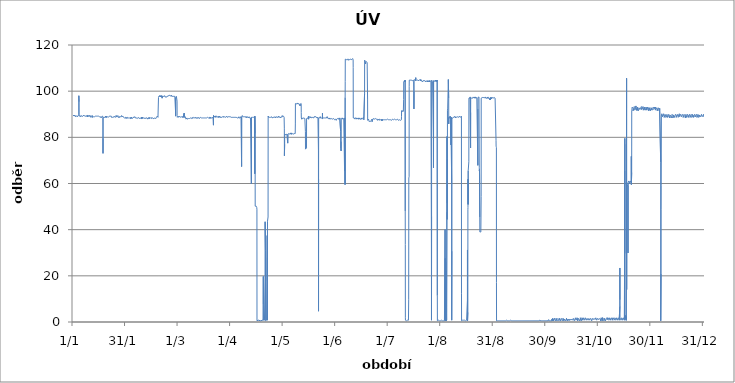
| Category | Series 0 |
|---|---|
| 2012-01-01 01:00:00 | 89.44 |
| 2012-01-01 02:00:00 | 89.7 |
| 2012-01-01 03:00:00 | 89.7 |
| 2012-01-01 04:00:00 | 89.44 |
| 2012-01-01 05:00:00 | 89.7 |
| 2012-01-01 06:00:00 | 89.7 |
| 2012-01-01 07:00:00 | 89.44 |
| 2012-01-01 08:00:00 | 89.7 |
| 2012-01-01 09:00:00 | 89.7 |
| 2012-01-01 10:00:00 | 89.7 |
| 2012-01-01 11:00:00 | 89.44 |
| 2012-01-01 12:00:00 | 89.44 |
| 2012-01-01 13:00:00 | 89.44 |
| 2012-01-01 14:00:00 | 89.44 |
| 2012-01-01 15:00:00 | 89.44 |
| 2012-01-01 16:00:00 | 89.44 |
| 2012-01-01 17:00:00 | 89.44 |
| 2012-01-01 18:00:00 | 89.18 |
| 2012-01-01 19:00:00 | 89.18 |
| 2012-01-01 20:00:00 | 89.44 |
| 2012-01-01 21:00:00 | 89.44 |
| 2012-01-01 22:00:00 | 89.44 |
| 2012-01-01 23:00:00 | 89.44 |
| 2012-01-02 | 89.7 |
| 2012-01-02 01:00:00 | 89.7 |
| 2012-01-02 02:00:00 | 89.44 |
| 2012-01-02 03:00:00 | 89.44 |
| 2012-01-02 04:00:00 | 89.7 |
| 2012-01-02 05:00:00 | 89.44 |
| 2012-01-02 06:00:00 | 89.44 |
| 2012-01-02 07:00:00 | 89.18 |
| 2012-01-02 08:00:00 | 89.18 |
| 2012-01-02 09:00:00 | 89.18 |
| 2012-01-02 10:00:00 | 88.92 |
| 2012-01-02 11:00:00 | 89.18 |
| 2012-01-02 12:00:00 | 89.18 |
| 2012-01-02 13:00:00 | 89.18 |
| 2012-01-02 14:00:00 | 89.18 |
| 2012-01-02 15:00:00 | 89.18 |
| 2012-01-02 16:00:00 | 89.18 |
| 2012-01-02 17:00:00 | 89.18 |
| 2012-01-02 18:00:00 | 88.92 |
| 2012-01-02 19:00:00 | 89.44 |
| 2012-01-02 20:00:00 | 89.18 |
| 2012-01-02 21:00:00 | 89.18 |
| 2012-01-02 22:00:00 | 89.18 |
| 2012-01-02 23:00:00 | 89.44 |
| 2012-01-03 | 89.18 |
| 2012-01-03 01:00:00 | 89.44 |
| 2012-01-03 02:00:00 | 89.44 |
| 2012-01-03 03:00:00 | 89.44 |
| 2012-01-03 04:00:00 | 89.44 |
| 2012-01-03 05:00:00 | 89.44 |
| 2012-01-03 06:00:00 | 89.18 |
| 2012-01-03 07:00:00 | 89.18 |
| 2012-01-03 08:00:00 | 88.92 |
| 2012-01-03 09:00:00 | 89.18 |
| 2012-01-03 10:00:00 | 88.92 |
| 2012-01-03 11:00:00 | 89.18 |
| 2012-01-03 12:00:00 | 88.92 |
| 2012-01-03 13:00:00 | 89.18 |
| 2012-01-03 14:00:00 | 89.18 |
| 2012-01-03 15:00:00 | 89.18 |
| 2012-01-03 16:00:00 | 88.92 |
| 2012-01-03 17:00:00 | 89.18 |
| 2012-01-03 18:00:00 | 88.92 |
| 2012-01-03 19:00:00 | 89.18 |
| 2012-01-03 20:00:00 | 89.18 |
| 2012-01-03 21:00:00 | 89.18 |
| 2012-01-03 22:00:00 | 89.18 |
| 2012-01-03 23:00:00 | 89.18 |
| 2012-01-04 | 89.44 |
| 2012-01-04 01:00:00 | 89.18 |
| 2012-01-04 02:00:00 | 89.44 |
| 2012-01-04 03:00:00 | 89.44 |
| 2012-01-04 04:00:00 | 89.18 |
| 2012-01-04 05:00:00 | 89.44 |
| 2012-01-04 06:00:00 | 89.18 |
| 2012-01-04 07:00:00 | 89.18 |
| 2012-01-04 08:00:00 | 88.92 |
| 2012-01-04 09:00:00 | 89.96 |
| 2012-01-04 10:00:00 | 98.02 |
| 2012-01-04 11:00:00 | 98.28 |
| 2012-01-04 12:00:00 | 98.02 |
| 2012-01-04 13:00:00 | 95.42 |
| 2012-01-04 14:00:00 | 89.18 |
| 2012-01-04 15:00:00 | 89.18 |
| 2012-01-04 16:00:00 | 88.92 |
| 2012-01-04 17:00:00 | 89.18 |
| 2012-01-04 18:00:00 | 89.18 |
| 2012-01-04 19:00:00 | 89.18 |
| 2012-01-04 20:00:00 | 89.18 |
| 2012-01-04 21:00:00 | 89.18 |
| 2012-01-04 22:00:00 | 89.18 |
| 2012-01-04 23:00:00 | 89.18 |
| 2012-01-05 | 89.44 |
| 2012-01-05 01:00:00 | 89.18 |
| 2012-01-05 02:00:00 | 89.44 |
| 2012-01-05 03:00:00 | 89.44 |
| 2012-01-05 04:00:00 | 89.44 |
| 2012-01-05 05:00:00 | 89.44 |
| 2012-01-05 06:00:00 | 89.18 |
| 2012-01-05 07:00:00 | 88.92 |
| 2012-01-05 08:00:00 | 89.18 |
| 2012-01-05 09:00:00 | 88.92 |
| 2012-01-05 10:00:00 | 89.18 |
| 2012-01-05 11:00:00 | 89.18 |
| 2012-01-05 12:00:00 | 88.92 |
| 2012-01-05 13:00:00 | 89.18 |
| 2012-01-05 14:00:00 | 89.18 |
| 2012-01-05 15:00:00 | 89.18 |
| 2012-01-05 16:00:00 | 88.92 |
| 2012-01-05 17:00:00 | 89.18 |
| 2012-01-05 18:00:00 | 89.18 |
| 2012-01-05 19:00:00 | 88.92 |
| 2012-01-05 20:00:00 | 89.18 |
| 2012-01-05 21:00:00 | 89.44 |
| 2012-01-05 22:00:00 | 89.18 |
| 2012-01-05 23:00:00 | 89.18 |
| 2012-01-06 | 89.44 |
| 2012-01-06 01:00:00 | 89.18 |
| 2012-01-06 02:00:00 | 89.44 |
| 2012-01-06 03:00:00 | 89.44 |
| 2012-01-06 04:00:00 | 89.18 |
| 2012-01-06 05:00:00 | 89.44 |
| 2012-01-06 06:00:00 | 89.18 |
| 2012-01-06 07:00:00 | 89.18 |
| 2012-01-06 08:00:00 | 88.92 |
| 2012-01-06 09:00:00 | 89.18 |
| 2012-01-06 10:00:00 | 88.92 |
| 2012-01-06 11:00:00 | 89.18 |
| 2012-01-06 12:00:00 | 89.18 |
| 2012-01-06 13:00:00 | 88.92 |
| 2012-01-06 14:00:00 | 89.18 |
| 2012-01-06 15:00:00 | 89.18 |
| 2012-01-06 16:00:00 | 89.18 |
| 2012-01-06 17:00:00 | 89.18 |
| 2012-01-06 18:00:00 | 88.92 |
| 2012-01-06 19:00:00 | 89.18 |
| 2012-01-06 20:00:00 | 89.18 |
| 2012-01-06 21:00:00 | 89.44 |
| 2012-01-06 22:00:00 | 89.18 |
| 2012-01-06 23:00:00 | 89.44 |
| 2012-01-07 | 89.18 |
| 2012-01-07 01:00:00 | 89.44 |
| 2012-01-07 02:00:00 | 89.44 |
| 2012-01-07 03:00:00 | 89.44 |
| 2012-01-07 04:00:00 | 89.44 |
| 2012-01-07 05:00:00 | 89.44 |
| 2012-01-07 06:00:00 | 89.7 |
| 2012-01-07 07:00:00 | 89.18 |
| 2012-01-07 08:00:00 | 89.44 |
| 2012-01-07 09:00:00 | 89.18 |
| 2012-01-07 10:00:00 | 89.18 |
| 2012-01-07 11:00:00 | 89.44 |
| 2012-01-07 12:00:00 | 89.18 |
| 2012-01-07 13:00:00 | 89.18 |
| 2012-01-07 14:00:00 | 89.18 |
| 2012-01-07 15:00:00 | 89.18 |
| 2012-01-07 16:00:00 | 89.18 |
| 2012-01-07 17:00:00 | 89.18 |
| 2012-01-07 18:00:00 | 89.18 |
| 2012-01-07 19:00:00 | 89.18 |
| 2012-01-07 20:00:00 | 89.18 |
| 2012-01-07 21:00:00 | 89.18 |
| 2012-01-07 22:00:00 | 89.44 |
| 2012-01-07 23:00:00 | 89.18 |
| 2012-01-08 | 89.44 |
| 2012-01-08 01:00:00 | 89.18 |
| 2012-01-08 02:00:00 | 89.44 |
| 2012-01-08 03:00:00 | 89.18 |
| 2012-01-08 04:00:00 | 89.44 |
| 2012-01-08 05:00:00 | 89.44 |
| 2012-01-08 06:00:00 | 89.44 |
| 2012-01-08 07:00:00 | 89.18 |
| 2012-01-08 08:00:00 | 89.18 |
| 2012-01-08 09:00:00 | 89.44 |
| 2012-01-08 10:00:00 | 88.92 |
| 2012-01-08 11:00:00 | 89.18 |
| 2012-01-08 12:00:00 | 89.18 |
| 2012-01-08 13:00:00 | 89.18 |
| 2012-01-08 14:00:00 | 89.18 |
| 2012-01-08 15:00:00 | 89.18 |
| 2012-01-08 16:00:00 | 89.18 |
| 2012-01-08 17:00:00 | 88.92 |
| 2012-01-08 18:00:00 | 89.18 |
| 2012-01-08 19:00:00 | 89.18 |
| 2012-01-08 20:00:00 | 89.18 |
| 2012-01-08 21:00:00 | 89.18 |
| 2012-01-08 22:00:00 | 89.18 |
| 2012-01-08 23:00:00 | 89.44 |
| 2012-01-09 | 89.44 |
| 2012-01-09 01:00:00 | 89.18 |
| 2012-01-09 02:00:00 | 89.44 |
| 2012-01-09 03:00:00 | 89.18 |
| 2012-01-09 04:00:00 | 89.44 |
| 2012-01-09 05:00:00 | 89.44 |
| 2012-01-09 06:00:00 | 89.18 |
| 2012-01-09 07:00:00 | 88.92 |
| 2012-01-09 08:00:00 | 89.18 |
| 2012-01-09 09:00:00 | 88.92 |
| 2012-01-09 10:00:00 | 88.92 |
| 2012-01-09 11:00:00 | 89.44 |
| 2012-01-09 12:00:00 | 88.92 |
| 2012-01-09 13:00:00 | 89.18 |
| 2012-01-09 14:00:00 | 89.18 |
| 2012-01-09 15:00:00 | 88.92 |
| 2012-01-09 16:00:00 | 89.18 |
| 2012-01-09 17:00:00 | 88.92 |
| 2012-01-09 18:00:00 | 88.92 |
| 2012-01-09 19:00:00 | 89.18 |
| 2012-01-09 20:00:00 | 89.18 |
| 2012-01-09 21:00:00 | 89.18 |
| 2012-01-09 22:00:00 | 89.18 |
| 2012-01-09 23:00:00 | 89.18 |
| 2012-01-10 | 89.18 |
| 2012-01-10 01:00:00 | 89.44 |
| 2012-01-10 02:00:00 | 89.18 |
| 2012-01-10 03:00:00 | 89.18 |
| 2012-01-10 04:00:00 | 89.44 |
| 2012-01-10 05:00:00 | 89.44 |
| 2012-01-10 06:00:00 | 89.44 |
| 2012-01-10 07:00:00 | 89.18 |
| 2012-01-10 08:00:00 | 88.92 |
| 2012-01-10 09:00:00 | 89.18 |
| 2012-01-10 10:00:00 | 89.18 |
| 2012-01-10 11:00:00 | 89.44 |
| 2012-01-10 12:00:00 | 89.18 |
| 2012-01-10 13:00:00 | 89.18 |
| 2012-01-10 14:00:00 | 89.44 |
| 2012-01-10 15:00:00 | 89.18 |
| 2012-01-10 16:00:00 | 89.18 |
| 2012-01-10 17:00:00 | 89.18 |
| 2012-01-10 18:00:00 | 89.18 |
| 2012-01-10 19:00:00 | 89.18 |
| 2012-01-10 20:00:00 | 89.44 |
| 2012-01-10 21:00:00 | 89.18 |
| 2012-01-10 22:00:00 | 89.44 |
| 2012-01-10 23:00:00 | 89.44 |
| 2012-01-11 | 89.44 |
| 2012-01-11 01:00:00 | 89.44 |
| 2012-01-11 02:00:00 | 89.44 |
| 2012-01-11 03:00:00 | 89.44 |
| 2012-01-11 04:00:00 | 89.7 |
| 2012-01-11 05:00:00 | 89.18 |
| 2012-01-11 06:00:00 | 89.44 |
| 2012-01-11 07:00:00 | 89.18 |
| 2012-01-11 08:00:00 | 88.66 |
| 2012-01-11 09:00:00 | 88.66 |
| 2012-01-11 10:00:00 | 88.92 |
| 2012-01-11 11:00:00 | 88.66 |
| 2012-01-11 12:00:00 | 88.92 |
| 2012-01-11 13:00:00 | 88.66 |
| 2012-01-11 14:00:00 | 88.66 |
| 2012-01-11 15:00:00 | 88.92 |
| 2012-01-11 16:00:00 | 88.66 |
| 2012-01-11 17:00:00 | 88.92 |
| 2012-01-11 18:00:00 | 88.66 |
| 2012-01-11 19:00:00 | 88.92 |
| 2012-01-11 20:00:00 | 88.66 |
| 2012-01-11 21:00:00 | 88.92 |
| 2012-01-11 22:00:00 | 88.92 |
| 2012-01-11 23:00:00 | 88.92 |
| 2012-01-12 | 89.18 |
| 2012-01-12 01:00:00 | 89.18 |
| 2012-01-12 02:00:00 | 89.18 |
| 2012-01-12 03:00:00 | 89.44 |
| 2012-01-12 04:00:00 | 89.44 |
| 2012-01-12 05:00:00 | 89.44 |
| 2012-01-12 06:00:00 | 89.18 |
| 2012-01-12 07:00:00 | 89.18 |
| 2012-01-12 08:00:00 | 88.66 |
| 2012-01-12 09:00:00 | 88.92 |
| 2012-01-12 10:00:00 | 88.92 |
| 2012-01-12 11:00:00 | 88.92 |
| 2012-01-12 12:00:00 | 88.92 |
| 2012-01-12 13:00:00 | 88.92 |
| 2012-01-12 14:00:00 | 88.92 |
| 2012-01-12 15:00:00 | 88.92 |
| 2012-01-12 16:00:00 | 88.92 |
| 2012-01-12 17:00:00 | 88.66 |
| 2012-01-12 18:00:00 | 88.92 |
| 2012-01-12 19:00:00 | 88.92 |
| 2012-01-12 20:00:00 | 88.92 |
| 2012-01-12 21:00:00 | 88.92 |
| 2012-01-12 22:00:00 | 88.92 |
| 2012-01-12 23:00:00 | 88.92 |
| 2012-01-13 | 89.18 |
| 2012-01-13 01:00:00 | 89.18 |
| 2012-01-13 02:00:00 | 88.92 |
| 2012-01-13 03:00:00 | 89.18 |
| 2012-01-13 04:00:00 | 89.18 |
| 2012-01-13 05:00:00 | 89.18 |
| 2012-01-13 06:00:00 | 88.92 |
| 2012-01-13 07:00:00 | 88.66 |
| 2012-01-13 08:00:00 | 88.92 |
| 2012-01-13 09:00:00 | 88.66 |
| 2012-01-13 10:00:00 | 88.92 |
| 2012-01-13 11:00:00 | 88.92 |
| 2012-01-13 12:00:00 | 88.92 |
| 2012-01-13 13:00:00 | 88.92 |
| 2012-01-13 14:00:00 | 88.92 |
| 2012-01-13 15:00:00 | 88.92 |
| 2012-01-13 16:00:00 | 88.92 |
| 2012-01-13 17:00:00 | 88.66 |
| 2012-01-13 18:00:00 | 88.92 |
| 2012-01-13 19:00:00 | 88.66 |
| 2012-01-13 20:00:00 | 88.92 |
| 2012-01-13 21:00:00 | 88.92 |
| 2012-01-13 22:00:00 | 88.92 |
| 2012-01-13 23:00:00 | 88.92 |
| 2012-01-14 | 88.92 |
| 2012-01-14 01:00:00 | 88.92 |
| 2012-01-14 02:00:00 | 89.18 |
| 2012-01-14 03:00:00 | 89.18 |
| 2012-01-14 04:00:00 | 89.44 |
| 2012-01-14 05:00:00 | 89.44 |
| 2012-01-14 06:00:00 | 89.44 |
| 2012-01-14 07:00:00 | 89.44 |
| 2012-01-14 08:00:00 | 89.18 |
| 2012-01-14 09:00:00 | 89.44 |
| 2012-01-14 10:00:00 | 89.44 |
| 2012-01-14 11:00:00 | 89.18 |
| 2012-01-14 12:00:00 | 89.18 |
| 2012-01-14 13:00:00 | 88.92 |
| 2012-01-14 14:00:00 | 89.18 |
| 2012-01-14 15:00:00 | 89.18 |
| 2012-01-14 16:00:00 | 89.18 |
| 2012-01-14 17:00:00 | 88.92 |
| 2012-01-14 18:00:00 | 89.18 |
| 2012-01-14 19:00:00 | 89.18 |
| 2012-01-14 20:00:00 | 89.18 |
| 2012-01-14 21:00:00 | 89.18 |
| 2012-01-14 22:00:00 | 89.18 |
| 2012-01-14 23:00:00 | 89.18 |
| 2012-01-15 | 89.18 |
| 2012-01-15 01:00:00 | 89.18 |
| 2012-01-15 02:00:00 | 89.44 |
| 2012-01-15 03:00:00 | 89.18 |
| 2012-01-15 04:00:00 | 89.44 |
| 2012-01-15 05:00:00 | 89.18 |
| 2012-01-15 06:00:00 | 89.18 |
| 2012-01-15 07:00:00 | 89.44 |
| 2012-01-15 08:00:00 | 89.18 |
| 2012-01-15 09:00:00 | 89.18 |
| 2012-01-15 10:00:00 | 89.18 |
| 2012-01-15 11:00:00 | 89.18 |
| 2012-01-15 12:00:00 | 89.18 |
| 2012-01-15 13:00:00 | 89.18 |
| 2012-01-15 14:00:00 | 89.18 |
| 2012-01-15 15:00:00 | 89.44 |
| 2012-01-15 16:00:00 | 89.18 |
| 2012-01-15 17:00:00 | 89.18 |
| 2012-01-15 18:00:00 | 88.92 |
| 2012-01-15 19:00:00 | 89.18 |
| 2012-01-15 20:00:00 | 89.18 |
| 2012-01-15 21:00:00 | 88.92 |
| 2012-01-15 22:00:00 | 89.18 |
| 2012-01-15 23:00:00 | 89.44 |
| 2012-01-16 | 89.18 |
| 2012-01-16 01:00:00 | 89.18 |
| 2012-01-16 02:00:00 | 89.18 |
| 2012-01-16 03:00:00 | 89.44 |
| 2012-01-16 04:00:00 | 89.44 |
| 2012-01-16 05:00:00 | 89.18 |
| 2012-01-16 06:00:00 | 89.18 |
| 2012-01-16 07:00:00 | 89.18 |
| 2012-01-16 08:00:00 | 88.92 |
| 2012-01-16 09:00:00 | 89.18 |
| 2012-01-16 10:00:00 | 88.92 |
| 2012-01-16 11:00:00 | 88.92 |
| 2012-01-16 12:00:00 | 88.66 |
| 2012-01-16 13:00:00 | 88.92 |
| 2012-01-16 14:00:00 | 88.92 |
| 2012-01-16 15:00:00 | 88.92 |
| 2012-01-16 16:00:00 | 88.92 |
| 2012-01-16 17:00:00 | 88.66 |
| 2012-01-16 18:00:00 | 88.92 |
| 2012-01-16 19:00:00 | 88.66 |
| 2012-01-16 20:00:00 | 88.66 |
| 2012-01-16 21:00:00 | 88.92 |
| 2012-01-16 22:00:00 | 88.92 |
| 2012-01-16 23:00:00 | 88.66 |
| 2012-01-17 | 88.92 |
| 2012-01-17 01:00:00 | 88.92 |
| 2012-01-17 02:00:00 | 88.66 |
| 2012-01-17 03:00:00 | 88.92 |
| 2012-01-17 04:00:00 | 88.92 |
| 2012-01-17 05:00:00 | 88.66 |
| 2012-01-17 06:00:00 | 88.92 |
| 2012-01-17 07:00:00 | 88.66 |
| 2012-01-17 08:00:00 | 88.4 |
| 2012-01-17 09:00:00 | 88.66 |
| 2012-01-17 10:00:00 | 88.4 |
| 2012-01-17 11:00:00 | 88.66 |
| 2012-01-17 12:00:00 | 88.66 |
| 2012-01-17 13:00:00 | 88.92 |
| 2012-01-17 14:00:00 | 88.66 |
| 2012-01-17 15:00:00 | 88.92 |
| 2012-01-17 16:00:00 | 88.92 |
| 2012-01-17 17:00:00 | 88.92 |
| 2012-01-17 18:00:00 | 88.92 |
| 2012-01-17 19:00:00 | 88.92 |
| 2012-01-17 20:00:00 | 89.18 |
| 2012-01-17 21:00:00 | 88.92 |
| 2012-01-17 22:00:00 | 88.92 |
| 2012-01-17 23:00:00 | 89.18 |
| 2012-01-18 | 89.18 |
| 2012-01-18 01:00:00 | 88.92 |
| 2012-01-18 02:00:00 | 89.18 |
| 2012-01-18 03:00:00 | 89.18 |
| 2012-01-18 04:00:00 | 89.18 |
| 2012-01-18 05:00:00 | 89.18 |
| 2012-01-18 06:00:00 | 89.18 |
| 2012-01-18 07:00:00 | 88.92 |
| 2012-01-18 08:00:00 | 88.66 |
| 2012-01-18 09:00:00 | 88.92 |
| 2012-01-18 10:00:00 | 73.06 |
| 2012-01-18 11:00:00 | 79.56 |
| 2012-01-18 12:00:00 | 88.66 |
| 2012-01-18 13:00:00 | 88.66 |
| 2012-01-18 14:00:00 | 88.66 |
| 2012-01-18 15:00:00 | 88.66 |
| 2012-01-18 16:00:00 | 88.66 |
| 2012-01-18 17:00:00 | 88.66 |
| 2012-01-18 18:00:00 | 88.66 |
| 2012-01-18 19:00:00 | 88.66 |
| 2012-01-18 20:00:00 | 88.66 |
| 2012-01-18 21:00:00 | 88.66 |
| 2012-01-18 22:00:00 | 88.92 |
| 2012-01-18 23:00:00 | 88.92 |
| 2012-01-19 | 88.92 |
| 2012-01-19 01:00:00 | 88.66 |
| 2012-01-19 02:00:00 | 88.66 |
| 2012-01-19 03:00:00 | 88.92 |
| 2012-01-19 04:00:00 | 88.66 |
| 2012-01-19 05:00:00 | 88.92 |
| 2012-01-19 06:00:00 | 88.92 |
| 2012-01-19 07:00:00 | 88.66 |
| 2012-01-19 08:00:00 | 88.66 |
| 2012-01-19 09:00:00 | 88.66 |
| 2012-01-19 10:00:00 | 88.66 |
| 2012-01-19 11:00:00 | 88.66 |
| 2012-01-19 12:00:00 | 88.66 |
| 2012-01-19 13:00:00 | 88.66 |
| 2012-01-19 14:00:00 | 88.92 |
| 2012-01-19 15:00:00 | 88.66 |
| 2012-01-19 16:00:00 | 88.66 |
| 2012-01-19 17:00:00 | 88.66 |
| 2012-01-19 18:00:00 | 88.66 |
| 2012-01-19 19:00:00 | 88.66 |
| 2012-01-19 20:00:00 | 88.66 |
| 2012-01-19 21:00:00 | 88.92 |
| 2012-01-19 22:00:00 | 88.92 |
| 2012-01-19 23:00:00 | 88.92 |
| 2012-01-20 | 89.18 |
| 2012-01-20 01:00:00 | 88.92 |
| 2012-01-20 02:00:00 | 88.66 |
| 2012-01-20 03:00:00 | 89.18 |
| 2012-01-20 04:00:00 | 88.92 |
| 2012-01-20 05:00:00 | 89.18 |
| 2012-01-20 06:00:00 | 89.18 |
| 2012-01-20 07:00:00 | 88.92 |
| 2012-01-20 08:00:00 | 88.66 |
| 2012-01-20 09:00:00 | 88.4 |
| 2012-01-20 10:00:00 | 88.66 |
| 2012-01-20 11:00:00 | 88.92 |
| 2012-01-20 12:00:00 | 88.4 |
| 2012-01-20 13:00:00 | 88.66 |
| 2012-01-20 14:00:00 | 88.66 |
| 2012-01-20 15:00:00 | 88.66 |
| 2012-01-20 16:00:00 | 88.66 |
| 2012-01-20 17:00:00 | 88.66 |
| 2012-01-20 18:00:00 | 88.66 |
| 2012-01-20 19:00:00 | 88.66 |
| 2012-01-20 20:00:00 | 88.66 |
| 2012-01-20 21:00:00 | 88.66 |
| 2012-01-20 22:00:00 | 88.92 |
| 2012-01-20 23:00:00 | 88.92 |
| 2012-01-21 | 88.92 |
| 2012-01-21 01:00:00 | 88.92 |
| 2012-01-21 02:00:00 | 88.92 |
| 2012-01-21 03:00:00 | 88.92 |
| 2012-01-21 04:00:00 | 89.18 |
| 2012-01-21 05:00:00 | 89.18 |
| 2012-01-21 06:00:00 | 88.92 |
| 2012-01-21 07:00:00 | 88.92 |
| 2012-01-21 08:00:00 | 88.92 |
| 2012-01-21 09:00:00 | 88.66 |
| 2012-01-21 10:00:00 | 88.92 |
| 2012-01-21 11:00:00 | 88.92 |
| 2012-01-21 12:00:00 | 88.66 |
| 2012-01-21 13:00:00 | 88.92 |
| 2012-01-21 14:00:00 | 88.92 |
| 2012-01-21 15:00:00 | 88.92 |
| 2012-01-21 16:00:00 | 88.66 |
| 2012-01-21 17:00:00 | 88.66 |
| 2012-01-21 18:00:00 | 88.92 |
| 2012-01-21 19:00:00 | 88.92 |
| 2012-01-21 20:00:00 | 88.92 |
| 2012-01-21 21:00:00 | 88.92 |
| 2012-01-21 22:00:00 | 88.92 |
| 2012-01-21 23:00:00 | 88.92 |
| 2012-01-22 | 88.92 |
| 2012-01-22 01:00:00 | 89.18 |
| 2012-01-22 02:00:00 | 88.92 |
| 2012-01-22 03:00:00 | 88.92 |
| 2012-01-22 04:00:00 | 89.18 |
| 2012-01-22 05:00:00 | 89.18 |
| 2012-01-22 06:00:00 | 89.18 |
| 2012-01-22 07:00:00 | 88.92 |
| 2012-01-22 08:00:00 | 89.18 |
| 2012-01-22 09:00:00 | 88.92 |
| 2012-01-22 10:00:00 | 89.18 |
| 2012-01-22 11:00:00 | 89.18 |
| 2012-01-22 12:00:00 | 88.92 |
| 2012-01-22 13:00:00 | 89.18 |
| 2012-01-22 14:00:00 | 89.44 |
| 2012-01-22 15:00:00 | 89.18 |
| 2012-01-22 16:00:00 | 88.92 |
| 2012-01-22 17:00:00 | 89.18 |
| 2012-01-22 18:00:00 | 88.92 |
| 2012-01-22 19:00:00 | 89.18 |
| 2012-01-22 20:00:00 | 89.18 |
| 2012-01-22 21:00:00 | 89.18 |
| 2012-01-22 22:00:00 | 89.18 |
| 2012-01-22 23:00:00 | 89.18 |
| 2012-01-23 | 88.92 |
| 2012-01-23 01:00:00 | 89.18 |
| 2012-01-23 02:00:00 | 89.18 |
| 2012-01-23 03:00:00 | 89.18 |
| 2012-01-23 04:00:00 | 89.18 |
| 2012-01-23 05:00:00 | 89.18 |
| 2012-01-23 06:00:00 | 89.18 |
| 2012-01-23 07:00:00 | 88.66 |
| 2012-01-23 08:00:00 | 88.4 |
| 2012-01-23 09:00:00 | 88.4 |
| 2012-01-23 10:00:00 | 88.4 |
| 2012-01-23 11:00:00 | 88.4 |
| 2012-01-23 12:00:00 | 88.4 |
| 2012-01-23 13:00:00 | 88.66 |
| 2012-01-23 14:00:00 | 88.66 |
| 2012-01-23 15:00:00 | 88.66 |
| 2012-01-23 16:00:00 | 88.4 |
| 2012-01-23 17:00:00 | 88.4 |
| 2012-01-23 18:00:00 | 88.4 |
| 2012-01-23 19:00:00 | 88.92 |
| 2012-01-23 20:00:00 | 88.66 |
| 2012-01-23 21:00:00 | 88.66 |
| 2012-01-23 22:00:00 | 88.92 |
| 2012-01-23 23:00:00 | 88.66 |
| 2012-01-24 | 88.92 |
| 2012-01-24 01:00:00 | 88.92 |
| 2012-01-24 02:00:00 | 88.66 |
| 2012-01-24 03:00:00 | 88.92 |
| 2012-01-24 04:00:00 | 88.66 |
| 2012-01-24 05:00:00 | 88.92 |
| 2012-01-24 06:00:00 | 88.66 |
| 2012-01-24 07:00:00 | 88.66 |
| 2012-01-24 08:00:00 | 88.4 |
| 2012-01-24 09:00:00 | 88.66 |
| 2012-01-24 10:00:00 | 88.4 |
| 2012-01-24 11:00:00 | 88.66 |
| 2012-01-24 12:00:00 | 88.4 |
| 2012-01-24 13:00:00 | 88.66 |
| 2012-01-24 14:00:00 | 88.92 |
| 2012-01-24 15:00:00 | 88.66 |
| 2012-01-24 16:00:00 | 88.66 |
| 2012-01-24 17:00:00 | 88.66 |
| 2012-01-24 18:00:00 | 88.4 |
| 2012-01-24 19:00:00 | 88.92 |
| 2012-01-24 20:00:00 | 88.66 |
| 2012-01-24 21:00:00 | 89.18 |
| 2012-01-24 22:00:00 | 88.92 |
| 2012-01-24 23:00:00 | 89.18 |
| 2012-01-25 | 89.44 |
| 2012-01-25 01:00:00 | 89.44 |
| 2012-01-25 02:00:00 | 89.44 |
| 2012-01-25 03:00:00 | 89.44 |
| 2012-01-25 04:00:00 | 89.44 |
| 2012-01-25 05:00:00 | 89.18 |
| 2012-01-25 06:00:00 | 89.18 |
| 2012-01-25 07:00:00 | 88.92 |
| 2012-01-25 08:00:00 | 88.66 |
| 2012-01-25 09:00:00 | 88.92 |
| 2012-01-25 10:00:00 | 88.66 |
| 2012-01-25 11:00:00 | 88.66 |
| 2012-01-25 12:00:00 | 88.92 |
| 2012-01-25 13:00:00 | 88.92 |
| 2012-01-25 14:00:00 | 88.92 |
| 2012-01-25 15:00:00 | 88.92 |
| 2012-01-25 16:00:00 | 88.92 |
| 2012-01-25 17:00:00 | 88.92 |
| 2012-01-25 18:00:00 | 88.92 |
| 2012-01-25 19:00:00 | 88.92 |
| 2012-01-25 20:00:00 | 88.92 |
| 2012-01-25 21:00:00 | 88.92 |
| 2012-01-25 22:00:00 | 88.92 |
| 2012-01-25 23:00:00 | 89.18 |
| 2012-01-26 | 89.18 |
| 2012-01-26 01:00:00 | 89.44 |
| 2012-01-26 02:00:00 | 89.18 |
| 2012-01-26 03:00:00 | 89.44 |
| 2012-01-26 04:00:00 | 89.18 |
| 2012-01-26 05:00:00 | 89.44 |
| 2012-01-26 06:00:00 | 88.92 |
| 2012-01-26 07:00:00 | 88.92 |
| 2012-01-26 08:00:00 | 88.92 |
| 2012-01-26 09:00:00 | 89.18 |
| 2012-01-26 10:00:00 | 88.92 |
| 2012-01-26 11:00:00 | 89.18 |
| 2012-01-26 12:00:00 | 88.92 |
| 2012-01-26 13:00:00 | 89.18 |
| 2012-01-26 14:00:00 | 89.18 |
| 2012-01-26 15:00:00 | 89.18 |
| 2012-01-26 16:00:00 | 88.92 |
| 2012-01-26 17:00:00 | 88.92 |
| 2012-01-26 18:00:00 | 88.92 |
| 2012-01-26 19:00:00 | 88.92 |
| 2012-01-26 20:00:00 | 88.92 |
| 2012-01-26 21:00:00 | 89.18 |
| 2012-01-26 22:00:00 | 89.18 |
| 2012-01-26 23:00:00 | 89.18 |
| 2012-01-27 | 89.44 |
| 2012-01-27 01:00:00 | 89.18 |
| 2012-01-27 02:00:00 | 89.18 |
| 2012-01-27 03:00:00 | 89.44 |
| 2012-01-27 04:00:00 | 89.18 |
| 2012-01-27 05:00:00 | 89.18 |
| 2012-01-27 06:00:00 | 89.18 |
| 2012-01-27 07:00:00 | 89.18 |
| 2012-01-27 08:00:00 | 88.92 |
| 2012-01-27 09:00:00 | 88.66 |
| 2012-01-27 10:00:00 | 88.66 |
| 2012-01-27 11:00:00 | 88.66 |
| 2012-01-27 12:00:00 | 88.66 |
| 2012-01-27 13:00:00 | 88.66 |
| 2012-01-27 14:00:00 | 88.66 |
| 2012-01-27 15:00:00 | 88.92 |
| 2012-01-27 16:00:00 | 88.66 |
| 2012-01-27 17:00:00 | 88.4 |
| 2012-01-27 18:00:00 | 88.66 |
| 2012-01-27 19:00:00 | 88.92 |
| 2012-01-27 20:00:00 | 88.66 |
| 2012-01-27 21:00:00 | 88.92 |
| 2012-01-27 22:00:00 | 88.92 |
| 2012-01-27 23:00:00 | 88.92 |
| 2012-01-28 | 89.18 |
| 2012-01-28 01:00:00 | 88.92 |
| 2012-01-28 02:00:00 | 89.18 |
| 2012-01-28 03:00:00 | 89.18 |
| 2012-01-28 04:00:00 | 89.18 |
| 2012-01-28 05:00:00 | 89.18 |
| 2012-01-28 06:00:00 | 89.18 |
| 2012-01-28 07:00:00 | 89.18 |
| 2012-01-28 08:00:00 | 89.18 |
| 2012-01-28 09:00:00 | 88.92 |
| 2012-01-28 10:00:00 | 89.18 |
| 2012-01-28 11:00:00 | 88.92 |
| 2012-01-28 12:00:00 | 89.18 |
| 2012-01-28 13:00:00 | 89.18 |
| 2012-01-28 14:00:00 | 89.18 |
| 2012-01-28 15:00:00 | 89.18 |
| 2012-01-28 16:00:00 | 88.92 |
| 2012-01-28 17:00:00 | 88.92 |
| 2012-01-28 18:00:00 | 88.92 |
| 2012-01-28 19:00:00 | 88.92 |
| 2012-01-28 20:00:00 | 88.92 |
| 2012-01-28 21:00:00 | 88.92 |
| 2012-01-28 22:00:00 | 89.18 |
| 2012-01-28 23:00:00 | 88.92 |
| 2012-01-29 | 89.18 |
| 2012-01-29 01:00:00 | 89.18 |
| 2012-01-29 02:00:00 | 89.18 |
| 2012-01-29 03:00:00 | 89.44 |
| 2012-01-29 04:00:00 | 89.18 |
| 2012-01-29 05:00:00 | 89.44 |
| 2012-01-29 06:00:00 | 89.18 |
| 2012-01-29 07:00:00 | 89.18 |
| 2012-01-29 08:00:00 | 89.44 |
| 2012-01-29 09:00:00 | 88.92 |
| 2012-01-29 10:00:00 | 89.18 |
| 2012-01-29 11:00:00 | 88.92 |
| 2012-01-29 12:00:00 | 88.92 |
| 2012-01-29 13:00:00 | 88.92 |
| 2012-01-29 14:00:00 | 89.18 |
| 2012-01-29 15:00:00 | 88.92 |
| 2012-01-29 16:00:00 | 88.92 |
| 2012-01-29 17:00:00 | 88.92 |
| 2012-01-29 18:00:00 | 88.92 |
| 2012-01-29 19:00:00 | 89.18 |
| 2012-01-29 20:00:00 | 89.18 |
| 2012-01-29 21:00:00 | 89.18 |
| 2012-01-29 22:00:00 | 88.92 |
| 2012-01-29 23:00:00 | 89.18 |
| 2012-01-30 | 89.18 |
| 2012-01-30 01:00:00 | 89.18 |
| 2012-01-30 02:00:00 | 89.18 |
| 2012-01-30 03:00:00 | 89.44 |
| 2012-01-30 04:00:00 | 89.18 |
| 2012-01-30 05:00:00 | 89.18 |
| 2012-01-30 06:00:00 | 89.18 |
| 2012-01-30 07:00:00 | 88.66 |
| 2012-01-30 08:00:00 | 88.4 |
| 2012-01-30 09:00:00 | 88.4 |
| 2012-01-30 10:00:00 | 88.4 |
| 2012-01-30 11:00:00 | 88.4 |
| 2012-01-30 12:00:00 | 88.4 |
| 2012-01-30 13:00:00 | 88.4 |
| 2012-01-30 14:00:00 | 88.4 |
| 2012-01-30 15:00:00 | 88.4 |
| 2012-01-30 16:00:00 | 88.66 |
| 2012-01-30 17:00:00 | 88.4 |
| 2012-01-30 18:00:00 | 88.4 |
| 2012-01-30 19:00:00 | 88.4 |
| 2012-01-30 20:00:00 | 88.4 |
| 2012-01-30 21:00:00 | 88.4 |
| 2012-01-30 22:00:00 | 88.66 |
| 2012-01-30 23:00:00 | 88.66 |
| 2012-01-31 | 88.66 |
| 2012-01-31 01:00:00 | 88.66 |
| 2012-01-31 02:00:00 | 88.66 |
| 2012-01-31 03:00:00 | 88.66 |
| 2012-01-31 04:00:00 | 88.66 |
| 2012-01-31 05:00:00 | 88.4 |
| 2012-01-31 06:00:00 | 88.4 |
| 2012-01-31 07:00:00 | 88.4 |
| 2012-01-31 08:00:00 | 88.14 |
| 2012-01-31 09:00:00 | 88.4 |
| 2012-01-31 10:00:00 | 88.4 |
| 2012-01-31 11:00:00 | 88.66 |
| 2012-01-31 12:00:00 | 88.4 |
| 2012-01-31 13:00:00 | 88.4 |
| 2012-01-31 14:00:00 | 88.4 |
| 2012-01-31 15:00:00 | 88.4 |
| 2012-01-31 16:00:00 | 88.66 |
| 2012-01-31 17:00:00 | 88.14 |
| 2012-01-31 18:00:00 | 88.4 |
| 2012-01-31 19:00:00 | 88.4 |
| 2012-01-31 20:00:00 | 88.4 |
| 2012-01-31 21:00:00 | 88.66 |
| 2012-01-31 22:00:00 | 88.4 |
| 2012-01-31 23:00:00 | 88.66 |
| 2012-02-01 | 88.66 |
| 2012-02-01 01:00:00 | 88.4 |
| 2012-02-01 02:00:00 | 88.66 |
| 2012-02-01 03:00:00 | 88.66 |
| 2012-02-01 04:00:00 | 88.4 |
| 2012-02-01 05:00:00 | 88.66 |
| 2012-02-01 06:00:00 | 88.66 |
| 2012-02-01 07:00:00 | 88.4 |
| 2012-02-01 08:00:00 | 88.14 |
| 2012-02-01 09:00:00 | 88.4 |
| 2012-02-01 10:00:00 | 88.4 |
| 2012-02-01 11:00:00 | 88.4 |
| 2012-02-01 12:00:00 | 88.4 |
| 2012-02-01 13:00:00 | 88.66 |
| 2012-02-01 14:00:00 | 88.4 |
| 2012-02-01 15:00:00 | 88.4 |
| 2012-02-01 16:00:00 | 88.4 |
| 2012-02-01 17:00:00 | 88.4 |
| 2012-02-01 18:00:00 | 88.4 |
| 2012-02-01 19:00:00 | 88.4 |
| 2012-02-01 20:00:00 | 88.4 |
| 2012-02-01 21:00:00 | 88.66 |
| 2012-02-01 22:00:00 | 88.4 |
| 2012-02-01 23:00:00 | 88.66 |
| 2012-02-02 | 88.4 |
| 2012-02-02 01:00:00 | 88.66 |
| 2012-02-02 02:00:00 | 88.4 |
| 2012-02-02 03:00:00 | 88.4 |
| 2012-02-02 04:00:00 | 88.66 |
| 2012-02-02 05:00:00 | 88.4 |
| 2012-02-02 06:00:00 | 88.66 |
| 2012-02-02 07:00:00 | 88.14 |
| 2012-02-02 08:00:00 | 88.4 |
| 2012-02-02 09:00:00 | 88.4 |
| 2012-02-02 10:00:00 | 88.14 |
| 2012-02-02 11:00:00 | 88.4 |
| 2012-02-02 12:00:00 | 88.14 |
| 2012-02-02 13:00:00 | 88.14 |
| 2012-02-02 14:00:00 | 88.4 |
| 2012-02-02 15:00:00 | 88.4 |
| 2012-02-02 16:00:00 | 88.4 |
| 2012-02-02 17:00:00 | 88.4 |
| 2012-02-02 18:00:00 | 88.14 |
| 2012-02-02 19:00:00 | 88.4 |
| 2012-02-02 20:00:00 | 88.66 |
| 2012-02-02 21:00:00 | 88.4 |
| 2012-02-02 22:00:00 | 88.4 |
| 2012-02-02 23:00:00 | 88.4 |
| 2012-02-03 | 88.66 |
| 2012-02-03 01:00:00 | 88.4 |
| 2012-02-03 02:00:00 | 88.66 |
| 2012-02-03 03:00:00 | 88.4 |
| 2012-02-03 04:00:00 | 88.4 |
| 2012-02-03 05:00:00 | 88.4 |
| 2012-02-03 06:00:00 | 88.4 |
| 2012-02-03 07:00:00 | 88.14 |
| 2012-02-03 08:00:00 | 88.14 |
| 2012-02-03 09:00:00 | 88.4 |
| 2012-02-03 10:00:00 | 88.14 |
| 2012-02-03 11:00:00 | 88.4 |
| 2012-02-03 12:00:00 | 88.4 |
| 2012-02-03 13:00:00 | 88.14 |
| 2012-02-03 14:00:00 | 88.66 |
| 2012-02-03 15:00:00 | 88.14 |
| 2012-02-03 16:00:00 | 88.4 |
| 2012-02-03 17:00:00 | 88.14 |
| 2012-02-03 18:00:00 | 88.14 |
| 2012-02-03 19:00:00 | 88.4 |
| 2012-02-03 20:00:00 | 88.14 |
| 2012-02-03 21:00:00 | 88.66 |
| 2012-02-03 22:00:00 | 88.4 |
| 2012-02-03 23:00:00 | 88.4 |
| 2012-02-04 | 88.4 |
| 2012-02-04 01:00:00 | 88.66 |
| 2012-02-04 02:00:00 | 88.4 |
| 2012-02-04 03:00:00 | 88.66 |
| 2012-02-04 04:00:00 | 88.4 |
| 2012-02-04 05:00:00 | 88.66 |
| 2012-02-04 06:00:00 | 88.66 |
| 2012-02-04 07:00:00 | 88.4 |
| 2012-02-04 08:00:00 | 88.66 |
| 2012-02-04 09:00:00 | 88.4 |
| 2012-02-04 10:00:00 | 88.14 |
| 2012-02-04 11:00:00 | 88.4 |
| 2012-02-04 12:00:00 | 88.4 |
| 2012-02-04 13:00:00 | 88.4 |
| 2012-02-04 14:00:00 | 88.4 |
| 2012-02-04 15:00:00 | 88.4 |
| 2012-02-04 16:00:00 | 88.4 |
| 2012-02-04 17:00:00 | 88.4 |
| 2012-02-04 18:00:00 | 88.4 |
| 2012-02-04 19:00:00 | 88.66 |
| 2012-02-04 20:00:00 | 88.4 |
| 2012-02-04 21:00:00 | 88.66 |
| 2012-02-04 22:00:00 | 88.66 |
| 2012-02-04 23:00:00 | 88.66 |
| 2012-02-05 | 88.66 |
| 2012-02-05 01:00:00 | 88.4 |
| 2012-02-05 02:00:00 | 88.66 |
| 2012-02-05 03:00:00 | 88.66 |
| 2012-02-05 04:00:00 | 88.66 |
| 2012-02-05 05:00:00 | 88.66 |
| 2012-02-05 06:00:00 | 88.66 |
| 2012-02-05 07:00:00 | 88.66 |
| 2012-02-05 08:00:00 | 88.92 |
| 2012-02-05 09:00:00 | 88.66 |
| 2012-02-05 10:00:00 | 88.92 |
| 2012-02-05 11:00:00 | 88.66 |
| 2012-02-05 12:00:00 | 88.4 |
| 2012-02-05 13:00:00 | 88.66 |
| 2012-02-05 14:00:00 | 88.4 |
| 2012-02-05 15:00:00 | 88.66 |
| 2012-02-05 16:00:00 | 88.92 |
| 2012-02-05 17:00:00 | 88.92 |
| 2012-02-05 18:00:00 | 88.92 |
| 2012-02-05 19:00:00 | 88.92 |
| 2012-02-05 20:00:00 | 88.92 |
| 2012-02-05 21:00:00 | 88.4 |
| 2012-02-05 22:00:00 | 88.66 |
| 2012-02-05 23:00:00 | 88.92 |
| 2012-02-06 | 88.66 |
| 2012-02-06 01:00:00 | 88.66 |
| 2012-02-06 02:00:00 | 88.66 |
| 2012-02-06 03:00:00 | 88.4 |
| 2012-02-06 04:00:00 | 88.66 |
| 2012-02-06 05:00:00 | 88.4 |
| 2012-02-06 06:00:00 | 88.14 |
| 2012-02-06 07:00:00 | 88.14 |
| 2012-02-06 08:00:00 | 88.4 |
| 2012-02-06 09:00:00 | 88.4 |
| 2012-02-06 10:00:00 | 88.4 |
| 2012-02-06 11:00:00 | 88.4 |
| 2012-02-06 12:00:00 | 88.4 |
| 2012-02-06 13:00:00 | 88.4 |
| 2012-02-06 14:00:00 | 88.4 |
| 2012-02-06 15:00:00 | 88.4 |
| 2012-02-06 16:00:00 | 88.4 |
| 2012-02-06 17:00:00 | 88.4 |
| 2012-02-06 18:00:00 | 88.4 |
| 2012-02-06 19:00:00 | 88.66 |
| 2012-02-06 20:00:00 | 88.4 |
| 2012-02-06 21:00:00 | 88.4 |
| 2012-02-06 22:00:00 | 88.4 |
| 2012-02-06 23:00:00 | 88.4 |
| 2012-02-07 | 88.66 |
| 2012-02-07 01:00:00 | 88.66 |
| 2012-02-07 02:00:00 | 88.4 |
| 2012-02-07 03:00:00 | 88.66 |
| 2012-02-07 04:00:00 | 88.4 |
| 2012-02-07 05:00:00 | 88.4 |
| 2012-02-07 06:00:00 | 88.66 |
| 2012-02-07 07:00:00 | 88.14 |
| 2012-02-07 08:00:00 | 88.4 |
| 2012-02-07 09:00:00 | 88.4 |
| 2012-02-07 10:00:00 | 88.14 |
| 2012-02-07 11:00:00 | 88.4 |
| 2012-02-07 12:00:00 | 88.4 |
| 2012-02-07 13:00:00 | 88.4 |
| 2012-02-07 14:00:00 | 88.4 |
| 2012-02-07 15:00:00 | 88.4 |
| 2012-02-07 16:00:00 | 88.14 |
| 2012-02-07 17:00:00 | 88.4 |
| 2012-02-07 18:00:00 | 88.4 |
| 2012-02-07 19:00:00 | 88.14 |
| 2012-02-07 20:00:00 | 88.66 |
| 2012-02-07 21:00:00 | 88.4 |
| 2012-02-07 22:00:00 | 88.66 |
| 2012-02-07 23:00:00 | 88.4 |
| 2012-02-08 | 88.66 |
| 2012-02-08 01:00:00 | 88.4 |
| 2012-02-08 02:00:00 | 88.66 |
| 2012-02-08 03:00:00 | 88.4 |
| 2012-02-08 04:00:00 | 88.4 |
| 2012-02-08 05:00:00 | 88.4 |
| 2012-02-08 06:00:00 | 88.66 |
| 2012-02-08 07:00:00 | 88.4 |
| 2012-02-08 08:00:00 | 88.14 |
| 2012-02-08 09:00:00 | 88.4 |
| 2012-02-08 10:00:00 | 88.14 |
| 2012-02-08 11:00:00 | 88.14 |
| 2012-02-08 12:00:00 | 88.4 |
| 2012-02-08 13:00:00 | 88.14 |
| 2012-02-08 14:00:00 | 88.4 |
| 2012-02-08 15:00:00 | 88.4 |
| 2012-02-08 16:00:00 | 88.4 |
| 2012-02-08 17:00:00 | 88.14 |
| 2012-02-08 18:00:00 | 88.4 |
| 2012-02-08 19:00:00 | 88.4 |
| 2012-02-08 20:00:00 | 88.4 |
| 2012-02-08 21:00:00 | 88.4 |
| 2012-02-08 22:00:00 | 88.4 |
| 2012-02-08 23:00:00 | 88.4 |
| 2012-02-09 | 88.4 |
| 2012-02-09 01:00:00 | 88.4 |
| 2012-02-09 02:00:00 | 88.4 |
| 2012-02-09 03:00:00 | 88.66 |
| 2012-02-09 04:00:00 | 88.4 |
| 2012-02-09 05:00:00 | 88.4 |
| 2012-02-09 06:00:00 | 88.4 |
| 2012-02-09 07:00:00 | 88.4 |
| 2012-02-09 08:00:00 | 88.14 |
| 2012-02-09 09:00:00 | 88.14 |
| 2012-02-09 10:00:00 | 88.14 |
| 2012-02-09 11:00:00 | 88.4 |
| 2012-02-09 12:00:00 | 88.14 |
| 2012-02-09 13:00:00 | 88.14 |
| 2012-02-09 14:00:00 | 88.4 |
| 2012-02-09 15:00:00 | 88.4 |
| 2012-02-09 16:00:00 | 88.4 |
| 2012-02-09 17:00:00 | 88.4 |
| 2012-02-09 18:00:00 | 88.14 |
| 2012-02-09 19:00:00 | 88.4 |
| 2012-02-09 20:00:00 | 88.66 |
| 2012-02-09 21:00:00 | 88.14 |
| 2012-02-09 22:00:00 | 88.66 |
| 2012-02-09 23:00:00 | 88.14 |
| 2012-02-10 | 88.66 |
| 2012-02-10 01:00:00 | 88.4 |
| 2012-02-10 02:00:00 | 88.4 |
| 2012-02-10 03:00:00 | 88.4 |
| 2012-02-10 04:00:00 | 88.66 |
| 2012-02-10 05:00:00 | 88.66 |
| 2012-02-10 06:00:00 | 88.66 |
| 2012-02-10 07:00:00 | 88.66 |
| 2012-02-10 08:00:00 | 88.66 |
| 2012-02-10 09:00:00 | 88.92 |
| 2012-02-10 10:00:00 | 88.4 |
| 2012-02-10 11:00:00 | 88.4 |
| 2012-02-10 12:00:00 | 88.4 |
| 2012-02-10 13:00:00 | 88.4 |
| 2012-02-10 14:00:00 | 88.4 |
| 2012-02-10 15:00:00 | 88.4 |
| 2012-02-10 16:00:00 | 88.14 |
| 2012-02-10 17:00:00 | 88.4 |
| 2012-02-10 18:00:00 | 88.14 |
| 2012-02-10 19:00:00 | 88.14 |
| 2012-02-10 20:00:00 | 88.14 |
| 2012-02-10 21:00:00 | 88.14 |
| 2012-02-10 22:00:00 | 88.4 |
| 2012-02-10 23:00:00 | 88.4 |
| 2012-02-11 | 88.4 |
| 2012-02-11 01:00:00 | 88.14 |
| 2012-02-11 02:00:00 | 88.4 |
| 2012-02-11 03:00:00 | 88.66 |
| 2012-02-11 04:00:00 | 88.4 |
| 2012-02-11 05:00:00 | 88.4 |
| 2012-02-11 06:00:00 | 88.14 |
| 2012-02-11 07:00:00 | 88.4 |
| 2012-02-11 08:00:00 | 88.4 |
| 2012-02-11 09:00:00 | 88.4 |
| 2012-02-11 10:00:00 | 88.14 |
| 2012-02-11 11:00:00 | 88.14 |
| 2012-02-11 12:00:00 | 88.14 |
| 2012-02-11 13:00:00 | 88.4 |
| 2012-02-11 14:00:00 | 88.14 |
| 2012-02-11 15:00:00 | 88.14 |
| 2012-02-11 16:00:00 | 88.14 |
| 2012-02-11 17:00:00 | 88.14 |
| 2012-02-11 18:00:00 | 88.14 |
| 2012-02-11 19:00:00 | 88.14 |
| 2012-02-11 20:00:00 | 88.14 |
| 2012-02-11 21:00:00 | 88.4 |
| 2012-02-11 22:00:00 | 88.14 |
| 2012-02-11 23:00:00 | 88.4 |
| 2012-02-12 | 88.14 |
| 2012-02-12 01:00:00 | 88.4 |
| 2012-02-12 02:00:00 | 88.14 |
| 2012-02-12 03:00:00 | 88.4 |
| 2012-02-12 04:00:00 | 88.4 |
| 2012-02-12 05:00:00 | 88.14 |
| 2012-02-12 06:00:00 | 88.4 |
| 2012-02-12 07:00:00 | 88.4 |
| 2012-02-12 08:00:00 | 88.4 |
| 2012-02-12 09:00:00 | 88.4 |
| 2012-02-12 10:00:00 | 88.4 |
| 2012-02-12 11:00:00 | 88.14 |
| 2012-02-12 12:00:00 | 88.4 |
| 2012-02-12 13:00:00 | 88.4 |
| 2012-02-12 14:00:00 | 88.4 |
| 2012-02-12 15:00:00 | 88.4 |
| 2012-02-12 16:00:00 | 88.14 |
| 2012-02-12 17:00:00 | 88.14 |
| 2012-02-12 18:00:00 | 88.14 |
| 2012-02-12 19:00:00 | 88.14 |
| 2012-02-12 20:00:00 | 88.14 |
| 2012-02-12 21:00:00 | 88.4 |
| 2012-02-12 22:00:00 | 88.4 |
| 2012-02-12 23:00:00 | 88.14 |
| 2012-02-13 | 88.4 |
| 2012-02-13 01:00:00 | 88.4 |
| 2012-02-13 02:00:00 | 88.14 |
| 2012-02-13 03:00:00 | 88.14 |
| 2012-02-13 04:00:00 | 88.4 |
| 2012-02-13 05:00:00 | 88.4 |
| 2012-02-13 06:00:00 | 88.14 |
| 2012-02-13 07:00:00 | 87.88 |
| 2012-02-13 08:00:00 | 88.14 |
| 2012-02-13 09:00:00 | 88.14 |
| 2012-02-13 10:00:00 | 87.88 |
| 2012-02-13 11:00:00 | 88.4 |
| 2012-02-13 12:00:00 | 88.14 |
| 2012-02-13 13:00:00 | 88.14 |
| 2012-02-13 14:00:00 | 88.14 |
| 2012-02-13 15:00:00 | 88.4 |
| 2012-02-13 16:00:00 | 88.4 |
| 2012-02-13 17:00:00 | 88.4 |
| 2012-02-13 18:00:00 | 88.14 |
| 2012-02-13 19:00:00 | 88.4 |
| 2012-02-13 20:00:00 | 88.4 |
| 2012-02-13 21:00:00 | 88.14 |
| 2012-02-13 22:00:00 | 88.4 |
| 2012-02-13 23:00:00 | 88.4 |
| 2012-02-14 | 88.4 |
| 2012-02-14 01:00:00 | 88.14 |
| 2012-02-14 02:00:00 | 88.4 |
| 2012-02-14 03:00:00 | 88.66 |
| 2012-02-14 04:00:00 | 88.4 |
| 2012-02-14 05:00:00 | 88.66 |
| 2012-02-14 06:00:00 | 88.4 |
| 2012-02-14 07:00:00 | 88.4 |
| 2012-02-14 08:00:00 | 88.14 |
| 2012-02-14 09:00:00 | 88.14 |
| 2012-02-14 10:00:00 | 88.14 |
| 2012-02-14 11:00:00 | 88.4 |
| 2012-02-14 12:00:00 | 88.14 |
| 2012-02-14 13:00:00 | 88.4 |
| 2012-02-14 14:00:00 | 87.88 |
| 2012-02-14 15:00:00 | 88.4 |
| 2012-02-14 16:00:00 | 88.14 |
| 2012-02-14 17:00:00 | 88.14 |
| 2012-02-14 18:00:00 | 88.14 |
| 2012-02-14 19:00:00 | 88.14 |
| 2012-02-14 20:00:00 | 88.14 |
| 2012-02-14 21:00:00 | 88.4 |
| 2012-02-14 22:00:00 | 88.4 |
| 2012-02-14 23:00:00 | 88.14 |
| 2012-02-15 | 88.66 |
| 2012-02-15 01:00:00 | 88.4 |
| 2012-02-15 02:00:00 | 88.4 |
| 2012-02-15 03:00:00 | 88.4 |
| 2012-02-15 04:00:00 | 88.4 |
| 2012-02-15 05:00:00 | 88.4 |
| 2012-02-15 06:00:00 | 88.14 |
| 2012-02-15 07:00:00 | 88.14 |
| 2012-02-15 08:00:00 | 88.14 |
| 2012-02-15 09:00:00 | 88.4 |
| 2012-02-15 10:00:00 | 88.14 |
| 2012-02-15 11:00:00 | 88.14 |
| 2012-02-15 12:00:00 | 88.14 |
| 2012-02-15 13:00:00 | 88.4 |
| 2012-02-15 14:00:00 | 88.4 |
| 2012-02-15 15:00:00 | 88.4 |
| 2012-02-15 16:00:00 | 88.14 |
| 2012-02-15 17:00:00 | 88.4 |
| 2012-02-15 18:00:00 | 88.66 |
| 2012-02-15 19:00:00 | 88.4 |
| 2012-02-15 20:00:00 | 88.4 |
| 2012-02-15 21:00:00 | 88.4 |
| 2012-02-15 22:00:00 | 88.66 |
| 2012-02-15 23:00:00 | 88.4 |
| 2012-02-16 | 88.66 |
| 2012-02-16 01:00:00 | 88.4 |
| 2012-02-16 02:00:00 | 88.4 |
| 2012-02-16 03:00:00 | 88.66 |
| 2012-02-16 04:00:00 | 88.4 |
| 2012-02-16 05:00:00 | 88.4 |
| 2012-02-16 06:00:00 | 88.4 |
| 2012-02-16 07:00:00 | 88.14 |
| 2012-02-16 08:00:00 | 88.14 |
| 2012-02-16 09:00:00 | 88.4 |
| 2012-02-16 10:00:00 | 88.14 |
| 2012-02-16 11:00:00 | 88.4 |
| 2012-02-16 12:00:00 | 88.14 |
| 2012-02-16 13:00:00 | 88.4 |
| 2012-02-16 14:00:00 | 88.14 |
| 2012-02-16 15:00:00 | 88.4 |
| 2012-02-16 16:00:00 | 88.14 |
| 2012-02-16 17:00:00 | 88.14 |
| 2012-02-16 18:00:00 | 88.14 |
| 2012-02-16 19:00:00 | 88.14 |
| 2012-02-16 20:00:00 | 88.14 |
| 2012-02-16 21:00:00 | 88.14 |
| 2012-02-16 22:00:00 | 88.4 |
| 2012-02-16 23:00:00 | 88.4 |
| 2012-02-17 | 88.14 |
| 2012-02-17 01:00:00 | 88.4 |
| 2012-02-17 02:00:00 | 88.4 |
| 2012-02-17 03:00:00 | 88.4 |
| 2012-02-17 04:00:00 | 88.4 |
| 2012-02-17 05:00:00 | 88.4 |
| 2012-02-17 06:00:00 | 88.4 |
| 2012-02-17 07:00:00 | 88.4 |
| 2012-02-17 08:00:00 | 88.14 |
| 2012-02-17 09:00:00 | 88.4 |
| 2012-02-17 10:00:00 | 88.14 |
| 2012-02-17 11:00:00 | 88.4 |
| 2012-02-17 12:00:00 | 88.14 |
| 2012-02-17 13:00:00 | 88.14 |
| 2012-02-17 14:00:00 | 88.4 |
| 2012-02-17 15:00:00 | 88.4 |
| 2012-02-17 16:00:00 | 88.14 |
| 2012-02-17 17:00:00 | 88.14 |
| 2012-02-17 18:00:00 | 88.14 |
| 2012-02-17 19:00:00 | 88.14 |
| 2012-02-17 20:00:00 | 88.4 |
| 2012-02-17 21:00:00 | 88.4 |
| 2012-02-17 22:00:00 | 88.4 |
| 2012-02-17 23:00:00 | 88.4 |
| 2012-02-18 | 88.4 |
| 2012-02-18 01:00:00 | 88.14 |
| 2012-02-18 02:00:00 | 88.4 |
| 2012-02-18 03:00:00 | 88.4 |
| 2012-02-18 04:00:00 | 88.4 |
| 2012-02-18 05:00:00 | 88.4 |
| 2012-02-18 06:00:00 | 88.4 |
| 2012-02-18 07:00:00 | 88.4 |
| 2012-02-18 08:00:00 | 88.4 |
| 2012-02-18 09:00:00 | 88.4 |
| 2012-02-18 10:00:00 | 88.66 |
| 2012-02-18 11:00:00 | 88.66 |
| 2012-02-18 12:00:00 | 88.4 |
| 2012-02-18 13:00:00 | 88.66 |
| 2012-02-18 14:00:00 | 88.4 |
| 2012-02-18 15:00:00 | 88.66 |
| 2012-02-18 16:00:00 | 88.66 |
| 2012-02-18 17:00:00 | 88.4 |
| 2012-02-18 18:00:00 | 88.66 |
| 2012-02-18 19:00:00 | 89.18 |
| 2012-02-18 20:00:00 | 89.18 |
| 2012-02-18 21:00:00 | 89.18 |
| 2012-02-18 22:00:00 | 88.92 |
| 2012-02-18 23:00:00 | 89.18 |
| 2012-02-19 | 89.44 |
| 2012-02-19 01:00:00 | 88.92 |
| 2012-02-19 02:00:00 | 88.92 |
| 2012-02-19 03:00:00 | 88.92 |
| 2012-02-19 04:00:00 | 88.92 |
| 2012-02-19 05:00:00 | 88.92 |
| 2012-02-19 06:00:00 | 88.66 |
| 2012-02-19 07:00:00 | 88.92 |
| 2012-02-19 08:00:00 | 88.4 |
| 2012-02-19 09:00:00 | 88.66 |
| 2012-02-19 10:00:00 | 88.66 |
| 2012-02-19 11:00:00 | 88.92 |
| 2012-02-19 12:00:00 | 88.66 |
| 2012-02-19 13:00:00 | 97.24 |
| 2012-02-19 14:00:00 | 97.5 |
| 2012-02-19 15:00:00 | 97.5 |
| 2012-02-19 16:00:00 | 97.76 |
| 2012-02-19 17:00:00 | 98.02 |
| 2012-02-19 18:00:00 | 97.76 |
| 2012-02-19 19:00:00 | 97.5 |
| 2012-02-19 20:00:00 | 97.76 |
| 2012-02-19 21:00:00 | 97.5 |
| 2012-02-19 22:00:00 | 97.5 |
| 2012-02-19 23:00:00 | 97.76 |
| 2012-02-20 | 97.76 |
| 2012-02-20 01:00:00 | 97.5 |
| 2012-02-20 02:00:00 | 97.5 |
| 2012-02-20 03:00:00 | 97.76 |
| 2012-02-20 04:00:00 | 98.02 |
| 2012-02-20 05:00:00 | 98.02 |
| 2012-02-20 06:00:00 | 98.02 |
| 2012-02-20 07:00:00 | 97.76 |
| 2012-02-20 08:00:00 | 97.76 |
| 2012-02-20 09:00:00 | 97.76 |
| 2012-02-20 10:00:00 | 97.76 |
| 2012-02-20 11:00:00 | 98.02 |
| 2012-02-20 12:00:00 | 97.5 |
| 2012-02-20 13:00:00 | 98.02 |
| 2012-02-20 14:00:00 | 97.5 |
| 2012-02-20 15:00:00 | 97.5 |
| 2012-02-20 16:00:00 | 97.24 |
| 2012-02-20 17:00:00 | 97.5 |
| 2012-02-20 18:00:00 | 97.5 |
| 2012-02-20 19:00:00 | 97.24 |
| 2012-02-20 20:00:00 | 97.5 |
| 2012-02-20 21:00:00 | 97.24 |
| 2012-02-20 22:00:00 | 97.5 |
| 2012-02-20 23:00:00 | 97.5 |
| 2012-02-21 | 97.5 |
| 2012-02-21 01:00:00 | 97.76 |
| 2012-02-21 02:00:00 | 98.02 |
| 2012-02-21 03:00:00 | 98.02 |
| 2012-02-21 04:00:00 | 97.76 |
| 2012-02-21 05:00:00 | 98.02 |
| 2012-02-21 06:00:00 | 98.02 |
| 2012-02-21 07:00:00 | 98.02 |
| 2012-02-21 08:00:00 | 97.76 |
| 2012-02-21 09:00:00 | 97.5 |
| 2012-02-21 10:00:00 | 98.02 |
| 2012-02-21 11:00:00 | 97.76 |
| 2012-02-21 12:00:00 | 97.76 |
| 2012-02-21 13:00:00 | 97.76 |
| 2012-02-21 14:00:00 | 97.76 |
| 2012-02-21 15:00:00 | 97.76 |
| 2012-02-21 16:00:00 | 96.98 |
| 2012-02-21 17:00:00 | 97.24 |
| 2012-02-21 18:00:00 | 96.98 |
| 2012-02-21 19:00:00 | 96.98 |
| 2012-02-21 20:00:00 | 97.24 |
| 2012-02-21 21:00:00 | 97.24 |
| 2012-02-21 22:00:00 | 97.24 |
| 2012-02-21 23:00:00 | 96.98 |
| 2012-02-22 | 97.76 |
| 2012-02-22 01:00:00 | 98.02 |
| 2012-02-22 02:00:00 | 98.02 |
| 2012-02-22 03:00:00 | 98.02 |
| 2012-02-22 04:00:00 | 98.02 |
| 2012-02-22 05:00:00 | 98.02 |
| 2012-02-22 06:00:00 | 97.76 |
| 2012-02-22 07:00:00 | 97.76 |
| 2012-02-22 08:00:00 | 98.02 |
| 2012-02-22 09:00:00 | 97.76 |
| 2012-02-22 10:00:00 | 97.76 |
| 2012-02-22 11:00:00 | 98.02 |
| 2012-02-22 12:00:00 | 97.76 |
| 2012-02-22 13:00:00 | 98.02 |
| 2012-02-22 14:00:00 | 97.76 |
| 2012-02-22 15:00:00 | 98.02 |
| 2012-02-22 16:00:00 | 97.76 |
| 2012-02-22 17:00:00 | 97.76 |
| 2012-02-22 18:00:00 | 97.76 |
| 2012-02-22 19:00:00 | 97.76 |
| 2012-02-22 20:00:00 | 97.76 |
| 2012-02-22 21:00:00 | 97.76 |
| 2012-02-22 22:00:00 | 98.02 |
| 2012-02-22 23:00:00 | 98.02 |
| 2012-02-23 | 98.02 |
| 2012-02-23 01:00:00 | 97.76 |
| 2012-02-23 02:00:00 | 98.02 |
| 2012-02-23 03:00:00 | 98.02 |
| 2012-02-23 04:00:00 | 98.02 |
| 2012-02-23 05:00:00 | 97.76 |
| 2012-02-23 06:00:00 | 98.02 |
| 2012-02-23 07:00:00 | 97.5 |
| 2012-02-23 08:00:00 | 97.76 |
| 2012-02-23 09:00:00 | 97.76 |
| 2012-02-23 10:00:00 | 97.5 |
| 2012-02-23 11:00:00 | 97.76 |
| 2012-02-23 12:00:00 | 97.76 |
| 2012-02-23 13:00:00 | 97.5 |
| 2012-02-23 14:00:00 | 97.76 |
| 2012-02-23 15:00:00 | 97.76 |
| 2012-02-23 16:00:00 | 97.5 |
| 2012-02-23 17:00:00 | 97.76 |
| 2012-02-23 18:00:00 | 97.76 |
| 2012-02-23 19:00:00 | 97.5 |
| 2012-02-23 20:00:00 | 97.76 |
| 2012-02-23 21:00:00 | 97.5 |
| 2012-02-23 22:00:00 | 97.76 |
| 2012-02-23 23:00:00 | 97.5 |
| 2012-02-24 | 97.76 |
| 2012-02-24 01:00:00 | 97.5 |
| 2012-02-24 02:00:00 | 97.76 |
| 2012-02-24 03:00:00 | 97.76 |
| 2012-02-24 04:00:00 | 97.76 |
| 2012-02-24 05:00:00 | 97.76 |
| 2012-02-24 06:00:00 | 97.5 |
| 2012-02-24 07:00:00 | 97.5 |
| 2012-02-24 08:00:00 | 97.5 |
| 2012-02-24 09:00:00 | 97.5 |
| 2012-02-24 10:00:00 | 97.5 |
| 2012-02-24 11:00:00 | 97.5 |
| 2012-02-24 12:00:00 | 97.76 |
| 2012-02-24 13:00:00 | 97.76 |
| 2012-02-24 14:00:00 | 97.76 |
| 2012-02-24 15:00:00 | 97.76 |
| 2012-02-24 16:00:00 | 97.5 |
| 2012-02-24 17:00:00 | 97.76 |
| 2012-02-24 18:00:00 | 97.76 |
| 2012-02-24 19:00:00 | 97.76 |
| 2012-02-24 20:00:00 | 97.76 |
| 2012-02-24 21:00:00 | 97.76 |
| 2012-02-24 22:00:00 | 97.76 |
| 2012-02-24 23:00:00 | 98.02 |
| 2012-02-25 | 97.76 |
| 2012-02-25 01:00:00 | 98.02 |
| 2012-02-25 02:00:00 | 97.76 |
| 2012-02-25 03:00:00 | 98.02 |
| 2012-02-25 04:00:00 | 98.02 |
| 2012-02-25 05:00:00 | 98.02 |
| 2012-02-25 06:00:00 | 98.02 |
| 2012-02-25 07:00:00 | 97.76 |
| 2012-02-25 08:00:00 | 98.02 |
| 2012-02-25 09:00:00 | 97.76 |
| 2012-02-25 10:00:00 | 97.76 |
| 2012-02-25 11:00:00 | 97.76 |
| 2012-02-25 12:00:00 | 98.02 |
| 2012-02-25 13:00:00 | 98.02 |
| 2012-02-25 14:00:00 | 97.76 |
| 2012-02-25 15:00:00 | 98.28 |
| 2012-02-25 16:00:00 | 98.02 |
| 2012-02-25 17:00:00 | 97.76 |
| 2012-02-25 18:00:00 | 98.02 |
| 2012-02-25 19:00:00 | 97.76 |
| 2012-02-25 20:00:00 | 98.02 |
| 2012-02-25 21:00:00 | 98.02 |
| 2012-02-25 22:00:00 | 98.28 |
| 2012-02-25 23:00:00 | 98.02 |
| 2012-02-26 | 98.28 |
| 2012-02-26 01:00:00 | 98.28 |
| 2012-02-26 02:00:00 | 98.02 |
| 2012-02-26 03:00:00 | 98.28 |
| 2012-02-26 04:00:00 | 98.28 |
| 2012-02-26 05:00:00 | 98.28 |
| 2012-02-26 06:00:00 | 98.54 |
| 2012-02-26 07:00:00 | 98.54 |
| 2012-02-26 08:00:00 | 98.54 |
| 2012-02-26 09:00:00 | 98.54 |
| 2012-02-26 10:00:00 | 98.28 |
| 2012-02-26 11:00:00 | 98.28 |
| 2012-02-26 12:00:00 | 98.28 |
| 2012-02-26 13:00:00 | 98.28 |
| 2012-02-26 14:00:00 | 98.54 |
| 2012-02-26 15:00:00 | 98.28 |
| 2012-02-26 16:00:00 | 98.02 |
| 2012-02-26 17:00:00 | 97.76 |
| 2012-02-26 18:00:00 | 98.02 |
| 2012-02-26 19:00:00 | 98.02 |
| 2012-02-26 20:00:00 | 97.76 |
| 2012-02-26 21:00:00 | 98.02 |
| 2012-02-26 22:00:00 | 98.02 |
| 2012-02-26 23:00:00 | 98.02 |
| 2012-02-27 | 98.02 |
| 2012-02-27 01:00:00 | 98.28 |
| 2012-02-27 02:00:00 | 98.02 |
| 2012-02-27 03:00:00 | 98.28 |
| 2012-02-27 04:00:00 | 98.28 |
| 2012-02-27 05:00:00 | 98.02 |
| 2012-02-27 06:00:00 | 97.76 |
| 2012-02-27 07:00:00 | 97.76 |
| 2012-02-27 08:00:00 | 97.76 |
| 2012-02-27 09:00:00 | 97.76 |
| 2012-02-27 10:00:00 | 97.76 |
| 2012-02-27 11:00:00 | 97.76 |
| 2012-02-27 12:00:00 | 97.76 |
| 2012-02-27 13:00:00 | 97.76 |
| 2012-02-27 14:00:00 | 97.76 |
| 2012-02-27 15:00:00 | 98.02 |
| 2012-02-27 16:00:00 | 97.5 |
| 2012-02-27 17:00:00 | 97.76 |
| 2012-02-27 18:00:00 | 97.76 |
| 2012-02-27 19:00:00 | 97.76 |
| 2012-02-27 20:00:00 | 97.76 |
| 2012-02-27 21:00:00 | 97.76 |
| 2012-02-27 22:00:00 | 98.02 |
| 2012-02-27 23:00:00 | 98.02 |
| 2012-02-28 | 97.76 |
| 2012-02-28 01:00:00 | 98.02 |
| 2012-02-28 02:00:00 | 98.02 |
| 2012-02-28 03:00:00 | 98.02 |
| 2012-02-28 04:00:00 | 98.02 |
| 2012-02-28 05:00:00 | 98.02 |
| 2012-02-28 06:00:00 | 98.02 |
| 2012-02-28 07:00:00 | 97.76 |
| 2012-02-28 08:00:00 | 97.5 |
| 2012-02-28 09:00:00 | 97.76 |
| 2012-02-28 10:00:00 | 97.76 |
| 2012-02-28 11:00:00 | 97.76 |
| 2012-02-28 12:00:00 | 97.5 |
| 2012-02-28 13:00:00 | 97.5 |
| 2012-02-28 14:00:00 | 97.5 |
| 2012-02-28 15:00:00 | 97.5 |
| 2012-02-28 16:00:00 | 97.5 |
| 2012-02-28 17:00:00 | 97.5 |
| 2012-02-28 18:00:00 | 97.76 |
| 2012-02-28 19:00:00 | 97.5 |
| 2012-02-28 20:00:00 | 97.76 |
| 2012-02-28 21:00:00 | 97.5 |
| 2012-02-28 22:00:00 | 97.76 |
| 2012-02-28 23:00:00 | 97.76 |
| 2012-02-29 | 97.76 |
| 2012-02-29 01:00:00 | 97.76 |
| 2012-02-29 02:00:00 | 97.76 |
| 2012-02-29 03:00:00 | 97.76 |
| 2012-02-29 04:00:00 | 98.02 |
| 2012-02-29 05:00:00 | 97.76 |
| 2012-02-29 06:00:00 | 97.5 |
| 2012-02-29 07:00:00 | 97.5 |
| 2012-02-29 08:00:00 | 97.5 |
| 2012-02-29 09:00:00 | 97.5 |
| 2012-02-29 10:00:00 | 91.26 |
| 2012-02-29 11:00:00 | 89.18 |
| 2012-02-29 12:00:00 | 97.24 |
| 2012-02-29 13:00:00 | 97.5 |
| 2012-02-29 14:00:00 | 97.24 |
| 2012-02-29 15:00:00 | 97.5 |
| 2012-02-29 16:00:00 | 97.5 |
| 2012-02-29 17:00:00 | 97.24 |
| 2012-02-29 18:00:00 | 97.5 |
| 2012-02-29 19:00:00 | 97.24 |
| 2012-02-29 20:00:00 | 97.5 |
| 2012-02-29 21:00:00 | 97.5 |
| 2012-02-29 22:00:00 | 97.76 |
| 2012-02-29 23:00:00 | 97.5 |
| 2012-03-01 | 97.76 |
| 2012-03-01 01:00:00 | 97.76 |
| 2012-03-01 02:00:00 | 98.02 |
| 2012-03-01 03:00:00 | 97.76 |
| 2012-03-01 04:00:00 | 98.02 |
| 2012-03-01 05:00:00 | 97.76 |
| 2012-03-01 06:00:00 | 98.02 |
| 2012-03-01 07:00:00 | 95.68 |
| 2012-03-01 08:00:00 | 89.44 |
| 2012-03-01 09:00:00 | 89.18 |
| 2012-03-01 10:00:00 | 89.18 |
| 2012-03-01 11:00:00 | 88.66 |
| 2012-03-01 12:00:00 | 88.92 |
| 2012-03-01 13:00:00 | 88.4 |
| 2012-03-01 14:00:00 | 88.92 |
| 2012-03-01 15:00:00 | 88.66 |
| 2012-03-01 16:00:00 | 88.66 |
| 2012-03-01 17:00:00 | 88.66 |
| 2012-03-01 18:00:00 | 88.92 |
| 2012-03-01 19:00:00 | 88.66 |
| 2012-03-01 20:00:00 | 88.92 |
| 2012-03-01 21:00:00 | 88.92 |
| 2012-03-01 22:00:00 | 88.92 |
| 2012-03-01 23:00:00 | 88.66 |
| 2012-03-02 | 89.18 |
| 2012-03-02 01:00:00 | 88.92 |
| 2012-03-02 02:00:00 | 88.92 |
| 2012-03-02 03:00:00 | 88.92 |
| 2012-03-02 04:00:00 | 88.92 |
| 2012-03-02 05:00:00 | 89.18 |
| 2012-03-02 06:00:00 | 88.66 |
| 2012-03-02 07:00:00 | 88.66 |
| 2012-03-02 08:00:00 | 88.92 |
| 2012-03-02 09:00:00 | 88.66 |
| 2012-03-02 10:00:00 | 88.66 |
| 2012-03-02 11:00:00 | 88.92 |
| 2012-03-02 12:00:00 | 88.92 |
| 2012-03-02 13:00:00 | 88.66 |
| 2012-03-02 14:00:00 | 88.66 |
| 2012-03-02 15:00:00 | 88.66 |
| 2012-03-02 16:00:00 | 88.92 |
| 2012-03-02 17:00:00 | 88.66 |
| 2012-03-02 18:00:00 | 88.66 |
| 2012-03-02 19:00:00 | 88.92 |
| 2012-03-02 20:00:00 | 89.18 |
| 2012-03-02 21:00:00 | 89.18 |
| 2012-03-02 22:00:00 | 88.92 |
| 2012-03-02 23:00:00 | 88.92 |
| 2012-03-03 | 88.92 |
| 2012-03-03 01:00:00 | 88.92 |
| 2012-03-03 02:00:00 | 88.92 |
| 2012-03-03 03:00:00 | 89.18 |
| 2012-03-03 04:00:00 | 88.92 |
| 2012-03-03 05:00:00 | 88.92 |
| 2012-03-03 06:00:00 | 88.92 |
| 2012-03-03 07:00:00 | 88.92 |
| 2012-03-03 08:00:00 | 88.66 |
| 2012-03-03 09:00:00 | 88.92 |
| 2012-03-03 10:00:00 | 88.66 |
| 2012-03-03 11:00:00 | 88.92 |
| 2012-03-03 12:00:00 | 88.66 |
| 2012-03-03 13:00:00 | 88.92 |
| 2012-03-03 14:00:00 | 88.66 |
| 2012-03-03 15:00:00 | 88.92 |
| 2012-03-03 16:00:00 | 88.92 |
| 2012-03-03 17:00:00 | 88.66 |
| 2012-03-03 18:00:00 | 88.92 |
| 2012-03-03 19:00:00 | 88.66 |
| 2012-03-03 20:00:00 | 88.66 |
| 2012-03-03 21:00:00 | 88.92 |
| 2012-03-03 22:00:00 | 88.92 |
| 2012-03-03 23:00:00 | 88.92 |
| 2012-03-04 | 88.92 |
| 2012-03-04 01:00:00 | 88.92 |
| 2012-03-04 02:00:00 | 88.92 |
| 2012-03-04 03:00:00 | 88.92 |
| 2012-03-04 04:00:00 | 88.92 |
| 2012-03-04 05:00:00 | 88.92 |
| 2012-03-04 06:00:00 | 88.92 |
| 2012-03-04 07:00:00 | 88.92 |
| 2012-03-04 08:00:00 | 88.66 |
| 2012-03-04 09:00:00 | 88.66 |
| 2012-03-04 10:00:00 | 88.66 |
| 2012-03-04 11:00:00 | 88.66 |
| 2012-03-04 12:00:00 | 88.66 |
| 2012-03-04 13:00:00 | 88.92 |
| 2012-03-04 14:00:00 | 88.66 |
| 2012-03-04 15:00:00 | 88.92 |
| 2012-03-04 16:00:00 | 88.66 |
| 2012-03-04 17:00:00 | 88.66 |
| 2012-03-04 18:00:00 | 88.66 |
| 2012-03-04 19:00:00 | 88.66 |
| 2012-03-04 20:00:00 | 89.18 |
| 2012-03-04 21:00:00 | 88.66 |
| 2012-03-04 22:00:00 | 88.92 |
| 2012-03-04 23:00:00 | 88.66 |
| 2012-03-05 | 88.92 |
| 2012-03-05 01:00:00 | 88.92 |
| 2012-03-05 02:00:00 | 88.92 |
| 2012-03-05 03:00:00 | 88.92 |
| 2012-03-05 04:00:00 | 88.66 |
| 2012-03-05 05:00:00 | 88.92 |
| 2012-03-05 06:00:00 | 88.66 |
| 2012-03-05 07:00:00 | 88.66 |
| 2012-03-05 08:00:00 | 88.4 |
| 2012-03-05 09:00:00 | 88.66 |
| 2012-03-05 10:00:00 | 90.48 |
| 2012-03-05 11:00:00 | 90.74 |
| 2012-03-05 12:00:00 | 88.66 |
| 2012-03-05 13:00:00 | 88.92 |
| 2012-03-05 14:00:00 | 88.66 |
| 2012-03-05 15:00:00 | 88.66 |
| 2012-03-05 16:00:00 | 88.66 |
| 2012-03-05 17:00:00 | 88.66 |
| 2012-03-05 18:00:00 | 88.4 |
| 2012-03-05 19:00:00 | 88.66 |
| 2012-03-05 20:00:00 | 88.66 |
| 2012-03-05 21:00:00 | 88.66 |
| 2012-03-05 22:00:00 | 88.92 |
| 2012-03-05 23:00:00 | 88.66 |
| 2012-03-06 | 88.66 |
| 2012-03-06 01:00:00 | 88.92 |
| 2012-03-06 02:00:00 | 88.92 |
| 2012-03-06 03:00:00 | 88.66 |
| 2012-03-06 04:00:00 | 88.92 |
| 2012-03-06 05:00:00 | 88.66 |
| 2012-03-06 06:00:00 | 88.66 |
| 2012-03-06 07:00:00 | 88.4 |
| 2012-03-06 08:00:00 | 88.66 |
| 2012-03-06 09:00:00 | 88.66 |
| 2012-03-06 10:00:00 | 88.4 |
| 2012-03-06 11:00:00 | 87.88 |
| 2012-03-06 12:00:00 | 87.88 |
| 2012-03-06 13:00:00 | 88.14 |
| 2012-03-06 14:00:00 | 87.88 |
| 2012-03-06 15:00:00 | 88.14 |
| 2012-03-06 16:00:00 | 88.14 |
| 2012-03-06 17:00:00 | 87.88 |
| 2012-03-06 18:00:00 | 88.14 |
| 2012-03-06 19:00:00 | 87.88 |
| 2012-03-06 20:00:00 | 88.14 |
| 2012-03-06 21:00:00 | 88.14 |
| 2012-03-06 22:00:00 | 88.14 |
| 2012-03-06 23:00:00 | 87.88 |
| 2012-03-07 | 88.4 |
| 2012-03-07 01:00:00 | 88.14 |
| 2012-03-07 02:00:00 | 88.14 |
| 2012-03-07 03:00:00 | 88.4 |
| 2012-03-07 04:00:00 | 88.14 |
| 2012-03-07 05:00:00 | 88.4 |
| 2012-03-07 06:00:00 | 88.14 |
| 2012-03-07 07:00:00 | 87.88 |
| 2012-03-07 08:00:00 | 88.14 |
| 2012-03-07 09:00:00 | 87.88 |
| 2012-03-07 10:00:00 | 88.14 |
| 2012-03-07 11:00:00 | 88.14 |
| 2012-03-07 12:00:00 | 88.14 |
| 2012-03-07 13:00:00 | 87.88 |
| 2012-03-07 14:00:00 | 88.14 |
| 2012-03-07 15:00:00 | 88.14 |
| 2012-03-07 16:00:00 | 88.14 |
| 2012-03-07 17:00:00 | 87.88 |
| 2012-03-07 18:00:00 | 88.14 |
| 2012-03-07 19:00:00 | 87.88 |
| 2012-03-07 20:00:00 | 88.14 |
| 2012-03-07 21:00:00 | 88.14 |
| 2012-03-07 22:00:00 | 88.4 |
| 2012-03-07 23:00:00 | 88.14 |
| 2012-03-08 | 88.14 |
| 2012-03-08 01:00:00 | 88.4 |
| 2012-03-08 02:00:00 | 88.4 |
| 2012-03-08 03:00:00 | 88.4 |
| 2012-03-08 04:00:00 | 88.4 |
| 2012-03-08 05:00:00 | 88.14 |
| 2012-03-08 06:00:00 | 88.4 |
| 2012-03-08 07:00:00 | 88.14 |
| 2012-03-08 08:00:00 | 87.88 |
| 2012-03-08 09:00:00 | 88.14 |
| 2012-03-08 10:00:00 | 87.88 |
| 2012-03-08 11:00:00 | 88.14 |
| 2012-03-08 12:00:00 | 88.14 |
| 2012-03-08 13:00:00 | 88.14 |
| 2012-03-08 14:00:00 | 88.14 |
| 2012-03-08 15:00:00 | 88.14 |
| 2012-03-08 16:00:00 | 88.14 |
| 2012-03-08 17:00:00 | 88.14 |
| 2012-03-08 18:00:00 | 88.14 |
| 2012-03-08 19:00:00 | 88.14 |
| 2012-03-08 20:00:00 | 88.14 |
| 2012-03-08 21:00:00 | 88.14 |
| 2012-03-08 22:00:00 | 88.4 |
| 2012-03-08 23:00:00 | 88.14 |
| 2012-03-09 | 88.14 |
| 2012-03-09 01:00:00 | 88.4 |
| 2012-03-09 02:00:00 | 88.66 |
| 2012-03-09 03:00:00 | 88.66 |
| 2012-03-09 04:00:00 | 88.66 |
| 2012-03-09 05:00:00 | 88.66 |
| 2012-03-09 06:00:00 | 88.4 |
| 2012-03-09 07:00:00 | 88.14 |
| 2012-03-09 08:00:00 | 88.14 |
| 2012-03-09 09:00:00 | 88.14 |
| 2012-03-09 10:00:00 | 88.14 |
| 2012-03-09 11:00:00 | 88.14 |
| 2012-03-09 12:00:00 | 88.14 |
| 2012-03-09 13:00:00 | 88.14 |
| 2012-03-09 14:00:00 | 88.4 |
| 2012-03-09 15:00:00 | 88.14 |
| 2012-03-09 16:00:00 | 88.4 |
| 2012-03-09 17:00:00 | 88.14 |
| 2012-03-09 18:00:00 | 88.14 |
| 2012-03-09 19:00:00 | 88.14 |
| 2012-03-09 20:00:00 | 88.14 |
| 2012-03-09 21:00:00 | 88.14 |
| 2012-03-09 22:00:00 | 88.4 |
| 2012-03-09 23:00:00 | 88.4 |
| 2012-03-10 | 88.4 |
| 2012-03-10 01:00:00 | 88.14 |
| 2012-03-10 02:00:00 | 88.4 |
| 2012-03-10 03:00:00 | 88.66 |
| 2012-03-10 04:00:00 | 88.4 |
| 2012-03-10 05:00:00 | 88.4 |
| 2012-03-10 06:00:00 | 88.4 |
| 2012-03-10 07:00:00 | 88.66 |
| 2012-03-10 08:00:00 | 88.4 |
| 2012-03-10 09:00:00 | 88.14 |
| 2012-03-10 10:00:00 | 88.4 |
| 2012-03-10 11:00:00 | 88.14 |
| 2012-03-10 12:00:00 | 88.4 |
| 2012-03-10 13:00:00 | 88.14 |
| 2012-03-10 14:00:00 | 88.4 |
| 2012-03-10 15:00:00 | 88.4 |
| 2012-03-10 16:00:00 | 88.4 |
| 2012-03-10 17:00:00 | 88.4 |
| 2012-03-10 18:00:00 | 88.4 |
| 2012-03-10 19:00:00 | 88.14 |
| 2012-03-10 20:00:00 | 88.4 |
| 2012-03-10 21:00:00 | 88.4 |
| 2012-03-10 22:00:00 | 88.4 |
| 2012-03-10 23:00:00 | 88.66 |
| 2012-03-11 | 88.66 |
| 2012-03-11 01:00:00 | 88.4 |
| 2012-03-11 02:00:00 | 88.66 |
| 2012-03-11 03:00:00 | 88.66 |
| 2012-03-11 04:00:00 | 88.66 |
| 2012-03-11 05:00:00 | 88.66 |
| 2012-03-11 06:00:00 | 88.66 |
| 2012-03-11 07:00:00 | 88.66 |
| 2012-03-11 08:00:00 | 88.4 |
| 2012-03-11 09:00:00 | 88.66 |
| 2012-03-11 10:00:00 | 88.4 |
| 2012-03-11 11:00:00 | 88.4 |
| 2012-03-11 12:00:00 | 88.4 |
| 2012-03-11 13:00:00 | 88.4 |
| 2012-03-11 14:00:00 | 88.4 |
| 2012-03-11 15:00:00 | 88.66 |
| 2012-03-11 16:00:00 | 88.4 |
| 2012-03-11 17:00:00 | 88.4 |
| 2012-03-11 18:00:00 | 88.66 |
| 2012-03-11 19:00:00 | 88.14 |
| 2012-03-11 20:00:00 | 88.66 |
| 2012-03-11 21:00:00 | 88.4 |
| 2012-03-11 22:00:00 | 88.66 |
| 2012-03-11 23:00:00 | 88.66 |
| 2012-03-12 | 88.4 |
| 2012-03-12 01:00:00 | 88.66 |
| 2012-03-12 02:00:00 | 88.66 |
| 2012-03-12 03:00:00 | 88.66 |
| 2012-03-12 04:00:00 | 88.66 |
| 2012-03-12 05:00:00 | 88.66 |
| 2012-03-12 06:00:00 | 88.4 |
| 2012-03-12 07:00:00 | 88.4 |
| 2012-03-12 08:00:00 | 88.4 |
| 2012-03-12 09:00:00 | 88.14 |
| 2012-03-12 10:00:00 | 88.4 |
| 2012-03-12 11:00:00 | 88.4 |
| 2012-03-12 12:00:00 | 88.4 |
| 2012-03-12 13:00:00 | 88.4 |
| 2012-03-12 14:00:00 | 88.4 |
| 2012-03-12 15:00:00 | 88.14 |
| 2012-03-12 16:00:00 | 88.4 |
| 2012-03-12 17:00:00 | 88.4 |
| 2012-03-12 18:00:00 | 88.14 |
| 2012-03-12 19:00:00 | 88.4 |
| 2012-03-12 20:00:00 | 88.4 |
| 2012-03-12 21:00:00 | 88.4 |
| 2012-03-12 22:00:00 | 88.66 |
| 2012-03-12 23:00:00 | 88.66 |
| 2012-03-13 | 88.4 |
| 2012-03-13 01:00:00 | 88.66 |
| 2012-03-13 02:00:00 | 88.4 |
| 2012-03-13 03:00:00 | 88.66 |
| 2012-03-13 04:00:00 | 88.66 |
| 2012-03-13 05:00:00 | 88.4 |
| 2012-03-13 06:00:00 | 88.4 |
| 2012-03-13 07:00:00 | 88.4 |
| 2012-03-13 08:00:00 | 88.14 |
| 2012-03-13 09:00:00 | 88.14 |
| 2012-03-13 10:00:00 | 88.4 |
| 2012-03-13 11:00:00 | 88.4 |
| 2012-03-13 12:00:00 | 88.4 |
| 2012-03-13 13:00:00 | 88.14 |
| 2012-03-13 14:00:00 | 88.4 |
| 2012-03-13 15:00:00 | 88.4 |
| 2012-03-13 16:00:00 | 88.4 |
| 2012-03-13 17:00:00 | 88.4 |
| 2012-03-13 18:00:00 | 88.4 |
| 2012-03-13 19:00:00 | 88.4 |
| 2012-03-13 20:00:00 | 88.4 |
| 2012-03-13 21:00:00 | 88.66 |
| 2012-03-13 22:00:00 | 88.4 |
| 2012-03-13 23:00:00 | 88.66 |
| 2012-03-14 | 88.66 |
| 2012-03-14 01:00:00 | 88.66 |
| 2012-03-14 02:00:00 | 88.4 |
| 2012-03-14 03:00:00 | 88.66 |
| 2012-03-14 04:00:00 | 88.66 |
| 2012-03-14 05:00:00 | 88.4 |
| 2012-03-14 06:00:00 | 88.66 |
| 2012-03-14 07:00:00 | 88.14 |
| 2012-03-14 08:00:00 | 88.4 |
| 2012-03-14 09:00:00 | 88.14 |
| 2012-03-14 10:00:00 | 88.4 |
| 2012-03-14 11:00:00 | 88.14 |
| 2012-03-14 12:00:00 | 88.4 |
| 2012-03-14 13:00:00 | 88.4 |
| 2012-03-14 14:00:00 | 88.14 |
| 2012-03-14 15:00:00 | 88.4 |
| 2012-03-14 16:00:00 | 88.4 |
| 2012-03-14 17:00:00 | 88.4 |
| 2012-03-14 18:00:00 | 88.4 |
| 2012-03-14 19:00:00 | 88.4 |
| 2012-03-14 20:00:00 | 88.4 |
| 2012-03-14 21:00:00 | 88.66 |
| 2012-03-14 22:00:00 | 88.66 |
| 2012-03-14 23:00:00 | 88.4 |
| 2012-03-15 | 88.66 |
| 2012-03-15 01:00:00 | 88.66 |
| 2012-03-15 02:00:00 | 88.4 |
| 2012-03-15 03:00:00 | 88.66 |
| 2012-03-15 04:00:00 | 88.66 |
| 2012-03-15 05:00:00 | 88.66 |
| 2012-03-15 06:00:00 | 88.4 |
| 2012-03-15 07:00:00 | 88.4 |
| 2012-03-15 08:00:00 | 88.4 |
| 2012-03-15 09:00:00 | 88.4 |
| 2012-03-15 10:00:00 | 88.4 |
| 2012-03-15 11:00:00 | 88.4 |
| 2012-03-15 12:00:00 | 88.4 |
| 2012-03-15 13:00:00 | 88.4 |
| 2012-03-15 14:00:00 | 88.4 |
| 2012-03-15 15:00:00 | 88.4 |
| 2012-03-15 16:00:00 | 88.4 |
| 2012-03-15 17:00:00 | 88.4 |
| 2012-03-15 18:00:00 | 88.14 |
| 2012-03-15 19:00:00 | 88.4 |
| 2012-03-15 20:00:00 | 88.14 |
| 2012-03-15 21:00:00 | 88.66 |
| 2012-03-15 22:00:00 | 88.4 |
| 2012-03-15 23:00:00 | 88.4 |
| 2012-03-16 | 88.66 |
| 2012-03-16 01:00:00 | 88.4 |
| 2012-03-16 02:00:00 | 88.4 |
| 2012-03-16 03:00:00 | 88.66 |
| 2012-03-16 04:00:00 | 88.66 |
| 2012-03-16 05:00:00 | 88.4 |
| 2012-03-16 06:00:00 | 88.66 |
| 2012-03-16 07:00:00 | 88.4 |
| 2012-03-16 08:00:00 | 88.4 |
| 2012-03-16 09:00:00 | 88.14 |
| 2012-03-16 10:00:00 | 88.4 |
| 2012-03-16 11:00:00 | 88.14 |
| 2012-03-16 12:00:00 | 88.14 |
| 2012-03-16 13:00:00 | 88.4 |
| 2012-03-16 14:00:00 | 88.4 |
| 2012-03-16 15:00:00 | 88.4 |
| 2012-03-16 16:00:00 | 88.4 |
| 2012-03-16 17:00:00 | 88.4 |
| 2012-03-16 18:00:00 | 88.4 |
| 2012-03-16 19:00:00 | 88.4 |
| 2012-03-16 20:00:00 | 88.14 |
| 2012-03-16 21:00:00 | 88.66 |
| 2012-03-16 22:00:00 | 88.4 |
| 2012-03-16 23:00:00 | 88.4 |
| 2012-03-17 | 88.66 |
| 2012-03-17 01:00:00 | 88.66 |
| 2012-03-17 02:00:00 | 88.4 |
| 2012-03-17 03:00:00 | 88.66 |
| 2012-03-17 04:00:00 | 88.66 |
| 2012-03-17 05:00:00 | 88.4 |
| 2012-03-17 06:00:00 | 88.66 |
| 2012-03-17 07:00:00 | 88.66 |
| 2012-03-17 08:00:00 | 88.4 |
| 2012-03-17 09:00:00 | 88.4 |
| 2012-03-17 10:00:00 | 88.14 |
| 2012-03-17 11:00:00 | 88.66 |
| 2012-03-17 12:00:00 | 88.4 |
| 2012-03-17 13:00:00 | 88.4 |
| 2012-03-17 14:00:00 | 88.66 |
| 2012-03-17 15:00:00 | 88.4 |
| 2012-03-17 16:00:00 | 88.4 |
| 2012-03-17 17:00:00 | 88.4 |
| 2012-03-17 18:00:00 | 88.66 |
| 2012-03-17 19:00:00 | 88.4 |
| 2012-03-17 20:00:00 | 88.4 |
| 2012-03-17 21:00:00 | 88.4 |
| 2012-03-17 22:00:00 | 88.66 |
| 2012-03-17 23:00:00 | 88.4 |
| 2012-03-18 | 88.66 |
| 2012-03-18 01:00:00 | 88.66 |
| 2012-03-18 02:00:00 | 88.4 |
| 2012-03-18 03:00:00 | 88.66 |
| 2012-03-18 04:00:00 | 88.66 |
| 2012-03-18 05:00:00 | 88.66 |
| 2012-03-18 06:00:00 | 88.4 |
| 2012-03-18 07:00:00 | 88.4 |
| 2012-03-18 08:00:00 | 88.4 |
| 2012-03-18 09:00:00 | 88.4 |
| 2012-03-18 10:00:00 | 88.4 |
| 2012-03-18 11:00:00 | 88.4 |
| 2012-03-18 12:00:00 | 88.14 |
| 2012-03-18 13:00:00 | 88.4 |
| 2012-03-18 14:00:00 | 88.66 |
| 2012-03-18 15:00:00 | 88.4 |
| 2012-03-18 16:00:00 | 88.66 |
| 2012-03-18 17:00:00 | 88.4 |
| 2012-03-18 18:00:00 | 88.66 |
| 2012-03-18 19:00:00 | 88.14 |
| 2012-03-18 20:00:00 | 88.66 |
| 2012-03-18 21:00:00 | 88.4 |
| 2012-03-18 22:00:00 | 88.66 |
| 2012-03-18 23:00:00 | 88.66 |
| 2012-03-19 | 88.66 |
| 2012-03-19 01:00:00 | 88.66 |
| 2012-03-19 02:00:00 | 88.66 |
| 2012-03-19 03:00:00 | 88.4 |
| 2012-03-19 04:00:00 | 88.92 |
| 2012-03-19 05:00:00 | 88.4 |
| 2012-03-19 06:00:00 | 88.4 |
| 2012-03-19 07:00:00 | 88.4 |
| 2012-03-19 08:00:00 | 88.4 |
| 2012-03-19 09:00:00 | 88.4 |
| 2012-03-19 10:00:00 | 88.4 |
| 2012-03-19 11:00:00 | 88.4 |
| 2012-03-19 12:00:00 | 88.4 |
| 2012-03-19 13:00:00 | 88.4 |
| 2012-03-19 14:00:00 | 88.4 |
| 2012-03-19 15:00:00 | 88.66 |
| 2012-03-19 16:00:00 | 88.4 |
| 2012-03-19 17:00:00 | 88.4 |
| 2012-03-19 18:00:00 | 88.4 |
| 2012-03-19 19:00:00 | 88.66 |
| 2012-03-19 20:00:00 | 88.4 |
| 2012-03-19 21:00:00 | 88.66 |
| 2012-03-19 22:00:00 | 88.66 |
| 2012-03-19 23:00:00 | 88.66 |
| 2012-03-20 | 88.66 |
| 2012-03-20 01:00:00 | 88.66 |
| 2012-03-20 02:00:00 | 88.66 |
| 2012-03-20 03:00:00 | 88.66 |
| 2012-03-20 04:00:00 | 88.92 |
| 2012-03-20 05:00:00 | 88.66 |
| 2012-03-20 06:00:00 | 88.4 |
| 2012-03-20 07:00:00 | 88.66 |
| 2012-03-20 08:00:00 | 88.14 |
| 2012-03-20 09:00:00 | 88.66 |
| 2012-03-20 10:00:00 | 88.4 |
| 2012-03-20 11:00:00 | 88.66 |
| 2012-03-20 12:00:00 | 88.4 |
| 2012-03-20 13:00:00 | 88.4 |
| 2012-03-20 14:00:00 | 88.66 |
| 2012-03-20 15:00:00 | 88.4 |
| 2012-03-20 16:00:00 | 88.66 |
| 2012-03-20 17:00:00 | 88.4 |
| 2012-03-20 18:00:00 | 88.4 |
| 2012-03-20 19:00:00 | 88.4 |
| 2012-03-20 20:00:00 | 88.4 |
| 2012-03-20 21:00:00 | 88.4 |
| 2012-03-20 22:00:00 | 88.66 |
| 2012-03-20 23:00:00 | 88.4 |
| 2012-03-21 | 88.66 |
| 2012-03-21 01:00:00 | 88.4 |
| 2012-03-21 02:00:00 | 88.66 |
| 2012-03-21 03:00:00 | 88.66 |
| 2012-03-21 04:00:00 | 88.4 |
| 2012-03-21 05:00:00 | 88.66 |
| 2012-03-21 06:00:00 | 88.4 |
| 2012-03-21 07:00:00 | 88.4 |
| 2012-03-21 08:00:00 | 88.14 |
| 2012-03-21 09:00:00 | 88.14 |
| 2012-03-21 10:00:00 | 88.4 |
| 2012-03-21 11:00:00 | 88.4 |
| 2012-03-21 12:00:00 | 88.14 |
| 2012-03-21 13:00:00 | 88.4 |
| 2012-03-21 14:00:00 | 88.4 |
| 2012-03-21 15:00:00 | 88.14 |
| 2012-03-21 16:00:00 | 88.4 |
| 2012-03-21 17:00:00 | 88.4 |
| 2012-03-21 18:00:00 | 88.4 |
| 2012-03-21 19:00:00 | 88.14 |
| 2012-03-21 20:00:00 | 88.4 |
| 2012-03-21 21:00:00 | 88.4 |
| 2012-03-21 22:00:00 | 88.4 |
| 2012-03-21 23:00:00 | 88.4 |
| 2012-03-22 | 88.4 |
| 2012-03-22 01:00:00 | 88.66 |
| 2012-03-22 02:00:00 | 88.4 |
| 2012-03-22 03:00:00 | 88.66 |
| 2012-03-22 04:00:00 | 88.92 |
| 2012-03-22 05:00:00 | 88.66 |
| 2012-03-22 06:00:00 | 88.66 |
| 2012-03-22 07:00:00 | 88.4 |
| 2012-03-22 08:00:00 | 88.4 |
| 2012-03-22 09:00:00 | 85.28 |
| 2012-03-22 10:00:00 | 89.44 |
| 2012-03-22 11:00:00 | 89.18 |
| 2012-03-22 12:00:00 | 89.18 |
| 2012-03-22 13:00:00 | 89.18 |
| 2012-03-22 14:00:00 | 89.44 |
| 2012-03-22 15:00:00 | 89.18 |
| 2012-03-22 16:00:00 | 89.18 |
| 2012-03-22 17:00:00 | 89.18 |
| 2012-03-22 18:00:00 | 89.18 |
| 2012-03-22 19:00:00 | 88.92 |
| 2012-03-22 20:00:00 | 88.92 |
| 2012-03-22 21:00:00 | 89.18 |
| 2012-03-22 22:00:00 | 88.92 |
| 2012-03-22 23:00:00 | 89.18 |
| 2012-03-23 | 89.18 |
| 2012-03-23 01:00:00 | 89.18 |
| 2012-03-23 02:00:00 | 88.92 |
| 2012-03-23 03:00:00 | 89.18 |
| 2012-03-23 04:00:00 | 88.92 |
| 2012-03-23 05:00:00 | 89.18 |
| 2012-03-23 06:00:00 | 88.92 |
| 2012-03-23 07:00:00 | 88.92 |
| 2012-03-23 08:00:00 | 88.92 |
| 2012-03-23 09:00:00 | 89.18 |
| 2012-03-23 10:00:00 | 88.66 |
| 2012-03-23 11:00:00 | 88.92 |
| 2012-03-23 12:00:00 | 88.92 |
| 2012-03-23 13:00:00 | 88.92 |
| 2012-03-23 14:00:00 | 88.92 |
| 2012-03-23 15:00:00 | 89.18 |
| 2012-03-23 16:00:00 | 88.92 |
| 2012-03-23 17:00:00 | 88.92 |
| 2012-03-23 18:00:00 | 88.92 |
| 2012-03-23 19:00:00 | 88.92 |
| 2012-03-23 20:00:00 | 88.92 |
| 2012-03-23 21:00:00 | 89.18 |
| 2012-03-23 22:00:00 | 88.92 |
| 2012-03-23 23:00:00 | 89.18 |
| 2012-03-24 | 88.92 |
| 2012-03-24 01:00:00 | 89.18 |
| 2012-03-24 02:00:00 | 89.18 |
| 2012-03-24 03:00:00 | 89.18 |
| 2012-03-24 04:00:00 | 88.92 |
| 2012-03-24 05:00:00 | 89.18 |
| 2012-03-24 06:00:00 | 89.18 |
| 2012-03-24 07:00:00 | 88.92 |
| 2012-03-24 08:00:00 | 88.66 |
| 2012-03-24 09:00:00 | 88.66 |
| 2012-03-24 10:00:00 | 88.92 |
| 2012-03-24 11:00:00 | 88.66 |
| 2012-03-24 12:00:00 | 88.92 |
| 2012-03-24 13:00:00 | 88.66 |
| 2012-03-24 14:00:00 | 88.92 |
| 2012-03-24 15:00:00 | 88.92 |
| 2012-03-24 16:00:00 | 88.66 |
| 2012-03-24 17:00:00 | 88.66 |
| 2012-03-24 18:00:00 | 88.92 |
| 2012-03-24 19:00:00 | 88.92 |
| 2012-03-24 20:00:00 | 88.66 |
| 2012-03-24 21:00:00 | 88.66 |
| 2012-03-24 22:00:00 | 88.92 |
| 2012-03-24 23:00:00 | 88.92 |
| 2012-03-25 | 88.92 |
| 2012-03-25 01:00:00 | 88.66 |
| 2012-03-25 03:00:00 | 88.92 |
| 2012-03-25 04:00:00 | 89.18 |
| 2012-03-25 05:00:00 | 88.92 |
| 2012-03-25 06:00:00 | 88.92 |
| 2012-03-25 07:00:00 | 88.92 |
| 2012-03-25 08:00:00 | 88.92 |
| 2012-03-25 09:00:00 | 88.92 |
| 2012-03-25 10:00:00 | 88.66 |
| 2012-03-25 11:00:00 | 88.66 |
| 2012-03-25 12:00:00 | 88.92 |
| 2012-03-25 13:00:00 | 88.66 |
| 2012-03-25 14:00:00 | 89.18 |
| 2012-03-25 15:00:00 | 89.18 |
| 2012-03-25 16:00:00 | 88.66 |
| 2012-03-25 17:00:00 | 88.92 |
| 2012-03-25 18:00:00 | 88.92 |
| 2012-03-25 19:00:00 | 88.66 |
| 2012-03-25 20:00:00 | 88.92 |
| 2012-03-25 21:00:00 | 88.66 |
| 2012-03-25 22:00:00 | 88.92 |
| 2012-03-25 23:00:00 | 88.92 |
| 2012-03-26 | 88.92 |
| 2012-03-26 01:00:00 | 88.92 |
| 2012-03-26 02:00:00 | 89.18 |
| 2012-03-26 03:00:00 | 88.92 |
| 2012-03-26 04:00:00 | 89.18 |
| 2012-03-26 05:00:00 | 89.18 |
| 2012-03-26 06:00:00 | 88.92 |
| 2012-03-26 07:00:00 | 88.66 |
| 2012-03-26 08:00:00 | 88.66 |
| 2012-03-26 09:00:00 | 88.92 |
| 2012-03-26 10:00:00 | 88.92 |
| 2012-03-26 11:00:00 | 88.66 |
| 2012-03-26 12:00:00 | 88.66 |
| 2012-03-26 13:00:00 | 88.66 |
| 2012-03-26 14:00:00 | 88.66 |
| 2012-03-26 15:00:00 | 88.92 |
| 2012-03-26 16:00:00 | 88.66 |
| 2012-03-26 17:00:00 | 88.92 |
| 2012-03-26 18:00:00 | 88.66 |
| 2012-03-26 19:00:00 | 88.92 |
| 2012-03-26 20:00:00 | 88.66 |
| 2012-03-26 21:00:00 | 88.66 |
| 2012-03-26 22:00:00 | 88.92 |
| 2012-03-26 23:00:00 | 88.92 |
| 2012-03-27 | 88.92 |
| 2012-03-27 01:00:00 | 88.92 |
| 2012-03-27 02:00:00 | 88.92 |
| 2012-03-27 03:00:00 | 88.92 |
| 2012-03-27 04:00:00 | 88.92 |
| 2012-03-27 05:00:00 | 88.92 |
| 2012-03-27 06:00:00 | 88.92 |
| 2012-03-27 07:00:00 | 88.66 |
| 2012-03-27 08:00:00 | 88.92 |
| 2012-03-27 09:00:00 | 88.66 |
| 2012-03-27 10:00:00 | 88.92 |
| 2012-03-27 11:00:00 | 88.66 |
| 2012-03-27 12:00:00 | 88.92 |
| 2012-03-27 13:00:00 | 88.66 |
| 2012-03-27 14:00:00 | 88.92 |
| 2012-03-27 15:00:00 | 88.92 |
| 2012-03-27 16:00:00 | 88.92 |
| 2012-03-27 17:00:00 | 88.66 |
| 2012-03-27 18:00:00 | 88.92 |
| 2012-03-27 19:00:00 | 88.92 |
| 2012-03-27 20:00:00 | 88.92 |
| 2012-03-27 21:00:00 | 88.66 |
| 2012-03-27 22:00:00 | 88.92 |
| 2012-03-27 23:00:00 | 88.92 |
| 2012-03-28 | 88.92 |
| 2012-03-28 01:00:00 | 89.18 |
| 2012-03-28 02:00:00 | 88.92 |
| 2012-03-28 03:00:00 | 88.92 |
| 2012-03-28 04:00:00 | 89.18 |
| 2012-03-28 05:00:00 | 88.92 |
| 2012-03-28 06:00:00 | 88.92 |
| 2012-03-28 07:00:00 | 88.92 |
| 2012-03-28 08:00:00 | 88.66 |
| 2012-03-28 09:00:00 | 88.66 |
| 2012-03-28 10:00:00 | 88.66 |
| 2012-03-28 11:00:00 | 88.92 |
| 2012-03-28 12:00:00 | 88.66 |
| 2012-03-28 13:00:00 | 88.92 |
| 2012-03-28 14:00:00 | 88.66 |
| 2012-03-28 15:00:00 | 88.66 |
| 2012-03-28 16:00:00 | 88.66 |
| 2012-03-28 17:00:00 | 88.66 |
| 2012-03-28 18:00:00 | 88.92 |
| 2012-03-28 19:00:00 | 88.66 |
| 2012-03-28 20:00:00 | 88.66 |
| 2012-03-28 21:00:00 | 88.66 |
| 2012-03-28 22:00:00 | 88.92 |
| 2012-03-28 23:00:00 | 88.92 |
| 2012-03-29 | 88.92 |
| 2012-03-29 01:00:00 | 88.66 |
| 2012-03-29 02:00:00 | 88.92 |
| 2012-03-29 03:00:00 | 88.92 |
| 2012-03-29 04:00:00 | 88.92 |
| 2012-03-29 05:00:00 | 88.92 |
| 2012-03-29 06:00:00 | 88.92 |
| 2012-03-29 07:00:00 | 88.92 |
| 2012-03-29 08:00:00 | 88.66 |
| 2012-03-29 09:00:00 | 88.66 |
| 2012-03-29 10:00:00 | 88.66 |
| 2012-03-29 11:00:00 | 88.92 |
| 2012-03-29 12:00:00 | 88.66 |
| 2012-03-29 13:00:00 | 88.92 |
| 2012-03-29 14:00:00 | 88.66 |
| 2012-03-29 15:00:00 | 88.66 |
| 2012-03-29 16:00:00 | 88.92 |
| 2012-03-29 17:00:00 | 88.66 |
| 2012-03-29 18:00:00 | 88.92 |
| 2012-03-29 19:00:00 | 88.66 |
| 2012-03-29 20:00:00 | 88.66 |
| 2012-03-29 21:00:00 | 88.92 |
| 2012-03-29 22:00:00 | 88.92 |
| 2012-03-29 23:00:00 | 88.92 |
| 2012-03-30 | 88.92 |
| 2012-03-30 01:00:00 | 88.92 |
| 2012-03-30 02:00:00 | 89.18 |
| 2012-03-30 03:00:00 | 89.18 |
| 2012-03-30 04:00:00 | 89.18 |
| 2012-03-30 05:00:00 | 89.18 |
| 2012-03-30 06:00:00 | 88.92 |
| 2012-03-30 07:00:00 | 88.92 |
| 2012-03-30 08:00:00 | 88.92 |
| 2012-03-30 09:00:00 | 88.66 |
| 2012-03-30 10:00:00 | 88.66 |
| 2012-03-30 11:00:00 | 88.92 |
| 2012-03-30 12:00:00 | 88.66 |
| 2012-03-30 13:00:00 | 88.92 |
| 2012-03-30 14:00:00 | 88.66 |
| 2012-03-30 15:00:00 | 88.92 |
| 2012-03-30 16:00:00 | 88.66 |
| 2012-03-30 17:00:00 | 88.92 |
| 2012-03-30 18:00:00 | 88.92 |
| 2012-03-30 19:00:00 | 88.92 |
| 2012-03-30 20:00:00 | 88.66 |
| 2012-03-30 21:00:00 | 88.92 |
| 2012-03-30 22:00:00 | 88.92 |
| 2012-03-30 23:00:00 | 88.92 |
| 2012-03-31 | 88.92 |
| 2012-03-31 01:00:00 | 88.92 |
| 2012-03-31 02:00:00 | 89.18 |
| 2012-03-31 03:00:00 | 88.92 |
| 2012-03-31 04:00:00 | 88.92 |
| 2012-03-31 05:00:00 | 89.18 |
| 2012-03-31 06:00:00 | 88.92 |
| 2012-03-31 07:00:00 | 88.92 |
| 2012-03-31 08:00:00 | 88.92 |
| 2012-03-31 09:00:00 | 88.92 |
| 2012-03-31 10:00:00 | 88.92 |
| 2012-03-31 11:00:00 | 88.66 |
| 2012-03-31 12:00:00 | 88.92 |
| 2012-03-31 13:00:00 | 88.92 |
| 2012-03-31 14:00:00 | 88.92 |
| 2012-03-31 15:00:00 | 88.92 |
| 2012-03-31 16:00:00 | 88.92 |
| 2012-03-31 17:00:00 | 88.92 |
| 2012-03-31 18:00:00 | 88.92 |
| 2012-03-31 19:00:00 | 88.92 |
| 2012-03-31 20:00:00 | 88.92 |
| 2012-03-31 21:00:00 | 88.66 |
| 2012-03-31 22:00:00 | 88.92 |
| 2012-03-31 23:00:00 | 88.92 |
| 2012-04-01 | 88.92 |
| 2012-04-01 01:00:00 | 88.92 |
| 2012-04-01 02:00:00 | 89.18 |
| 2012-04-01 03:00:00 | 88.92 |
| 2012-04-01 04:00:00 | 89.18 |
| 2012-04-01 05:00:00 | 88.92 |
| 2012-04-01 06:00:00 | 89.18 |
| 2012-04-01 07:00:00 | 89.18 |
| 2012-04-01 08:00:00 | 88.92 |
| 2012-04-01 09:00:00 | 89.18 |
| 2012-04-01 10:00:00 | 88.92 |
| 2012-04-01 11:00:00 | 88.92 |
| 2012-04-01 12:00:00 | 88.66 |
| 2012-04-01 13:00:00 | 88.92 |
| 2012-04-01 14:00:00 | 88.66 |
| 2012-04-01 15:00:00 | 88.66 |
| 2012-04-01 16:00:00 | 88.92 |
| 2012-04-01 17:00:00 | 88.66 |
| 2012-04-01 18:00:00 | 88.92 |
| 2012-04-01 19:00:00 | 88.66 |
| 2012-04-01 20:00:00 | 88.66 |
| 2012-04-01 21:00:00 | 88.66 |
| 2012-04-01 22:00:00 | 88.4 |
| 2012-04-01 23:00:00 | 88.92 |
| 2012-04-02 | 88.66 |
| 2012-04-02 01:00:00 | 88.66 |
| 2012-04-02 02:00:00 | 88.92 |
| 2012-04-02 03:00:00 | 88.66 |
| 2012-04-02 04:00:00 | 88.92 |
| 2012-04-02 05:00:00 | 88.66 |
| 2012-04-02 06:00:00 | 88.66 |
| 2012-04-02 07:00:00 | 88.66 |
| 2012-04-02 08:00:00 | 88.4 |
| 2012-04-02 09:00:00 | 88.66 |
| 2012-04-02 10:00:00 | 88.4 |
| 2012-04-02 11:00:00 | 88.4 |
| 2012-04-02 12:00:00 | 88.66 |
| 2012-04-02 13:00:00 | 88.66 |
| 2012-04-02 14:00:00 | 88.66 |
| 2012-04-02 15:00:00 | 88.66 |
| 2012-04-02 16:00:00 | 88.4 |
| 2012-04-02 17:00:00 | 88.66 |
| 2012-04-02 18:00:00 | 88.66 |
| 2012-04-02 19:00:00 | 88.66 |
| 2012-04-02 20:00:00 | 88.4 |
| 2012-04-02 21:00:00 | 88.66 |
| 2012-04-02 22:00:00 | 88.66 |
| 2012-04-02 23:00:00 | 88.92 |
| 2012-04-03 | 88.66 |
| 2012-04-03 01:00:00 | 88.92 |
| 2012-04-03 02:00:00 | 88.92 |
| 2012-04-03 03:00:00 | 88.92 |
| 2012-04-03 04:00:00 | 88.66 |
| 2012-04-03 05:00:00 | 88.92 |
| 2012-04-03 06:00:00 | 88.66 |
| 2012-04-03 07:00:00 | 88.66 |
| 2012-04-03 08:00:00 | 88.4 |
| 2012-04-03 09:00:00 | 88.66 |
| 2012-04-03 10:00:00 | 88.66 |
| 2012-04-03 11:00:00 | 88.66 |
| 2012-04-03 12:00:00 | 88.66 |
| 2012-04-03 13:00:00 | 88.92 |
| 2012-04-03 14:00:00 | 88.66 |
| 2012-04-03 15:00:00 | 88.66 |
| 2012-04-03 16:00:00 | 88.66 |
| 2012-04-03 17:00:00 | 88.66 |
| 2012-04-03 18:00:00 | 88.66 |
| 2012-04-03 19:00:00 | 88.66 |
| 2012-04-03 20:00:00 | 88.4 |
| 2012-04-03 21:00:00 | 88.66 |
| 2012-04-03 22:00:00 | 88.66 |
| 2012-04-03 23:00:00 | 88.66 |
| 2012-04-04 | 88.66 |
| 2012-04-04 01:00:00 | 88.66 |
| 2012-04-04 02:00:00 | 88.66 |
| 2012-04-04 03:00:00 | 88.92 |
| 2012-04-04 04:00:00 | 88.66 |
| 2012-04-04 05:00:00 | 88.66 |
| 2012-04-04 06:00:00 | 88.66 |
| 2012-04-04 07:00:00 | 88.66 |
| 2012-04-04 08:00:00 | 88.4 |
| 2012-04-04 09:00:00 | 88.4 |
| 2012-04-04 10:00:00 | 88.4 |
| 2012-04-04 11:00:00 | 88.66 |
| 2012-04-04 12:00:00 | 88.4 |
| 2012-04-04 13:00:00 | 88.66 |
| 2012-04-04 14:00:00 | 88.66 |
| 2012-04-04 15:00:00 | 88.66 |
| 2012-04-04 16:00:00 | 88.4 |
| 2012-04-04 17:00:00 | 88.66 |
| 2012-04-04 18:00:00 | 88.66 |
| 2012-04-04 19:00:00 | 88.4 |
| 2012-04-04 20:00:00 | 88.66 |
| 2012-04-04 21:00:00 | 88.66 |
| 2012-04-04 22:00:00 | 88.66 |
| 2012-04-04 23:00:00 | 88.66 |
| 2012-04-05 | 88.66 |
| 2012-04-05 01:00:00 | 88.92 |
| 2012-04-05 02:00:00 | 88.66 |
| 2012-04-05 03:00:00 | 88.66 |
| 2012-04-05 04:00:00 | 88.92 |
| 2012-04-05 05:00:00 | 88.4 |
| 2012-04-05 06:00:00 | 88.66 |
| 2012-04-05 07:00:00 | 88.66 |
| 2012-04-05 08:00:00 | 88.4 |
| 2012-04-05 09:00:00 | 88.4 |
| 2012-04-05 10:00:00 | 88.4 |
| 2012-04-05 11:00:00 | 88.4 |
| 2012-04-05 12:00:00 | 88.4 |
| 2012-04-05 13:00:00 | 88.66 |
| 2012-04-05 14:00:00 | 88.4 |
| 2012-04-05 15:00:00 | 88.4 |
| 2012-04-05 16:00:00 | 88.66 |
| 2012-04-05 17:00:00 | 88.4 |
| 2012-04-05 18:00:00 | 88.66 |
| 2012-04-05 19:00:00 | 88.4 |
| 2012-04-05 20:00:00 | 88.4 |
| 2012-04-05 21:00:00 | 88.66 |
| 2012-04-05 22:00:00 | 88.4 |
| 2012-04-05 23:00:00 | 88.66 |
| 2012-04-06 | 88.66 |
| 2012-04-06 01:00:00 | 88.66 |
| 2012-04-06 02:00:00 | 88.66 |
| 2012-04-06 03:00:00 | 88.92 |
| 2012-04-06 04:00:00 | 88.66 |
| 2012-04-06 05:00:00 | 88.66 |
| 2012-04-06 06:00:00 | 88.66 |
| 2012-04-06 07:00:00 | 88.4 |
| 2012-04-06 08:00:00 | 88.4 |
| 2012-04-06 09:00:00 | 88.66 |
| 2012-04-06 10:00:00 | 88.4 |
| 2012-04-06 11:00:00 | 88.4 |
| 2012-04-06 12:00:00 | 88.4 |
| 2012-04-06 13:00:00 | 88.66 |
| 2012-04-06 14:00:00 | 88.66 |
| 2012-04-06 15:00:00 | 88.66 |
| 2012-04-06 16:00:00 | 88.4 |
| 2012-04-06 17:00:00 | 88.4 |
| 2012-04-06 18:00:00 | 88.66 |
| 2012-04-06 19:00:00 | 88.4 |
| 2012-04-06 20:00:00 | 88.66 |
| 2012-04-06 21:00:00 | 88.4 |
| 2012-04-06 22:00:00 | 88.66 |
| 2012-04-06 23:00:00 | 88.66 |
| 2012-04-07 | 88.66 |
| 2012-04-07 01:00:00 | 88.66 |
| 2012-04-07 02:00:00 | 88.92 |
| 2012-04-07 03:00:00 | 88.66 |
| 2012-04-07 04:00:00 | 88.66 |
| 2012-04-07 05:00:00 | 88.92 |
| 2012-04-07 06:00:00 | 88.66 |
| 2012-04-07 07:00:00 | 88.66 |
| 2012-04-07 08:00:00 | 88.66 |
| 2012-04-07 09:00:00 | 88.4 |
| 2012-04-07 10:00:00 | 88.66 |
| 2012-04-07 11:00:00 | 88.4 |
| 2012-04-07 12:00:00 | 88.66 |
| 2012-04-07 13:00:00 | 88.66 |
| 2012-04-07 14:00:00 | 88.66 |
| 2012-04-07 15:00:00 | 88.66 |
| 2012-04-07 16:00:00 | 88.66 |
| 2012-04-07 17:00:00 | 67.34 |
| 2012-04-07 18:00:00 | 88.92 |
| 2012-04-07 19:00:00 | 89.18 |
| 2012-04-07 20:00:00 | 88.92 |
| 2012-04-07 21:00:00 | 89.18 |
| 2012-04-07 22:00:00 | 89.18 |
| 2012-04-07 23:00:00 | 89.18 |
| 2012-04-08 | 89.18 |
| 2012-04-08 01:00:00 | 89.18 |
| 2012-04-08 02:00:00 | 89.18 |
| 2012-04-08 03:00:00 | 89.44 |
| 2012-04-08 04:00:00 | 89.18 |
| 2012-04-08 05:00:00 | 89.18 |
| 2012-04-08 06:00:00 | 89.18 |
| 2012-04-08 07:00:00 | 89.18 |
| 2012-04-08 08:00:00 | 88.92 |
| 2012-04-08 09:00:00 | 88.92 |
| 2012-04-08 10:00:00 | 89.18 |
| 2012-04-08 11:00:00 | 88.92 |
| 2012-04-08 12:00:00 | 88.66 |
| 2012-04-08 13:00:00 | 89.18 |
| 2012-04-08 14:00:00 | 88.92 |
| 2012-04-08 15:00:00 | 89.18 |
| 2012-04-08 16:00:00 | 88.92 |
| 2012-04-08 17:00:00 | 88.92 |
| 2012-04-08 18:00:00 | 88.92 |
| 2012-04-08 19:00:00 | 88.92 |
| 2012-04-08 20:00:00 | 88.66 |
| 2012-04-08 21:00:00 | 88.92 |
| 2012-04-08 22:00:00 | 88.92 |
| 2012-04-08 23:00:00 | 88.92 |
| 2012-04-09 | 88.92 |
| 2012-04-09 01:00:00 | 89.18 |
| 2012-04-09 02:00:00 | 88.92 |
| 2012-04-09 03:00:00 | 88.92 |
| 2012-04-09 04:00:00 | 88.66 |
| 2012-04-09 05:00:00 | 88.92 |
| 2012-04-09 06:00:00 | 88.66 |
| 2012-04-09 07:00:00 | 88.92 |
| 2012-04-09 08:00:00 | 88.66 |
| 2012-04-09 09:00:00 | 88.92 |
| 2012-04-09 10:00:00 | 88.66 |
| 2012-04-09 11:00:00 | 88.92 |
| 2012-04-09 12:00:00 | 88.92 |
| 2012-04-09 13:00:00 | 88.92 |
| 2012-04-09 14:00:00 | 88.92 |
| 2012-04-09 15:00:00 | 88.92 |
| 2012-04-09 16:00:00 | 88.92 |
| 2012-04-09 17:00:00 | 88.92 |
| 2012-04-09 18:00:00 | 88.92 |
| 2012-04-09 19:00:00 | 88.92 |
| 2012-04-09 20:00:00 | 88.66 |
| 2012-04-09 21:00:00 | 88.92 |
| 2012-04-09 22:00:00 | 88.92 |
| 2012-04-09 23:00:00 | 88.66 |
| 2012-04-10 | 88.92 |
| 2012-04-10 01:00:00 | 89.18 |
| 2012-04-10 02:00:00 | 88.92 |
| 2012-04-10 03:00:00 | 88.92 |
| 2012-04-10 04:00:00 | 88.92 |
| 2012-04-10 05:00:00 | 88.92 |
| 2012-04-10 06:00:00 | 88.92 |
| 2012-04-10 07:00:00 | 88.66 |
| 2012-04-10 08:00:00 | 88.66 |
| 2012-04-10 09:00:00 | 88.66 |
| 2012-04-10 10:00:00 | 88.4 |
| 2012-04-10 11:00:00 | 88.66 |
| 2012-04-10 12:00:00 | 88.66 |
| 2012-04-10 13:00:00 | 88.92 |
| 2012-04-10 14:00:00 | 88.66 |
| 2012-04-10 15:00:00 | 88.66 |
| 2012-04-10 16:00:00 | 88.66 |
| 2012-04-10 17:00:00 | 88.92 |
| 2012-04-10 18:00:00 | 88.66 |
| 2012-04-10 19:00:00 | 88.92 |
| 2012-04-10 20:00:00 | 88.92 |
| 2012-04-10 21:00:00 | 88.92 |
| 2012-04-10 22:00:00 | 88.66 |
| 2012-04-10 23:00:00 | 88.92 |
| 2012-04-11 | 88.92 |
| 2012-04-11 01:00:00 | 88.92 |
| 2012-04-11 02:00:00 | 89.18 |
| 2012-04-11 03:00:00 | 88.92 |
| 2012-04-11 04:00:00 | 88.92 |
| 2012-04-11 05:00:00 | 89.18 |
| 2012-04-11 06:00:00 | 88.92 |
| 2012-04-11 07:00:00 | 88.66 |
| 2012-04-11 08:00:00 | 88.66 |
| 2012-04-11 09:00:00 | 88.66 |
| 2012-04-11 10:00:00 | 88.66 |
| 2012-04-11 11:00:00 | 88.4 |
| 2012-04-11 12:00:00 | 88.4 |
| 2012-04-11 13:00:00 | 88.66 |
| 2012-04-11 14:00:00 | 88.66 |
| 2012-04-11 15:00:00 | 88.4 |
| 2012-04-11 16:00:00 | 88.66 |
| 2012-04-11 17:00:00 | 88.66 |
| 2012-04-11 18:00:00 | 88.66 |
| 2012-04-11 19:00:00 | 88.66 |
| 2012-04-11 20:00:00 | 88.4 |
| 2012-04-11 21:00:00 | 88.66 |
| 2012-04-11 22:00:00 | 88.66 |
| 2012-04-11 23:00:00 | 88.66 |
| 2012-04-12 | 88.66 |
| 2012-04-12 01:00:00 | 88.92 |
| 2012-04-12 02:00:00 | 88.66 |
| 2012-04-12 03:00:00 | 88.92 |
| 2012-04-12 04:00:00 | 88.92 |
| 2012-04-12 05:00:00 | 88.66 |
| 2012-04-12 06:00:00 | 88.92 |
| 2012-04-12 07:00:00 | 88.4 |
| 2012-04-12 08:00:00 | 88.4 |
| 2012-04-12 09:00:00 | 88.66 |
| 2012-04-12 10:00:00 | 88.4 |
| 2012-04-12 11:00:00 | 88.4 |
| 2012-04-12 12:00:00 | 88.4 |
| 2012-04-12 13:00:00 | 88.66 |
| 2012-04-12 14:00:00 | 88.4 |
| 2012-04-12 15:00:00 | 88.4 |
| 2012-04-12 16:00:00 | 88.4 |
| 2012-04-12 17:00:00 | 88.4 |
| 2012-04-12 18:00:00 | 88.66 |
| 2012-04-12 19:00:00 | 88.4 |
| 2012-04-12 20:00:00 | 88.4 |
| 2012-04-12 21:00:00 | 88.4 |
| 2012-04-12 22:00:00 | 88.66 |
| 2012-04-12 23:00:00 | 88.66 |
| 2012-04-13 | 88.4 |
| 2012-04-13 01:00:00 | 88.66 |
| 2012-04-13 02:00:00 | 88.66 |
| 2012-04-13 03:00:00 | 88.66 |
| 2012-04-13 04:00:00 | 88.66 |
| 2012-04-13 05:00:00 | 88.66 |
| 2012-04-13 06:00:00 | 88.66 |
| 2012-04-13 07:00:00 | 88.4 |
| 2012-04-13 08:00:00 | 88.4 |
| 2012-04-13 09:00:00 | 59.8 |
| 2012-04-13 10:00:00 | 88.66 |
| 2012-04-13 11:00:00 | 88.66 |
| 2012-04-13 12:00:00 | 88.66 |
| 2012-04-13 13:00:00 | 88.66 |
| 2012-04-13 14:00:00 | 88.4 |
| 2012-04-13 15:00:00 | 88.66 |
| 2012-04-13 16:00:00 | 88.66 |
| 2012-04-13 17:00:00 | 88.66 |
| 2012-04-13 18:00:00 | 88.66 |
| 2012-04-13 19:00:00 | 88.4 |
| 2012-04-13 20:00:00 | 88.66 |
| 2012-04-13 21:00:00 | 88.66 |
| 2012-04-13 22:00:00 | 88.92 |
| 2012-04-13 23:00:00 | 88.66 |
| 2012-04-14 | 88.66 |
| 2012-04-14 01:00:00 | 88.66 |
| 2012-04-14 02:00:00 | 88.92 |
| 2012-04-14 03:00:00 | 88.66 |
| 2012-04-14 04:00:00 | 88.92 |
| 2012-04-14 05:00:00 | 88.66 |
| 2012-04-14 06:00:00 | 88.66 |
| 2012-04-14 07:00:00 | 88.92 |
| 2012-04-14 08:00:00 | 88.66 |
| 2012-04-14 09:00:00 | 88.66 |
| 2012-04-14 10:00:00 | 88.4 |
| 2012-04-14 11:00:00 | 88.66 |
| 2012-04-14 12:00:00 | 88.66 |
| 2012-04-14 13:00:00 | 88.4 |
| 2012-04-14 14:00:00 | 88.66 |
| 2012-04-14 15:00:00 | 88.66 |
| 2012-04-14 16:00:00 | 88.66 |
| 2012-04-14 17:00:00 | 88.4 |
| 2012-04-14 18:00:00 | 88.66 |
| 2012-04-14 19:00:00 | 88.66 |
| 2012-04-14 20:00:00 | 88.4 |
| 2012-04-14 21:00:00 | 88.66 |
| 2012-04-14 22:00:00 | 88.66 |
| 2012-04-14 23:00:00 | 88.66 |
| 2012-04-15 | 88.66 |
| 2012-04-15 01:00:00 | 88.66 |
| 2012-04-15 02:00:00 | 88.66 |
| 2012-04-15 03:00:00 | 88.66 |
| 2012-04-15 04:00:00 | 88.92 |
| 2012-04-15 05:00:00 | 88.66 |
| 2012-04-15 06:00:00 | 88.66 |
| 2012-04-15 07:00:00 | 88.66 |
| 2012-04-15 08:00:00 | 64.22 |
| 2012-04-15 09:00:00 | 89.18 |
| 2012-04-15 10:00:00 | 89.18 |
| 2012-04-15 11:00:00 | 88.92 |
| 2012-04-15 12:00:00 | 89.18 |
| 2012-04-15 13:00:00 | 81.64 |
| 2012-04-15 14:00:00 | 50.18 |
| 2012-04-15 15:00:00 | 50.44 |
| 2012-04-15 16:00:00 | 50.18 |
| 2012-04-15 17:00:00 | 50.18 |
| 2012-04-15 18:00:00 | 50.18 |
| 2012-04-15 19:00:00 | 50.18 |
| 2012-04-15 20:00:00 | 50.18 |
| 2012-04-15 21:00:00 | 50.18 |
| 2012-04-15 22:00:00 | 50.18 |
| 2012-04-15 23:00:00 | 50.18 |
| 2012-04-16 | 50.18 |
| 2012-04-16 01:00:00 | 49.92 |
| 2012-04-16 02:00:00 | 50.18 |
| 2012-04-16 03:00:00 | 50.18 |
| 2012-04-16 04:00:00 | 50.18 |
| 2012-04-16 05:00:00 | 50.18 |
| 2012-04-16 06:00:00 | 49.92 |
| 2012-04-16 07:00:00 | 49.92 |
| 2012-04-16 08:00:00 | 49.92 |
| 2012-04-16 09:00:00 | 49.92 |
| 2012-04-16 10:00:00 | 49.92 |
| 2012-04-16 11:00:00 | 49.66 |
| 2012-04-16 12:00:00 | 49.92 |
| 2012-04-16 13:00:00 | 49.66 |
| 2012-04-16 14:00:00 | 48.88 |
| 2012-04-16 15:00:00 | 0.52 |
| 2012-04-16 16:00:00 | 0.78 |
| 2012-04-16 17:00:00 | 0.78 |
| 2012-04-16 18:00:00 | 0.78 |
| 2012-04-16 19:00:00 | 0.52 |
| 2012-04-16 20:00:00 | 0.78 |
| 2012-04-16 21:00:00 | 0.78 |
| 2012-04-16 22:00:00 | 0.78 |
| 2012-04-16 23:00:00 | 0.78 |
| 2012-04-17 | 0.52 |
| 2012-04-17 01:00:00 | 0.78 |
| 2012-04-17 02:00:00 | 0.78 |
| 2012-04-17 03:00:00 | 0.78 |
| 2012-04-17 04:00:00 | 0.52 |
| 2012-04-17 05:00:00 | 0.78 |
| 2012-04-17 06:00:00 | 0.78 |
| 2012-04-17 07:00:00 | 0.78 |
| 2012-04-17 08:00:00 | 0.78 |
| 2012-04-17 09:00:00 | 0.52 |
| 2012-04-17 10:00:00 | 1.04 |
| 2012-04-17 11:00:00 | 1.04 |
| 2012-04-17 12:00:00 | 1.04 |
| 2012-04-17 13:00:00 | 0.52 |
| 2012-04-17 14:00:00 | 0.78 |
| 2012-04-17 15:00:00 | 0.78 |
| 2012-04-17 16:00:00 | 0.78 |
| 2012-04-17 17:00:00 | 0.78 |
| 2012-04-17 18:00:00 | 0.52 |
| 2012-04-17 19:00:00 | 0.78 |
| 2012-04-17 20:00:00 | 0.78 |
| 2012-04-17 21:00:00 | 0.78 |
| 2012-04-17 22:00:00 | 0.78 |
| 2012-04-17 23:00:00 | 0.52 |
| 2012-04-18 | 0.78 |
| 2012-04-18 01:00:00 | 0.78 |
| 2012-04-18 02:00:00 | 0.78 |
| 2012-04-18 03:00:00 | 0.78 |
| 2012-04-18 04:00:00 | 0.52 |
| 2012-04-18 05:00:00 | 0.78 |
| 2012-04-18 06:00:00 | 0.78 |
| 2012-04-18 07:00:00 | 0.78 |
| 2012-04-18 08:00:00 | 0.78 |
| 2012-04-18 09:00:00 | 0.52 |
| 2012-04-18 10:00:00 | 0.78 |
| 2012-04-18 11:00:00 | 0.78 |
| 2012-04-18 12:00:00 | 0.78 |
| 2012-04-18 13:00:00 | 0.52 |
| 2012-04-18 14:00:00 | 0.78 |
| 2012-04-18 15:00:00 | 0.78 |
| 2012-04-18 16:00:00 | 0.78 |
| 2012-04-18 17:00:00 | 0.78 |
| 2012-04-18 18:00:00 | 0.52 |
| 2012-04-18 19:00:00 | 0.78 |
| 2012-04-18 20:00:00 | 0.78 |
| 2012-04-18 21:00:00 | 0.78 |
| 2012-04-18 22:00:00 | 0.78 |
| 2012-04-18 23:00:00 | 0.52 |
| 2012-04-19 | 0.78 |
| 2012-04-19 01:00:00 | 0.78 |
| 2012-04-19 02:00:00 | 0.78 |
| 2012-04-19 03:00:00 | 0.78 |
| 2012-04-19 04:00:00 | 0.52 |
| 2012-04-19 05:00:00 | 0.78 |
| 2012-04-19 06:00:00 | 0.78 |
| 2012-04-19 07:00:00 | 0.78 |
| 2012-04-19 08:00:00 | 0.78 |
| 2012-04-19 09:00:00 | 0.52 |
| 2012-04-19 10:00:00 | 0.78 |
| 2012-04-19 11:00:00 | 0.78 |
| 2012-04-19 12:00:00 | 0.78 |
| 2012-04-19 13:00:00 | 0.78 |
| 2012-04-19 14:00:00 | 0.52 |
| 2012-04-19 15:00:00 | 0.78 |
| 2012-04-19 16:00:00 | 0.78 |
| 2012-04-19 17:00:00 | 0.78 |
| 2012-04-19 18:00:00 | 0.78 |
| 2012-04-19 19:00:00 | 0.52 |
| 2012-04-19 20:00:00 | 0.78 |
| 2012-04-19 21:00:00 | 0.78 |
| 2012-04-19 22:00:00 | 0.78 |
| 2012-04-19 23:00:00 | 0.78 |
| 2012-04-20 | 0.52 |
| 2012-04-20 01:00:00 | 0.78 |
| 2012-04-20 02:00:00 | 0.78 |
| 2012-04-20 03:00:00 | 0.78 |
| 2012-04-20 04:00:00 | 0.78 |
| 2012-04-20 05:00:00 | 0.52 |
| 2012-04-20 06:00:00 | 0.78 |
| 2012-04-20 07:00:00 | 19.76 |
| 2012-04-20 08:00:00 | 7.8 |
| 2012-04-20 09:00:00 | 0.78 |
| 2012-04-20 10:00:00 | 0.78 |
| 2012-04-20 11:00:00 | 0.52 |
| 2012-04-20 12:00:00 | 0.78 |
| 2012-04-20 13:00:00 | 0.78 |
| 2012-04-20 14:00:00 | 0.78 |
| 2012-04-20 15:00:00 | 0.78 |
| 2012-04-20 16:00:00 | 0.52 |
| 2012-04-20 17:00:00 | 0.78 |
| 2012-04-20 18:00:00 | 0.78 |
| 2012-04-20 19:00:00 | 0.78 |
| 2012-04-20 20:00:00 | 0.52 |
| 2012-04-20 21:00:00 | 0.78 |
| 2012-04-20 22:00:00 | 0.78 |
| 2012-04-20 23:00:00 | 0.78 |
| 2012-04-21 | 0.78 |
| 2012-04-21 01:00:00 | 0.52 |
| 2012-04-21 02:00:00 | 0.78 |
| 2012-04-21 03:00:00 | 0.78 |
| 2012-04-21 04:00:00 | 0.78 |
| 2012-04-21 05:00:00 | 0.78 |
| 2012-04-21 06:00:00 | 0.52 |
| 2012-04-21 07:00:00 | 20.02 |
| 2012-04-21 08:00:00 | 43.42 |
| 2012-04-21 09:00:00 | 43.42 |
| 2012-04-21 10:00:00 | 43.68 |
| 2012-04-21 11:00:00 | 43.68 |
| 2012-04-21 12:00:00 | 43.68 |
| 2012-04-21 13:00:00 | 30.94 |
| 2012-04-21 14:00:00 | 0.52 |
| 2012-04-21 15:00:00 | 0.78 |
| 2012-04-21 16:00:00 | 0.78 |
| 2012-04-21 17:00:00 | 0.78 |
| 2012-04-21 18:00:00 | 0.78 |
| 2012-04-21 19:00:00 | 0.78 |
| 2012-04-21 20:00:00 | 0.78 |
| 2012-04-21 21:00:00 | 0.52 |
| 2012-04-21 22:00:00 | 0.78 |
| 2012-04-21 23:00:00 | 0.78 |
| 2012-04-22 | 0.78 |
| 2012-04-22 01:00:00 | 0.78 |
| 2012-04-22 02:00:00 | 0.52 |
| 2012-04-22 03:00:00 | 0.78 |
| 2012-04-22 04:00:00 | 0.78 |
| 2012-04-22 05:00:00 | 0.78 |
| 2012-04-22 06:00:00 | 0.78 |
| 2012-04-22 07:00:00 | 0.78 |
| 2012-04-22 08:00:00 | 0.78 |
| 2012-04-22 09:00:00 | 0.52 |
| 2012-04-22 10:00:00 | 0.78 |
| 2012-04-22 11:00:00 | 0.78 |
| 2012-04-22 12:00:00 | 0.78 |
| 2012-04-22 13:00:00 | 37.44 |
| 2012-04-22 14:00:00 | 17.94 |
| 2012-04-22 15:00:00 | 0.78 |
| 2012-04-22 16:00:00 | 27.82 |
| 2012-04-22 17:00:00 | 43.68 |
| 2012-04-22 18:00:00 | 43.42 |
| 2012-04-22 19:00:00 | 43.68 |
| 2012-04-22 20:00:00 | 43.68 |
| 2012-04-22 21:00:00 | 43.68 |
| 2012-04-22 22:00:00 | 43.42 |
| 2012-04-22 23:00:00 | 43.68 |
| 2012-04-23 | 43.68 |
| 2012-04-23 01:00:00 | 45.5 |
| 2012-04-23 02:00:00 | 88.66 |
| 2012-04-23 03:00:00 | 89.18 |
| 2012-04-23 04:00:00 | 89.18 |
| 2012-04-23 05:00:00 | 89.18 |
| 2012-04-23 06:00:00 | 89.18 |
| 2012-04-23 07:00:00 | 89.18 |
| 2012-04-23 08:00:00 | 88.66 |
| 2012-04-23 09:00:00 | 88.66 |
| 2012-04-23 10:00:00 | 88.92 |
| 2012-04-23 11:00:00 | 88.66 |
| 2012-04-23 12:00:00 | 88.92 |
| 2012-04-23 13:00:00 | 88.66 |
| 2012-04-23 14:00:00 | 88.92 |
| 2012-04-23 15:00:00 | 88.66 |
| 2012-04-23 16:00:00 | 88.66 |
| 2012-04-23 17:00:00 | 88.92 |
| 2012-04-23 18:00:00 | 88.66 |
| 2012-04-23 19:00:00 | 88.92 |
| 2012-04-23 20:00:00 | 88.66 |
| 2012-04-23 21:00:00 | 88.92 |
| 2012-04-23 22:00:00 | 88.66 |
| 2012-04-23 23:00:00 | 88.66 |
| 2012-04-24 | 88.92 |
| 2012-04-24 01:00:00 | 88.66 |
| 2012-04-24 02:00:00 | 88.66 |
| 2012-04-24 03:00:00 | 88.92 |
| 2012-04-24 04:00:00 | 88.92 |
| 2012-04-24 05:00:00 | 88.66 |
| 2012-04-24 06:00:00 | 88.66 |
| 2012-04-24 07:00:00 | 88.92 |
| 2012-04-24 08:00:00 | 88.4 |
| 2012-04-24 09:00:00 | 88.66 |
| 2012-04-24 10:00:00 | 88.66 |
| 2012-04-24 11:00:00 | 88.66 |
| 2012-04-24 12:00:00 | 88.66 |
| 2012-04-24 13:00:00 | 88.66 |
| 2012-04-24 14:00:00 | 88.66 |
| 2012-04-24 15:00:00 | 88.66 |
| 2012-04-24 16:00:00 | 88.66 |
| 2012-04-24 17:00:00 | 88.66 |
| 2012-04-24 18:00:00 | 88.66 |
| 2012-04-24 19:00:00 | 88.66 |
| 2012-04-24 20:00:00 | 88.66 |
| 2012-04-24 21:00:00 | 88.66 |
| 2012-04-24 22:00:00 | 88.92 |
| 2012-04-24 23:00:00 | 88.66 |
| 2012-04-25 | 88.92 |
| 2012-04-25 01:00:00 | 88.66 |
| 2012-04-25 02:00:00 | 88.92 |
| 2012-04-25 03:00:00 | 88.66 |
| 2012-04-25 04:00:00 | 88.92 |
| 2012-04-25 05:00:00 | 88.66 |
| 2012-04-25 06:00:00 | 88.66 |
| 2012-04-25 07:00:00 | 88.66 |
| 2012-04-25 08:00:00 | 88.66 |
| 2012-04-25 09:00:00 | 88.4 |
| 2012-04-25 10:00:00 | 88.66 |
| 2012-04-25 11:00:00 | 88.66 |
| 2012-04-25 12:00:00 | 88.4 |
| 2012-04-25 13:00:00 | 88.66 |
| 2012-04-25 14:00:00 | 88.4 |
| 2012-04-25 15:00:00 | 88.66 |
| 2012-04-25 16:00:00 | 88.66 |
| 2012-04-25 17:00:00 | 88.66 |
| 2012-04-25 18:00:00 | 88.66 |
| 2012-04-25 19:00:00 | 88.66 |
| 2012-04-25 20:00:00 | 88.66 |
| 2012-04-25 21:00:00 | 88.66 |
| 2012-04-25 22:00:00 | 88.66 |
| 2012-04-25 23:00:00 | 88.66 |
| 2012-04-26 | 88.92 |
| 2012-04-26 01:00:00 | 88.66 |
| 2012-04-26 02:00:00 | 88.92 |
| 2012-04-26 03:00:00 | 88.66 |
| 2012-04-26 04:00:00 | 88.92 |
| 2012-04-26 05:00:00 | 88.66 |
| 2012-04-26 06:00:00 | 88.92 |
| 2012-04-26 07:00:00 | 88.4 |
| 2012-04-26 08:00:00 | 88.66 |
| 2012-04-26 09:00:00 | 88.66 |
| 2012-04-26 10:00:00 | 88.66 |
| 2012-04-26 11:00:00 | 88.66 |
| 2012-04-26 12:00:00 | 88.66 |
| 2012-04-26 13:00:00 | 88.66 |
| 2012-04-26 14:00:00 | 88.4 |
| 2012-04-26 15:00:00 | 88.66 |
| 2012-04-26 16:00:00 | 88.66 |
| 2012-04-26 17:00:00 | 88.66 |
| 2012-04-26 18:00:00 | 88.66 |
| 2012-04-26 19:00:00 | 88.66 |
| 2012-04-26 20:00:00 | 88.92 |
| 2012-04-26 21:00:00 | 88.4 |
| 2012-04-26 22:00:00 | 88.66 |
| 2012-04-26 23:00:00 | 88.92 |
| 2012-04-27 | 88.66 |
| 2012-04-27 01:00:00 | 88.92 |
| 2012-04-27 02:00:00 | 88.66 |
| 2012-04-27 03:00:00 | 88.92 |
| 2012-04-27 04:00:00 | 88.92 |
| 2012-04-27 05:00:00 | 88.66 |
| 2012-04-27 06:00:00 | 88.92 |
| 2012-04-27 07:00:00 | 88.66 |
| 2012-04-27 08:00:00 | 88.66 |
| 2012-04-27 09:00:00 | 88.4 |
| 2012-04-27 10:00:00 | 88.66 |
| 2012-04-27 11:00:00 | 88.66 |
| 2012-04-27 12:00:00 | 88.66 |
| 2012-04-27 13:00:00 | 88.66 |
| 2012-04-27 14:00:00 | 88.66 |
| 2012-04-27 15:00:00 | 88.66 |
| 2012-04-27 16:00:00 | 88.66 |
| 2012-04-27 17:00:00 | 88.66 |
| 2012-04-27 18:00:00 | 88.92 |
| 2012-04-27 19:00:00 | 88.92 |
| 2012-04-27 20:00:00 | 88.66 |
| 2012-04-27 21:00:00 | 88.66 |
| 2012-04-27 22:00:00 | 88.92 |
| 2012-04-27 23:00:00 | 88.92 |
| 2012-04-28 | 88.66 |
| 2012-04-28 01:00:00 | 88.92 |
| 2012-04-28 02:00:00 | 88.92 |
| 2012-04-28 03:00:00 | 88.92 |
| 2012-04-28 04:00:00 | 88.92 |
| 2012-04-28 05:00:00 | 88.92 |
| 2012-04-28 06:00:00 | 89.18 |
| 2012-04-28 07:00:00 | 88.92 |
| 2012-04-28 08:00:00 | 88.66 |
| 2012-04-28 09:00:00 | 88.66 |
| 2012-04-28 10:00:00 | 88.92 |
| 2012-04-28 11:00:00 | 88.66 |
| 2012-04-28 12:00:00 | 88.66 |
| 2012-04-28 13:00:00 | 88.92 |
| 2012-04-28 14:00:00 | 88.92 |
| 2012-04-28 15:00:00 | 88.92 |
| 2012-04-28 16:00:00 | 88.66 |
| 2012-04-28 17:00:00 | 88.66 |
| 2012-04-28 18:00:00 | 88.92 |
| 2012-04-28 19:00:00 | 88.92 |
| 2012-04-28 20:00:00 | 88.92 |
| 2012-04-28 21:00:00 | 88.66 |
| 2012-04-28 22:00:00 | 88.66 |
| 2012-04-28 23:00:00 | 89.18 |
| 2012-04-29 | 88.92 |
| 2012-04-29 01:00:00 | 88.92 |
| 2012-04-29 02:00:00 | 88.92 |
| 2012-04-29 03:00:00 | 88.92 |
| 2012-04-29 04:00:00 | 89.18 |
| 2012-04-29 05:00:00 | 88.92 |
| 2012-04-29 06:00:00 | 89.18 |
| 2012-04-29 07:00:00 | 88.92 |
| 2012-04-29 08:00:00 | 88.92 |
| 2012-04-29 09:00:00 | 88.66 |
| 2012-04-29 10:00:00 | 88.66 |
| 2012-04-29 11:00:00 | 88.66 |
| 2012-04-29 12:00:00 | 88.66 |
| 2012-04-29 13:00:00 | 88.66 |
| 2012-04-29 14:00:00 | 88.92 |
| 2012-04-29 15:00:00 | 88.92 |
| 2012-04-29 16:00:00 | 88.66 |
| 2012-04-29 17:00:00 | 88.92 |
| 2012-04-29 18:00:00 | 88.66 |
| 2012-04-29 19:00:00 | 88.92 |
| 2012-04-29 20:00:00 | 88.66 |
| 2012-04-29 21:00:00 | 88.92 |
| 2012-04-29 22:00:00 | 88.66 |
| 2012-04-29 23:00:00 | 88.92 |
| 2012-04-30 | 88.92 |
| 2012-04-30 01:00:00 | 89.18 |
| 2012-04-30 02:00:00 | 88.92 |
| 2012-04-30 03:00:00 | 88.92 |
| 2012-04-30 04:00:00 | 88.66 |
| 2012-04-30 05:00:00 | 88.92 |
| 2012-04-30 06:00:00 | 88.92 |
| 2012-04-30 07:00:00 | 88.66 |
| 2012-04-30 08:00:00 | 88.66 |
| 2012-04-30 09:00:00 | 88.66 |
| 2012-04-30 10:00:00 | 88.4 |
| 2012-04-30 11:00:00 | 88.66 |
| 2012-04-30 12:00:00 | 88.66 |
| 2012-04-30 13:00:00 | 88.4 |
| 2012-04-30 14:00:00 | 88.66 |
| 2012-04-30 15:00:00 | 88.66 |
| 2012-04-30 16:00:00 | 88.66 |
| 2012-04-30 17:00:00 | 88.66 |
| 2012-04-30 18:00:00 | 88.66 |
| 2012-04-30 19:00:00 | 88.66 |
| 2012-04-30 20:00:00 | 88.92 |
| 2012-04-30 21:00:00 | 88.66 |
| 2012-04-30 22:00:00 | 88.66 |
| 2012-04-30 23:00:00 | 88.92 |
| 2012-05-01 | 88.66 |
| 2012-05-01 01:00:00 | 88.92 |
| 2012-05-01 02:00:00 | 88.66 |
| 2012-05-01 03:00:00 | 88.92 |
| 2012-05-01 04:00:00 | 88.66 |
| 2012-05-01 05:00:00 | 88.92 |
| 2012-05-01 06:00:00 | 89.44 |
| 2012-05-01 07:00:00 | 89.18 |
| 2012-05-01 08:00:00 | 89.18 |
| 2012-05-01 09:00:00 | 88.92 |
| 2012-05-01 10:00:00 | 89.18 |
| 2012-05-01 11:00:00 | 88.92 |
| 2012-05-01 12:00:00 | 89.18 |
| 2012-05-01 13:00:00 | 88.92 |
| 2012-05-01 14:00:00 | 89.18 |
| 2012-05-01 15:00:00 | 88.92 |
| 2012-05-01 16:00:00 | 89.18 |
| 2012-05-01 17:00:00 | 88.92 |
| 2012-05-01 18:00:00 | 89.18 |
| 2012-05-01 19:00:00 | 88.92 |
| 2012-05-01 20:00:00 | 89.18 |
| 2012-05-01 21:00:00 | 88.92 |
| 2012-05-01 22:00:00 | 88.92 |
| 2012-05-01 23:00:00 | 89.18 |
| 2012-05-02 | 89.18 |
| 2012-05-02 01:00:00 | 89.18 |
| 2012-05-02 02:00:00 | 89.18 |
| 2012-05-02 03:00:00 | 89.18 |
| 2012-05-02 04:00:00 | 89.18 |
| 2012-05-02 05:00:00 | 89.18 |
| 2012-05-02 06:00:00 | 88.92 |
| 2012-05-02 07:00:00 | 89.18 |
| 2012-05-02 08:00:00 | 88.66 |
| 2012-05-02 09:00:00 | 88.92 |
| 2012-05-02 10:00:00 | 88.92 |
| 2012-05-02 11:00:00 | 83.98 |
| 2012-05-02 12:00:00 | 72.02 |
| 2012-05-02 13:00:00 | 72.28 |
| 2012-05-02 14:00:00 | 72.28 |
| 2012-05-02 15:00:00 | 76.96 |
| 2012-05-02 16:00:00 | 80.86 |
| 2012-05-02 17:00:00 | 80.86 |
| 2012-05-02 18:00:00 | 81.38 |
| 2012-05-02 19:00:00 | 81.12 |
| 2012-05-02 20:00:00 | 81.12 |
| 2012-05-02 21:00:00 | 81.12 |
| 2012-05-02 22:00:00 | 81.38 |
| 2012-05-02 23:00:00 | 81.38 |
| 2012-05-03 | 81.38 |
| 2012-05-03 01:00:00 | 81.38 |
| 2012-05-03 02:00:00 | 81.12 |
| 2012-05-03 03:00:00 | 81.38 |
| 2012-05-03 04:00:00 | 81.38 |
| 2012-05-03 05:00:00 | 81.38 |
| 2012-05-03 06:00:00 | 81.38 |
| 2012-05-03 07:00:00 | 81.38 |
| 2012-05-03 08:00:00 | 81.12 |
| 2012-05-03 09:00:00 | 81.12 |
| 2012-05-03 10:00:00 | 81.12 |
| 2012-05-03 11:00:00 | 81.38 |
| 2012-05-03 12:00:00 | 81.12 |
| 2012-05-03 13:00:00 | 81.12 |
| 2012-05-03 14:00:00 | 81.38 |
| 2012-05-03 15:00:00 | 81.12 |
| 2012-05-03 16:00:00 | 81.12 |
| 2012-05-03 17:00:00 | 81.38 |
| 2012-05-03 18:00:00 | 81.12 |
| 2012-05-03 19:00:00 | 81.38 |
| 2012-05-03 20:00:00 | 81.12 |
| 2012-05-03 21:00:00 | 81.38 |
| 2012-05-03 22:00:00 | 81.38 |
| 2012-05-03 23:00:00 | 81.38 |
| 2012-05-04 | 81.38 |
| 2012-05-04 01:00:00 | 81.38 |
| 2012-05-04 02:00:00 | 81.38 |
| 2012-05-04 03:00:00 | 81.38 |
| 2012-05-04 04:00:00 | 81.64 |
| 2012-05-04 05:00:00 | 81.38 |
| 2012-05-04 06:00:00 | 81.38 |
| 2012-05-04 07:00:00 | 81.12 |
| 2012-05-04 08:00:00 | 81.12 |
| 2012-05-04 09:00:00 | 81.12 |
| 2012-05-04 10:00:00 | 77.48 |
| 2012-05-04 11:00:00 | 77.22 |
| 2012-05-04 12:00:00 | 81.38 |
| 2012-05-04 13:00:00 | 81.64 |
| 2012-05-04 14:00:00 | 81.38 |
| 2012-05-04 15:00:00 | 81.38 |
| 2012-05-04 16:00:00 | 81.64 |
| 2012-05-04 17:00:00 | 81.12 |
| 2012-05-04 18:00:00 | 81.64 |
| 2012-05-04 19:00:00 | 81.38 |
| 2012-05-04 20:00:00 | 81.38 |
| 2012-05-04 21:00:00 | 81.64 |
| 2012-05-04 22:00:00 | 81.38 |
| 2012-05-04 23:00:00 | 81.64 |
| 2012-05-05 | 81.64 |
| 2012-05-05 01:00:00 | 81.64 |
| 2012-05-05 02:00:00 | 81.64 |
| 2012-05-05 03:00:00 | 81.38 |
| 2012-05-05 04:00:00 | 81.64 |
| 2012-05-05 05:00:00 | 81.64 |
| 2012-05-05 06:00:00 | 81.64 |
| 2012-05-05 07:00:00 | 81.38 |
| 2012-05-05 08:00:00 | 81.64 |
| 2012-05-05 09:00:00 | 81.38 |
| 2012-05-05 10:00:00 | 81.38 |
| 2012-05-05 11:00:00 | 81.64 |
| 2012-05-05 12:00:00 | 81.38 |
| 2012-05-05 13:00:00 | 81.38 |
| 2012-05-05 14:00:00 | 81.38 |
| 2012-05-05 15:00:00 | 81.64 |
| 2012-05-05 16:00:00 | 81.38 |
| 2012-05-05 17:00:00 | 81.38 |
| 2012-05-05 18:00:00 | 81.38 |
| 2012-05-05 19:00:00 | 81.64 |
| 2012-05-05 20:00:00 | 81.38 |
| 2012-05-05 21:00:00 | 81.64 |
| 2012-05-05 22:00:00 | 81.38 |
| 2012-05-05 23:00:00 | 81.64 |
| 2012-05-06 | 81.64 |
| 2012-05-06 01:00:00 | 81.64 |
| 2012-05-06 02:00:00 | 81.64 |
| 2012-05-06 03:00:00 | 81.64 |
| 2012-05-06 04:00:00 | 81.9 |
| 2012-05-06 05:00:00 | 81.64 |
| 2012-05-06 06:00:00 | 81.64 |
| 2012-05-06 07:00:00 | 81.9 |
| 2012-05-06 08:00:00 | 81.38 |
| 2012-05-06 09:00:00 | 81.9 |
| 2012-05-06 10:00:00 | 81.38 |
| 2012-05-06 11:00:00 | 81.64 |
| 2012-05-06 12:00:00 | 81.38 |
| 2012-05-06 13:00:00 | 81.64 |
| 2012-05-06 14:00:00 | 81.38 |
| 2012-05-06 15:00:00 | 81.64 |
| 2012-05-06 16:00:00 | 81.64 |
| 2012-05-06 17:00:00 | 81.38 |
| 2012-05-06 18:00:00 | 81.64 |
| 2012-05-06 19:00:00 | 81.64 |
| 2012-05-06 20:00:00 | 81.64 |
| 2012-05-06 21:00:00 | 81.38 |
| 2012-05-06 22:00:00 | 81.64 |
| 2012-05-06 23:00:00 | 81.64 |
| 2012-05-07 | 81.64 |
| 2012-05-07 01:00:00 | 81.64 |
| 2012-05-07 02:00:00 | 81.64 |
| 2012-05-07 03:00:00 | 81.9 |
| 2012-05-07 04:00:00 | 81.64 |
| 2012-05-07 05:00:00 | 81.64 |
| 2012-05-07 06:00:00 | 81.64 |
| 2012-05-07 07:00:00 | 81.38 |
| 2012-05-07 08:00:00 | 81.38 |
| 2012-05-07 09:00:00 | 81.38 |
| 2012-05-07 10:00:00 | 81.38 |
| 2012-05-07 11:00:00 | 81.38 |
| 2012-05-07 12:00:00 | 81.64 |
| 2012-05-07 13:00:00 | 81.38 |
| 2012-05-07 14:00:00 | 81.38 |
| 2012-05-07 15:00:00 | 81.38 |
| 2012-05-07 16:00:00 | 81.64 |
| 2012-05-07 17:00:00 | 81.38 |
| 2012-05-07 18:00:00 | 81.38 |
| 2012-05-07 19:00:00 | 81.64 |
| 2012-05-07 20:00:00 | 81.38 |
| 2012-05-07 21:00:00 | 81.38 |
| 2012-05-07 22:00:00 | 81.64 |
| 2012-05-07 23:00:00 | 81.64 |
| 2012-05-08 | 81.64 |
| 2012-05-08 01:00:00 | 81.64 |
| 2012-05-08 02:00:00 | 81.64 |
| 2012-05-08 03:00:00 | 81.64 |
| 2012-05-08 04:00:00 | 81.64 |
| 2012-05-08 05:00:00 | 81.64 |
| 2012-05-08 06:00:00 | 81.64 |
| 2012-05-08 07:00:00 | 81.64 |
| 2012-05-08 08:00:00 | 81.64 |
| 2012-05-08 09:00:00 | 81.38 |
| 2012-05-08 10:00:00 | 81.64 |
| 2012-05-08 11:00:00 | 81.38 |
| 2012-05-08 12:00:00 | 81.38 |
| 2012-05-08 13:00:00 | 81.64 |
| 2012-05-08 14:00:00 | 81.64 |
| 2012-05-08 15:00:00 | 81.38 |
| 2012-05-08 16:00:00 | 81.64 |
| 2012-05-08 17:00:00 | 81.38 |
| 2012-05-08 18:00:00 | 81.64 |
| 2012-05-08 19:00:00 | 81.64 |
| 2012-05-08 20:00:00 | 85.8 |
| 2012-05-08 21:00:00 | 94.64 |
| 2012-05-08 22:00:00 | 94.64 |
| 2012-05-08 23:00:00 | 94.9 |
| 2012-05-09 | 94.64 |
| 2012-05-09 01:00:00 | 94.64 |
| 2012-05-09 02:00:00 | 94.64 |
| 2012-05-09 03:00:00 | 94.64 |
| 2012-05-09 04:00:00 | 94.64 |
| 2012-05-09 05:00:00 | 94.64 |
| 2012-05-09 06:00:00 | 94.64 |
| 2012-05-09 07:00:00 | 94.38 |
| 2012-05-09 08:00:00 | 94.38 |
| 2012-05-09 09:00:00 | 94.38 |
| 2012-05-09 10:00:00 | 94.38 |
| 2012-05-09 11:00:00 | 94.38 |
| 2012-05-09 12:00:00 | 94.38 |
| 2012-05-09 13:00:00 | 94.38 |
| 2012-05-09 14:00:00 | 94.38 |
| 2012-05-09 15:00:00 | 94.38 |
| 2012-05-09 16:00:00 | 94.38 |
| 2012-05-09 17:00:00 | 94.64 |
| 2012-05-09 18:00:00 | 94.64 |
| 2012-05-09 19:00:00 | 94.64 |
| 2012-05-09 20:00:00 | 94.64 |
| 2012-05-09 21:00:00 | 94.38 |
| 2012-05-09 22:00:00 | 94.64 |
| 2012-05-09 23:00:00 | 94.9 |
| 2012-05-10 | 94.64 |
| 2012-05-10 01:00:00 | 94.9 |
| 2012-05-10 02:00:00 | 94.64 |
| 2012-05-10 03:00:00 | 94.9 |
| 2012-05-10 04:00:00 | 94.9 |
| 2012-05-10 05:00:00 | 94.9 |
| 2012-05-10 06:00:00 | 94.9 |
| 2012-05-10 07:00:00 | 94.64 |
| 2012-05-10 08:00:00 | 94.38 |
| 2012-05-10 09:00:00 | 94.38 |
| 2012-05-10 10:00:00 | 94.64 |
| 2012-05-10 11:00:00 | 94.64 |
| 2012-05-10 12:00:00 | 94.38 |
| 2012-05-10 13:00:00 | 94.64 |
| 2012-05-10 14:00:00 | 94.64 |
| 2012-05-10 15:00:00 | 94.38 |
| 2012-05-10 16:00:00 | 94.64 |
| 2012-05-10 17:00:00 | 94.64 |
| 2012-05-10 18:00:00 | 94.64 |
| 2012-05-10 19:00:00 | 94.64 |
| 2012-05-10 20:00:00 | 94.64 |
| 2012-05-10 21:00:00 | 94.64 |
| 2012-05-10 22:00:00 | 94.64 |
| 2012-05-10 23:00:00 | 94.64 |
| 2012-05-11 | 94.9 |
| 2012-05-11 01:00:00 | 94.64 |
| 2012-05-11 02:00:00 | 94.64 |
| 2012-05-11 03:00:00 | 94.9 |
| 2012-05-11 04:00:00 | 94.64 |
| 2012-05-11 05:00:00 | 94.9 |
| 2012-05-11 06:00:00 | 94.64 |
| 2012-05-11 07:00:00 | 94.38 |
| 2012-05-11 08:00:00 | 94.12 |
| 2012-05-11 09:00:00 | 94.38 |
| 2012-05-11 10:00:00 | 94.12 |
| 2012-05-11 11:00:00 | 94.38 |
| 2012-05-11 12:00:00 | 94.38 |
| 2012-05-11 13:00:00 | 94.12 |
| 2012-05-11 14:00:00 | 93.6 |
| 2012-05-11 15:00:00 | 94.38 |
| 2012-05-11 16:00:00 | 94.12 |
| 2012-05-11 17:00:00 | 94.38 |
| 2012-05-11 18:00:00 | 94.12 |
| 2012-05-11 19:00:00 | 94.38 |
| 2012-05-11 20:00:00 | 94.38 |
| 2012-05-11 21:00:00 | 94.38 |
| 2012-05-11 22:00:00 | 94.38 |
| 2012-05-11 23:00:00 | 94.38 |
| 2012-05-12 | 94.38 |
| 2012-05-12 01:00:00 | 94.64 |
| 2012-05-12 02:00:00 | 94.38 |
| 2012-05-12 03:00:00 | 94.64 |
| 2012-05-12 04:00:00 | 94.38 |
| 2012-05-12 05:00:00 | 94.64 |
| 2012-05-12 06:00:00 | 90.74 |
| 2012-05-12 07:00:00 | 88.4 |
| 2012-05-12 08:00:00 | 88.14 |
| 2012-05-12 09:00:00 | 88.14 |
| 2012-05-12 10:00:00 | 88.14 |
| 2012-05-12 11:00:00 | 88.4 |
| 2012-05-12 12:00:00 | 87.88 |
| 2012-05-12 13:00:00 | 88.14 |
| 2012-05-12 14:00:00 | 88.4 |
| 2012-05-12 15:00:00 | 88.14 |
| 2012-05-12 16:00:00 | 88.14 |
| 2012-05-12 17:00:00 | 88.4 |
| 2012-05-12 18:00:00 | 88.14 |
| 2012-05-12 19:00:00 | 88.4 |
| 2012-05-12 20:00:00 | 88.14 |
| 2012-05-12 21:00:00 | 88.4 |
| 2012-05-12 22:00:00 | 88.14 |
| 2012-05-12 23:00:00 | 88.4 |
| 2012-05-13 | 88.4 |
| 2012-05-13 01:00:00 | 88.14 |
| 2012-05-13 02:00:00 | 88.4 |
| 2012-05-13 03:00:00 | 88.4 |
| 2012-05-13 04:00:00 | 88.14 |
| 2012-05-13 05:00:00 | 88.4 |
| 2012-05-13 06:00:00 | 88.4 |
| 2012-05-13 07:00:00 | 88.4 |
| 2012-05-13 08:00:00 | 88.4 |
| 2012-05-13 09:00:00 | 88.14 |
| 2012-05-13 10:00:00 | 88.14 |
| 2012-05-13 11:00:00 | 88.4 |
| 2012-05-13 12:00:00 | 88.14 |
| 2012-05-13 13:00:00 | 88.14 |
| 2012-05-13 14:00:00 | 88.4 |
| 2012-05-13 15:00:00 | 88.4 |
| 2012-05-13 16:00:00 | 88.14 |
| 2012-05-13 17:00:00 | 88.14 |
| 2012-05-13 18:00:00 | 88.4 |
| 2012-05-13 19:00:00 | 88.14 |
| 2012-05-13 20:00:00 | 88.4 |
| 2012-05-13 21:00:00 | 88.14 |
| 2012-05-13 22:00:00 | 88.14 |
| 2012-05-13 23:00:00 | 88.4 |
| 2012-05-14 | 88.4 |
| 2012-05-14 01:00:00 | 88.4 |
| 2012-05-14 02:00:00 | 88.4 |
| 2012-05-14 03:00:00 | 88.4 |
| 2012-05-14 04:00:00 | 88.4 |
| 2012-05-14 05:00:00 | 88.4 |
| 2012-05-14 06:00:00 | 88.4 |
| 2012-05-14 07:00:00 | 88.14 |
| 2012-05-14 08:00:00 | 88.14 |
| 2012-05-14 09:00:00 | 88.4 |
| 2012-05-14 10:00:00 | 88.14 |
| 2012-05-14 11:00:00 | 88.14 |
| 2012-05-14 12:00:00 | 87.88 |
| 2012-05-14 13:00:00 | 88.14 |
| 2012-05-14 14:00:00 | 88.14 |
| 2012-05-14 15:00:00 | 88.14 |
| 2012-05-14 16:00:00 | 82.42 |
| 2012-05-14 17:00:00 | 74.88 |
| 2012-05-14 18:00:00 | 75.14 |
| 2012-05-14 19:00:00 | 74.88 |
| 2012-05-14 20:00:00 | 74.88 |
| 2012-05-14 21:00:00 | 74.88 |
| 2012-05-14 22:00:00 | 75.14 |
| 2012-05-14 23:00:00 | 75.14 |
| 2012-05-15 | 75.14 |
| 2012-05-15 01:00:00 | 75.14 |
| 2012-05-15 02:00:00 | 74.88 |
| 2012-05-15 03:00:00 | 75.14 |
| 2012-05-15 04:00:00 | 75.14 |
| 2012-05-15 05:00:00 | 75.14 |
| 2012-05-15 06:00:00 | 74.88 |
| 2012-05-15 07:00:00 | 75.4 |
| 2012-05-15 08:00:00 | 88.14 |
| 2012-05-15 09:00:00 | 88.14 |
| 2012-05-15 10:00:00 | 87.88 |
| 2012-05-15 11:00:00 | 88.14 |
| 2012-05-15 12:00:00 | 88.14 |
| 2012-05-15 13:00:00 | 87.88 |
| 2012-05-15 14:00:00 | 88.14 |
| 2012-05-15 15:00:00 | 87.88 |
| 2012-05-15 16:00:00 | 88.14 |
| 2012-05-15 17:00:00 | 87.88 |
| 2012-05-15 18:00:00 | 88.14 |
| 2012-05-15 19:00:00 | 88.14 |
| 2012-05-15 20:00:00 | 88.14 |
| 2012-05-15 21:00:00 | 88.14 |
| 2012-05-15 22:00:00 | 88.14 |
| 2012-05-15 23:00:00 | 88.14 |
| 2012-05-16 | 88.4 |
| 2012-05-16 01:00:00 | 88.4 |
| 2012-05-16 02:00:00 | 88.4 |
| 2012-05-16 03:00:00 | 88.14 |
| 2012-05-16 04:00:00 | 88.4 |
| 2012-05-16 05:00:00 | 88.4 |
| 2012-05-16 06:00:00 | 88.4 |
| 2012-05-16 07:00:00 | 87.88 |
| 2012-05-16 08:00:00 | 88.14 |
| 2012-05-16 09:00:00 | 87.88 |
| 2012-05-16 10:00:00 | 88.14 |
| 2012-05-16 11:00:00 | 89.18 |
| 2012-05-16 12:00:00 | 87.88 |
| 2012-05-16 13:00:00 | 87.88 |
| 2012-05-16 14:00:00 | 88.14 |
| 2012-05-16 15:00:00 | 88.66 |
| 2012-05-16 16:00:00 | 88.92 |
| 2012-05-16 17:00:00 | 88.66 |
| 2012-05-16 18:00:00 | 88.66 |
| 2012-05-16 19:00:00 | 88.92 |
| 2012-05-16 20:00:00 | 88.66 |
| 2012-05-16 21:00:00 | 88.92 |
| 2012-05-16 22:00:00 | 88.66 |
| 2012-05-16 23:00:00 | 88.92 |
| 2012-05-17 | 88.92 |
| 2012-05-17 01:00:00 | 88.92 |
| 2012-05-17 02:00:00 | 88.92 |
| 2012-05-17 03:00:00 | 88.92 |
| 2012-05-17 04:00:00 | 88.92 |
| 2012-05-17 05:00:00 | 88.92 |
| 2012-05-17 06:00:00 | 88.92 |
| 2012-05-17 07:00:00 | 88.66 |
| 2012-05-17 08:00:00 | 88.66 |
| 2012-05-17 09:00:00 | 88.66 |
| 2012-05-17 10:00:00 | 88.4 |
| 2012-05-17 11:00:00 | 88.66 |
| 2012-05-17 12:00:00 | 88.66 |
| 2012-05-17 13:00:00 | 88.66 |
| 2012-05-17 14:00:00 | 88.66 |
| 2012-05-17 15:00:00 | 88.66 |
| 2012-05-17 16:00:00 | 88.4 |
| 2012-05-17 17:00:00 | 88.66 |
| 2012-05-17 18:00:00 | 88.92 |
| 2012-05-17 19:00:00 | 88.66 |
| 2012-05-17 20:00:00 | 88.66 |
| 2012-05-17 21:00:00 | 88.92 |
| 2012-05-17 22:00:00 | 88.66 |
| 2012-05-17 23:00:00 | 88.92 |
| 2012-05-18 | 88.66 |
| 2012-05-18 01:00:00 | 88.92 |
| 2012-05-18 02:00:00 | 88.92 |
| 2012-05-18 03:00:00 | 88.66 |
| 2012-05-18 04:00:00 | 88.92 |
| 2012-05-18 05:00:00 | 88.92 |
| 2012-05-18 06:00:00 | 88.66 |
| 2012-05-18 07:00:00 | 88.66 |
| 2012-05-18 08:00:00 | 88.4 |
| 2012-05-18 09:00:00 | 88.66 |
| 2012-05-18 10:00:00 | 88.66 |
| 2012-05-18 11:00:00 | 88.66 |
| 2012-05-18 12:00:00 | 88.4 |
| 2012-05-18 13:00:00 | 88.66 |
| 2012-05-18 14:00:00 | 88.4 |
| 2012-05-18 15:00:00 | 88.66 |
| 2012-05-18 16:00:00 | 88.4 |
| 2012-05-18 17:00:00 | 88.66 |
| 2012-05-18 18:00:00 | 88.66 |
| 2012-05-18 19:00:00 | 88.66 |
| 2012-05-18 20:00:00 | 88.66 |
| 2012-05-18 21:00:00 | 88.66 |
| 2012-05-18 22:00:00 | 88.66 |
| 2012-05-18 23:00:00 | 88.92 |
| 2012-05-19 | 88.92 |
| 2012-05-19 01:00:00 | 88.92 |
| 2012-05-19 02:00:00 | 88.92 |
| 2012-05-19 03:00:00 | 88.66 |
| 2012-05-19 04:00:00 | 88.92 |
| 2012-05-19 05:00:00 | 88.92 |
| 2012-05-19 06:00:00 | 88.92 |
| 2012-05-19 07:00:00 | 88.66 |
| 2012-05-19 08:00:00 | 88.66 |
| 2012-05-19 09:00:00 | 88.66 |
| 2012-05-19 10:00:00 | 88.4 |
| 2012-05-19 11:00:00 | 88.92 |
| 2012-05-19 12:00:00 | 88.4 |
| 2012-05-19 13:00:00 | 88.66 |
| 2012-05-19 14:00:00 | 88.66 |
| 2012-05-19 15:00:00 | 88.66 |
| 2012-05-19 16:00:00 | 88.92 |
| 2012-05-19 17:00:00 | 88.66 |
| 2012-05-19 18:00:00 | 88.66 |
| 2012-05-19 19:00:00 | 88.92 |
| 2012-05-19 20:00:00 | 88.66 |
| 2012-05-19 21:00:00 | 88.66 |
| 2012-05-19 22:00:00 | 88.92 |
| 2012-05-19 23:00:00 | 88.66 |
| 2012-05-20 | 88.92 |
| 2012-05-20 01:00:00 | 88.92 |
| 2012-05-20 02:00:00 | 88.66 |
| 2012-05-20 03:00:00 | 88.92 |
| 2012-05-20 04:00:00 | 88.92 |
| 2012-05-20 05:00:00 | 88.92 |
| 2012-05-20 06:00:00 | 88.92 |
| 2012-05-20 07:00:00 | 88.92 |
| 2012-05-20 08:00:00 | 88.66 |
| 2012-05-20 09:00:00 | 88.66 |
| 2012-05-20 10:00:00 | 88.66 |
| 2012-05-20 11:00:00 | 88.66 |
| 2012-05-20 12:00:00 | 88.66 |
| 2012-05-20 13:00:00 | 88.66 |
| 2012-05-20 14:00:00 | 88.66 |
| 2012-05-20 15:00:00 | 88.92 |
| 2012-05-20 16:00:00 | 88.66 |
| 2012-05-20 17:00:00 | 88.66 |
| 2012-05-20 18:00:00 | 88.66 |
| 2012-05-20 19:00:00 | 88.66 |
| 2012-05-20 20:00:00 | 88.92 |
| 2012-05-20 21:00:00 | 88.66 |
| 2012-05-20 22:00:00 | 88.66 |
| 2012-05-20 23:00:00 | 88.66 |
| 2012-05-21 | 88.92 |
| 2012-05-21 01:00:00 | 88.66 |
| 2012-05-21 02:00:00 | 88.66 |
| 2012-05-21 03:00:00 | 88.92 |
| 2012-05-21 04:00:00 | 88.66 |
| 2012-05-21 05:00:00 | 88.92 |
| 2012-05-21 06:00:00 | 88.66 |
| 2012-05-21 07:00:00 | 88.66 |
| 2012-05-21 08:00:00 | 88.4 |
| 2012-05-21 09:00:00 | 88.14 |
| 2012-05-21 10:00:00 | 88.4 |
| 2012-05-21 11:00:00 | 88.4 |
| 2012-05-21 12:00:00 | 88.4 |
| 2012-05-21 13:00:00 | 88.4 |
| 2012-05-21 14:00:00 | 88.66 |
| 2012-05-21 15:00:00 | 88.4 |
| 2012-05-21 16:00:00 | 88.4 |
| 2012-05-21 17:00:00 | 88.4 |
| 2012-05-21 18:00:00 | 88.66 |
| 2012-05-21 19:00:00 | 88.4 |
| 2012-05-21 20:00:00 | 88.4 |
| 2012-05-21 21:00:00 | 88.66 |
| 2012-05-21 22:00:00 | 88.66 |
| 2012-05-21 23:00:00 | 88.66 |
| 2012-05-22 | 88.66 |
| 2012-05-22 01:00:00 | 88.66 |
| 2012-05-22 02:00:00 | 88.66 |
| 2012-05-22 03:00:00 | 88.66 |
| 2012-05-22 04:00:00 | 88.92 |
| 2012-05-22 05:00:00 | 74.1 |
| 2012-05-22 06:00:00 | 4.68 |
| 2012-05-22 07:00:00 | 61.88 |
| 2012-05-22 08:00:00 | 88.4 |
| 2012-05-22 09:00:00 | 88.4 |
| 2012-05-22 10:00:00 | 88.4 |
| 2012-05-22 11:00:00 | 88.4 |
| 2012-05-22 12:00:00 | 88.4 |
| 2012-05-22 13:00:00 | 88.66 |
| 2012-05-22 14:00:00 | 88.4 |
| 2012-05-22 15:00:00 | 88.4 |
| 2012-05-22 16:00:00 | 88.4 |
| 2012-05-22 17:00:00 | 88.4 |
| 2012-05-22 18:00:00 | 88.4 |
| 2012-05-22 19:00:00 | 88.4 |
| 2012-05-22 20:00:00 | 88.4 |
| 2012-05-22 21:00:00 | 88.66 |
| 2012-05-22 22:00:00 | 88.4 |
| 2012-05-22 23:00:00 | 88.66 |
| 2012-05-23 | 88.4 |
| 2012-05-23 01:00:00 | 88.66 |
| 2012-05-23 02:00:00 | 88.66 |
| 2012-05-23 03:00:00 | 88.66 |
| 2012-05-23 04:00:00 | 88.66 |
| 2012-05-23 05:00:00 | 88.66 |
| 2012-05-23 06:00:00 | 88.92 |
| 2012-05-23 07:00:00 | 88.4 |
| 2012-05-23 08:00:00 | 88.14 |
| 2012-05-23 09:00:00 | 88.4 |
| 2012-05-23 10:00:00 | 88.14 |
| 2012-05-23 11:00:00 | 88.4 |
| 2012-05-23 12:00:00 | 88.14 |
| 2012-05-23 13:00:00 | 88.4 |
| 2012-05-23 14:00:00 | 88.14 |
| 2012-05-23 15:00:00 | 88.4 |
| 2012-05-23 16:00:00 | 88.4 |
| 2012-05-23 17:00:00 | 88.4 |
| 2012-05-23 18:00:00 | 88.4 |
| 2012-05-23 19:00:00 | 88.14 |
| 2012-05-23 20:00:00 | 88.4 |
| 2012-05-23 21:00:00 | 88.4 |
| 2012-05-23 22:00:00 | 88.4 |
| 2012-05-23 23:00:00 | 88.4 |
| 2012-05-24 | 88.4 |
| 2012-05-24 01:00:00 | 88.66 |
| 2012-05-24 02:00:00 | 88.4 |
| 2012-05-24 03:00:00 | 88.66 |
| 2012-05-24 04:00:00 | 88.4 |
| 2012-05-24 05:00:00 | 88.66 |
| 2012-05-24 06:00:00 | 88.4 |
| 2012-05-24 07:00:00 | 88.4 |
| 2012-05-24 08:00:00 | 88.14 |
| 2012-05-24 09:00:00 | 88.14 |
| 2012-05-24 10:00:00 | 88.4 |
| 2012-05-24 11:00:00 | 88.14 |
| 2012-05-24 12:00:00 | 88.14 |
| 2012-05-24 13:00:00 | 90.48 |
| 2012-05-24 14:00:00 | 88.14 |
| 2012-05-24 15:00:00 | 88.4 |
| 2012-05-24 16:00:00 | 88.14 |
| 2012-05-24 17:00:00 | 88.4 |
| 2012-05-24 18:00:00 | 88.14 |
| 2012-05-24 19:00:00 | 88.4 |
| 2012-05-24 20:00:00 | 88.14 |
| 2012-05-24 21:00:00 | 88.4 |
| 2012-05-24 22:00:00 | 88.4 |
| 2012-05-24 23:00:00 | 88.4 |
| 2012-05-25 | 88.4 |
| 2012-05-25 01:00:00 | 88.4 |
| 2012-05-25 02:00:00 | 88.4 |
| 2012-05-25 03:00:00 | 88.4 |
| 2012-05-25 04:00:00 | 88.4 |
| 2012-05-25 05:00:00 | 88.66 |
| 2012-05-25 06:00:00 | 88.66 |
| 2012-05-25 07:00:00 | 88.14 |
| 2012-05-25 08:00:00 | 88.14 |
| 2012-05-25 09:00:00 | 88.14 |
| 2012-05-25 10:00:00 | 88.14 |
| 2012-05-25 11:00:00 | 88.14 |
| 2012-05-25 12:00:00 | 88.14 |
| 2012-05-25 13:00:00 | 88.4 |
| 2012-05-25 14:00:00 | 88.14 |
| 2012-05-25 15:00:00 | 88.4 |
| 2012-05-25 16:00:00 | 88.14 |
| 2012-05-25 17:00:00 | 88.4 |
| 2012-05-25 18:00:00 | 88.4 |
| 2012-05-25 19:00:00 | 88.4 |
| 2012-05-25 20:00:00 | 88.4 |
| 2012-05-25 21:00:00 | 88.4 |
| 2012-05-25 22:00:00 | 88.4 |
| 2012-05-25 23:00:00 | 88.4 |
| 2012-05-26 | 88.66 |
| 2012-05-26 01:00:00 | 88.66 |
| 2012-05-26 02:00:00 | 88.4 |
| 2012-05-26 03:00:00 | 88.66 |
| 2012-05-26 04:00:00 | 88.66 |
| 2012-05-26 05:00:00 | 88.4 |
| 2012-05-26 06:00:00 | 88.66 |
| 2012-05-26 07:00:00 | 88.4 |
| 2012-05-26 08:00:00 | 88.4 |
| 2012-05-26 09:00:00 | 88.14 |
| 2012-05-26 10:00:00 | 88.4 |
| 2012-05-26 11:00:00 | 88.14 |
| 2012-05-26 12:00:00 | 88.4 |
| 2012-05-26 13:00:00 | 88.4 |
| 2012-05-26 14:00:00 | 88.14 |
| 2012-05-26 15:00:00 | 88.4 |
| 2012-05-26 16:00:00 | 88.4 |
| 2012-05-26 17:00:00 | 88.4 |
| 2012-05-26 18:00:00 | 88.4 |
| 2012-05-26 19:00:00 | 88.4 |
| 2012-05-26 20:00:00 | 88.4 |
| 2012-05-26 21:00:00 | 88.4 |
| 2012-05-26 22:00:00 | 88.4 |
| 2012-05-26 23:00:00 | 88.4 |
| 2012-05-27 | 88.4 |
| 2012-05-27 01:00:00 | 88.66 |
| 2012-05-27 02:00:00 | 88.4 |
| 2012-05-27 03:00:00 | 88.66 |
| 2012-05-27 04:00:00 | 88.66 |
| 2012-05-27 05:00:00 | 88.66 |
| 2012-05-27 06:00:00 | 88.92 |
| 2012-05-27 07:00:00 | 88.4 |
| 2012-05-27 08:00:00 | 88.4 |
| 2012-05-27 09:00:00 | 88.4 |
| 2012-05-27 10:00:00 | 88.4 |
| 2012-05-27 11:00:00 | 88.4 |
| 2012-05-27 12:00:00 | 88.14 |
| 2012-05-27 13:00:00 | 88.4 |
| 2012-05-27 14:00:00 | 88.4 |
| 2012-05-27 15:00:00 | 88.4 |
| 2012-05-27 16:00:00 | 88.4 |
| 2012-05-27 17:00:00 | 88.14 |
| 2012-05-27 18:00:00 | 88.4 |
| 2012-05-27 19:00:00 | 88.4 |
| 2012-05-27 20:00:00 | 88.4 |
| 2012-05-27 21:00:00 | 88.4 |
| 2012-05-27 22:00:00 | 88.14 |
| 2012-05-27 23:00:00 | 88.4 |
| 2012-05-28 | 88.4 |
| 2012-05-28 01:00:00 | 88.4 |
| 2012-05-28 02:00:00 | 88.14 |
| 2012-05-28 03:00:00 | 88.4 |
| 2012-05-28 04:00:00 | 88.4 |
| 2012-05-28 05:00:00 | 88.4 |
| 2012-05-28 06:00:00 | 88.4 |
| 2012-05-28 07:00:00 | 88.14 |
| 2012-05-28 08:00:00 | 88.14 |
| 2012-05-28 09:00:00 | 88.14 |
| 2012-05-28 10:00:00 | 87.88 |
| 2012-05-28 11:00:00 | 88.14 |
| 2012-05-28 12:00:00 | 88.14 |
| 2012-05-28 13:00:00 | 87.88 |
| 2012-05-28 14:00:00 | 88.14 |
| 2012-05-28 15:00:00 | 88.14 |
| 2012-05-28 16:00:00 | 88.14 |
| 2012-05-28 17:00:00 | 88.14 |
| 2012-05-28 18:00:00 | 88.14 |
| 2012-05-28 19:00:00 | 88.4 |
| 2012-05-28 20:00:00 | 88.14 |
| 2012-05-28 21:00:00 | 88.14 |
| 2012-05-28 22:00:00 | 88.4 |
| 2012-05-28 23:00:00 | 88.14 |
| 2012-05-29 | 88.14 |
| 2012-05-29 01:00:00 | 88.4 |
| 2012-05-29 02:00:00 | 88.4 |
| 2012-05-29 03:00:00 | 88.14 |
| 2012-05-29 04:00:00 | 88.4 |
| 2012-05-29 05:00:00 | 88.14 |
| 2012-05-29 06:00:00 | 88.4 |
| 2012-05-29 07:00:00 | 87.88 |
| 2012-05-29 08:00:00 | 87.88 |
| 2012-05-29 09:00:00 | 88.14 |
| 2012-05-29 10:00:00 | 87.88 |
| 2012-05-29 11:00:00 | 87.88 |
| 2012-05-29 12:00:00 | 88.14 |
| 2012-05-29 13:00:00 | 87.88 |
| 2012-05-29 14:00:00 | 87.88 |
| 2012-05-29 15:00:00 | 87.88 |
| 2012-05-29 16:00:00 | 87.88 |
| 2012-05-29 17:00:00 | 87.88 |
| 2012-05-29 18:00:00 | 88.14 |
| 2012-05-29 19:00:00 | 87.88 |
| 2012-05-29 20:00:00 | 88.14 |
| 2012-05-29 21:00:00 | 88.14 |
| 2012-05-29 22:00:00 | 88.14 |
| 2012-05-29 23:00:00 | 87.88 |
| 2012-05-30 | 88.14 |
| 2012-05-30 01:00:00 | 88.14 |
| 2012-05-30 02:00:00 | 88.14 |
| 2012-05-30 03:00:00 | 88.14 |
| 2012-05-30 04:00:00 | 88.14 |
| 2012-05-30 05:00:00 | 88.4 |
| 2012-05-30 06:00:00 | 88.14 |
| 2012-05-30 07:00:00 | 87.88 |
| 2012-05-30 08:00:00 | 87.88 |
| 2012-05-30 09:00:00 | 87.88 |
| 2012-05-30 10:00:00 | 87.88 |
| 2012-05-30 11:00:00 | 87.88 |
| 2012-05-30 12:00:00 | 87.88 |
| 2012-05-30 13:00:00 | 87.88 |
| 2012-05-30 14:00:00 | 87.88 |
| 2012-05-30 15:00:00 | 87.88 |
| 2012-05-30 16:00:00 | 87.88 |
| 2012-05-30 17:00:00 | 87.88 |
| 2012-05-30 18:00:00 | 87.88 |
| 2012-05-30 19:00:00 | 88.14 |
| 2012-05-30 20:00:00 | 87.88 |
| 2012-05-30 21:00:00 | 88.14 |
| 2012-05-30 22:00:00 | 87.88 |
| 2012-05-30 23:00:00 | 88.14 |
| 2012-05-31 | 88.14 |
| 2012-05-31 01:00:00 | 88.14 |
| 2012-05-31 02:00:00 | 88.14 |
| 2012-05-31 03:00:00 | 88.14 |
| 2012-05-31 04:00:00 | 88.4 |
| 2012-05-31 05:00:00 | 88.14 |
| 2012-05-31 06:00:00 | 88.14 |
| 2012-05-31 07:00:00 | 87.88 |
| 2012-05-31 08:00:00 | 87.88 |
| 2012-05-31 09:00:00 | 87.88 |
| 2012-05-31 10:00:00 | 87.88 |
| 2012-05-31 11:00:00 | 87.88 |
| 2012-05-31 12:00:00 | 87.88 |
| 2012-05-31 13:00:00 | 87.88 |
| 2012-05-31 14:00:00 | 87.62 |
| 2012-05-31 15:00:00 | 87.36 |
| 2012-05-31 16:00:00 | 87.62 |
| 2012-05-31 17:00:00 | 87.62 |
| 2012-05-31 18:00:00 | 87.62 |
| 2012-05-31 19:00:00 | 87.88 |
| 2012-05-31 20:00:00 | 87.88 |
| 2012-05-31 21:00:00 | 87.62 |
| 2012-05-31 22:00:00 | 87.88 |
| 2012-05-31 23:00:00 | 87.88 |
| 2012-06-01 | 87.88 |
| 2012-06-01 01:00:00 | 87.88 |
| 2012-06-01 02:00:00 | 87.88 |
| 2012-06-01 03:00:00 | 87.88 |
| 2012-06-01 04:00:00 | 87.88 |
| 2012-06-01 05:00:00 | 87.88 |
| 2012-06-01 06:00:00 | 87.88 |
| 2012-06-01 07:00:00 | 87.88 |
| 2012-06-01 08:00:00 | 87.62 |
| 2012-06-01 09:00:00 | 87.62 |
| 2012-06-01 10:00:00 | 87.62 |
| 2012-06-01 11:00:00 | 87.62 |
| 2012-06-01 12:00:00 | 87.36 |
| 2012-06-01 13:00:00 | 87.62 |
| 2012-06-01 14:00:00 | 87.62 |
| 2012-06-01 15:00:00 | 87.62 |
| 2012-06-01 16:00:00 | 87.62 |
| 2012-06-01 17:00:00 | 87.62 |
| 2012-06-01 18:00:00 | 87.88 |
| 2012-06-01 19:00:00 | 87.62 |
| 2012-06-01 20:00:00 | 87.88 |
| 2012-06-01 21:00:00 | 87.88 |
| 2012-06-01 22:00:00 | 87.88 |
| 2012-06-01 23:00:00 | 87.88 |
| 2012-06-02 | 87.88 |
| 2012-06-02 01:00:00 | 87.88 |
| 2012-06-02 02:00:00 | 87.88 |
| 2012-06-02 03:00:00 | 87.88 |
| 2012-06-02 04:00:00 | 87.88 |
| 2012-06-02 05:00:00 | 88.14 |
| 2012-06-02 06:00:00 | 87.88 |
| 2012-06-02 07:00:00 | 87.88 |
| 2012-06-02 08:00:00 | 88.14 |
| 2012-06-02 09:00:00 | 88.14 |
| 2012-06-02 10:00:00 | 87.88 |
| 2012-06-02 11:00:00 | 87.88 |
| 2012-06-02 12:00:00 | 87.88 |
| 2012-06-02 13:00:00 | 87.88 |
| 2012-06-02 14:00:00 | 88.14 |
| 2012-06-02 15:00:00 | 87.88 |
| 2012-06-02 16:00:00 | 87.88 |
| 2012-06-02 17:00:00 | 87.88 |
| 2012-06-02 18:00:00 | 87.88 |
| 2012-06-02 19:00:00 | 87.88 |
| 2012-06-02 20:00:00 | 88.14 |
| 2012-06-02 21:00:00 | 87.88 |
| 2012-06-02 22:00:00 | 87.88 |
| 2012-06-02 23:00:00 | 87.88 |
| 2012-06-03 | 87.88 |
| 2012-06-03 01:00:00 | 88.14 |
| 2012-06-03 02:00:00 | 88.14 |
| 2012-06-03 03:00:00 | 88.4 |
| 2012-06-03 04:00:00 | 88.14 |
| 2012-06-03 05:00:00 | 88.14 |
| 2012-06-03 06:00:00 | 88.66 |
| 2012-06-03 07:00:00 | 88.4 |
| 2012-06-03 08:00:00 | 87.88 |
| 2012-06-03 09:00:00 | 87.88 |
| 2012-06-03 10:00:00 | 88.14 |
| 2012-06-03 11:00:00 | 88.14 |
| 2012-06-03 12:00:00 | 88.14 |
| 2012-06-03 13:00:00 | 88.14 |
| 2012-06-03 14:00:00 | 88.4 |
| 2012-06-03 15:00:00 | 88.4 |
| 2012-06-03 16:00:00 | 88.14 |
| 2012-06-03 17:00:00 | 88.4 |
| 2012-06-03 18:00:00 | 88.4 |
| 2012-06-03 19:00:00 | 88.14 |
| 2012-06-03 20:00:00 | 88.4 |
| 2012-06-03 21:00:00 | 88.66 |
| 2012-06-03 22:00:00 | 88.14 |
| 2012-06-03 23:00:00 | 88.4 |
| 2012-06-04 | 88.4 |
| 2012-06-04 01:00:00 | 82.68 |
| 2012-06-04 02:00:00 | 75.14 |
| 2012-06-04 03:00:00 | 75.4 |
| 2012-06-04 04:00:00 | 75.14 |
| 2012-06-04 05:00:00 | 75.14 |
| 2012-06-04 06:00:00 | 75.14 |
| 2012-06-04 07:00:00 | 74.88 |
| 2012-06-04 08:00:00 | 74.1 |
| 2012-06-04 09:00:00 | 78.26 |
| 2012-06-04 10:00:00 | 88.14 |
| 2012-06-04 11:00:00 | 88.4 |
| 2012-06-04 12:00:00 | 88.4 |
| 2012-06-04 13:00:00 | 88.4 |
| 2012-06-04 14:00:00 | 88.14 |
| 2012-06-04 15:00:00 | 88.4 |
| 2012-06-04 16:00:00 | 88.4 |
| 2012-06-04 17:00:00 | 88.14 |
| 2012-06-04 18:00:00 | 88.4 |
| 2012-06-04 19:00:00 | 88.4 |
| 2012-06-04 20:00:00 | 88.14 |
| 2012-06-04 21:00:00 | 88.4 |
| 2012-06-04 22:00:00 | 88.14 |
| 2012-06-04 23:00:00 | 88.4 |
| 2012-06-05 | 88.4 |
| 2012-06-05 01:00:00 | 88.4 |
| 2012-06-05 02:00:00 | 88.4 |
| 2012-06-05 03:00:00 | 88.4 |
| 2012-06-05 04:00:00 | 88.4 |
| 2012-06-05 05:00:00 | 88.4 |
| 2012-06-05 06:00:00 | 88.4 |
| 2012-06-05 07:00:00 | 87.88 |
| 2012-06-05 08:00:00 | 88.14 |
| 2012-06-05 09:00:00 | 88.14 |
| 2012-06-05 10:00:00 | 87.88 |
| 2012-06-05 11:00:00 | 87.88 |
| 2012-06-05 12:00:00 | 87.88 |
| 2012-06-05 13:00:00 | 88.14 |
| 2012-06-05 14:00:00 | 87.88 |
| 2012-06-05 15:00:00 | 87.88 |
| 2012-06-05 16:00:00 | 88.14 |
| 2012-06-05 17:00:00 | 87.88 |
| 2012-06-05 18:00:00 | 87.88 |
| 2012-06-05 19:00:00 | 88.14 |
| 2012-06-05 20:00:00 | 87.88 |
| 2012-06-05 21:00:00 | 88.14 |
| 2012-06-05 22:00:00 | 88.14 |
| 2012-06-05 23:00:00 | 87.88 |
| 2012-06-06 | 88.14 |
| 2012-06-06 01:00:00 | 88.4 |
| 2012-06-06 02:00:00 | 88.14 |
| 2012-06-06 03:00:00 | 88.4 |
| 2012-06-06 04:00:00 | 88.4 |
| 2012-06-06 05:00:00 | 88.14 |
| 2012-06-06 06:00:00 | 88.4 |
| 2012-06-06 07:00:00 | 87.88 |
| 2012-06-06 08:00:00 | 65.52 |
| 2012-06-06 09:00:00 | 87.88 |
| 2012-06-06 10:00:00 | 88.4 |
| 2012-06-06 11:00:00 | 88.14 |
| 2012-06-06 12:00:00 | 88.14 |
| 2012-06-06 13:00:00 | 88.4 |
| 2012-06-06 14:00:00 | 88.14 |
| 2012-06-06 15:00:00 | 59.54 |
| 2012-06-06 16:00:00 | 97.24 |
| 2012-06-06 17:00:00 | 104.26 |
| 2012-06-06 18:00:00 | 113.88 |
| 2012-06-06 19:00:00 | 113.62 |
| 2012-06-06 20:00:00 | 113.88 |
| 2012-06-06 21:00:00 | 113.88 |
| 2012-06-06 22:00:00 | 113.62 |
| 2012-06-06 23:00:00 | 113.88 |
| 2012-06-07 | 113.88 |
| 2012-06-07 01:00:00 | 113.62 |
| 2012-06-07 02:00:00 | 113.88 |
| 2012-06-07 03:00:00 | 113.88 |
| 2012-06-07 04:00:00 | 113.88 |
| 2012-06-07 05:00:00 | 113.88 |
| 2012-06-07 06:00:00 | 113.88 |
| 2012-06-07 07:00:00 | 113.62 |
| 2012-06-07 08:00:00 | 113.62 |
| 2012-06-07 09:00:00 | 113.36 |
| 2012-06-07 10:00:00 | 113.62 |
| 2012-06-07 11:00:00 | 113.62 |
| 2012-06-07 12:00:00 | 113.36 |
| 2012-06-07 13:00:00 | 113.62 |
| 2012-06-07 14:00:00 | 113.62 |
| 2012-06-07 15:00:00 | 113.88 |
| 2012-06-07 16:00:00 | 113.62 |
| 2012-06-07 17:00:00 | 113.62 |
| 2012-06-07 18:00:00 | 113.88 |
| 2012-06-07 19:00:00 | 113.62 |
| 2012-06-07 20:00:00 | 113.88 |
| 2012-06-07 21:00:00 | 113.88 |
| 2012-06-07 22:00:00 | 113.88 |
| 2012-06-07 23:00:00 | 113.88 |
| 2012-06-08 | 113.88 |
| 2012-06-08 01:00:00 | 113.88 |
| 2012-06-08 02:00:00 | 114.14 |
| 2012-06-08 03:00:00 | 113.88 |
| 2012-06-08 04:00:00 | 114.14 |
| 2012-06-08 05:00:00 | 114.14 |
| 2012-06-08 06:00:00 | 114.14 |
| 2012-06-08 07:00:00 | 113.88 |
| 2012-06-08 08:00:00 | 113.62 |
| 2012-06-08 09:00:00 | 113.62 |
| 2012-06-08 10:00:00 | 113.62 |
| 2012-06-08 11:00:00 | 113.36 |
| 2012-06-08 12:00:00 | 113.62 |
| 2012-06-08 13:00:00 | 113.62 |
| 2012-06-08 14:00:00 | 113.62 |
| 2012-06-08 15:00:00 | 113.62 |
| 2012-06-08 16:00:00 | 113.62 |
| 2012-06-08 17:00:00 | 113.62 |
| 2012-06-08 18:00:00 | 113.88 |
| 2012-06-08 19:00:00 | 113.62 |
| 2012-06-08 20:00:00 | 113.62 |
| 2012-06-08 21:00:00 | 113.88 |
| 2012-06-08 22:00:00 | 113.62 |
| 2012-06-08 23:00:00 | 113.88 |
| 2012-06-09 | 113.88 |
| 2012-06-09 01:00:00 | 113.88 |
| 2012-06-09 02:00:00 | 113.88 |
| 2012-06-09 03:00:00 | 113.88 |
| 2012-06-09 04:00:00 | 114.14 |
| 2012-06-09 05:00:00 | 114.14 |
| 2012-06-09 06:00:00 | 113.88 |
| 2012-06-09 07:00:00 | 114.14 |
| 2012-06-09 08:00:00 | 113.62 |
| 2012-06-09 09:00:00 | 113.88 |
| 2012-06-09 10:00:00 | 113.62 |
| 2012-06-09 11:00:00 | 113.62 |
| 2012-06-09 12:00:00 | 113.88 |
| 2012-06-09 13:00:00 | 113.62 |
| 2012-06-09 14:00:00 | 113.88 |
| 2012-06-09 15:00:00 | 113.88 |
| 2012-06-09 16:00:00 | 113.62 |
| 2012-06-09 17:00:00 | 113.88 |
| 2012-06-09 18:00:00 | 113.88 |
| 2012-06-09 19:00:00 | 113.88 |
| 2012-06-09 20:00:00 | 113.88 |
| 2012-06-09 21:00:00 | 113.88 |
| 2012-06-09 22:00:00 | 113.88 |
| 2012-06-09 23:00:00 | 113.88 |
| 2012-06-10 | 113.88 |
| 2012-06-10 01:00:00 | 113.88 |
| 2012-06-10 02:00:00 | 114.14 |
| 2012-06-10 03:00:00 | 113.88 |
| 2012-06-10 04:00:00 | 113.88 |
| 2012-06-10 05:00:00 | 114.14 |
| 2012-06-10 06:00:00 | 114.14 |
| 2012-06-10 07:00:00 | 114.14 |
| 2012-06-10 08:00:00 | 113.88 |
| 2012-06-10 09:00:00 | 113.88 |
| 2012-06-10 10:00:00 | 113.88 |
| 2012-06-10 11:00:00 | 113.88 |
| 2012-06-10 12:00:00 | 113.62 |
| 2012-06-10 13:00:00 | 113.88 |
| 2012-06-10 14:00:00 | 113.88 |
| 2012-06-10 15:00:00 | 113.88 |
| 2012-06-10 16:00:00 | 113.88 |
| 2012-06-10 17:00:00 | 113.62 |
| 2012-06-10 18:00:00 | 113.88 |
| 2012-06-10 19:00:00 | 113.88 |
| 2012-06-10 20:00:00 | 113.88 |
| 2012-06-10 21:00:00 | 113.62 |
| 2012-06-10 22:00:00 | 113.88 |
| 2012-06-10 23:00:00 | 113.88 |
| 2012-06-11 | 114.14 |
| 2012-06-11 01:00:00 | 113.88 |
| 2012-06-11 02:00:00 | 113.88 |
| 2012-06-11 03:00:00 | 113.88 |
| 2012-06-11 04:00:00 | 113.88 |
| 2012-06-11 05:00:00 | 114.14 |
| 2012-06-11 06:00:00 | 113.88 |
| 2012-06-11 07:00:00 | 113.62 |
| 2012-06-11 08:00:00 | 110.24 |
| 2012-06-11 09:00:00 | 88.4 |
| 2012-06-11 10:00:00 | 88.4 |
| 2012-06-11 11:00:00 | 88.66 |
| 2012-06-11 12:00:00 | 88.4 |
| 2012-06-11 13:00:00 | 88.4 |
| 2012-06-11 14:00:00 | 88.4 |
| 2012-06-11 15:00:00 | 88.4 |
| 2012-06-11 16:00:00 | 88.14 |
| 2012-06-11 17:00:00 | 88.4 |
| 2012-06-11 18:00:00 | 88.4 |
| 2012-06-11 19:00:00 | 88.14 |
| 2012-06-11 20:00:00 | 88.66 |
| 2012-06-11 21:00:00 | 88.4 |
| 2012-06-11 22:00:00 | 88.4 |
| 2012-06-11 23:00:00 | 88.4 |
| 2012-06-12 | 88.4 |
| 2012-06-12 01:00:00 | 88.4 |
| 2012-06-12 02:00:00 | 88.66 |
| 2012-06-12 03:00:00 | 88.4 |
| 2012-06-12 04:00:00 | 88.4 |
| 2012-06-12 05:00:00 | 88.66 |
| 2012-06-12 06:00:00 | 88.4 |
| 2012-06-12 07:00:00 | 88.4 |
| 2012-06-12 08:00:00 | 88.14 |
| 2012-06-12 09:00:00 | 87.88 |
| 2012-06-12 10:00:00 | 88.14 |
| 2012-06-12 11:00:00 | 88.14 |
| 2012-06-12 12:00:00 | 88.14 |
| 2012-06-12 13:00:00 | 88.4 |
| 2012-06-12 14:00:00 | 88.14 |
| 2012-06-12 15:00:00 | 88.14 |
| 2012-06-12 16:00:00 | 88.14 |
| 2012-06-12 17:00:00 | 88.14 |
| 2012-06-12 18:00:00 | 88.14 |
| 2012-06-12 19:00:00 | 88.4 |
| 2012-06-12 20:00:00 | 88.14 |
| 2012-06-12 21:00:00 | 88.14 |
| 2012-06-12 22:00:00 | 88.4 |
| 2012-06-12 23:00:00 | 88.4 |
| 2012-06-13 | 88.14 |
| 2012-06-13 01:00:00 | 88.4 |
| 2012-06-13 02:00:00 | 88.4 |
| 2012-06-13 03:00:00 | 88.4 |
| 2012-06-13 04:00:00 | 88.4 |
| 2012-06-13 05:00:00 | 88.4 |
| 2012-06-13 06:00:00 | 88.4 |
| 2012-06-13 07:00:00 | 88.14 |
| 2012-06-13 08:00:00 | 88.14 |
| 2012-06-13 09:00:00 | 88.14 |
| 2012-06-13 10:00:00 | 87.88 |
| 2012-06-13 11:00:00 | 88.14 |
| 2012-06-13 12:00:00 | 88.14 |
| 2012-06-13 13:00:00 | 88.14 |
| 2012-06-13 14:00:00 | 87.88 |
| 2012-06-13 15:00:00 | 88.14 |
| 2012-06-13 16:00:00 | 88.14 |
| 2012-06-13 17:00:00 | 88.14 |
| 2012-06-13 18:00:00 | 88.14 |
| 2012-06-13 19:00:00 | 88.14 |
| 2012-06-13 20:00:00 | 88.14 |
| 2012-06-13 21:00:00 | 88.14 |
| 2012-06-13 22:00:00 | 88.14 |
| 2012-06-13 23:00:00 | 88.14 |
| 2012-06-14 | 88.4 |
| 2012-06-14 01:00:00 | 88.14 |
| 2012-06-14 02:00:00 | 88.4 |
| 2012-06-14 03:00:00 | 88.4 |
| 2012-06-14 04:00:00 | 88.4 |
| 2012-06-14 05:00:00 | 88.4 |
| 2012-06-14 06:00:00 | 88.66 |
| 2012-06-14 07:00:00 | 88.14 |
| 2012-06-14 08:00:00 | 87.88 |
| 2012-06-14 09:00:00 | 88.14 |
| 2012-06-14 10:00:00 | 87.88 |
| 2012-06-14 11:00:00 | 88.14 |
| 2012-06-14 12:00:00 | 88.14 |
| 2012-06-14 13:00:00 | 88.4 |
| 2012-06-14 14:00:00 | 88.14 |
| 2012-06-14 15:00:00 | 88.14 |
| 2012-06-14 16:00:00 | 87.88 |
| 2012-06-14 17:00:00 | 88.14 |
| 2012-06-14 18:00:00 | 88.14 |
| 2012-06-14 19:00:00 | 88.14 |
| 2012-06-14 20:00:00 | 88.14 |
| 2012-06-14 21:00:00 | 88.14 |
| 2012-06-14 22:00:00 | 88.14 |
| 2012-06-14 23:00:00 | 88.14 |
| 2012-06-15 | 88.14 |
| 2012-06-15 01:00:00 | 88.4 |
| 2012-06-15 02:00:00 | 88.14 |
| 2012-06-15 03:00:00 | 88.14 |
| 2012-06-15 04:00:00 | 88.4 |
| 2012-06-15 05:00:00 | 88.4 |
| 2012-06-15 06:00:00 | 88.14 |
| 2012-06-15 07:00:00 | 88.14 |
| 2012-06-15 08:00:00 | 87.88 |
| 2012-06-15 09:00:00 | 87.88 |
| 2012-06-15 10:00:00 | 87.88 |
| 2012-06-15 11:00:00 | 87.88 |
| 2012-06-15 12:00:00 | 87.88 |
| 2012-06-15 13:00:00 | 88.14 |
| 2012-06-15 14:00:00 | 87.88 |
| 2012-06-15 15:00:00 | 88.14 |
| 2012-06-15 16:00:00 | 87.88 |
| 2012-06-15 17:00:00 | 87.88 |
| 2012-06-15 18:00:00 | 88.14 |
| 2012-06-15 19:00:00 | 88.14 |
| 2012-06-15 20:00:00 | 87.88 |
| 2012-06-15 21:00:00 | 88.14 |
| 2012-06-15 22:00:00 | 87.88 |
| 2012-06-15 23:00:00 | 87.88 |
| 2012-06-16 | 88.14 |
| 2012-06-16 01:00:00 | 88.14 |
| 2012-06-16 02:00:00 | 87.88 |
| 2012-06-16 03:00:00 | 88.4 |
| 2012-06-16 04:00:00 | 88.14 |
| 2012-06-16 05:00:00 | 88.14 |
| 2012-06-16 06:00:00 | 88.4 |
| 2012-06-16 07:00:00 | 87.88 |
| 2012-06-16 08:00:00 | 88.14 |
| 2012-06-16 09:00:00 | 87.88 |
| 2012-06-16 10:00:00 | 87.62 |
| 2012-06-16 11:00:00 | 87.88 |
| 2012-06-16 12:00:00 | 87.88 |
| 2012-06-16 13:00:00 | 87.88 |
| 2012-06-16 14:00:00 | 87.88 |
| 2012-06-16 15:00:00 | 88.14 |
| 2012-06-16 16:00:00 | 87.88 |
| 2012-06-16 17:00:00 | 87.88 |
| 2012-06-16 18:00:00 | 87.88 |
| 2012-06-16 19:00:00 | 87.88 |
| 2012-06-16 20:00:00 | 87.88 |
| 2012-06-16 21:00:00 | 88.14 |
| 2012-06-16 22:00:00 | 87.88 |
| 2012-06-16 23:00:00 | 88.14 |
| 2012-06-17 | 87.88 |
| 2012-06-17 01:00:00 | 88.14 |
| 2012-06-17 02:00:00 | 88.14 |
| 2012-06-17 03:00:00 | 87.88 |
| 2012-06-17 04:00:00 | 88.14 |
| 2012-06-17 05:00:00 | 88.14 |
| 2012-06-17 06:00:00 | 88.66 |
| 2012-06-17 07:00:00 | 88.14 |
| 2012-06-17 08:00:00 | 88.14 |
| 2012-06-17 09:00:00 | 88.4 |
| 2012-06-17 10:00:00 | 87.88 |
| 2012-06-17 11:00:00 | 88.14 |
| 2012-06-17 12:00:00 | 87.62 |
| 2012-06-17 13:00:00 | 87.88 |
| 2012-06-17 14:00:00 | 87.88 |
| 2012-06-17 15:00:00 | 87.88 |
| 2012-06-17 16:00:00 | 87.88 |
| 2012-06-17 17:00:00 | 87.88 |
| 2012-06-17 18:00:00 | 87.88 |
| 2012-06-17 19:00:00 | 87.88 |
| 2012-06-17 20:00:00 | 87.88 |
| 2012-06-17 21:00:00 | 87.88 |
| 2012-06-17 22:00:00 | 99.06 |
| 2012-06-17 23:00:00 | 113.36 |
| 2012-06-18 | 113.1 |
| 2012-06-18 01:00:00 | 113.36 |
| 2012-06-18 02:00:00 | 113.1 |
| 2012-06-18 03:00:00 | 113.36 |
| 2012-06-18 04:00:00 | 113.1 |
| 2012-06-18 05:00:00 | 113.36 |
| 2012-06-18 06:00:00 | 113.36 |
| 2012-06-18 07:00:00 | 112.84 |
| 2012-06-18 08:00:00 | 112.58 |
| 2012-06-18 09:00:00 | 112.58 |
| 2012-06-18 10:00:00 | 112.58 |
| 2012-06-18 11:00:00 | 112.84 |
| 2012-06-18 12:00:00 | 111.8 |
| 2012-06-18 13:00:00 | 112.32 |
| 2012-06-18 14:00:00 | 112.32 |
| 2012-06-18 15:00:00 | 112.58 |
| 2012-06-18 16:00:00 | 112.32 |
| 2012-06-18 17:00:00 | 112.58 |
| 2012-06-18 18:00:00 | 112.58 |
| 2012-06-18 19:00:00 | 112.58 |
| 2012-06-18 20:00:00 | 112.32 |
| 2012-06-18 21:00:00 | 112.58 |
| 2012-06-18 22:00:00 | 112.58 |
| 2012-06-18 23:00:00 | 112.84 |
| 2012-06-19 | 112.58 |
| 2012-06-19 01:00:00 | 112.58 |
| 2012-06-19 02:00:00 | 112.84 |
| 2012-06-19 03:00:00 | 112.58 |
| 2012-06-19 04:00:00 | 112.84 |
| 2012-06-19 05:00:00 | 112.84 |
| 2012-06-19 06:00:00 | 112.84 |
| 2012-06-19 07:00:00 | 112.58 |
| 2012-06-19 08:00:00 | 112.58 |
| 2012-06-19 09:00:00 | 112.58 |
| 2012-06-19 10:00:00 | 112.32 |
| 2012-06-19 11:00:00 | 112.58 |
| 2012-06-19 12:00:00 | 112.58 |
| 2012-06-19 13:00:00 | 112.58 |
| 2012-06-19 14:00:00 | 112.58 |
| 2012-06-19 15:00:00 | 112.58 |
| 2012-06-19 16:00:00 | 96.2 |
| 2012-06-19 17:00:00 | 87.36 |
| 2012-06-19 18:00:00 | 87.62 |
| 2012-06-19 19:00:00 | 87.36 |
| 2012-06-19 20:00:00 | 87.36 |
| 2012-06-19 21:00:00 | 87.62 |
| 2012-06-19 22:00:00 | 87.36 |
| 2012-06-19 23:00:00 | 87.62 |
| 2012-06-20 | 87.62 |
| 2012-06-20 01:00:00 | 87.62 |
| 2012-06-20 02:00:00 | 87.62 |
| 2012-06-20 03:00:00 | 87.62 |
| 2012-06-20 04:00:00 | 87.62 |
| 2012-06-20 05:00:00 | 87.88 |
| 2012-06-20 06:00:00 | 87.88 |
| 2012-06-20 07:00:00 | 87.62 |
| 2012-06-20 08:00:00 | 87.36 |
| 2012-06-20 09:00:00 | 87.1 |
| 2012-06-20 10:00:00 | 87.36 |
| 2012-06-20 11:00:00 | 87.1 |
| 2012-06-20 12:00:00 | 87.1 |
| 2012-06-20 13:00:00 | 86.84 |
| 2012-06-20 14:00:00 | 86.84 |
| 2012-06-20 15:00:00 | 87.1 |
| 2012-06-20 16:00:00 | 86.84 |
| 2012-06-20 17:00:00 | 86.84 |
| 2012-06-20 18:00:00 | 86.84 |
| 2012-06-20 19:00:00 | 87.1 |
| 2012-06-20 20:00:00 | 87.1 |
| 2012-06-20 21:00:00 | 87.1 |
| 2012-06-20 22:00:00 | 86.84 |
| 2012-06-20 23:00:00 | 87.1 |
| 2012-06-21 | 86.84 |
| 2012-06-21 01:00:00 | 87.1 |
| 2012-06-21 02:00:00 | 87.1 |
| 2012-06-21 03:00:00 | 87.1 |
| 2012-06-21 04:00:00 | 87.1 |
| 2012-06-21 05:00:00 | 87.1 |
| 2012-06-21 06:00:00 | 87.1 |
| 2012-06-21 07:00:00 | 87.1 |
| 2012-06-21 08:00:00 | 86.84 |
| 2012-06-21 09:00:00 | 86.84 |
| 2012-06-21 10:00:00 | 86.84 |
| 2012-06-21 11:00:00 | 86.84 |
| 2012-06-21 12:00:00 | 86.84 |
| 2012-06-21 13:00:00 | 87.1 |
| 2012-06-21 14:00:00 | 86.84 |
| 2012-06-21 15:00:00 | 86.84 |
| 2012-06-21 16:00:00 | 86.84 |
| 2012-06-21 17:00:00 | 86.84 |
| 2012-06-21 18:00:00 | 87.1 |
| 2012-06-21 19:00:00 | 86.84 |
| 2012-06-21 20:00:00 | 87.1 |
| 2012-06-21 21:00:00 | 87.1 |
| 2012-06-21 22:00:00 | 86.84 |
| 2012-06-21 23:00:00 | 87.1 |
| 2012-06-22 | 86.84 |
| 2012-06-22 01:00:00 | 87.1 |
| 2012-06-22 02:00:00 | 87.1 |
| 2012-06-22 03:00:00 | 87.36 |
| 2012-06-22 04:00:00 | 87.62 |
| 2012-06-22 05:00:00 | 87.88 |
| 2012-06-22 06:00:00 | 87.62 |
| 2012-06-22 07:00:00 | 87.62 |
| 2012-06-22 08:00:00 | 87.36 |
| 2012-06-22 09:00:00 | 86.84 |
| 2012-06-22 10:00:00 | 87.1 |
| 2012-06-22 11:00:00 | 87.36 |
| 2012-06-22 12:00:00 | 87.1 |
| 2012-06-22 13:00:00 | 87.1 |
| 2012-06-22 14:00:00 | 87.36 |
| 2012-06-22 15:00:00 | 87.1 |
| 2012-06-22 16:00:00 | 87.36 |
| 2012-06-22 17:00:00 | 87.1 |
| 2012-06-22 18:00:00 | 87.36 |
| 2012-06-22 19:00:00 | 87.36 |
| 2012-06-22 20:00:00 | 87.36 |
| 2012-06-22 21:00:00 | 87.36 |
| 2012-06-22 22:00:00 | 87.62 |
| 2012-06-22 23:00:00 | 88.14 |
| 2012-06-23 | 87.88 |
| 2012-06-23 01:00:00 | 87.88 |
| 2012-06-23 02:00:00 | 87.88 |
| 2012-06-23 03:00:00 | 87.88 |
| 2012-06-23 04:00:00 | 87.88 |
| 2012-06-23 05:00:00 | 87.88 |
| 2012-06-23 06:00:00 | 88.14 |
| 2012-06-23 07:00:00 | 88.14 |
| 2012-06-23 08:00:00 | 88.14 |
| 2012-06-23 09:00:00 | 87.88 |
| 2012-06-23 10:00:00 | 87.88 |
| 2012-06-23 11:00:00 | 87.88 |
| 2012-06-23 12:00:00 | 87.88 |
| 2012-06-23 13:00:00 | 87.88 |
| 2012-06-23 14:00:00 | 87.88 |
| 2012-06-23 15:00:00 | 88.14 |
| 2012-06-23 16:00:00 | 87.88 |
| 2012-06-23 17:00:00 | 87.88 |
| 2012-06-23 18:00:00 | 88.14 |
| 2012-06-23 19:00:00 | 87.88 |
| 2012-06-23 20:00:00 | 88.14 |
| 2012-06-23 21:00:00 | 87.88 |
| 2012-06-23 22:00:00 | 87.88 |
| 2012-06-23 23:00:00 | 88.14 |
| 2012-06-24 | 88.14 |
| 2012-06-24 01:00:00 | 87.88 |
| 2012-06-24 02:00:00 | 88.14 |
| 2012-06-24 03:00:00 | 88.14 |
| 2012-06-24 04:00:00 | 88.14 |
| 2012-06-24 05:00:00 | 88.14 |
| 2012-06-24 06:00:00 | 88.14 |
| 2012-06-24 07:00:00 | 88.14 |
| 2012-06-24 08:00:00 | 88.14 |
| 2012-06-24 09:00:00 | 87.88 |
| 2012-06-24 10:00:00 | 87.88 |
| 2012-06-24 11:00:00 | 87.88 |
| 2012-06-24 12:00:00 | 87.88 |
| 2012-06-24 13:00:00 | 87.88 |
| 2012-06-24 14:00:00 | 87.88 |
| 2012-06-24 15:00:00 | 87.88 |
| 2012-06-24 16:00:00 | 87.88 |
| 2012-06-24 17:00:00 | 87.88 |
| 2012-06-24 18:00:00 | 88.14 |
| 2012-06-24 19:00:00 | 87.88 |
| 2012-06-24 20:00:00 | 87.62 |
| 2012-06-24 21:00:00 | 87.88 |
| 2012-06-24 22:00:00 | 87.88 |
| 2012-06-24 23:00:00 | 87.88 |
| 2012-06-25 | 87.88 |
| 2012-06-25 01:00:00 | 87.88 |
| 2012-06-25 02:00:00 | 88.14 |
| 2012-06-25 03:00:00 | 87.88 |
| 2012-06-25 04:00:00 | 87.88 |
| 2012-06-25 05:00:00 | 88.14 |
| 2012-06-25 06:00:00 | 87.88 |
| 2012-06-25 07:00:00 | 87.88 |
| 2012-06-25 08:00:00 | 87.62 |
| 2012-06-25 09:00:00 | 87.62 |
| 2012-06-25 10:00:00 | 87.36 |
| 2012-06-25 11:00:00 | 87.62 |
| 2012-06-25 12:00:00 | 87.36 |
| 2012-06-25 13:00:00 | 87.62 |
| 2012-06-25 14:00:00 | 87.62 |
| 2012-06-25 15:00:00 | 87.62 |
| 2012-06-25 16:00:00 | 87.62 |
| 2012-06-25 17:00:00 | 87.62 |
| 2012-06-25 18:00:00 | 87.62 |
| 2012-06-25 19:00:00 | 87.62 |
| 2012-06-25 20:00:00 | 87.62 |
| 2012-06-25 21:00:00 | 87.88 |
| 2012-06-25 22:00:00 | 87.62 |
| 2012-06-25 23:00:00 | 87.88 |
| 2012-06-26 | 87.88 |
| 2012-06-26 01:00:00 | 87.62 |
| 2012-06-26 02:00:00 | 87.88 |
| 2012-06-26 03:00:00 | 87.88 |
| 2012-06-26 04:00:00 | 87.62 |
| 2012-06-26 05:00:00 | 87.88 |
| 2012-06-26 06:00:00 | 87.88 |
| 2012-06-26 07:00:00 | 87.62 |
| 2012-06-26 08:00:00 | 87.62 |
| 2012-06-26 09:00:00 | 87.62 |
| 2012-06-26 10:00:00 | 87.36 |
| 2012-06-26 11:00:00 | 87.88 |
| 2012-06-26 12:00:00 | 87.62 |
| 2012-06-26 13:00:00 | 87.62 |
| 2012-06-26 14:00:00 | 87.62 |
| 2012-06-26 15:00:00 | 87.88 |
| 2012-06-26 16:00:00 | 87.62 |
| 2012-06-26 17:00:00 | 87.62 |
| 2012-06-26 18:00:00 | 87.62 |
| 2012-06-26 19:00:00 | 87.62 |
| 2012-06-26 20:00:00 | 87.62 |
| 2012-06-26 21:00:00 | 87.62 |
| 2012-06-26 22:00:00 | 87.62 |
| 2012-06-26 23:00:00 | 87.62 |
| 2012-06-27 | 87.88 |
| 2012-06-27 01:00:00 | 87.62 |
| 2012-06-27 02:00:00 | 87.88 |
| 2012-06-27 03:00:00 | 87.62 |
| 2012-06-27 04:00:00 | 87.88 |
| 2012-06-27 05:00:00 | 87.88 |
| 2012-06-27 06:00:00 | 87.88 |
| 2012-06-27 07:00:00 | 87.36 |
| 2012-06-27 08:00:00 | 87.62 |
| 2012-06-27 09:00:00 | 87.62 |
| 2012-06-27 10:00:00 | 87.36 |
| 2012-06-27 11:00:00 | 87.62 |
| 2012-06-27 12:00:00 | 87.62 |
| 2012-06-27 13:00:00 | 87.62 |
| 2012-06-27 14:00:00 | 87.62 |
| 2012-06-27 15:00:00 | 87.62 |
| 2012-06-27 16:00:00 | 87.36 |
| 2012-06-27 17:00:00 | 87.62 |
| 2012-06-27 18:00:00 | 87.88 |
| 2012-06-27 19:00:00 | 87.62 |
| 2012-06-27 20:00:00 | 87.88 |
| 2012-06-27 21:00:00 | 87.62 |
| 2012-06-27 22:00:00 | 87.62 |
| 2012-06-27 23:00:00 | 87.1 |
| 2012-06-28 | 87.88 |
| 2012-06-28 01:00:00 | 87.88 |
| 2012-06-28 02:00:00 | 87.62 |
| 2012-06-28 03:00:00 | 87.88 |
| 2012-06-28 04:00:00 | 87.88 |
| 2012-06-28 05:00:00 | 87.88 |
| 2012-06-28 06:00:00 | 87.88 |
| 2012-06-28 07:00:00 | 87.36 |
| 2012-06-28 08:00:00 | 87.62 |
| 2012-06-28 09:00:00 | 87.36 |
| 2012-06-28 10:00:00 | 87.62 |
| 2012-06-28 11:00:00 | 87.62 |
| 2012-06-28 12:00:00 | 87.36 |
| 2012-06-28 13:00:00 | 87.62 |
| 2012-06-28 14:00:00 | 87.62 |
| 2012-06-28 15:00:00 | 87.36 |
| 2012-06-28 16:00:00 | 87.62 |
| 2012-06-28 17:00:00 | 87.62 |
| 2012-06-28 18:00:00 | 87.36 |
| 2012-06-28 19:00:00 | 87.62 |
| 2012-06-28 20:00:00 | 87.62 |
| 2012-06-28 21:00:00 | 87.62 |
| 2012-06-28 22:00:00 | 87.62 |
| 2012-06-28 23:00:00 | 87.62 |
| 2012-06-29 | 87.62 |
| 2012-06-29 01:00:00 | 87.88 |
| 2012-06-29 02:00:00 | 87.62 |
| 2012-06-29 03:00:00 | 87.88 |
| 2012-06-29 04:00:00 | 87.62 |
| 2012-06-29 05:00:00 | 87.88 |
| 2012-06-29 06:00:00 | 87.62 |
| 2012-06-29 07:00:00 | 87.62 |
| 2012-06-29 08:00:00 | 87.62 |
| 2012-06-29 09:00:00 | 87.36 |
| 2012-06-29 10:00:00 | 87.36 |
| 2012-06-29 11:00:00 | 87.62 |
| 2012-06-29 12:00:00 | 87.36 |
| 2012-06-29 13:00:00 | 87.36 |
| 2012-06-29 14:00:00 | 87.62 |
| 2012-06-29 15:00:00 | 87.36 |
| 2012-06-29 16:00:00 | 87.62 |
| 2012-06-29 17:00:00 | 87.62 |
| 2012-06-29 18:00:00 | 87.62 |
| 2012-06-29 19:00:00 | 87.62 |
| 2012-06-29 20:00:00 | 87.62 |
| 2012-06-29 21:00:00 | 87.62 |
| 2012-06-29 22:00:00 | 87.62 |
| 2012-06-29 23:00:00 | 87.62 |
| 2012-06-30 | 87.88 |
| 2012-06-30 01:00:00 | 87.62 |
| 2012-06-30 02:00:00 | 87.62 |
| 2012-06-30 03:00:00 | 87.88 |
| 2012-06-30 04:00:00 | 87.62 |
| 2012-06-30 05:00:00 | 87.88 |
| 2012-06-30 06:00:00 | 87.88 |
| 2012-06-30 07:00:00 | 87.88 |
| 2012-06-30 08:00:00 | 87.62 |
| 2012-06-30 09:00:00 | 87.62 |
| 2012-06-30 10:00:00 | 87.62 |
| 2012-06-30 11:00:00 | 87.62 |
| 2012-06-30 12:00:00 | 87.62 |
| 2012-06-30 13:00:00 | 87.62 |
| 2012-06-30 14:00:00 | 87.62 |
| 2012-06-30 15:00:00 | 87.62 |
| 2012-06-30 16:00:00 | 87.62 |
| 2012-06-30 17:00:00 | 87.62 |
| 2012-06-30 18:00:00 | 87.62 |
| 2012-06-30 19:00:00 | 87.88 |
| 2012-06-30 20:00:00 | 87.62 |
| 2012-06-30 21:00:00 | 87.88 |
| 2012-06-30 22:00:00 | 87.62 |
| 2012-06-30 23:00:00 | 87.62 |
| 2012-07-01 | 87.88 |
| 2012-07-01 01:00:00 | 87.62 |
| 2012-07-01 02:00:00 | 87.88 |
| 2012-07-01 03:00:00 | 87.88 |
| 2012-07-01 04:00:00 | 87.88 |
| 2012-07-01 05:00:00 | 87.88 |
| 2012-07-01 06:00:00 | 88.14 |
| 2012-07-01 07:00:00 | 87.62 |
| 2012-07-01 08:00:00 | 87.88 |
| 2012-07-01 09:00:00 | 87.62 |
| 2012-07-01 10:00:00 | 87.62 |
| 2012-07-01 11:00:00 | 87.62 |
| 2012-07-01 12:00:00 | 87.62 |
| 2012-07-01 13:00:00 | 87.62 |
| 2012-07-01 14:00:00 | 87.62 |
| 2012-07-01 15:00:00 | 87.88 |
| 2012-07-01 16:00:00 | 87.62 |
| 2012-07-01 17:00:00 | 87.62 |
| 2012-07-01 18:00:00 | 87.62 |
| 2012-07-01 19:00:00 | 87.62 |
| 2012-07-01 20:00:00 | 87.88 |
| 2012-07-01 21:00:00 | 87.62 |
| 2012-07-01 22:00:00 | 87.62 |
| 2012-07-01 23:00:00 | 87.88 |
| 2012-07-02 | 87.62 |
| 2012-07-02 01:00:00 | 87.88 |
| 2012-07-02 02:00:00 | 87.62 |
| 2012-07-02 03:00:00 | 87.88 |
| 2012-07-02 04:00:00 | 87.88 |
| 2012-07-02 05:00:00 | 87.88 |
| 2012-07-02 06:00:00 | 87.88 |
| 2012-07-02 07:00:00 | 87.88 |
| 2012-07-02 08:00:00 | 87.62 |
| 2012-07-02 09:00:00 | 87.62 |
| 2012-07-02 10:00:00 | 87.62 |
| 2012-07-02 11:00:00 | 87.62 |
| 2012-07-02 12:00:00 | 87.36 |
| 2012-07-02 13:00:00 | 87.62 |
| 2012-07-02 14:00:00 | 87.62 |
| 2012-07-02 15:00:00 | 87.88 |
| 2012-07-02 16:00:00 | 87.62 |
| 2012-07-02 17:00:00 | 87.36 |
| 2012-07-02 18:00:00 | 87.62 |
| 2012-07-02 19:00:00 | 87.62 |
| 2012-07-02 20:00:00 | 87.88 |
| 2012-07-02 21:00:00 | 87.62 |
| 2012-07-02 22:00:00 | 87.62 |
| 2012-07-02 23:00:00 | 87.62 |
| 2012-07-03 | 87.88 |
| 2012-07-03 01:00:00 | 87.36 |
| 2012-07-03 02:00:00 | 87.88 |
| 2012-07-03 03:00:00 | 87.62 |
| 2012-07-03 04:00:00 | 87.62 |
| 2012-07-03 05:00:00 | 87.88 |
| 2012-07-03 06:00:00 | 87.62 |
| 2012-07-03 07:00:00 | 87.88 |
| 2012-07-03 08:00:00 | 87.62 |
| 2012-07-03 09:00:00 | 87.36 |
| 2012-07-03 10:00:00 | 87.62 |
| 2012-07-03 11:00:00 | 87.36 |
| 2012-07-03 12:00:00 | 87.62 |
| 2012-07-03 13:00:00 | 87.36 |
| 2012-07-03 14:00:00 | 87.62 |
| 2012-07-03 15:00:00 | 87.36 |
| 2012-07-03 16:00:00 | 87.62 |
| 2012-07-03 17:00:00 | 87.36 |
| 2012-07-03 18:00:00 | 87.62 |
| 2012-07-03 19:00:00 | 87.62 |
| 2012-07-03 20:00:00 | 87.62 |
| 2012-07-03 21:00:00 | 87.62 |
| 2012-07-03 22:00:00 | 87.62 |
| 2012-07-03 23:00:00 | 87.62 |
| 2012-07-04 | 87.62 |
| 2012-07-04 01:00:00 | 87.62 |
| 2012-07-04 02:00:00 | 87.88 |
| 2012-07-04 03:00:00 | 87.62 |
| 2012-07-04 04:00:00 | 87.62 |
| 2012-07-04 05:00:00 | 87.62 |
| 2012-07-04 06:00:00 | 87.88 |
| 2012-07-04 07:00:00 | 87.62 |
| 2012-07-04 08:00:00 | 87.62 |
| 2012-07-04 09:00:00 | 87.62 |
| 2012-07-04 10:00:00 | 87.62 |
| 2012-07-04 11:00:00 | 87.62 |
| 2012-07-04 12:00:00 | 87.62 |
| 2012-07-04 13:00:00 | 87.62 |
| 2012-07-04 14:00:00 | 87.62 |
| 2012-07-04 15:00:00 | 87.62 |
| 2012-07-04 16:00:00 | 87.62 |
| 2012-07-04 17:00:00 | 87.62 |
| 2012-07-04 18:00:00 | 87.62 |
| 2012-07-04 19:00:00 | 87.62 |
| 2012-07-04 20:00:00 | 87.62 |
| 2012-07-04 21:00:00 | 87.36 |
| 2012-07-04 22:00:00 | 87.62 |
| 2012-07-04 23:00:00 | 87.62 |
| 2012-07-05 | 87.88 |
| 2012-07-05 01:00:00 | 87.62 |
| 2012-07-05 02:00:00 | 87.62 |
| 2012-07-05 03:00:00 | 87.88 |
| 2012-07-05 04:00:00 | 87.62 |
| 2012-07-05 05:00:00 | 87.88 |
| 2012-07-05 06:00:00 | 87.88 |
| 2012-07-05 07:00:00 | 87.62 |
| 2012-07-05 08:00:00 | 87.62 |
| 2012-07-05 09:00:00 | 87.62 |
| 2012-07-05 10:00:00 | 87.62 |
| 2012-07-05 11:00:00 | 87.62 |
| 2012-07-05 12:00:00 | 87.62 |
| 2012-07-05 13:00:00 | 87.62 |
| 2012-07-05 14:00:00 | 87.62 |
| 2012-07-05 15:00:00 | 87.62 |
| 2012-07-05 16:00:00 | 87.88 |
| 2012-07-05 17:00:00 | 87.62 |
| 2012-07-05 18:00:00 | 87.88 |
| 2012-07-05 19:00:00 | 87.62 |
| 2012-07-05 20:00:00 | 87.62 |
| 2012-07-05 21:00:00 | 87.62 |
| 2012-07-05 22:00:00 | 87.62 |
| 2012-07-05 23:00:00 | 87.62 |
| 2012-07-06 | 87.88 |
| 2012-07-06 01:00:00 | 87.62 |
| 2012-07-06 02:00:00 | 87.62 |
| 2012-07-06 03:00:00 | 87.88 |
| 2012-07-06 04:00:00 | 87.88 |
| 2012-07-06 05:00:00 | 87.62 |
| 2012-07-06 06:00:00 | 87.88 |
| 2012-07-06 07:00:00 | 87.88 |
| 2012-07-06 08:00:00 | 87.36 |
| 2012-07-06 09:00:00 | 87.62 |
| 2012-07-06 10:00:00 | 87.62 |
| 2012-07-06 11:00:00 | 87.36 |
| 2012-07-06 12:00:00 | 87.62 |
| 2012-07-06 13:00:00 | 87.62 |
| 2012-07-06 14:00:00 | 87.62 |
| 2012-07-06 15:00:00 | 87.36 |
| 2012-07-06 16:00:00 | 87.62 |
| 2012-07-06 17:00:00 | 87.62 |
| 2012-07-06 18:00:00 | 87.62 |
| 2012-07-06 19:00:00 | 87.62 |
| 2012-07-06 20:00:00 | 87.62 |
| 2012-07-06 21:00:00 | 87.88 |
| 2012-07-06 22:00:00 | 87.36 |
| 2012-07-06 23:00:00 | 87.62 |
| 2012-07-07 | 87.88 |
| 2012-07-07 01:00:00 | 87.62 |
| 2012-07-07 02:00:00 | 87.62 |
| 2012-07-07 03:00:00 | 87.88 |
| 2012-07-07 04:00:00 | 87.62 |
| 2012-07-07 05:00:00 | 87.88 |
| 2012-07-07 06:00:00 | 87.62 |
| 2012-07-07 07:00:00 | 87.62 |
| 2012-07-07 08:00:00 | 87.62 |
| 2012-07-07 09:00:00 | 87.88 |
| 2012-07-07 10:00:00 | 87.62 |
| 2012-07-07 11:00:00 | 87.62 |
| 2012-07-07 12:00:00 | 87.36 |
| 2012-07-07 13:00:00 | 87.62 |
| 2012-07-07 14:00:00 | 87.62 |
| 2012-07-07 15:00:00 | 87.62 |
| 2012-07-07 16:00:00 | 87.62 |
| 2012-07-07 17:00:00 | 87.62 |
| 2012-07-07 18:00:00 | 87.62 |
| 2012-07-07 19:00:00 | 87.62 |
| 2012-07-07 20:00:00 | 87.62 |
| 2012-07-07 21:00:00 | 87.62 |
| 2012-07-07 22:00:00 | 87.62 |
| 2012-07-07 23:00:00 | 87.62 |
| 2012-07-08 | 87.62 |
| 2012-07-08 01:00:00 | 87.62 |
| 2012-07-08 02:00:00 | 87.62 |
| 2012-07-08 03:00:00 | 87.36 |
| 2012-07-08 04:00:00 | 87.88 |
| 2012-07-08 05:00:00 | 87.62 |
| 2012-07-08 06:00:00 | 87.88 |
| 2012-07-08 07:00:00 | 87.62 |
| 2012-07-08 08:00:00 | 87.62 |
| 2012-07-08 09:00:00 | 87.36 |
| 2012-07-08 10:00:00 | 87.62 |
| 2012-07-08 11:00:00 | 87.62 |
| 2012-07-08 12:00:00 | 87.62 |
| 2012-07-08 13:00:00 | 87.36 |
| 2012-07-08 14:00:00 | 87.62 |
| 2012-07-08 15:00:00 | 87.62 |
| 2012-07-08 16:00:00 | 87.36 |
| 2012-07-08 17:00:00 | 87.62 |
| 2012-07-08 18:00:00 | 87.36 |
| 2012-07-08 19:00:00 | 87.62 |
| 2012-07-08 20:00:00 | 87.62 |
| 2012-07-08 21:00:00 | 87.62 |
| 2012-07-08 22:00:00 | 87.62 |
| 2012-07-08 23:00:00 | 87.62 |
| 2012-07-09 | 87.62 |
| 2012-07-09 01:00:00 | 87.36 |
| 2012-07-09 02:00:00 | 87.62 |
| 2012-07-09 03:00:00 | 87.62 |
| 2012-07-09 04:00:00 | 87.62 |
| 2012-07-09 05:00:00 | 87.62 |
| 2012-07-09 06:00:00 | 87.62 |
| 2012-07-09 07:00:00 | 88.92 |
| 2012-07-09 08:00:00 | 91.52 |
| 2012-07-09 09:00:00 | 91.26 |
| 2012-07-09 10:00:00 | 91.26 |
| 2012-07-09 11:00:00 | 91.26 |
| 2012-07-09 12:00:00 | 91 |
| 2012-07-09 13:00:00 | 91.26 |
| 2012-07-09 14:00:00 | 91.26 |
| 2012-07-09 15:00:00 | 91 |
| 2012-07-09 16:00:00 | 91.26 |
| 2012-07-09 17:00:00 | 91.26 |
| 2012-07-09 18:00:00 | 91.26 |
| 2012-07-09 19:00:00 | 91.52 |
| 2012-07-09 20:00:00 | 91.26 |
| 2012-07-09 21:00:00 | 91.52 |
| 2012-07-09 22:00:00 | 91.26 |
| 2012-07-09 23:00:00 | 91.26 |
| 2012-07-10 | 91.26 |
| 2012-07-10 01:00:00 | 91.52 |
| 2012-07-10 02:00:00 | 91.26 |
| 2012-07-10 03:00:00 | 91.52 |
| 2012-07-10 04:00:00 | 91.26 |
| 2012-07-10 05:00:00 | 91.52 |
| 2012-07-10 06:00:00 | 91.52 |
| 2012-07-10 07:00:00 | 91.26 |
| 2012-07-10 08:00:00 | 91.26 |
| 2012-07-10 09:00:00 | 91.26 |
| 2012-07-10 10:00:00 | 91.26 |
| 2012-07-10 11:00:00 | 91.52 |
| 2012-07-10 12:00:00 | 91.26 |
| 2012-07-10 13:00:00 | 96.46 |
| 2012-07-10 14:00:00 | 104 |
| 2012-07-10 15:00:00 | 104.26 |
| 2012-07-10 16:00:00 | 104.26 |
| 2012-07-10 17:00:00 | 104.26 |
| 2012-07-10 18:00:00 | 104.26 |
| 2012-07-10 19:00:00 | 104.26 |
| 2012-07-10 20:00:00 | 104.26 |
| 2012-07-10 21:00:00 | 104.26 |
| 2012-07-10 22:00:00 | 104 |
| 2012-07-10 23:00:00 | 104.52 |
| 2012-07-11 | 104.26 |
| 2012-07-11 01:00:00 | 104.26 |
| 2012-07-11 02:00:00 | 104.26 |
| 2012-07-11 03:00:00 | 104.26 |
| 2012-07-11 04:00:00 | 104 |
| 2012-07-11 05:00:00 | 104.26 |
| 2012-07-11 06:00:00 | 104.52 |
| 2012-07-11 07:00:00 | 104 |
| 2012-07-11 08:00:00 | 104.26 |
| 2012-07-11 09:00:00 | 104.26 |
| 2012-07-11 10:00:00 | 104.78 |
| 2012-07-11 11:00:00 | 48.1 |
| 2012-07-11 12:00:00 | 33.54 |
| 2012-07-11 13:00:00 | 1.82 |
| 2012-07-11 14:00:00 | 0.78 |
| 2012-07-11 15:00:00 | 0.52 |
| 2012-07-11 16:00:00 | 0.78 |
| 2012-07-11 17:00:00 | 0.52 |
| 2012-07-11 18:00:00 | 0.52 |
| 2012-07-11 19:00:00 | 0.78 |
| 2012-07-11 20:00:00 | 0.52 |
| 2012-07-11 21:00:00 | 0.52 |
| 2012-07-11 22:00:00 | 0.78 |
| 2012-07-11 23:00:00 | 0.52 |
| 2012-07-12 | 0.78 |
| 2012-07-12 01:00:00 | 0.52 |
| 2012-07-12 02:00:00 | 0.52 |
| 2012-07-12 03:00:00 | 0.78 |
| 2012-07-12 04:00:00 | 0.52 |
| 2012-07-12 05:00:00 | 0.78 |
| 2012-07-12 06:00:00 | 0.52 |
| 2012-07-12 07:00:00 | 0.52 |
| 2012-07-12 08:00:00 | 0.78 |
| 2012-07-12 09:00:00 | 0.52 |
| 2012-07-12 10:00:00 | 0.78 |
| 2012-07-12 11:00:00 | 0.52 |
| 2012-07-12 12:00:00 | 0.78 |
| 2012-07-12 13:00:00 | 0.78 |
| 2012-07-12 14:00:00 | 0.78 |
| 2012-07-12 15:00:00 | 0.52 |
| 2012-07-12 16:00:00 | 0.78 |
| 2012-07-12 17:00:00 | 0.52 |
| 2012-07-12 18:00:00 | 0.78 |
| 2012-07-12 19:00:00 | 0.52 |
| 2012-07-12 20:00:00 | 0.52 |
| 2012-07-12 21:00:00 | 0.78 |
| 2012-07-12 22:00:00 | 0.52 |
| 2012-07-12 23:00:00 | 0.52 |
| 2012-07-13 | 0.78 |
| 2012-07-13 01:00:00 | 0.52 |
| 2012-07-13 02:00:00 | 0.78 |
| 2012-07-13 03:00:00 | 0.52 |
| 2012-07-13 04:00:00 | 0.52 |
| 2012-07-13 05:00:00 | 0.78 |
| 2012-07-13 06:00:00 | 0.52 |
| 2012-07-13 07:00:00 | 0.52 |
| 2012-07-13 08:00:00 | 0.78 |
| 2012-07-13 09:00:00 | 0.52 |
| 2012-07-13 10:00:00 | 0.78 |
| 2012-07-13 11:00:00 | 9.62 |
| 2012-07-13 12:00:00 | 39 |
| 2012-07-13 13:00:00 | 62.4 |
| 2012-07-13 14:00:00 | 62.66 |
| 2012-07-13 15:00:00 | 62.4 |
| 2012-07-13 16:00:00 | 62.4 |
| 2012-07-13 17:00:00 | 62.92 |
| 2012-07-13 18:00:00 | 101.92 |
| 2012-07-13 19:00:00 | 104.78 |
| 2012-07-13 20:00:00 | 104.52 |
| 2012-07-13 21:00:00 | 104.52 |
| 2012-07-13 22:00:00 | 104.52 |
| 2012-07-13 23:00:00 | 104.78 |
| 2012-07-14 | 104.78 |
| 2012-07-14 01:00:00 | 104.52 |
| 2012-07-14 02:00:00 | 104.78 |
| 2012-07-14 03:00:00 | 104.78 |
| 2012-07-14 04:00:00 | 104.78 |
| 2012-07-14 05:00:00 | 104.78 |
| 2012-07-14 06:00:00 | 104.78 |
| 2012-07-14 07:00:00 | 104.52 |
| 2012-07-14 08:00:00 | 104.78 |
| 2012-07-14 09:00:00 | 104.78 |
| 2012-07-14 10:00:00 | 104.52 |
| 2012-07-14 11:00:00 | 104.78 |
| 2012-07-14 12:00:00 | 104.52 |
| 2012-07-14 13:00:00 | 104.52 |
| 2012-07-14 14:00:00 | 104.52 |
| 2012-07-14 15:00:00 | 104.78 |
| 2012-07-14 16:00:00 | 104.78 |
| 2012-07-14 17:00:00 | 104.52 |
| 2012-07-14 18:00:00 | 104.52 |
| 2012-07-14 19:00:00 | 104.78 |
| 2012-07-14 20:00:00 | 104.52 |
| 2012-07-14 21:00:00 | 104.78 |
| 2012-07-14 22:00:00 | 104.52 |
| 2012-07-14 23:00:00 | 104.78 |
| 2012-07-15 | 104.78 |
| 2012-07-15 01:00:00 | 104.52 |
| 2012-07-15 02:00:00 | 104.78 |
| 2012-07-15 03:00:00 | 104.78 |
| 2012-07-15 04:00:00 | 104.78 |
| 2012-07-15 05:00:00 | 104.78 |
| 2012-07-15 06:00:00 | 105.04 |
| 2012-07-15 07:00:00 | 104.78 |
| 2012-07-15 08:00:00 | 104.52 |
| 2012-07-15 09:00:00 | 104.78 |
| 2012-07-15 10:00:00 | 104.78 |
| 2012-07-15 11:00:00 | 104.52 |
| 2012-07-15 12:00:00 | 104.78 |
| 2012-07-15 13:00:00 | 104.52 |
| 2012-07-15 14:00:00 | 104.78 |
| 2012-07-15 15:00:00 | 104.78 |
| 2012-07-15 16:00:00 | 104.52 |
| 2012-07-15 17:00:00 | 104.52 |
| 2012-07-15 18:00:00 | 104.78 |
| 2012-07-15 19:00:00 | 104.78 |
| 2012-07-15 20:00:00 | 104.52 |
| 2012-07-15 21:00:00 | 104.78 |
| 2012-07-15 22:00:00 | 104.78 |
| 2012-07-15 23:00:00 | 104.78 |
| 2012-07-16 | 104.52 |
| 2012-07-16 01:00:00 | 104.78 |
| 2012-07-16 02:00:00 | 104.78 |
| 2012-07-16 03:00:00 | 104.78 |
| 2012-07-16 04:00:00 | 104.52 |
| 2012-07-16 05:00:00 | 105.04 |
| 2012-07-16 06:00:00 | 104.52 |
| 2012-07-16 07:00:00 | 104.78 |
| 2012-07-16 08:00:00 | 104.26 |
| 2012-07-16 09:00:00 | 104.52 |
| 2012-07-16 10:00:00 | 104.52 |
| 2012-07-16 11:00:00 | 99.06 |
| 2012-07-16 12:00:00 | 92.3 |
| 2012-07-16 13:00:00 | 99.84 |
| 2012-07-16 14:00:00 | 104.78 |
| 2012-07-16 15:00:00 | 104.78 |
| 2012-07-16 16:00:00 | 104.78 |
| 2012-07-16 17:00:00 | 104.78 |
| 2012-07-16 18:00:00 | 105.04 |
| 2012-07-16 19:00:00 | 104.78 |
| 2012-07-16 20:00:00 | 104.78 |
| 2012-07-16 21:00:00 | 105.04 |
| 2012-07-16 22:00:00 | 104.78 |
| 2012-07-16 23:00:00 | 105.04 |
| 2012-07-17 | 105.04 |
| 2012-07-17 01:00:00 | 105.04 |
| 2012-07-17 02:00:00 | 105.04 |
| 2012-07-17 03:00:00 | 105.04 |
| 2012-07-17 04:00:00 | 105.04 |
| 2012-07-17 05:00:00 | 105.04 |
| 2012-07-17 06:00:00 | 105.04 |
| 2012-07-17 07:00:00 | 104.78 |
| 2012-07-17 08:00:00 | 104.78 |
| 2012-07-17 09:00:00 | 104.52 |
| 2012-07-17 10:00:00 | 104.78 |
| 2012-07-17 11:00:00 | 104.78 |
| 2012-07-17 12:00:00 | 104.78 |
| 2012-07-17 13:00:00 | 105.82 |
| 2012-07-17 14:00:00 | 105.3 |
| 2012-07-17 15:00:00 | 104.78 |
| 2012-07-17 16:00:00 | 104.78 |
| 2012-07-17 17:00:00 | 104.78 |
| 2012-07-17 18:00:00 | 104.78 |
| 2012-07-17 19:00:00 | 104.78 |
| 2012-07-17 20:00:00 | 104.78 |
| 2012-07-17 21:00:00 | 104.78 |
| 2012-07-17 22:00:00 | 104.78 |
| 2012-07-17 23:00:00 | 104.78 |
| 2012-07-18 | 105.04 |
| 2012-07-18 01:00:00 | 104.78 |
| 2012-07-18 02:00:00 | 105.04 |
| 2012-07-18 03:00:00 | 104.78 |
| 2012-07-18 04:00:00 | 105.04 |
| 2012-07-18 05:00:00 | 104.78 |
| 2012-07-18 06:00:00 | 105.04 |
| 2012-07-18 07:00:00 | 104.52 |
| 2012-07-18 08:00:00 | 104.52 |
| 2012-07-18 09:00:00 | 104.78 |
| 2012-07-18 10:00:00 | 104.78 |
| 2012-07-18 11:00:00 | 104.78 |
| 2012-07-18 12:00:00 | 104.52 |
| 2012-07-18 13:00:00 | 104.78 |
| 2012-07-18 14:00:00 | 104.78 |
| 2012-07-18 15:00:00 | 104.52 |
| 2012-07-18 16:00:00 | 104.78 |
| 2012-07-18 17:00:00 | 104.78 |
| 2012-07-18 18:00:00 | 104.78 |
| 2012-07-18 19:00:00 | 104.78 |
| 2012-07-18 20:00:00 | 104.78 |
| 2012-07-18 21:00:00 | 104.78 |
| 2012-07-18 22:00:00 | 104.78 |
| 2012-07-18 23:00:00 | 105.04 |
| 2012-07-19 | 104.78 |
| 2012-07-19 01:00:00 | 105.04 |
| 2012-07-19 02:00:00 | 105.04 |
| 2012-07-19 03:00:00 | 104.78 |
| 2012-07-19 04:00:00 | 105.04 |
| 2012-07-19 05:00:00 | 104.78 |
| 2012-07-19 06:00:00 | 104.78 |
| 2012-07-19 07:00:00 | 104.78 |
| 2012-07-19 08:00:00 | 104.52 |
| 2012-07-19 09:00:00 | 104.52 |
| 2012-07-19 10:00:00 | 104.52 |
| 2012-07-19 11:00:00 | 104.78 |
| 2012-07-19 12:00:00 | 104.52 |
| 2012-07-19 13:00:00 | 104.52 |
| 2012-07-19 14:00:00 | 104.52 |
| 2012-07-19 15:00:00 | 104.78 |
| 2012-07-19 16:00:00 | 104.52 |
| 2012-07-19 17:00:00 | 104.78 |
| 2012-07-19 18:00:00 | 104.78 |
| 2012-07-19 19:00:00 | 104.78 |
| 2012-07-19 20:00:00 | 104.78 |
| 2012-07-19 21:00:00 | 104.78 |
| 2012-07-19 22:00:00 | 105.04 |
| 2012-07-19 23:00:00 | 104.78 |
| 2012-07-20 | 104.78 |
| 2012-07-20 01:00:00 | 104.78 |
| 2012-07-20 02:00:00 | 105.04 |
| 2012-07-20 03:00:00 | 104.78 |
| 2012-07-20 04:00:00 | 104.78 |
| 2012-07-20 05:00:00 | 104.78 |
| 2012-07-20 06:00:00 | 104.78 |
| 2012-07-20 07:00:00 | 104.52 |
| 2012-07-20 08:00:00 | 104.52 |
| 2012-07-20 09:00:00 | 104.78 |
| 2012-07-20 10:00:00 | 104.52 |
| 2012-07-20 11:00:00 | 105.04 |
| 2012-07-20 12:00:00 | 104.78 |
| 2012-07-20 13:00:00 | 104.52 |
| 2012-07-20 14:00:00 | 104.78 |
| 2012-07-20 15:00:00 | 104.52 |
| 2012-07-20 16:00:00 | 104.52 |
| 2012-07-20 17:00:00 | 104.26 |
| 2012-07-20 18:00:00 | 104.26 |
| 2012-07-20 19:00:00 | 104.52 |
| 2012-07-20 20:00:00 | 104.26 |
| 2012-07-20 21:00:00 | 104.26 |
| 2012-07-20 22:00:00 | 104.26 |
| 2012-07-20 23:00:00 | 104.52 |
| 2012-07-21 | 104.26 |
| 2012-07-21 01:00:00 | 104.26 |
| 2012-07-21 02:00:00 | 104.26 |
| 2012-07-21 03:00:00 | 104.52 |
| 2012-07-21 04:00:00 | 104.26 |
| 2012-07-21 05:00:00 | 104.52 |
| 2012-07-21 06:00:00 | 104.52 |
| 2012-07-21 07:00:00 | 104.26 |
| 2012-07-21 08:00:00 | 104.26 |
| 2012-07-21 09:00:00 | 104.26 |
| 2012-07-21 10:00:00 | 104 |
| 2012-07-21 11:00:00 | 104.26 |
| 2012-07-21 12:00:00 | 104 |
| 2012-07-21 13:00:00 | 104.26 |
| 2012-07-21 14:00:00 | 104.26 |
| 2012-07-21 15:00:00 | 104.26 |
| 2012-07-21 16:00:00 | 104.26 |
| 2012-07-21 17:00:00 | 104.26 |
| 2012-07-21 18:00:00 | 104.26 |
| 2012-07-21 19:00:00 | 104.52 |
| 2012-07-21 20:00:00 | 104.52 |
| 2012-07-21 21:00:00 | 104.26 |
| 2012-07-21 22:00:00 | 104.26 |
| 2012-07-21 23:00:00 | 104.52 |
| 2012-07-22 | 104.52 |
| 2012-07-22 01:00:00 | 104.52 |
| 2012-07-22 02:00:00 | 104.52 |
| 2012-07-22 03:00:00 | 104.52 |
| 2012-07-22 04:00:00 | 104.52 |
| 2012-07-22 05:00:00 | 104.78 |
| 2012-07-22 06:00:00 | 104.78 |
| 2012-07-22 07:00:00 | 104.52 |
| 2012-07-22 08:00:00 | 104.26 |
| 2012-07-22 09:00:00 | 104.52 |
| 2012-07-22 10:00:00 | 104.26 |
| 2012-07-22 11:00:00 | 104.52 |
| 2012-07-22 12:00:00 | 104.26 |
| 2012-07-22 13:00:00 | 104.52 |
| 2012-07-22 14:00:00 | 104.26 |
| 2012-07-22 15:00:00 | 104.52 |
| 2012-07-22 16:00:00 | 104.26 |
| 2012-07-22 17:00:00 | 104.52 |
| 2012-07-22 18:00:00 | 104.26 |
| 2012-07-22 19:00:00 | 104.52 |
| 2012-07-22 20:00:00 | 104.52 |
| 2012-07-22 21:00:00 | 104.52 |
| 2012-07-22 22:00:00 | 104.26 |
| 2012-07-22 23:00:00 | 104.52 |
| 2012-07-23 | 104.78 |
| 2012-07-23 01:00:00 | 104.52 |
| 2012-07-23 02:00:00 | 104.52 |
| 2012-07-23 03:00:00 | 104.52 |
| 2012-07-23 04:00:00 | 104.78 |
| 2012-07-23 05:00:00 | 104.52 |
| 2012-07-23 06:00:00 | 104.52 |
| 2012-07-23 07:00:00 | 104.26 |
| 2012-07-23 08:00:00 | 104.26 |
| 2012-07-23 09:00:00 | 104 |
| 2012-07-23 10:00:00 | 104.26 |
| 2012-07-23 11:00:00 | 104.26 |
| 2012-07-23 12:00:00 | 104 |
| 2012-07-23 13:00:00 | 104.26 |
| 2012-07-23 14:00:00 | 104.26 |
| 2012-07-23 15:00:00 | 104.26 |
| 2012-07-23 16:00:00 | 104 |
| 2012-07-23 17:00:00 | 104.26 |
| 2012-07-23 18:00:00 | 104.26 |
| 2012-07-23 19:00:00 | 104.26 |
| 2012-07-23 20:00:00 | 104.52 |
| 2012-07-23 21:00:00 | 104.26 |
| 2012-07-23 22:00:00 | 104.26 |
| 2012-07-23 23:00:00 | 104.52 |
| 2012-07-24 | 104.52 |
| 2012-07-24 01:00:00 | 104.26 |
| 2012-07-24 02:00:00 | 104.52 |
| 2012-07-24 03:00:00 | 104.52 |
| 2012-07-24 04:00:00 | 104.26 |
| 2012-07-24 05:00:00 | 104.52 |
| 2012-07-24 06:00:00 | 104.52 |
| 2012-07-24 07:00:00 | 104 |
| 2012-07-24 08:00:00 | 104.26 |
| 2012-07-24 09:00:00 | 104 |
| 2012-07-24 10:00:00 | 104.26 |
| 2012-07-24 11:00:00 | 104.52 |
| 2012-07-24 12:00:00 | 104.26 |
| 2012-07-24 13:00:00 | 104.26 |
| 2012-07-24 14:00:00 | 104 |
| 2012-07-24 15:00:00 | 104.26 |
| 2012-07-24 16:00:00 | 104 |
| 2012-07-24 17:00:00 | 104 |
| 2012-07-24 18:00:00 | 104.26 |
| 2012-07-24 19:00:00 | 104.26 |
| 2012-07-24 20:00:00 | 104.26 |
| 2012-07-24 21:00:00 | 104.26 |
| 2012-07-24 22:00:00 | 104.26 |
| 2012-07-24 23:00:00 | 104.26 |
| 2012-07-25 | 104.26 |
| 2012-07-25 01:00:00 | 104.26 |
| 2012-07-25 02:00:00 | 104.52 |
| 2012-07-25 03:00:00 | 104.26 |
| 2012-07-25 04:00:00 | 104.52 |
| 2012-07-25 05:00:00 | 104.26 |
| 2012-07-25 06:00:00 | 104.26 |
| 2012-07-25 07:00:00 | 104.26 |
| 2012-07-25 08:00:00 | 104 |
| 2012-07-25 09:00:00 | 104 |
| 2012-07-25 10:00:00 | 104 |
| 2012-07-25 11:00:00 | 104.52 |
| 2012-07-25 12:00:00 | 104 |
| 2012-07-25 13:00:00 | 104 |
| 2012-07-25 14:00:00 | 104.26 |
| 2012-07-25 15:00:00 | 104 |
| 2012-07-25 16:00:00 | 104.26 |
| 2012-07-25 17:00:00 | 104 |
| 2012-07-25 18:00:00 | 104.26 |
| 2012-07-25 19:00:00 | 104.26 |
| 2012-07-25 20:00:00 | 104.26 |
| 2012-07-25 21:00:00 | 104.26 |
| 2012-07-25 22:00:00 | 104.26 |
| 2012-07-25 23:00:00 | 104.26 |
| 2012-07-26 | 104.26 |
| 2012-07-26 01:00:00 | 104.52 |
| 2012-07-26 02:00:00 | 104.26 |
| 2012-07-26 03:00:00 | 104.26 |
| 2012-07-26 04:00:00 | 104.52 |
| 2012-07-26 05:00:00 | 104.26 |
| 2012-07-26 06:00:00 | 104.52 |
| 2012-07-26 07:00:00 | 104.26 |
| 2012-07-26 08:00:00 | 104 |
| 2012-07-26 09:00:00 | 104 |
| 2012-07-26 10:00:00 | 104 |
| 2012-07-26 11:00:00 | 104.26 |
| 2012-07-26 12:00:00 | 104 |
| 2012-07-26 13:00:00 | 104 |
| 2012-07-26 14:00:00 | 104 |
| 2012-07-26 15:00:00 | 34.32 |
| 2012-07-26 16:00:00 | 0.78 |
| 2012-07-26 17:00:00 | 45.76 |
| 2012-07-26 18:00:00 | 104.78 |
| 2012-07-26 19:00:00 | 105.04 |
| 2012-07-26 20:00:00 | 104.78 |
| 2012-07-26 21:00:00 | 104.52 |
| 2012-07-26 22:00:00 | 104.52 |
| 2012-07-26 23:00:00 | 104.78 |
| 2012-07-27 | 104.78 |
| 2012-07-27 01:00:00 | 104.78 |
| 2012-07-27 02:00:00 | 104.78 |
| 2012-07-27 03:00:00 | 104.78 |
| 2012-07-27 04:00:00 | 104.78 |
| 2012-07-27 05:00:00 | 105.04 |
| 2012-07-27 06:00:00 | 104.78 |
| 2012-07-27 07:00:00 | 104.26 |
| 2012-07-27 08:00:00 | 104.52 |
| 2012-07-27 09:00:00 | 104.26 |
| 2012-07-27 10:00:00 | 104.52 |
| 2012-07-27 11:00:00 | 104.52 |
| 2012-07-27 12:00:00 | 104.52 |
| 2012-07-27 13:00:00 | 104.52 |
| 2012-07-27 14:00:00 | 104.52 |
| 2012-07-27 15:00:00 | 104.52 |
| 2012-07-27 16:00:00 | 104.52 |
| 2012-07-27 17:00:00 | 104.52 |
| 2012-07-27 18:00:00 | 104.52 |
| 2012-07-27 19:00:00 | 80.34 |
| 2012-07-27 20:00:00 | 66.82 |
| 2012-07-27 21:00:00 | 104.52 |
| 2012-07-27 22:00:00 | 104.52 |
| 2012-07-27 23:00:00 | 104.78 |
| 2012-07-28 | 104.52 |
| 2012-07-28 01:00:00 | 104.52 |
| 2012-07-28 02:00:00 | 104.52 |
| 2012-07-28 03:00:00 | 104.52 |
| 2012-07-28 04:00:00 | 104.78 |
| 2012-07-28 05:00:00 | 104.52 |
| 2012-07-28 06:00:00 | 104.52 |
| 2012-07-28 07:00:00 | 104.52 |
| 2012-07-28 08:00:00 | 104.26 |
| 2012-07-28 09:00:00 | 104.52 |
| 2012-07-28 10:00:00 | 104.26 |
| 2012-07-28 11:00:00 | 104.26 |
| 2012-07-28 12:00:00 | 104.52 |
| 2012-07-28 13:00:00 | 104.26 |
| 2012-07-28 14:00:00 | 104.26 |
| 2012-07-28 15:00:00 | 104.52 |
| 2012-07-28 16:00:00 | 104.26 |
| 2012-07-28 17:00:00 | 104.52 |
| 2012-07-28 18:00:00 | 104.52 |
| 2012-07-28 19:00:00 | 104.26 |
| 2012-07-28 20:00:00 | 104.78 |
| 2012-07-28 21:00:00 | 104.52 |
| 2012-07-28 22:00:00 | 104.52 |
| 2012-07-28 23:00:00 | 104.52 |
| 2012-07-29 | 104.52 |
| 2012-07-29 01:00:00 | 104.26 |
| 2012-07-29 02:00:00 | 104.78 |
| 2012-07-29 03:00:00 | 104.52 |
| 2012-07-29 04:00:00 | 104.52 |
| 2012-07-29 05:00:00 | 104.78 |
| 2012-07-29 06:00:00 | 104.78 |
| 2012-07-29 07:00:00 | 104.78 |
| 2012-07-29 08:00:00 | 104.52 |
| 2012-07-29 09:00:00 | 104.52 |
| 2012-07-29 10:00:00 | 104.52 |
| 2012-07-29 11:00:00 | 104.52 |
| 2012-07-29 12:00:00 | 104.52 |
| 2012-07-29 13:00:00 | 104.26 |
| 2012-07-29 14:00:00 | 104.52 |
| 2012-07-29 15:00:00 | 104.78 |
| 2012-07-29 16:00:00 | 104.52 |
| 2012-07-29 17:00:00 | 104.26 |
| 2012-07-29 18:00:00 | 104.52 |
| 2012-07-29 19:00:00 | 104.52 |
| 2012-07-29 20:00:00 | 104.52 |
| 2012-07-29 21:00:00 | 104.52 |
| 2012-07-29 22:00:00 | 104.52 |
| 2012-07-29 23:00:00 | 104.78 |
| 2012-07-30 | 104.52 |
| 2012-07-30 01:00:00 | 11.44 |
| 2012-07-30 02:00:00 | 0.52 |
| 2012-07-30 03:00:00 | 0.78 |
| 2012-07-30 04:00:00 | 0.52 |
| 2012-07-30 05:00:00 | 0.52 |
| 2012-07-30 06:00:00 | 0.78 |
| 2012-07-30 07:00:00 | 0.52 |
| 2012-07-30 08:00:00 | 0.52 |
| 2012-07-30 09:00:00 | 0.52 |
| 2012-07-30 10:00:00 | 0.78 |
| 2012-07-30 11:00:00 | 0.52 |
| 2012-07-30 12:00:00 | 0.52 |
| 2012-07-30 13:00:00 | 0.78 |
| 2012-07-30 14:00:00 | 0.52 |
| 2012-07-30 15:00:00 | 0.52 |
| 2012-07-30 16:00:00 | 0.78 |
| 2012-07-30 17:00:00 | 0.52 |
| 2012-07-30 18:00:00 | 0.52 |
| 2012-07-30 19:00:00 | 0.78 |
| 2012-07-30 20:00:00 | 0.52 |
| 2012-07-30 21:00:00 | 0.52 |
| 2012-07-30 22:00:00 | 0.78 |
| 2012-07-30 23:00:00 | 0.52 |
| 2012-07-31 | 0.52 |
| 2012-07-31 01:00:00 | 0.52 |
| 2012-07-31 02:00:00 | 0.78 |
| 2012-07-31 03:00:00 | 0.52 |
| 2012-07-31 04:00:00 | 0.52 |
| 2012-07-31 05:00:00 | 0.78 |
| 2012-07-31 06:00:00 | 0.52 |
| 2012-07-31 07:00:00 | 0.52 |
| 2012-07-31 08:00:00 | 0.78 |
| 2012-07-31 09:00:00 | 0.52 |
| 2012-07-31 10:00:00 | 0.52 |
| 2012-07-31 11:00:00 | 0.78 |
| 2012-07-31 12:00:00 | 0.52 |
| 2012-07-31 13:00:00 | 0.52 |
| 2012-07-31 14:00:00 | 0.52 |
| 2012-07-31 15:00:00 | 0.78 |
| 2012-07-31 16:00:00 | 0.52 |
| 2012-07-31 17:00:00 | 0.52 |
| 2012-07-31 18:00:00 | 0.52 |
| 2012-07-31 19:00:00 | 0.78 |
| 2012-07-31 20:00:00 | 0.52 |
| 2012-07-31 21:00:00 | 0.52 |
| 2012-07-31 22:00:00 | 0.78 |
| 2012-07-31 23:00:00 | 0.52 |
| 2012-08-01 | 0.52 |
| 2012-08-01 01:00:00 | 0.78 |
| 2012-08-01 02:00:00 | 0.52 |
| 2012-08-01 03:00:00 | 0.52 |
| 2012-08-01 04:00:00 | 0.78 |
| 2012-08-01 05:00:00 | 0.52 |
| 2012-08-01 06:00:00 | 0.52 |
| 2012-08-01 07:00:00 | 0.78 |
| 2012-08-01 08:00:00 | 0.52 |
| 2012-08-01 09:00:00 | 0.52 |
| 2012-08-01 10:00:00 | 0.78 |
| 2012-08-01 11:00:00 | 0.52 |
| 2012-08-01 12:00:00 | 0.52 |
| 2012-08-01 13:00:00 | 0.78 |
| 2012-08-01 14:00:00 | 0.52 |
| 2012-08-01 15:00:00 | 0.52 |
| 2012-08-01 16:00:00 | 0.52 |
| 2012-08-01 17:00:00 | 0.78 |
| 2012-08-01 18:00:00 | 0.52 |
| 2012-08-01 19:00:00 | 0.52 |
| 2012-08-01 20:00:00 | 0.78 |
| 2012-08-01 21:00:00 | 0.52 |
| 2012-08-01 22:00:00 | 0.52 |
| 2012-08-01 23:00:00 | 0.78 |
| 2012-08-02 | 0.52 |
| 2012-08-02 01:00:00 | 0.52 |
| 2012-08-02 02:00:00 | 0.78 |
| 2012-08-02 03:00:00 | 0.52 |
| 2012-08-02 04:00:00 | 0.52 |
| 2012-08-02 05:00:00 | 0.78 |
| 2012-08-02 06:00:00 | 0.52 |
| 2012-08-02 07:00:00 | 0.52 |
| 2012-08-02 08:00:00 | 0.78 |
| 2012-08-02 09:00:00 | 0.52 |
| 2012-08-02 10:00:00 | 0.52 |
| 2012-08-02 11:00:00 | 0.52 |
| 2012-08-02 12:00:00 | 0.78 |
| 2012-08-02 13:00:00 | 0.52 |
| 2012-08-02 14:00:00 | 0.52 |
| 2012-08-02 15:00:00 | 0.78 |
| 2012-08-02 16:00:00 | 0.52 |
| 2012-08-02 17:00:00 | 0.52 |
| 2012-08-02 18:00:00 | 0.52 |
| 2012-08-02 19:00:00 | 0.78 |
| 2012-08-02 20:00:00 | 0.52 |
| 2012-08-02 21:00:00 | 0.52 |
| 2012-08-02 22:00:00 | 0.78 |
| 2012-08-02 23:00:00 | 0.52 |
| 2012-08-03 | 0.52 |
| 2012-08-03 01:00:00 | 0.52 |
| 2012-08-03 02:00:00 | 0.78 |
| 2012-08-03 03:00:00 | 0.52 |
| 2012-08-03 04:00:00 | 0.52 |
| 2012-08-03 05:00:00 | 0.78 |
| 2012-08-03 06:00:00 | 0.52 |
| 2012-08-03 07:00:00 | 0.52 |
| 2012-08-03 08:00:00 | 0.78 |
| 2012-08-03 09:00:00 | 0.52 |
| 2012-08-03 10:00:00 | 0.52 |
| 2012-08-03 11:00:00 | 0.52 |
| 2012-08-03 12:00:00 | 0.78 |
| 2012-08-03 13:00:00 | 40.04 |
| 2012-08-03 14:00:00 | 1.04 |
| 2012-08-03 15:00:00 | 16.38 |
| 2012-08-03 16:00:00 | 27.56 |
| 2012-08-03 17:00:00 | 0.78 |
| 2012-08-03 18:00:00 | 11.96 |
| 2012-08-03 19:00:00 | 17.42 |
| 2012-08-03 20:00:00 | 3.12 |
| 2012-08-03 21:00:00 | 26 |
| 2012-08-03 22:00:00 | 26.26 |
| 2012-08-03 23:00:00 | 0.52 |
| 2012-08-04 | 7.8 |
| 2012-08-04 01:00:00 | 12.22 |
| 2012-08-04 02:00:00 | 0.52 |
| 2012-08-04 03:00:00 | 10.92 |
| 2012-08-04 04:00:00 | 9.1 |
| 2012-08-04 05:00:00 | 2.86 |
| 2012-08-04 06:00:00 | 15.86 |
| 2012-08-04 07:00:00 | 15.86 |
| 2012-08-04 08:00:00 | 22.1 |
| 2012-08-04 09:00:00 | 4.16 |
| 2012-08-04 10:00:00 | 0.78 |
| 2012-08-04 11:00:00 | 0.52 |
| 2012-08-04 12:00:00 | 0.52 |
| 2012-08-04 13:00:00 | 0.78 |
| 2012-08-04 14:00:00 | 47.58 |
| 2012-08-04 15:00:00 | 80.34 |
| 2012-08-04 16:00:00 | 80.08 |
| 2012-08-04 17:00:00 | 51.48 |
| 2012-08-04 18:00:00 | 44.46 |
| 2012-08-04 19:00:00 | 44.46 |
| 2012-08-04 20:00:00 | 44.2 |
| 2012-08-04 21:00:00 | 70.72 |
| 2012-08-04 22:00:00 | 91.78 |
| 2012-08-04 23:00:00 | 92.04 |
| 2012-08-05 | 92.04 |
| 2012-08-05 01:00:00 | 92.3 |
| 2012-08-05 02:00:00 | 92.3 |
| 2012-08-05 03:00:00 | 92.56 |
| 2012-08-05 04:00:00 | 92.3 |
| 2012-08-05 05:00:00 | 92.56 |
| 2012-08-05 06:00:00 | 92.3 |
| 2012-08-05 07:00:00 | 92.3 |
| 2012-08-05 08:00:00 | 92.04 |
| 2012-08-05 09:00:00 | 102.96 |
| 2012-08-05 10:00:00 | 105.04 |
| 2012-08-05 11:00:00 | 105.04 |
| 2012-08-05 12:00:00 | 105.04 |
| 2012-08-05 13:00:00 | 105.04 |
| 2012-08-05 14:00:00 | 105.04 |
| 2012-08-05 15:00:00 | 96.98 |
| 2012-08-05 16:00:00 | 85.8 |
| 2012-08-05 17:00:00 | 88.66 |
| 2012-08-05 18:00:00 | 88.66 |
| 2012-08-05 19:00:00 | 88.66 |
| 2012-08-05 20:00:00 | 88.66 |
| 2012-08-05 21:00:00 | 88.66 |
| 2012-08-05 22:00:00 | 88.66 |
| 2012-08-05 23:00:00 | 88.92 |
| 2012-08-06 | 88.66 |
| 2012-08-06 01:00:00 | 88.66 |
| 2012-08-06 02:00:00 | 88.66 |
| 2012-08-06 03:00:00 | 88.92 |
| 2012-08-06 04:00:00 | 88.66 |
| 2012-08-06 05:00:00 | 88.66 |
| 2012-08-06 06:00:00 | 88.66 |
| 2012-08-06 07:00:00 | 88.4 |
| 2012-08-06 08:00:00 | 88.4 |
| 2012-08-06 09:00:00 | 88.14 |
| 2012-08-06 10:00:00 | 88.14 |
| 2012-08-06 11:00:00 | 89.18 |
| 2012-08-06 12:00:00 | 88.66 |
| 2012-08-06 13:00:00 | 88.14 |
| 2012-08-06 14:00:00 | 88.14 |
| 2012-08-06 15:00:00 | 88.4 |
| 2012-08-06 16:00:00 | 88.4 |
| 2012-08-06 17:00:00 | 88.14 |
| 2012-08-06 18:00:00 | 88.4 |
| 2012-08-06 19:00:00 | 88.4 |
| 2012-08-06 20:00:00 | 88.4 |
| 2012-08-06 21:00:00 | 88.4 |
| 2012-08-06 22:00:00 | 88.66 |
| 2012-08-06 23:00:00 | 88.66 |
| 2012-08-07 | 76.7 |
| 2012-08-07 01:00:00 | 88.66 |
| 2012-08-07 02:00:00 | 88.66 |
| 2012-08-07 03:00:00 | 88.92 |
| 2012-08-07 04:00:00 | 88.66 |
| 2012-08-07 05:00:00 | 88.92 |
| 2012-08-07 06:00:00 | 88.66 |
| 2012-08-07 07:00:00 | 88.66 |
| 2012-08-07 08:00:00 | 59.54 |
| 2012-08-07 09:00:00 | 0.78 |
| 2012-08-07 10:00:00 | 0.52 |
| 2012-08-07 11:00:00 | 30.68 |
| 2012-08-07 12:00:00 | 88.14 |
| 2012-08-07 13:00:00 | 87.88 |
| 2012-08-07 14:00:00 | 88.14 |
| 2012-08-07 15:00:00 | 87.88 |
| 2012-08-07 16:00:00 | 88.14 |
| 2012-08-07 17:00:00 | 88.14 |
| 2012-08-07 18:00:00 | 88.4 |
| 2012-08-07 19:00:00 | 88.4 |
| 2012-08-07 20:00:00 | 88.14 |
| 2012-08-07 21:00:00 | 88.4 |
| 2012-08-07 22:00:00 | 88.4 |
| 2012-08-07 23:00:00 | 88.4 |
| 2012-08-08 | 88.4 |
| 2012-08-08 01:00:00 | 88.4 |
| 2012-08-08 02:00:00 | 88.4 |
| 2012-08-08 03:00:00 | 88.4 |
| 2012-08-08 04:00:00 | 88.66 |
| 2012-08-08 05:00:00 | 88.4 |
| 2012-08-08 06:00:00 | 88.4 |
| 2012-08-08 07:00:00 | 88.4 |
| 2012-08-08 08:00:00 | 88.14 |
| 2012-08-08 09:00:00 | 88.4 |
| 2012-08-08 10:00:00 | 88.14 |
| 2012-08-08 11:00:00 | 88.14 |
| 2012-08-08 12:00:00 | 88.14 |
| 2012-08-08 13:00:00 | 88.14 |
| 2012-08-08 14:00:00 | 88.66 |
| 2012-08-08 15:00:00 | 88.66 |
| 2012-08-08 16:00:00 | 88.92 |
| 2012-08-08 17:00:00 | 88.66 |
| 2012-08-08 18:00:00 | 88.92 |
| 2012-08-08 19:00:00 | 88.92 |
| 2012-08-08 20:00:00 | 89.18 |
| 2012-08-08 21:00:00 | 88.92 |
| 2012-08-08 22:00:00 | 88.92 |
| 2012-08-08 23:00:00 | 88.92 |
| 2012-08-09 | 89.18 |
| 2012-08-09 01:00:00 | 88.92 |
| 2012-08-09 02:00:00 | 88.92 |
| 2012-08-09 03:00:00 | 88.92 |
| 2012-08-09 04:00:00 | 89.18 |
| 2012-08-09 05:00:00 | 88.92 |
| 2012-08-09 06:00:00 | 88.92 |
| 2012-08-09 07:00:00 | 88.92 |
| 2012-08-09 08:00:00 | 88.66 |
| 2012-08-09 09:00:00 | 88.66 |
| 2012-08-09 10:00:00 | 88.66 |
| 2012-08-09 11:00:00 | 88.92 |
| 2012-08-09 12:00:00 | 88.4 |
| 2012-08-09 13:00:00 | 88.66 |
| 2012-08-09 14:00:00 | 88.66 |
| 2012-08-09 15:00:00 | 88.66 |
| 2012-08-09 16:00:00 | 88.66 |
| 2012-08-09 17:00:00 | 88.92 |
| 2012-08-09 18:00:00 | 88.66 |
| 2012-08-09 19:00:00 | 88.92 |
| 2012-08-09 20:00:00 | 88.92 |
| 2012-08-09 21:00:00 | 88.92 |
| 2012-08-09 22:00:00 | 88.92 |
| 2012-08-09 23:00:00 | 88.92 |
| 2012-08-10 | 88.92 |
| 2012-08-10 01:00:00 | 89.18 |
| 2012-08-10 02:00:00 | 88.66 |
| 2012-08-10 03:00:00 | 89.18 |
| 2012-08-10 04:00:00 | 88.92 |
| 2012-08-10 05:00:00 | 88.92 |
| 2012-08-10 06:00:00 | 88.92 |
| 2012-08-10 07:00:00 | 88.66 |
| 2012-08-10 08:00:00 | 88.66 |
| 2012-08-10 09:00:00 | 88.66 |
| 2012-08-10 10:00:00 | 88.66 |
| 2012-08-10 11:00:00 | 88.4 |
| 2012-08-10 12:00:00 | 88.66 |
| 2012-08-10 13:00:00 | 88.66 |
| 2012-08-10 14:00:00 | 88.66 |
| 2012-08-10 15:00:00 | 88.66 |
| 2012-08-10 16:00:00 | 88.66 |
| 2012-08-10 17:00:00 | 88.66 |
| 2012-08-10 18:00:00 | 88.66 |
| 2012-08-10 19:00:00 | 88.92 |
| 2012-08-10 20:00:00 | 88.66 |
| 2012-08-10 21:00:00 | 88.92 |
| 2012-08-10 22:00:00 | 88.92 |
| 2012-08-10 23:00:00 | 88.92 |
| 2012-08-11 | 88.92 |
| 2012-08-11 01:00:00 | 88.92 |
| 2012-08-11 02:00:00 | 88.92 |
| 2012-08-11 03:00:00 | 88.92 |
| 2012-08-11 04:00:00 | 88.92 |
| 2012-08-11 05:00:00 | 88.92 |
| 2012-08-11 06:00:00 | 88.92 |
| 2012-08-11 07:00:00 | 88.92 |
| 2012-08-11 08:00:00 | 88.92 |
| 2012-08-11 09:00:00 | 88.92 |
| 2012-08-11 10:00:00 | 88.66 |
| 2012-08-11 11:00:00 | 88.66 |
| 2012-08-11 12:00:00 | 88.92 |
| 2012-08-11 13:00:00 | 88.66 |
| 2012-08-11 14:00:00 | 88.92 |
| 2012-08-11 15:00:00 | 88.92 |
| 2012-08-11 16:00:00 | 88.66 |
| 2012-08-11 17:00:00 | 88.92 |
| 2012-08-11 18:00:00 | 88.92 |
| 2012-08-11 19:00:00 | 88.92 |
| 2012-08-11 20:00:00 | 88.92 |
| 2012-08-11 21:00:00 | 88.92 |
| 2012-08-11 22:00:00 | 89.18 |
| 2012-08-11 23:00:00 | 88.92 |
| 2012-08-12 | 89.18 |
| 2012-08-12 01:00:00 | 88.92 |
| 2012-08-12 02:00:00 | 88.92 |
| 2012-08-12 03:00:00 | 89.18 |
| 2012-08-12 04:00:00 | 88.92 |
| 2012-08-12 05:00:00 | 88.92 |
| 2012-08-12 06:00:00 | 89.18 |
| 2012-08-12 07:00:00 | 88.92 |
| 2012-08-12 08:00:00 | 88.92 |
| 2012-08-12 09:00:00 | 88.92 |
| 2012-08-12 10:00:00 | 88.66 |
| 2012-08-12 11:00:00 | 88.92 |
| 2012-08-12 12:00:00 | 88.92 |
| 2012-08-12 13:00:00 | 88.92 |
| 2012-08-12 14:00:00 | 88.92 |
| 2012-08-12 15:00:00 | 88.92 |
| 2012-08-12 16:00:00 | 88.92 |
| 2012-08-12 17:00:00 | 88.92 |
| 2012-08-12 18:00:00 | 88.92 |
| 2012-08-12 19:00:00 | 88.92 |
| 2012-08-12 20:00:00 | 88.92 |
| 2012-08-12 21:00:00 | 88.92 |
| 2012-08-12 22:00:00 | 88.92 |
| 2012-08-12 23:00:00 | 88.66 |
| 2012-08-13 | 89.18 |
| 2012-08-13 01:00:00 | 12.48 |
| 2012-08-13 02:00:00 | 0.52 |
| 2012-08-13 03:00:00 | 0.78 |
| 2012-08-13 04:00:00 | 0.52 |
| 2012-08-13 05:00:00 | 0.52 |
| 2012-08-13 06:00:00 | 0.78 |
| 2012-08-13 07:00:00 | 0.52 |
| 2012-08-13 08:00:00 | 0.78 |
| 2012-08-13 09:00:00 | 0.52 |
| 2012-08-13 10:00:00 | 0.52 |
| 2012-08-13 11:00:00 | 0.78 |
| 2012-08-13 12:00:00 | 0.52 |
| 2012-08-13 13:00:00 | 0.78 |
| 2012-08-13 14:00:00 | 0.52 |
| 2012-08-13 15:00:00 | 0.52 |
| 2012-08-13 16:00:00 | 0.78 |
| 2012-08-13 17:00:00 | 0.52 |
| 2012-08-13 18:00:00 | 0.78 |
| 2012-08-13 19:00:00 | 0.52 |
| 2012-08-13 20:00:00 | 0.52 |
| 2012-08-13 21:00:00 | 0.78 |
| 2012-08-13 22:00:00 | 0.52 |
| 2012-08-13 23:00:00 | 0.78 |
| 2012-08-14 | 0.52 |
| 2012-08-14 01:00:00 | 0.52 |
| 2012-08-14 02:00:00 | 0.78 |
| 2012-08-14 03:00:00 | 0.52 |
| 2012-08-14 04:00:00 | 0.78 |
| 2012-08-14 05:00:00 | 0.52 |
| 2012-08-14 06:00:00 | 0.78 |
| 2012-08-14 07:00:00 | 0.52 |
| 2012-08-14 08:00:00 | 0.78 |
| 2012-08-14 09:00:00 | 0.52 |
| 2012-08-14 10:00:00 | 0.78 |
| 2012-08-14 11:00:00 | 0.52 |
| 2012-08-14 12:00:00 | 0.52 |
| 2012-08-14 13:00:00 | 0.78 |
| 2012-08-14 14:00:00 | 0.52 |
| 2012-08-14 15:00:00 | 0.78 |
| 2012-08-14 16:00:00 | 0.52 |
| 2012-08-14 17:00:00 | 0.78 |
| 2012-08-14 18:00:00 | 0.52 |
| 2012-08-14 19:00:00 | 0.52 |
| 2012-08-14 20:00:00 | 0.78 |
| 2012-08-14 21:00:00 | 0.52 |
| 2012-08-14 22:00:00 | 0.52 |
| 2012-08-14 23:00:00 | 0.78 |
| 2012-08-15 | 0.52 |
| 2012-08-15 01:00:00 | 0.52 |
| 2012-08-15 02:00:00 | 0.78 |
| 2012-08-15 03:00:00 | 0.52 |
| 2012-08-15 04:00:00 | 0.52 |
| 2012-08-15 05:00:00 | 0.78 |
| 2012-08-15 06:00:00 | 0.52 |
| 2012-08-15 07:00:00 | 0.52 |
| 2012-08-15 08:00:00 | 0.78 |
| 2012-08-15 09:00:00 | 0.52 |
| 2012-08-15 10:00:00 | 0.52 |
| 2012-08-15 11:00:00 | 0.52 |
| 2012-08-15 12:00:00 | 0.78 |
| 2012-08-15 13:00:00 | 0.52 |
| 2012-08-15 14:00:00 | 0.52 |
| 2012-08-15 15:00:00 | 0.52 |
| 2012-08-15 16:00:00 | 0.26 |
| 2012-08-15 17:00:00 | 0.78 |
| 2012-08-15 18:00:00 | 0.52 |
| 2012-08-15 19:00:00 | 0.52 |
| 2012-08-15 20:00:00 | 0.52 |
| 2012-08-15 21:00:00 | 0.78 |
| 2012-08-15 22:00:00 | 0.52 |
| 2012-08-15 23:00:00 | 0.52 |
| 2012-08-16 | 0.78 |
| 2012-08-16 01:00:00 | 0.52 |
| 2012-08-16 02:00:00 | 0.52 |
| 2012-08-16 03:00:00 | 0.52 |
| 2012-08-16 04:00:00 | 0.78 |
| 2012-08-16 05:00:00 | 0.52 |
| 2012-08-16 06:00:00 | 0.52 |
| 2012-08-16 07:00:00 | 0.78 |
| 2012-08-16 08:00:00 | 0.52 |
| 2012-08-16 09:00:00 | 0.52 |
| 2012-08-16 10:00:00 | 0.52 |
| 2012-08-16 11:00:00 | 9.36 |
| 2012-08-16 12:00:00 | 31.2 |
| 2012-08-16 13:00:00 | 0.52 |
| 2012-08-16 14:00:00 | 0.78 |
| 2012-08-16 15:00:00 | 0.52 |
| 2012-08-16 16:00:00 | 0.52 |
| 2012-08-16 17:00:00 | 4.16 |
| 2012-08-16 18:00:00 | 48.62 |
| 2012-08-16 19:00:00 | 49.66 |
| 2012-08-16 20:00:00 | 61.88 |
| 2012-08-16 21:00:00 | 50.96 |
| 2012-08-16 22:00:00 | 65.52 |
| 2012-08-16 23:00:00 | 65.52 |
| 2012-08-17 | 65.52 |
| 2012-08-17 01:00:00 | 65.52 |
| 2012-08-17 02:00:00 | 65.78 |
| 2012-08-17 03:00:00 | 65.52 |
| 2012-08-17 04:00:00 | 65.52 |
| 2012-08-17 05:00:00 | 65.78 |
| 2012-08-17 06:00:00 | 65.52 |
| 2012-08-17 07:00:00 | 69.42 |
| 2012-08-17 08:00:00 | 96.98 |
| 2012-08-17 09:00:00 | 96.98 |
| 2012-08-17 10:00:00 | 96.72 |
| 2012-08-17 11:00:00 | 96.72 |
| 2012-08-17 12:00:00 | 96.98 |
| 2012-08-17 13:00:00 | 96.72 |
| 2012-08-17 14:00:00 | 96.98 |
| 2012-08-17 15:00:00 | 96.98 |
| 2012-08-17 16:00:00 | 96.98 |
| 2012-08-17 17:00:00 | 96.98 |
| 2012-08-17 18:00:00 | 96.98 |
| 2012-08-17 19:00:00 | 97.24 |
| 2012-08-17 20:00:00 | 96.98 |
| 2012-08-17 21:00:00 | 97.24 |
| 2012-08-17 22:00:00 | 96.98 |
| 2012-08-17 23:00:00 | 97.24 |
| 2012-08-18 | 97.24 |
| 2012-08-18 01:00:00 | 97.24 |
| 2012-08-18 02:00:00 | 97.5 |
| 2012-08-18 03:00:00 | 97.24 |
| 2012-08-18 04:00:00 | 97.24 |
| 2012-08-18 05:00:00 | 97.24 |
| 2012-08-18 06:00:00 | 78.52 |
| 2012-08-18 07:00:00 | 75.4 |
| 2012-08-18 08:00:00 | 90.74 |
| 2012-08-18 09:00:00 | 96.98 |
| 2012-08-18 10:00:00 | 96.98 |
| 2012-08-18 11:00:00 | 96.98 |
| 2012-08-18 12:00:00 | 96.72 |
| 2012-08-18 13:00:00 | 96.98 |
| 2012-08-18 14:00:00 | 96.98 |
| 2012-08-18 15:00:00 | 96.98 |
| 2012-08-18 16:00:00 | 96.98 |
| 2012-08-18 17:00:00 | 96.98 |
| 2012-08-18 18:00:00 | 96.98 |
| 2012-08-18 19:00:00 | 96.98 |
| 2012-08-18 20:00:00 | 96.98 |
| 2012-08-18 21:00:00 | 96.72 |
| 2012-08-18 22:00:00 | 97.24 |
| 2012-08-18 23:00:00 | 96.98 |
| 2012-08-19 | 96.98 |
| 2012-08-19 01:00:00 | 96.98 |
| 2012-08-19 02:00:00 | 97.24 |
| 2012-08-19 03:00:00 | 96.98 |
| 2012-08-19 04:00:00 | 97.24 |
| 2012-08-19 05:00:00 | 97.24 |
| 2012-08-19 06:00:00 | 97.24 |
| 2012-08-19 07:00:00 | 96.98 |
| 2012-08-19 08:00:00 | 96.98 |
| 2012-08-19 09:00:00 | 96.98 |
| 2012-08-19 10:00:00 | 96.98 |
| 2012-08-19 11:00:00 | 96.98 |
| 2012-08-19 12:00:00 | 96.98 |
| 2012-08-19 13:00:00 | 96.98 |
| 2012-08-19 14:00:00 | 96.98 |
| 2012-08-19 15:00:00 | 96.98 |
| 2012-08-19 16:00:00 | 96.98 |
| 2012-08-19 17:00:00 | 96.98 |
| 2012-08-19 18:00:00 | 96.98 |
| 2012-08-19 19:00:00 | 97.24 |
| 2012-08-19 20:00:00 | 97.5 |
| 2012-08-19 21:00:00 | 97.24 |
| 2012-08-19 22:00:00 | 97.5 |
| 2012-08-19 23:00:00 | 97.5 |
| 2012-08-20 | 97.24 |
| 2012-08-20 01:00:00 | 97.5 |
| 2012-08-20 02:00:00 | 97.5 |
| 2012-08-20 03:00:00 | 97.24 |
| 2012-08-20 04:00:00 | 97.5 |
| 2012-08-20 05:00:00 | 97.24 |
| 2012-08-20 06:00:00 | 97.5 |
| 2012-08-20 07:00:00 | 97.24 |
| 2012-08-20 08:00:00 | 97.24 |
| 2012-08-20 09:00:00 | 97.24 |
| 2012-08-20 10:00:00 | 96.98 |
| 2012-08-20 11:00:00 | 97.24 |
| 2012-08-20 12:00:00 | 96.98 |
| 2012-08-20 13:00:00 | 97.24 |
| 2012-08-20 14:00:00 | 96.98 |
| 2012-08-20 15:00:00 | 97.24 |
| 2012-08-20 16:00:00 | 97.24 |
| 2012-08-20 17:00:00 | 96.98 |
| 2012-08-20 18:00:00 | 97.24 |
| 2012-08-20 19:00:00 | 97.24 |
| 2012-08-20 20:00:00 | 97.5 |
| 2012-08-20 21:00:00 | 96.98 |
| 2012-08-20 22:00:00 | 97.24 |
| 2012-08-20 23:00:00 | 97.5 |
| 2012-08-21 | 97.24 |
| 2012-08-21 01:00:00 | 97.5 |
| 2012-08-21 02:00:00 | 97.24 |
| 2012-08-21 03:00:00 | 97.24 |
| 2012-08-21 04:00:00 | 97.24 |
| 2012-08-21 05:00:00 | 97.24 |
| 2012-08-21 06:00:00 | 97.24 |
| 2012-08-21 07:00:00 | 97.24 |
| 2012-08-21 08:00:00 | 96.98 |
| 2012-08-21 09:00:00 | 96.98 |
| 2012-08-21 10:00:00 | 96.98 |
| 2012-08-21 11:00:00 | 96.98 |
| 2012-08-21 12:00:00 | 96.98 |
| 2012-08-21 13:00:00 | 96.98 |
| 2012-08-21 14:00:00 | 96.98 |
| 2012-08-21 15:00:00 | 97.24 |
| 2012-08-21 16:00:00 | 96.98 |
| 2012-08-21 17:00:00 | 97.24 |
| 2012-08-21 18:00:00 | 97.24 |
| 2012-08-21 19:00:00 | 97.24 |
| 2012-08-21 20:00:00 | 96.98 |
| 2012-08-21 21:00:00 | 97.24 |
| 2012-08-21 22:00:00 | 97.24 |
| 2012-08-21 23:00:00 | 97.24 |
| 2012-08-22 | 97.5 |
| 2012-08-22 01:00:00 | 97.24 |
| 2012-08-22 02:00:00 | 97.5 |
| 2012-08-22 03:00:00 | 97.24 |
| 2012-08-22 04:00:00 | 97.5 |
| 2012-08-22 05:00:00 | 97.24 |
| 2012-08-22 06:00:00 | 97.24 |
| 2012-08-22 07:00:00 | 97.24 |
| 2012-08-22 08:00:00 | 97.24 |
| 2012-08-22 09:00:00 | 96.98 |
| 2012-08-22 10:00:00 | 96.98 |
| 2012-08-22 11:00:00 | 97.24 |
| 2012-08-22 12:00:00 | 67.86 |
| 2012-08-22 13:00:00 | 92.3 |
| 2012-08-22 14:00:00 | 97.24 |
| 2012-08-22 15:00:00 | 97.24 |
| 2012-08-22 16:00:00 | 97.24 |
| 2012-08-22 17:00:00 | 97.5 |
| 2012-08-22 18:00:00 | 97.24 |
| 2012-08-22 19:00:00 | 97.5 |
| 2012-08-22 20:00:00 | 97.24 |
| 2012-08-22 21:00:00 | 97.24 |
| 2012-08-22 22:00:00 | 97.24 |
| 2012-08-22 23:00:00 | 97.5 |
| 2012-08-23 | 97.24 |
| 2012-08-23 01:00:00 | 97.5 |
| 2012-08-23 02:00:00 | 97.24 |
| 2012-08-23 03:00:00 | 97.5 |
| 2012-08-23 04:00:00 | 97.5 |
| 2012-08-23 05:00:00 | 97.24 |
| 2012-08-23 06:00:00 | 97.5 |
| 2012-08-23 07:00:00 | 97.24 |
| 2012-08-23 08:00:00 | 67.08 |
| 2012-08-23 09:00:00 | 65.52 |
| 2012-08-23 10:00:00 | 65.78 |
| 2012-08-23 11:00:00 | 66.04 |
| 2012-08-23 12:00:00 | 66.04 |
| 2012-08-23 13:00:00 | 65.78 |
| 2012-08-23 14:00:00 | 66.04 |
| 2012-08-23 15:00:00 | 45.5 |
| 2012-08-23 16:00:00 | 39 |
| 2012-08-23 17:00:00 | 39 |
| 2012-08-23 18:00:00 | 39.26 |
| 2012-08-23 19:00:00 | 39 |
| 2012-08-23 20:00:00 | 39.26 |
| 2012-08-23 21:00:00 | 39 |
| 2012-08-23 22:00:00 | 39 |
| 2012-08-23 23:00:00 | 39.26 |
| 2012-08-24 | 39 |
| 2012-08-24 01:00:00 | 39.26 |
| 2012-08-24 02:00:00 | 39 |
| 2012-08-24 03:00:00 | 39 |
| 2012-08-24 04:00:00 | 39.26 |
| 2012-08-24 05:00:00 | 39 |
| 2012-08-24 06:00:00 | 39 |
| 2012-08-24 07:00:00 | 39 |
| 2012-08-24 08:00:00 | 39 |
| 2012-08-24 09:00:00 | 39 |
| 2012-08-24 10:00:00 | 54.34 |
| 2012-08-24 11:00:00 | 96.98 |
| 2012-08-24 12:00:00 | 96.98 |
| 2012-08-24 13:00:00 | 96.98 |
| 2012-08-24 14:00:00 | 96.98 |
| 2012-08-24 15:00:00 | 96.98 |
| 2012-08-24 16:00:00 | 96.98 |
| 2012-08-24 17:00:00 | 96.98 |
| 2012-08-24 18:00:00 | 97.24 |
| 2012-08-24 19:00:00 | 96.98 |
| 2012-08-24 20:00:00 | 96.98 |
| 2012-08-24 21:00:00 | 96.98 |
| 2012-08-24 22:00:00 | 97.24 |
| 2012-08-24 23:00:00 | 97.24 |
| 2012-08-25 | 97.24 |
| 2012-08-25 01:00:00 | 97.24 |
| 2012-08-25 02:00:00 | 97.24 |
| 2012-08-25 03:00:00 | 97.24 |
| 2012-08-25 04:00:00 | 96.98 |
| 2012-08-25 05:00:00 | 97.24 |
| 2012-08-25 06:00:00 | 97.5 |
| 2012-08-25 07:00:00 | 96.98 |
| 2012-08-25 08:00:00 | 97.24 |
| 2012-08-25 09:00:00 | 96.98 |
| 2012-08-25 10:00:00 | 97.24 |
| 2012-08-25 11:00:00 | 96.98 |
| 2012-08-25 12:00:00 | 96.98 |
| 2012-08-25 13:00:00 | 97.24 |
| 2012-08-25 14:00:00 | 96.98 |
| 2012-08-25 15:00:00 | 97.24 |
| 2012-08-25 16:00:00 | 96.98 |
| 2012-08-25 17:00:00 | 96.98 |
| 2012-08-25 18:00:00 | 97.24 |
| 2012-08-25 19:00:00 | 97.24 |
| 2012-08-25 20:00:00 | 96.98 |
| 2012-08-25 21:00:00 | 97.24 |
| 2012-08-25 22:00:00 | 97.24 |
| 2012-08-25 23:00:00 | 97.24 |
| 2012-08-26 | 96.98 |
| 2012-08-26 01:00:00 | 97.24 |
| 2012-08-26 02:00:00 | 97.24 |
| 2012-08-26 03:00:00 | 97.5 |
| 2012-08-26 04:00:00 | 97.24 |
| 2012-08-26 05:00:00 | 97.24 |
| 2012-08-26 06:00:00 | 97.5 |
| 2012-08-26 07:00:00 | 97.5 |
| 2012-08-26 08:00:00 | 97.24 |
| 2012-08-26 09:00:00 | 97.24 |
| 2012-08-26 10:00:00 | 96.98 |
| 2012-08-26 11:00:00 | 97.24 |
| 2012-08-26 12:00:00 | 96.98 |
| 2012-08-26 13:00:00 | 97.24 |
| 2012-08-26 14:00:00 | 97.24 |
| 2012-08-26 15:00:00 | 97.24 |
| 2012-08-26 16:00:00 | 96.98 |
| 2012-08-26 17:00:00 | 97.24 |
| 2012-08-26 18:00:00 | 97.5 |
| 2012-08-26 19:00:00 | 96.98 |
| 2012-08-26 20:00:00 | 97.24 |
| 2012-08-26 21:00:00 | 96.98 |
| 2012-08-26 22:00:00 | 97.5 |
| 2012-08-26 23:00:00 | 97.24 |
| 2012-08-27 | 97.24 |
| 2012-08-27 01:00:00 | 97.5 |
| 2012-08-27 02:00:00 | 97.24 |
| 2012-08-27 03:00:00 | 97.5 |
| 2012-08-27 04:00:00 | 97.24 |
| 2012-08-27 05:00:00 | 97.24 |
| 2012-08-27 06:00:00 | 96.98 |
| 2012-08-27 07:00:00 | 97.24 |
| 2012-08-27 08:00:00 | 96.98 |
| 2012-08-27 09:00:00 | 96.98 |
| 2012-08-27 10:00:00 | 96.98 |
| 2012-08-27 11:00:00 | 96.98 |
| 2012-08-27 12:00:00 | 96.98 |
| 2012-08-27 13:00:00 | 96.98 |
| 2012-08-27 14:00:00 | 96.98 |
| 2012-08-27 15:00:00 | 96.98 |
| 2012-08-27 16:00:00 | 96.98 |
| 2012-08-27 17:00:00 | 97.24 |
| 2012-08-27 18:00:00 | 96.98 |
| 2012-08-27 19:00:00 | 97.24 |
| 2012-08-27 20:00:00 | 96.98 |
| 2012-08-27 21:00:00 | 96.98 |
| 2012-08-27 22:00:00 | 97.24 |
| 2012-08-27 23:00:00 | 97.24 |
| 2012-08-28 | 97.24 |
| 2012-08-28 01:00:00 | 96.98 |
| 2012-08-28 02:00:00 | 97.24 |
| 2012-08-28 03:00:00 | 97.24 |
| 2012-08-28 04:00:00 | 97.24 |
| 2012-08-28 05:00:00 | 97.24 |
| 2012-08-28 06:00:00 | 97.24 |
| 2012-08-28 07:00:00 | 96.98 |
| 2012-08-28 08:00:00 | 96.72 |
| 2012-08-28 09:00:00 | 97.5 |
| 2012-08-28 10:00:00 | 96.72 |
| 2012-08-28 11:00:00 | 96.98 |
| 2012-08-28 12:00:00 | 96.98 |
| 2012-08-28 13:00:00 | 96.98 |
| 2012-08-28 14:00:00 | 96.98 |
| 2012-08-28 15:00:00 | 96.98 |
| 2012-08-28 16:00:00 | 96.98 |
| 2012-08-28 17:00:00 | 96.98 |
| 2012-08-28 18:00:00 | 96.98 |
| 2012-08-28 19:00:00 | 97.24 |
| 2012-08-28 20:00:00 | 96.98 |
| 2012-08-28 21:00:00 | 96.98 |
| 2012-08-28 22:00:00 | 97.24 |
| 2012-08-28 23:00:00 | 96.98 |
| 2012-08-29 | 97.24 |
| 2012-08-29 01:00:00 | 97.24 |
| 2012-08-29 02:00:00 | 97.24 |
| 2012-08-29 03:00:00 | 96.98 |
| 2012-08-29 04:00:00 | 97.24 |
| 2012-08-29 05:00:00 | 97.24 |
| 2012-08-29 06:00:00 | 96.98 |
| 2012-08-29 07:00:00 | 96.98 |
| 2012-08-29 08:00:00 | 96.98 |
| 2012-08-29 09:00:00 | 96.72 |
| 2012-08-29 10:00:00 | 96.98 |
| 2012-08-29 11:00:00 | 96.2 |
| 2012-08-29 12:00:00 | 96.72 |
| 2012-08-29 13:00:00 | 96.72 |
| 2012-08-29 14:00:00 | 96.72 |
| 2012-08-29 15:00:00 | 96.98 |
| 2012-08-29 16:00:00 | 96.72 |
| 2012-08-29 17:00:00 | 96.72 |
| 2012-08-29 18:00:00 | 96.2 |
| 2012-08-29 19:00:00 | 96.72 |
| 2012-08-29 20:00:00 | 96.98 |
| 2012-08-29 21:00:00 | 96.98 |
| 2012-08-29 22:00:00 | 96.98 |
| 2012-08-29 23:00:00 | 97.24 |
| 2012-08-30 | 96.98 |
| 2012-08-30 01:00:00 | 97.24 |
| 2012-08-30 02:00:00 | 96.98 |
| 2012-08-30 03:00:00 | 96.72 |
| 2012-08-30 04:00:00 | 96.98 |
| 2012-08-30 05:00:00 | 97.24 |
| 2012-08-30 06:00:00 | 96.98 |
| 2012-08-30 07:00:00 | 96.98 |
| 2012-08-30 08:00:00 | 96.98 |
| 2012-08-30 09:00:00 | 96.72 |
| 2012-08-30 10:00:00 | 96.98 |
| 2012-08-30 11:00:00 | 96.98 |
| 2012-08-30 12:00:00 | 96.98 |
| 2012-08-30 13:00:00 | 96.98 |
| 2012-08-30 14:00:00 | 96.72 |
| 2012-08-30 15:00:00 | 96.98 |
| 2012-08-30 16:00:00 | 96.98 |
| 2012-08-30 17:00:00 | 96.72 |
| 2012-08-30 18:00:00 | 97.24 |
| 2012-08-30 19:00:00 | 96.98 |
| 2012-08-30 20:00:00 | 96.98 |
| 2012-08-30 21:00:00 | 96.98 |
| 2012-08-30 22:00:00 | 97.24 |
| 2012-08-30 23:00:00 | 97.24 |
| 2012-08-31 | 97.24 |
| 2012-08-31 01:00:00 | 97.24 |
| 2012-08-31 02:00:00 | 97.24 |
| 2012-08-31 03:00:00 | 97.24 |
| 2012-08-31 04:00:00 | 97.24 |
| 2012-08-31 05:00:00 | 97.24 |
| 2012-08-31 06:00:00 | 96.98 |
| 2012-08-31 07:00:00 | 97.24 |
| 2012-08-31 08:00:00 | 96.98 |
| 2012-08-31 09:00:00 | 96.72 |
| 2012-08-31 10:00:00 | 96.98 |
| 2012-08-31 11:00:00 | 96.98 |
| 2012-08-31 12:00:00 | 96.98 |
| 2012-08-31 13:00:00 | 96.98 |
| 2012-08-31 14:00:00 | 96.98 |
| 2012-08-31 15:00:00 | 97.24 |
| 2012-08-31 16:00:00 | 96.98 |
| 2012-08-31 17:00:00 | 96.98 |
| 2012-08-31 18:00:00 | 97.24 |
| 2012-08-31 19:00:00 | 96.98 |
| 2012-08-31 20:00:00 | 97.24 |
| 2012-08-31 21:00:00 | 96.98 |
| 2012-08-31 22:00:00 | 97.24 |
| 2012-08-31 23:00:00 | 97.24 |
| 2012-09-01 | 97.24 |
| 2012-09-01 01:00:00 | 97.24 |
| 2012-09-01 02:00:00 | 97.24 |
| 2012-09-01 03:00:00 | 97.24 |
| 2012-09-01 04:00:00 | 97.24 |
| 2012-09-01 05:00:00 | 97.24 |
| 2012-09-01 06:00:00 | 97.24 |
| 2012-09-01 07:00:00 | 97.24 |
| 2012-09-01 08:00:00 | 97.24 |
| 2012-09-01 09:00:00 | 97.24 |
| 2012-09-01 10:00:00 | 96.98 |
| 2012-09-01 11:00:00 | 96.98 |
| 2012-09-01 12:00:00 | 96.98 |
| 2012-09-01 13:00:00 | 97.24 |
| 2012-09-01 14:00:00 | 96.98 |
| 2012-09-01 15:00:00 | 97.24 |
| 2012-09-01 16:00:00 | 96.98 |
| 2012-09-01 17:00:00 | 97.24 |
| 2012-09-01 18:00:00 | 97.24 |
| 2012-09-01 19:00:00 | 97.24 |
| 2012-09-01 20:00:00 | 96.98 |
| 2012-09-01 21:00:00 | 97.24 |
| 2012-09-01 22:00:00 | 97.24 |
| 2012-09-01 23:00:00 | 97.24 |
| 2012-09-02 | 97.24 |
| 2012-09-02 01:00:00 | 78.52 |
| 2012-09-02 02:00:00 | 76.18 |
| 2012-09-02 03:00:00 | 76.18 |
| 2012-09-02 04:00:00 | 76.18 |
| 2012-09-02 05:00:00 | 76.44 |
| 2012-09-02 06:00:00 | 75.66 |
| 2012-09-02 07:00:00 | 17.16 |
| 2012-09-02 08:00:00 | 0.52 |
| 2012-09-02 09:00:00 | 0.78 |
| 2012-09-02 10:00:00 | 0.52 |
| 2012-09-02 11:00:00 | 0.52 |
| 2012-09-02 12:00:00 | 0.52 |
| 2012-09-02 13:00:00 | 0.52 |
| 2012-09-02 14:00:00 | 0.52 |
| 2012-09-02 15:00:00 | 0.52 |
| 2012-09-02 16:00:00 | 0.78 |
| 2012-09-02 17:00:00 | 0.52 |
| 2012-09-02 18:00:00 | 0.52 |
| 2012-09-02 19:00:00 | 0.52 |
| 2012-09-02 20:00:00 | 0.52 |
| 2012-09-02 21:00:00 | 0.52 |
| 2012-09-02 22:00:00 | 0.52 |
| 2012-09-02 23:00:00 | 0.52 |
| 2012-09-03 | 0.78 |
| 2012-09-03 01:00:00 | 0.52 |
| 2012-09-03 02:00:00 | 0.52 |
| 2012-09-03 03:00:00 | 0.52 |
| 2012-09-03 04:00:00 | 0.52 |
| 2012-09-03 05:00:00 | 0.52 |
| 2012-09-03 06:00:00 | 0.78 |
| 2012-09-03 07:00:00 | 0.52 |
| 2012-09-03 08:00:00 | 0.52 |
| 2012-09-03 09:00:00 | 0.52 |
| 2012-09-03 10:00:00 | 0.52 |
| 2012-09-03 11:00:00 | 0.52 |
| 2012-09-03 12:00:00 | 0.52 |
| 2012-09-03 13:00:00 | 0.52 |
| 2012-09-03 14:00:00 | 0.78 |
| 2012-09-03 15:00:00 | 0.52 |
| 2012-09-03 16:00:00 | 0.52 |
| 2012-09-03 17:00:00 | 0.52 |
| 2012-09-03 18:00:00 | 0.52 |
| 2012-09-03 19:00:00 | 0.52 |
| 2012-09-03 20:00:00 | 0.52 |
| 2012-09-03 21:00:00 | 0.52 |
| 2012-09-03 22:00:00 | 0.78 |
| 2012-09-03 23:00:00 | 0.52 |
| 2012-09-04 | 0.52 |
| 2012-09-04 01:00:00 | 0.52 |
| 2012-09-04 02:00:00 | 0.52 |
| 2012-09-04 03:00:00 | 0.52 |
| 2012-09-04 04:00:00 | 0.52 |
| 2012-09-04 05:00:00 | 0.78 |
| 2012-09-04 06:00:00 | 0.52 |
| 2012-09-04 07:00:00 | 0.52 |
| 2012-09-04 08:00:00 | 0.52 |
| 2012-09-04 09:00:00 | 0.52 |
| 2012-09-04 10:00:00 | 0.52 |
| 2012-09-04 11:00:00 | 0.52 |
| 2012-09-04 12:00:00 | 0.52 |
| 2012-09-04 13:00:00 | 0.52 |
| 2012-09-04 14:00:00 | 0.78 |
| 2012-09-04 15:00:00 | 0.52 |
| 2012-09-04 16:00:00 | 0.52 |
| 2012-09-04 17:00:00 | 0.52 |
| 2012-09-04 18:00:00 | 0.52 |
| 2012-09-04 19:00:00 | 0.52 |
| 2012-09-04 20:00:00 | 0.52 |
| 2012-09-04 21:00:00 | 0.52 |
| 2012-09-04 22:00:00 | 0.52 |
| 2012-09-04 23:00:00 | 0.78 |
| 2012-09-05 | 0.52 |
| 2012-09-05 01:00:00 | 0.52 |
| 2012-09-05 02:00:00 | 0.52 |
| 2012-09-05 03:00:00 | 0.52 |
| 2012-09-05 04:00:00 | 0.52 |
| 2012-09-05 05:00:00 | 0.52 |
| 2012-09-05 06:00:00 | 0.52 |
| 2012-09-05 07:00:00 | 0.78 |
| 2012-09-05 08:00:00 | 0.52 |
| 2012-09-05 09:00:00 | 0.52 |
| 2012-09-05 10:00:00 | 0.52 |
| 2012-09-05 11:00:00 | 0.52 |
| 2012-09-05 12:00:00 | 0.52 |
| 2012-09-05 13:00:00 | 0.52 |
| 2012-09-05 14:00:00 | 0.52 |
| 2012-09-05 15:00:00 | 0.52 |
| 2012-09-05 16:00:00 | 0.78 |
| 2012-09-05 17:00:00 | 0.52 |
| 2012-09-05 18:00:00 | 0.52 |
| 2012-09-05 19:00:00 | 0.52 |
| 2012-09-05 20:00:00 | 0.52 |
| 2012-09-05 21:00:00 | 0.52 |
| 2012-09-05 22:00:00 | 0.52 |
| 2012-09-05 23:00:00 | 0.52 |
| 2012-09-06 | 0.52 |
| 2012-09-06 01:00:00 | 0.78 |
| 2012-09-06 02:00:00 | 0.52 |
| 2012-09-06 03:00:00 | 0.52 |
| 2012-09-06 04:00:00 | 0.52 |
| 2012-09-06 05:00:00 | 0.52 |
| 2012-09-06 06:00:00 | 0.52 |
| 2012-09-06 07:00:00 | 0.52 |
| 2012-09-06 08:00:00 | 0.52 |
| 2012-09-06 09:00:00 | 0.78 |
| 2012-09-06 10:00:00 | 0.52 |
| 2012-09-06 11:00:00 | 0.52 |
| 2012-09-06 12:00:00 | 0.52 |
| 2012-09-06 13:00:00 | 0.52 |
| 2012-09-06 14:00:00 | 0.52 |
| 2012-09-06 15:00:00 | 0.52 |
| 2012-09-06 16:00:00 | 0.52 |
| 2012-09-06 17:00:00 | 0.52 |
| 2012-09-06 18:00:00 | 0.78 |
| 2012-09-06 19:00:00 | 0.52 |
| 2012-09-06 20:00:00 | 0.52 |
| 2012-09-06 21:00:00 | 0.52 |
| 2012-09-06 22:00:00 | 0.52 |
| 2012-09-06 23:00:00 | 0.52 |
| 2012-09-07 | 0.52 |
| 2012-09-07 01:00:00 | 0.52 |
| 2012-09-07 02:00:00 | 0.52 |
| 2012-09-07 03:00:00 | 0.78 |
| 2012-09-07 04:00:00 | 0.52 |
| 2012-09-07 05:00:00 | 0.52 |
| 2012-09-07 06:00:00 | 0.52 |
| 2012-09-07 07:00:00 | 0.52 |
| 2012-09-07 08:00:00 | 0.52 |
| 2012-09-07 09:00:00 | 0.52 |
| 2012-09-07 10:00:00 | 0.78 |
| 2012-09-07 11:00:00 | 0.52 |
| 2012-09-07 12:00:00 | 0.52 |
| 2012-09-07 13:00:00 | 0.52 |
| 2012-09-07 14:00:00 | 0.52 |
| 2012-09-07 15:00:00 | 0.52 |
| 2012-09-07 16:00:00 | 0.52 |
| 2012-09-07 17:00:00 | 0.52 |
| 2012-09-07 18:00:00 | 0.52 |
| 2012-09-07 19:00:00 | 0.52 |
| 2012-09-07 20:00:00 | 0.78 |
| 2012-09-07 21:00:00 | 0.52 |
| 2012-09-07 22:00:00 | 0.52 |
| 2012-09-07 23:00:00 | 0.52 |
| 2012-09-08 | 0.52 |
| 2012-09-08 01:00:00 | 0.52 |
| 2012-09-08 02:00:00 | 0.52 |
| 2012-09-08 03:00:00 | 0.52 |
| 2012-09-08 04:00:00 | 0.78 |
| 2012-09-08 05:00:00 | 0.52 |
| 2012-09-08 06:00:00 | 0.52 |
| 2012-09-08 07:00:00 | 0.52 |
| 2012-09-08 08:00:00 | 0.52 |
| 2012-09-08 09:00:00 | 0.52 |
| 2012-09-08 10:00:00 | 0.52 |
| 2012-09-08 11:00:00 | 0.52 |
| 2012-09-08 12:00:00 | 0.52 |
| 2012-09-08 13:00:00 | 0.78 |
| 2012-09-08 14:00:00 | 0.52 |
| 2012-09-08 15:00:00 | 0.52 |
| 2012-09-08 16:00:00 | 0.52 |
| 2012-09-08 17:00:00 | 0.52 |
| 2012-09-08 18:00:00 | 0.52 |
| 2012-09-08 19:00:00 | 0.52 |
| 2012-09-08 20:00:00 | 0.52 |
| 2012-09-08 21:00:00 | 0.52 |
| 2012-09-08 22:00:00 | 0.78 |
| 2012-09-08 23:00:00 | 0.52 |
| 2012-09-09 | 0.52 |
| 2012-09-09 01:00:00 | 0.52 |
| 2012-09-09 02:00:00 | 0.52 |
| 2012-09-09 03:00:00 | 0.52 |
| 2012-09-09 04:00:00 | 0.52 |
| 2012-09-09 05:00:00 | 0.52 |
| 2012-09-09 06:00:00 | 0.52 |
| 2012-09-09 07:00:00 | 0.78 |
| 2012-09-09 08:00:00 | 0.52 |
| 2012-09-09 09:00:00 | 0.52 |
| 2012-09-09 10:00:00 | 0.52 |
| 2012-09-09 11:00:00 | 0.52 |
| 2012-09-09 12:00:00 | 0.52 |
| 2012-09-09 13:00:00 | 0.52 |
| 2012-09-09 14:00:00 | 0.52 |
| 2012-09-09 15:00:00 | 0.52 |
| 2012-09-09 16:00:00 | 0.78 |
| 2012-09-09 17:00:00 | 0.52 |
| 2012-09-09 18:00:00 | 0.52 |
| 2012-09-09 19:00:00 | 0.52 |
| 2012-09-09 20:00:00 | 0.52 |
| 2012-09-09 21:00:00 | 0.52 |
| 2012-09-09 22:00:00 | 0.52 |
| 2012-09-09 23:00:00 | 0.52 |
| 2012-09-10 | 0.52 |
| 2012-09-10 01:00:00 | 0.52 |
| 2012-09-10 02:00:00 | 0.78 |
| 2012-09-10 03:00:00 | 0.52 |
| 2012-09-10 04:00:00 | 0.52 |
| 2012-09-10 05:00:00 | 0.52 |
| 2012-09-10 06:00:00 | 0.52 |
| 2012-09-10 07:00:00 | 0.52 |
| 2012-09-10 08:00:00 | 0.52 |
| 2012-09-10 09:00:00 | 0.52 |
| 2012-09-10 10:00:00 | 0.52 |
| 2012-09-10 11:00:00 | 0.52 |
| 2012-09-10 12:00:00 | 0.78 |
| 2012-09-10 13:00:00 | 0.52 |
| 2012-09-10 14:00:00 | 0.52 |
| 2012-09-10 15:00:00 | 0.52 |
| 2012-09-10 16:00:00 | 0.52 |
| 2012-09-10 17:00:00 | 0.52 |
| 2012-09-10 18:00:00 | 0.52 |
| 2012-09-10 19:00:00 | 0.52 |
| 2012-09-10 20:00:00 | 0.52 |
| 2012-09-10 21:00:00 | 0.52 |
| 2012-09-10 22:00:00 | 0.52 |
| 2012-09-10 23:00:00 | 0.52 |
| 2012-09-11 | 0.52 |
| 2012-09-11 01:00:00 | 0.78 |
| 2012-09-11 02:00:00 | 0.52 |
| 2012-09-11 03:00:00 | 0.52 |
| 2012-09-11 04:00:00 | 0.52 |
| 2012-09-11 05:00:00 | 0.52 |
| 2012-09-11 06:00:00 | 0.52 |
| 2012-09-11 07:00:00 | 0.52 |
| 2012-09-11 08:00:00 | 0.52 |
| 2012-09-11 09:00:00 | 0.52 |
| 2012-09-11 10:00:00 | 0.52 |
| 2012-09-11 11:00:00 | 0.52 |
| 2012-09-11 12:00:00 | 0.78 |
| 2012-09-11 13:00:00 | 0.52 |
| 2012-09-11 14:00:00 | 0.52 |
| 2012-09-11 15:00:00 | 0.52 |
| 2012-09-11 16:00:00 | 0.52 |
| 2012-09-11 17:00:00 | 0.52 |
| 2012-09-11 18:00:00 | 0.52 |
| 2012-09-11 19:00:00 | 0.52 |
| 2012-09-11 20:00:00 | 0.52 |
| 2012-09-11 21:00:00 | 0.52 |
| 2012-09-11 22:00:00 | 0.52 |
| 2012-09-11 23:00:00 | 0.52 |
| 2012-09-12 | 0.52 |
| 2012-09-12 01:00:00 | 0.78 |
| 2012-09-12 02:00:00 | 0.52 |
| 2012-09-12 03:00:00 | 0.52 |
| 2012-09-12 04:00:00 | 0.52 |
| 2012-09-12 05:00:00 | 0.52 |
| 2012-09-12 06:00:00 | 0.52 |
| 2012-09-12 07:00:00 | 0.52 |
| 2012-09-12 08:00:00 | 0.52 |
| 2012-09-12 09:00:00 | 0.52 |
| 2012-09-12 10:00:00 | 0.52 |
| 2012-09-12 11:00:00 | 0.52 |
| 2012-09-12 12:00:00 | 0.52 |
| 2012-09-12 13:00:00 | 0.52 |
| 2012-09-12 14:00:00 | 0.78 |
| 2012-09-12 15:00:00 | 0.52 |
| 2012-09-12 16:00:00 | 0.52 |
| 2012-09-12 17:00:00 | 0.52 |
| 2012-09-12 18:00:00 | 0.52 |
| 2012-09-12 19:00:00 | 0.52 |
| 2012-09-12 20:00:00 | 0.52 |
| 2012-09-12 21:00:00 | 0.52 |
| 2012-09-12 22:00:00 | 0.52 |
| 2012-09-12 23:00:00 | 0.52 |
| 2012-09-13 | 0.52 |
| 2012-09-13 01:00:00 | 0.52 |
| 2012-09-13 02:00:00 | 0.78 |
| 2012-09-13 03:00:00 | 0.52 |
| 2012-09-13 04:00:00 | 0.52 |
| 2012-09-13 05:00:00 | 0.52 |
| 2012-09-13 06:00:00 | 0.52 |
| 2012-09-13 07:00:00 | 0.52 |
| 2012-09-13 08:00:00 | 0.52 |
| 2012-09-13 09:00:00 | 0.52 |
| 2012-09-13 10:00:00 | 0.52 |
| 2012-09-13 11:00:00 | 0.52 |
| 2012-09-13 12:00:00 | 0.52 |
| 2012-09-13 13:00:00 | 0.78 |
| 2012-09-13 14:00:00 | 0.52 |
| 2012-09-13 15:00:00 | 0.52 |
| 2012-09-13 16:00:00 | 0.52 |
| 2012-09-13 17:00:00 | 0.52 |
| 2012-09-13 18:00:00 | 0.52 |
| 2012-09-13 19:00:00 | 0.52 |
| 2012-09-13 20:00:00 | 0.52 |
| 2012-09-13 21:00:00 | 0.52 |
| 2012-09-13 22:00:00 | 0.52 |
| 2012-09-13 23:00:00 | 0.78 |
| 2012-09-14 | 0.52 |
| 2012-09-14 01:00:00 | 0.52 |
| 2012-09-14 02:00:00 | 0.52 |
| 2012-09-14 03:00:00 | 0.52 |
| 2012-09-14 04:00:00 | 0.52 |
| 2012-09-14 05:00:00 | 0.52 |
| 2012-09-14 06:00:00 | 0.52 |
| 2012-09-14 07:00:00 | 0.52 |
| 2012-09-14 08:00:00 | 0.52 |
| 2012-09-14 09:00:00 | 0.52 |
| 2012-09-14 10:00:00 | 0.52 |
| 2012-09-14 11:00:00 | 0.52 |
| 2012-09-14 12:00:00 | 0.52 |
| 2012-09-14 13:00:00 | 0.78 |
| 2012-09-14 14:00:00 | 0.52 |
| 2012-09-14 15:00:00 | 0.52 |
| 2012-09-14 16:00:00 | 0.52 |
| 2012-09-14 17:00:00 | 0.52 |
| 2012-09-14 18:00:00 | 0.52 |
| 2012-09-14 19:00:00 | 0.52 |
| 2012-09-14 20:00:00 | 0.52 |
| 2012-09-14 21:00:00 | 0.52 |
| 2012-09-14 22:00:00 | 0.52 |
| 2012-09-14 23:00:00 | 0.52 |
| 2012-09-15 | 0.52 |
| 2012-09-15 01:00:00 | 0.78 |
| 2012-09-15 02:00:00 | 0.52 |
| 2012-09-15 03:00:00 | 0.52 |
| 2012-09-15 04:00:00 | 0.52 |
| 2012-09-15 05:00:00 | 0.52 |
| 2012-09-15 06:00:00 | 0.52 |
| 2012-09-15 07:00:00 | 0.52 |
| 2012-09-15 08:00:00 | 0.52 |
| 2012-09-15 09:00:00 | 0.52 |
| 2012-09-15 10:00:00 | 0.52 |
| 2012-09-15 11:00:00 | 0.52 |
| 2012-09-15 12:00:00 | 0.78 |
| 2012-09-15 13:00:00 | 0.52 |
| 2012-09-15 14:00:00 | 0.52 |
| 2012-09-15 15:00:00 | 0.52 |
| 2012-09-15 16:00:00 | 0.52 |
| 2012-09-15 17:00:00 | 0.52 |
| 2012-09-15 18:00:00 | 0.52 |
| 2012-09-15 19:00:00 | 0.52 |
| 2012-09-15 20:00:00 | 0.52 |
| 2012-09-15 21:00:00 | 0.52 |
| 2012-09-15 22:00:00 | 0.52 |
| 2012-09-15 23:00:00 | 0.52 |
| 2012-09-16 | 0.78 |
| 2012-09-16 01:00:00 | 0.52 |
| 2012-09-16 02:00:00 | 0.52 |
| 2012-09-16 03:00:00 | 0.52 |
| 2012-09-16 04:00:00 | 0.52 |
| 2012-09-16 05:00:00 | 0.52 |
| 2012-09-16 06:00:00 | 0.52 |
| 2012-09-16 07:00:00 | 0.52 |
| 2012-09-16 08:00:00 | 0.52 |
| 2012-09-16 09:00:00 | 0.52 |
| 2012-09-16 10:00:00 | 0.52 |
| 2012-09-16 11:00:00 | 0.78 |
| 2012-09-16 12:00:00 | 0.52 |
| 2012-09-16 13:00:00 | 0.52 |
| 2012-09-16 14:00:00 | 0.52 |
| 2012-09-16 15:00:00 | 0.52 |
| 2012-09-16 16:00:00 | 0.52 |
| 2012-09-16 17:00:00 | 0.52 |
| 2012-09-16 18:00:00 | 0.52 |
| 2012-09-16 19:00:00 | 0.52 |
| 2012-09-16 20:00:00 | 0.52 |
| 2012-09-16 21:00:00 | 0.52 |
| 2012-09-16 22:00:00 | 0.52 |
| 2012-09-16 23:00:00 | 0.52 |
| 2012-09-17 | 0.52 |
| 2012-09-17 01:00:00 | 0.52 |
| 2012-09-17 02:00:00 | 0.78 |
| 2012-09-17 03:00:00 | 0.52 |
| 2012-09-17 04:00:00 | 0.52 |
| 2012-09-17 05:00:00 | 0.52 |
| 2012-09-17 06:00:00 | 0.52 |
| 2012-09-17 07:00:00 | 0.52 |
| 2012-09-17 08:00:00 | 0.52 |
| 2012-09-17 09:00:00 | 0.52 |
| 2012-09-17 10:00:00 | 0.52 |
| 2012-09-17 11:00:00 | 0.52 |
| 2012-09-17 12:00:00 | 0.52 |
| 2012-09-17 13:00:00 | 0.52 |
| 2012-09-17 14:00:00 | 0.52 |
| 2012-09-17 15:00:00 | 0.78 |
| 2012-09-17 16:00:00 | 0.52 |
| 2012-09-17 17:00:00 | 0.52 |
| 2012-09-17 18:00:00 | 0.52 |
| 2012-09-17 19:00:00 | 0.52 |
| 2012-09-17 20:00:00 | 0.52 |
| 2012-09-17 21:00:00 | 0.52 |
| 2012-09-17 22:00:00 | 0.52 |
| 2012-09-17 23:00:00 | 0.52 |
| 2012-09-18 | 0.52 |
| 2012-09-18 01:00:00 | 0.52 |
| 2012-09-18 02:00:00 | 0.52 |
| 2012-09-18 03:00:00 | 0.52 |
| 2012-09-18 04:00:00 | 0.52 |
| 2012-09-18 05:00:00 | 0.78 |
| 2012-09-18 06:00:00 | 0.52 |
| 2012-09-18 07:00:00 | 0.52 |
| 2012-09-18 08:00:00 | 0.52 |
| 2012-09-18 09:00:00 | 0.52 |
| 2012-09-18 10:00:00 | 0.52 |
| 2012-09-18 11:00:00 | 0.52 |
| 2012-09-18 12:00:00 | 0.52 |
| 2012-09-18 13:00:00 | 0.52 |
| 2012-09-18 14:00:00 | 0.52 |
| 2012-09-18 15:00:00 | 0.52 |
| 2012-09-18 16:00:00 | 0.52 |
| 2012-09-18 17:00:00 | 0.52 |
| 2012-09-18 18:00:00 | 0.52 |
| 2012-09-18 19:00:00 | 0.52 |
| 2012-09-18 20:00:00 | 0.52 |
| 2012-09-18 21:00:00 | 0.52 |
| 2012-09-18 22:00:00 | 0.52 |
| 2012-09-18 23:00:00 | 0.52 |
| 2012-09-19 | 0.78 |
| 2012-09-19 01:00:00 | 0.52 |
| 2012-09-19 02:00:00 | 0.52 |
| 2012-09-19 03:00:00 | 0.52 |
| 2012-09-19 04:00:00 | 0.52 |
| 2012-09-19 05:00:00 | 0.52 |
| 2012-09-19 06:00:00 | 0.52 |
| 2012-09-19 07:00:00 | 0.52 |
| 2012-09-19 08:00:00 | 0.52 |
| 2012-09-19 09:00:00 | 0.52 |
| 2012-09-19 10:00:00 | 0.52 |
| 2012-09-19 11:00:00 | 0.52 |
| 2012-09-19 12:00:00 | 0.52 |
| 2012-09-19 13:00:00 | 0.52 |
| 2012-09-19 14:00:00 | 0.52 |
| 2012-09-19 15:00:00 | 0.52 |
| 2012-09-19 16:00:00 | 0.52 |
| 2012-09-19 17:00:00 | 0.52 |
| 2012-09-19 18:00:00 | 0.78 |
| 2012-09-19 19:00:00 | 0.52 |
| 2012-09-19 20:00:00 | 0.52 |
| 2012-09-19 21:00:00 | 0.52 |
| 2012-09-19 22:00:00 | 0.52 |
| 2012-09-19 23:00:00 | 0.52 |
| 2012-09-20 | 0.52 |
| 2012-09-20 01:00:00 | 0.52 |
| 2012-09-20 02:00:00 | 0.52 |
| 2012-09-20 03:00:00 | 0.52 |
| 2012-09-20 04:00:00 | 0.52 |
| 2012-09-20 05:00:00 | 0.52 |
| 2012-09-20 06:00:00 | 0.52 |
| 2012-09-20 07:00:00 | 0.52 |
| 2012-09-20 08:00:00 | 0.52 |
| 2012-09-20 09:00:00 | 0.78 |
| 2012-09-20 10:00:00 | 0.52 |
| 2012-09-20 11:00:00 | 0.52 |
| 2012-09-20 12:00:00 | 0.52 |
| 2012-09-20 13:00:00 | 0.52 |
| 2012-09-20 14:00:00 | 0.52 |
| 2012-09-20 15:00:00 | 0.52 |
| 2012-09-20 16:00:00 | 0.52 |
| 2012-09-20 17:00:00 | 0.52 |
| 2012-09-20 18:00:00 | 0.52 |
| 2012-09-20 19:00:00 | 0.52 |
| 2012-09-20 20:00:00 | 0.52 |
| 2012-09-20 21:00:00 | 0.52 |
| 2012-09-20 22:00:00 | 0.52 |
| 2012-09-20 23:00:00 | 0.52 |
| 2012-09-21 | 0.52 |
| 2012-09-21 01:00:00 | 0.52 |
| 2012-09-21 02:00:00 | 0.78 |
| 2012-09-21 03:00:00 | 0.52 |
| 2012-09-21 04:00:00 | 0.52 |
| 2012-09-21 05:00:00 | 0.52 |
| 2012-09-21 06:00:00 | 0.52 |
| 2012-09-21 07:00:00 | 0.52 |
| 2012-09-21 08:00:00 | 0.52 |
| 2012-09-21 09:00:00 | 0.52 |
| 2012-09-21 10:00:00 | 0.52 |
| 2012-09-21 11:00:00 | 0.52 |
| 2012-09-21 12:00:00 | 0.52 |
| 2012-09-21 13:00:00 | 0.52 |
| 2012-09-21 14:00:00 | 0.52 |
| 2012-09-21 15:00:00 | 0.52 |
| 2012-09-21 16:00:00 | 0.52 |
| 2012-09-21 17:00:00 | 0.52 |
| 2012-09-21 18:00:00 | 0.52 |
| 2012-09-21 19:00:00 | 0.52 |
| 2012-09-21 20:00:00 | 0.52 |
| 2012-09-21 21:00:00 | 0.52 |
| 2012-09-21 22:00:00 | 0.52 |
| 2012-09-21 23:00:00 | 0.78 |
| 2012-09-22 | 0.52 |
| 2012-09-22 01:00:00 | 0.52 |
| 2012-09-22 02:00:00 | 0.52 |
| 2012-09-22 03:00:00 | 0.52 |
| 2012-09-22 04:00:00 | 0.52 |
| 2012-09-22 05:00:00 | 0.52 |
| 2012-09-22 06:00:00 | 0.52 |
| 2012-09-22 07:00:00 | 0.52 |
| 2012-09-22 08:00:00 | 0.52 |
| 2012-09-22 09:00:00 | 0.52 |
| 2012-09-22 10:00:00 | 0.52 |
| 2012-09-22 11:00:00 | 0.52 |
| 2012-09-22 12:00:00 | 0.52 |
| 2012-09-22 13:00:00 | 0.52 |
| 2012-09-22 14:00:00 | 0.52 |
| 2012-09-22 15:00:00 | 0.52 |
| 2012-09-22 16:00:00 | 0.52 |
| 2012-09-22 17:00:00 | 0.52 |
| 2012-09-22 18:00:00 | 0.52 |
| 2012-09-22 19:00:00 | 0.52 |
| 2012-09-22 20:00:00 | 0.52 |
| 2012-09-22 21:00:00 | 0.52 |
| 2012-09-22 22:00:00 | 0.52 |
| 2012-09-22 23:00:00 | 0.52 |
| 2012-09-23 | 0.78 |
| 2012-09-23 01:00:00 | 0.52 |
| 2012-09-23 02:00:00 | 0.52 |
| 2012-09-23 03:00:00 | 0.52 |
| 2012-09-23 04:00:00 | 0.52 |
| 2012-09-23 05:00:00 | 0.52 |
| 2012-09-23 06:00:00 | 0.52 |
| 2012-09-23 07:00:00 | 0.52 |
| 2012-09-23 08:00:00 | 0.52 |
| 2012-09-23 09:00:00 | 0.52 |
| 2012-09-23 10:00:00 | 0.52 |
| 2012-09-23 11:00:00 | 0.52 |
| 2012-09-23 12:00:00 | 0.52 |
| 2012-09-23 13:00:00 | 0.52 |
| 2012-09-23 14:00:00 | 0.52 |
| 2012-09-23 15:00:00 | 0.52 |
| 2012-09-23 16:00:00 | 0.52 |
| 2012-09-23 17:00:00 | 0.52 |
| 2012-09-23 18:00:00 | 0.52 |
| 2012-09-23 19:00:00 | 0.52 |
| 2012-09-23 20:00:00 | 0.52 |
| 2012-09-23 21:00:00 | 0.52 |
| 2012-09-23 22:00:00 | 0.52 |
| 2012-09-23 23:00:00 | 0.52 |
| 2012-09-24 | 0.52 |
| 2012-09-24 01:00:00 | 0.52 |
| 2012-09-24 02:00:00 | 0.78 |
| 2012-09-24 03:00:00 | 0.52 |
| 2012-09-24 04:00:00 | 0.52 |
| 2012-09-24 05:00:00 | 0.52 |
| 2012-09-24 06:00:00 | 0.52 |
| 2012-09-24 07:00:00 | 0.52 |
| 2012-09-24 08:00:00 | 0.52 |
| 2012-09-24 09:00:00 | 0.52 |
| 2012-09-24 10:00:00 | 0.52 |
| 2012-09-24 11:00:00 | 0.52 |
| 2012-09-24 12:00:00 | 0.52 |
| 2012-09-24 13:00:00 | 0.52 |
| 2012-09-24 14:00:00 | 0.52 |
| 2012-09-24 15:00:00 | 0.52 |
| 2012-09-24 16:00:00 | 0.52 |
| 2012-09-24 17:00:00 | 0.52 |
| 2012-09-24 18:00:00 | 0.52 |
| 2012-09-24 19:00:00 | 0.52 |
| 2012-09-24 20:00:00 | 0.52 |
| 2012-09-24 21:00:00 | 0.52 |
| 2012-09-24 22:00:00 | 0.52 |
| 2012-09-24 23:00:00 | 0.52 |
| 2012-09-25 | 0.52 |
| 2012-09-25 01:00:00 | 0.52 |
| 2012-09-25 02:00:00 | 0.52 |
| 2012-09-25 03:00:00 | 0.52 |
| 2012-09-25 04:00:00 | 0.52 |
| 2012-09-25 05:00:00 | 0.52 |
| 2012-09-25 06:00:00 | 0.52 |
| 2012-09-25 07:00:00 | 0.52 |
| 2012-09-25 08:00:00 | 0.52 |
| 2012-09-25 09:00:00 | 0.52 |
| 2012-09-25 10:00:00 | 0.52 |
| 2012-09-25 11:00:00 | 0.52 |
| 2012-09-25 12:00:00 | 0.52 |
| 2012-09-25 13:00:00 | 0.78 |
| 2012-09-25 14:00:00 | 0.78 |
| 2012-09-25 15:00:00 | 0.52 |
| 2012-09-25 16:00:00 | 0.52 |
| 2012-09-25 17:00:00 | 0.52 |
| 2012-09-25 18:00:00 | 0.52 |
| 2012-09-25 19:00:00 | 0.52 |
| 2012-09-25 20:00:00 | 0.52 |
| 2012-09-25 21:00:00 | 0.52 |
| 2012-09-25 22:00:00 | 0.52 |
| 2012-09-25 23:00:00 | 0.52 |
| 2012-09-26 | 0.52 |
| 2012-09-26 01:00:00 | 0.52 |
| 2012-09-26 02:00:00 | 0.52 |
| 2012-09-26 03:00:00 | 0.52 |
| 2012-09-26 04:00:00 | 0.52 |
| 2012-09-26 05:00:00 | 0.52 |
| 2012-09-26 06:00:00 | 0.52 |
| 2012-09-26 07:00:00 | 0.52 |
| 2012-09-26 08:00:00 | 0.52 |
| 2012-09-26 09:00:00 | 0.52 |
| 2012-09-26 10:00:00 | 0.52 |
| 2012-09-26 11:00:00 | 0.78 |
| 2012-09-26 12:00:00 | 0.52 |
| 2012-09-26 13:00:00 | 0.52 |
| 2012-09-26 14:00:00 | 0.52 |
| 2012-09-26 15:00:00 | 0.52 |
| 2012-09-26 16:00:00 | 0.52 |
| 2012-09-26 17:00:00 | 0.52 |
| 2012-09-26 18:00:00 | 0.52 |
| 2012-09-26 19:00:00 | 0.52 |
| 2012-09-26 20:00:00 | 0.52 |
| 2012-09-26 21:00:00 | 0.52 |
| 2012-09-26 22:00:00 | 0.52 |
| 2012-09-26 23:00:00 | 0.52 |
| 2012-09-27 | 0.52 |
| 2012-09-27 01:00:00 | 0.52 |
| 2012-09-27 02:00:00 | 0.52 |
| 2012-09-27 03:00:00 | 0.52 |
| 2012-09-27 04:00:00 | 0.52 |
| 2012-09-27 05:00:00 | 0.52 |
| 2012-09-27 06:00:00 | 0.52 |
| 2012-09-27 07:00:00 | 0.52 |
| 2012-09-27 08:00:00 | 0.52 |
| 2012-09-27 09:00:00 | 0.52 |
| 2012-09-27 10:00:00 | 0.78 |
| 2012-09-27 11:00:00 | 0.52 |
| 2012-09-27 12:00:00 | 0.52 |
| 2012-09-27 13:00:00 | 0.52 |
| 2012-09-27 14:00:00 | 0.52 |
| 2012-09-27 15:00:00 | 0.52 |
| 2012-09-27 16:00:00 | 0.52 |
| 2012-09-27 17:00:00 | 0.52 |
| 2012-09-27 18:00:00 | 0.52 |
| 2012-09-27 19:00:00 | 0.52 |
| 2012-09-27 20:00:00 | 0.52 |
| 2012-09-27 21:00:00 | 0.52 |
| 2012-09-27 22:00:00 | 0.52 |
| 2012-09-27 23:00:00 | 0.52 |
| 2012-09-28 | 0.52 |
| 2012-09-28 01:00:00 | 0.52 |
| 2012-09-28 02:00:00 | 0.52 |
| 2012-09-28 03:00:00 | 0.52 |
| 2012-09-28 04:00:00 | 0.52 |
| 2012-09-28 05:00:00 | 0.52 |
| 2012-09-28 06:00:00 | 0.52 |
| 2012-09-28 07:00:00 | 0.52 |
| 2012-09-28 08:00:00 | 0.52 |
| 2012-09-28 09:00:00 | 0.78 |
| 2012-09-28 10:00:00 | 0.52 |
| 2012-09-28 11:00:00 | 0.52 |
| 2012-09-28 12:00:00 | 0.52 |
| 2012-09-28 13:00:00 | 0.52 |
| 2012-09-28 14:00:00 | 0.52 |
| 2012-09-28 15:00:00 | 0.52 |
| 2012-09-28 16:00:00 | 0.52 |
| 2012-09-28 17:00:00 | 0.52 |
| 2012-09-28 18:00:00 | 0.52 |
| 2012-09-28 19:00:00 | 0.52 |
| 2012-09-28 20:00:00 | 0.52 |
| 2012-09-28 21:00:00 | 0.52 |
| 2012-09-28 22:00:00 | 0.52 |
| 2012-09-28 23:00:00 | 0.52 |
| 2012-09-29 | 0.52 |
| 2012-09-29 01:00:00 | 0.52 |
| 2012-09-29 02:00:00 | 0.52 |
| 2012-09-29 03:00:00 | 0.52 |
| 2012-09-29 04:00:00 | 0.52 |
| 2012-09-29 05:00:00 | 0.52 |
| 2012-09-29 06:00:00 | 0.78 |
| 2012-09-29 07:00:00 | 0.52 |
| 2012-09-29 08:00:00 | 0.52 |
| 2012-09-29 09:00:00 | 0.52 |
| 2012-09-29 10:00:00 | 0.52 |
| 2012-09-29 11:00:00 | 0.52 |
| 2012-09-29 12:00:00 | 0.52 |
| 2012-09-29 13:00:00 | 0.52 |
| 2012-09-29 14:00:00 | 0.52 |
| 2012-09-29 15:00:00 | 0.52 |
| 2012-09-29 16:00:00 | 0.52 |
| 2012-09-29 17:00:00 | 0.52 |
| 2012-09-29 18:00:00 | 0.52 |
| 2012-09-29 19:00:00 | 0.52 |
| 2012-09-29 20:00:00 | 0.52 |
| 2012-09-29 21:00:00 | 0.52 |
| 2012-09-29 22:00:00 | 0.52 |
| 2012-09-29 23:00:00 | 0.52 |
| 2012-09-30 | 0.52 |
| 2012-09-30 01:00:00 | 0.52 |
| 2012-09-30 02:00:00 | 0.78 |
| 2012-09-30 03:00:00 | 0.52 |
| 2012-09-30 04:00:00 | 0.52 |
| 2012-09-30 05:00:00 | 0.52 |
| 2012-09-30 06:00:00 | 0.52 |
| 2012-09-30 07:00:00 | 0.52 |
| 2012-09-30 08:00:00 | 0.52 |
| 2012-09-30 09:00:00 | 0.52 |
| 2012-09-30 10:00:00 | 0.52 |
| 2012-09-30 11:00:00 | 0.52 |
| 2012-09-30 12:00:00 | 0.52 |
| 2012-09-30 13:00:00 | 0.52 |
| 2012-09-30 14:00:00 | 0.52 |
| 2012-09-30 15:00:00 | 0.52 |
| 2012-09-30 16:00:00 | 0.52 |
| 2012-09-30 17:00:00 | 0.52 |
| 2012-09-30 18:00:00 | 0.78 |
| 2012-09-30 19:00:00 | 0.52 |
| 2012-09-30 20:00:00 | 0.52 |
| 2012-09-30 21:00:00 | 0.52 |
| 2012-09-30 22:00:00 | 0.52 |
| 2012-09-30 23:00:00 | 0.52 |
| 2012-10-01 | 0.52 |
| 2012-10-01 01:00:00 | 0.52 |
| 2012-10-01 02:00:00 | 0.52 |
| 2012-10-01 03:00:00 | 0.52 |
| 2012-10-01 04:00:00 | 0.52 |
| 2012-10-01 05:00:00 | 0.52 |
| 2012-10-01 06:00:00 | 0.52 |
| 2012-10-01 07:00:00 | 0.52 |
| 2012-10-01 08:00:00 | 0.78 |
| 2012-10-01 09:00:00 | 0.52 |
| 2012-10-01 10:00:00 | 0.52 |
| 2012-10-01 11:00:00 | 0.52 |
| 2012-10-01 12:00:00 | 0.52 |
| 2012-10-01 13:00:00 | 0.52 |
| 2012-10-01 14:00:00 | 0.52 |
| 2012-10-01 15:00:00 | 0.52 |
| 2012-10-01 16:00:00 | 0.52 |
| 2012-10-01 17:00:00 | 0.52 |
| 2012-10-01 18:00:00 | 0.52 |
| 2012-10-01 19:00:00 | 0.52 |
| 2012-10-01 20:00:00 | 0.52 |
| 2012-10-01 21:00:00 | 0.52 |
| 2012-10-01 22:00:00 | 0.52 |
| 2012-10-01 23:00:00 | 0.52 |
| 2012-10-02 | 0.52 |
| 2012-10-02 01:00:00 | 0.52 |
| 2012-10-02 02:00:00 | 0.52 |
| 2012-10-02 03:00:00 | 0.78 |
| 2012-10-02 04:00:00 | 0.52 |
| 2012-10-02 05:00:00 | 0.52 |
| 2012-10-02 06:00:00 | 0.52 |
| 2012-10-02 07:00:00 | 0.52 |
| 2012-10-02 08:00:00 | 0.52 |
| 2012-10-02 09:00:00 | 0.52 |
| 2012-10-02 10:00:00 | 0.52 |
| 2012-10-02 11:00:00 | 0.78 |
| 2012-10-02 12:00:00 | 1.04 |
| 2012-10-02 13:00:00 | 1.3 |
| 2012-10-02 14:00:00 | 0.78 |
| 2012-10-02 15:00:00 | 0.52 |
| 2012-10-02 16:00:00 | 0.52 |
| 2012-10-02 17:00:00 | 0.52 |
| 2012-10-02 18:00:00 | 0.52 |
| 2012-10-02 19:00:00 | 0.52 |
| 2012-10-02 20:00:00 | 0.52 |
| 2012-10-02 21:00:00 | 0.52 |
| 2012-10-02 22:00:00 | 0.52 |
| 2012-10-02 23:00:00 | 0.52 |
| 2012-10-03 | 0.78 |
| 2012-10-03 01:00:00 | 0.52 |
| 2012-10-03 02:00:00 | 0.52 |
| 2012-10-03 03:00:00 | 0.52 |
| 2012-10-03 04:00:00 | 0.52 |
| 2012-10-03 05:00:00 | 0.52 |
| 2012-10-03 06:00:00 | 0.52 |
| 2012-10-03 07:00:00 | 0.52 |
| 2012-10-03 08:00:00 | 0.52 |
| 2012-10-03 09:00:00 | 0.78 |
| 2012-10-03 10:00:00 | 0.78 |
| 2012-10-03 11:00:00 | 0.52 |
| 2012-10-03 12:00:00 | 0.78 |
| 2012-10-03 13:00:00 | 0.52 |
| 2012-10-03 14:00:00 | 0.52 |
| 2012-10-03 15:00:00 | 0.52 |
| 2012-10-03 16:00:00 | 0.52 |
| 2012-10-03 17:00:00 | 0.52 |
| 2012-10-03 18:00:00 | 0.52 |
| 2012-10-03 19:00:00 | 0.52 |
| 2012-10-03 20:00:00 | 0.52 |
| 2012-10-03 21:00:00 | 0.52 |
| 2012-10-03 22:00:00 | 0.52 |
| 2012-10-03 23:00:00 | 0.52 |
| 2012-10-04 | 0.52 |
| 2012-10-04 01:00:00 | 0.52 |
| 2012-10-04 02:00:00 | 0.52 |
| 2012-10-04 03:00:00 | 0.52 |
| 2012-10-04 04:00:00 | 0.52 |
| 2012-10-04 05:00:00 | 0.52 |
| 2012-10-04 06:00:00 | 0.52 |
| 2012-10-04 07:00:00 | 0.52 |
| 2012-10-04 08:00:00 | 0.78 |
| 2012-10-04 09:00:00 | 0.52 |
| 2012-10-04 10:00:00 | 0.52 |
| 2012-10-04 11:00:00 | 1.3 |
| 2012-10-04 12:00:00 | 1.3 |
| 2012-10-04 13:00:00 | 1.3 |
| 2012-10-04 14:00:00 | 0.52 |
| 2012-10-04 15:00:00 | 0.52 |
| 2012-10-04 16:00:00 | 0.78 |
| 2012-10-04 17:00:00 | 0.52 |
| 2012-10-04 18:00:00 | 0.52 |
| 2012-10-04 19:00:00 | 0.78 |
| 2012-10-04 20:00:00 | 1.56 |
| 2012-10-04 21:00:00 | 1.56 |
| 2012-10-04 22:00:00 | 1.3 |
| 2012-10-04 23:00:00 | 1.56 |
| 2012-10-05 | 1.56 |
| 2012-10-05 01:00:00 | 1.3 |
| 2012-10-05 02:00:00 | 1.56 |
| 2012-10-05 03:00:00 | 1.56 |
| 2012-10-05 04:00:00 | 1.56 |
| 2012-10-05 05:00:00 | 1.56 |
| 2012-10-05 06:00:00 | 1.3 |
| 2012-10-05 07:00:00 | 1.04 |
| 2012-10-05 08:00:00 | 0.52 |
| 2012-10-05 09:00:00 | 0.52 |
| 2012-10-05 10:00:00 | 0.52 |
| 2012-10-05 11:00:00 | 0.52 |
| 2012-10-05 12:00:00 | 0.52 |
| 2012-10-05 13:00:00 | 0.52 |
| 2012-10-05 14:00:00 | 0.52 |
| 2012-10-05 15:00:00 | 0.52 |
| 2012-10-05 16:00:00 | 0.78 |
| 2012-10-05 17:00:00 | 0.52 |
| 2012-10-05 18:00:00 | 0.52 |
| 2012-10-05 19:00:00 | 0.78 |
| 2012-10-05 20:00:00 | 1.56 |
| 2012-10-05 21:00:00 | 1.56 |
| 2012-10-05 22:00:00 | 1.3 |
| 2012-10-05 23:00:00 | 1.56 |
| 2012-10-06 | 1.56 |
| 2012-10-06 01:00:00 | 1.56 |
| 2012-10-06 02:00:00 | 1.56 |
| 2012-10-06 03:00:00 | 1.3 |
| 2012-10-06 04:00:00 | 1.56 |
| 2012-10-06 05:00:00 | 1.56 |
| 2012-10-06 06:00:00 | 1.56 |
| 2012-10-06 07:00:00 | 1.04 |
| 2012-10-06 08:00:00 | 0.52 |
| 2012-10-06 09:00:00 | 0.52 |
| 2012-10-06 10:00:00 | 0.52 |
| 2012-10-06 11:00:00 | 0.52 |
| 2012-10-06 12:00:00 | 0.52 |
| 2012-10-06 13:00:00 | 0.52 |
| 2012-10-06 14:00:00 | 0.52 |
| 2012-10-06 15:00:00 | 0.52 |
| 2012-10-06 16:00:00 | 0.52 |
| 2012-10-06 17:00:00 | 0.52 |
| 2012-10-06 18:00:00 | 0.52 |
| 2012-10-06 19:00:00 | 1.04 |
| 2012-10-06 20:00:00 | 1.56 |
| 2012-10-06 21:00:00 | 1.56 |
| 2012-10-06 22:00:00 | 1.3 |
| 2012-10-06 23:00:00 | 1.56 |
| 2012-10-07 | 1.56 |
| 2012-10-07 01:00:00 | 1.56 |
| 2012-10-07 02:00:00 | 1.3 |
| 2012-10-07 03:00:00 | 1.56 |
| 2012-10-07 04:00:00 | 1.56 |
| 2012-10-07 05:00:00 | 1.56 |
| 2012-10-07 06:00:00 | 1.3 |
| 2012-10-07 07:00:00 | 1.56 |
| 2012-10-07 08:00:00 | 0.52 |
| 2012-10-07 09:00:00 | 0.52 |
| 2012-10-07 10:00:00 | 0.52 |
| 2012-10-07 11:00:00 | 0.52 |
| 2012-10-07 12:00:00 | 0.52 |
| 2012-10-07 13:00:00 | 0.52 |
| 2012-10-07 14:00:00 | 0.52 |
| 2012-10-07 15:00:00 | 0.52 |
| 2012-10-07 16:00:00 | 0.52 |
| 2012-10-07 17:00:00 | 0.52 |
| 2012-10-07 18:00:00 | 0.52 |
| 2012-10-07 19:00:00 | 1.04 |
| 2012-10-07 20:00:00 | 1.3 |
| 2012-10-07 21:00:00 | 1.56 |
| 2012-10-07 22:00:00 | 1.56 |
| 2012-10-07 23:00:00 | 1.56 |
| 2012-10-08 | 1.3 |
| 2012-10-08 01:00:00 | 1.56 |
| 2012-10-08 02:00:00 | 1.56 |
| 2012-10-08 03:00:00 | 1.56 |
| 2012-10-08 04:00:00 | 1.3 |
| 2012-10-08 05:00:00 | 1.56 |
| 2012-10-08 06:00:00 | 1.56 |
| 2012-10-08 07:00:00 | 1.04 |
| 2012-10-08 08:00:00 | 0.78 |
| 2012-10-08 09:00:00 | 0.52 |
| 2012-10-08 10:00:00 | 0.52 |
| 2012-10-08 11:00:00 | 0.52 |
| 2012-10-08 12:00:00 | 0.52 |
| 2012-10-08 13:00:00 | 0.52 |
| 2012-10-08 14:00:00 | 0.52 |
| 2012-10-08 15:00:00 | 0.52 |
| 2012-10-08 16:00:00 | 0.52 |
| 2012-10-08 17:00:00 | 0.52 |
| 2012-10-08 18:00:00 | 0.78 |
| 2012-10-08 19:00:00 | 1.04 |
| 2012-10-08 20:00:00 | 1.56 |
| 2012-10-08 21:00:00 | 1.3 |
| 2012-10-08 22:00:00 | 1.56 |
| 2012-10-08 23:00:00 | 1.56 |
| 2012-10-09 | 1.56 |
| 2012-10-09 01:00:00 | 1.3 |
| 2012-10-09 02:00:00 | 1.56 |
| 2012-10-09 03:00:00 | 1.56 |
| 2012-10-09 04:00:00 | 1.56 |
| 2012-10-09 05:00:00 | 1.56 |
| 2012-10-09 06:00:00 | 1.3 |
| 2012-10-09 07:00:00 | 1.3 |
| 2012-10-09 08:00:00 | 0.52 |
| 2012-10-09 09:00:00 | 0.52 |
| 2012-10-09 10:00:00 | 0.78 |
| 2012-10-09 11:00:00 | 0.52 |
| 2012-10-09 12:00:00 | 0.52 |
| 2012-10-09 13:00:00 | 0.52 |
| 2012-10-09 14:00:00 | 0.52 |
| 2012-10-09 15:00:00 | 0.78 |
| 2012-10-09 16:00:00 | 0.52 |
| 2012-10-09 17:00:00 | 0.52 |
| 2012-10-09 18:00:00 | 0.52 |
| 2012-10-09 19:00:00 | 1.04 |
| 2012-10-09 20:00:00 | 1.56 |
| 2012-10-09 21:00:00 | 1.3 |
| 2012-10-09 22:00:00 | 1.56 |
| 2012-10-09 23:00:00 | 1.56 |
| 2012-10-10 | 1.56 |
| 2012-10-10 01:00:00 | 1.56 |
| 2012-10-10 02:00:00 | 1.56 |
| 2012-10-10 03:00:00 | 1.3 |
| 2012-10-10 04:00:00 | 1.56 |
| 2012-10-10 05:00:00 | 1.56 |
| 2012-10-10 06:00:00 | 1.56 |
| 2012-10-10 07:00:00 | 1.04 |
| 2012-10-10 08:00:00 | 0.52 |
| 2012-10-10 09:00:00 | 0.78 |
| 2012-10-10 10:00:00 | 0.52 |
| 2012-10-10 11:00:00 | 0.52 |
| 2012-10-10 12:00:00 | 0.52 |
| 2012-10-10 13:00:00 | 0.52 |
| 2012-10-10 14:00:00 | 0.52 |
| 2012-10-10 15:00:00 | 0.52 |
| 2012-10-10 16:00:00 | 0.52 |
| 2012-10-10 17:00:00 | 0.52 |
| 2012-10-10 18:00:00 | 0.78 |
| 2012-10-10 19:00:00 | 1.04 |
| 2012-10-10 20:00:00 | 1.56 |
| 2012-10-10 21:00:00 | 1.56 |
| 2012-10-10 22:00:00 | 1.3 |
| 2012-10-10 23:00:00 | 1.56 |
| 2012-10-11 | 1.56 |
| 2012-10-11 01:00:00 | 1.56 |
| 2012-10-11 02:00:00 | 1.56 |
| 2012-10-11 03:00:00 | 1.56 |
| 2012-10-11 04:00:00 | 1.3 |
| 2012-10-11 05:00:00 | 1.56 |
| 2012-10-11 06:00:00 | 1.56 |
| 2012-10-11 07:00:00 | 1.3 |
| 2012-10-11 08:00:00 | 0.52 |
| 2012-10-11 09:00:00 | 0.52 |
| 2012-10-11 10:00:00 | 0.52 |
| 2012-10-11 11:00:00 | 0.78 |
| 2012-10-11 12:00:00 | 0.52 |
| 2012-10-11 13:00:00 | 0.52 |
| 2012-10-11 14:00:00 | 0.52 |
| 2012-10-11 15:00:00 | 0.52 |
| 2012-10-11 16:00:00 | 0.52 |
| 2012-10-11 17:00:00 | 0.52 |
| 2012-10-11 18:00:00 | 0.52 |
| 2012-10-11 19:00:00 | 1.3 |
| 2012-10-11 20:00:00 | 1.56 |
| 2012-10-11 21:00:00 | 1.3 |
| 2012-10-11 22:00:00 | 1.56 |
| 2012-10-11 23:00:00 | 1.56 |
| 2012-10-12 | 1.56 |
| 2012-10-12 01:00:00 | 1.56 |
| 2012-10-12 02:00:00 | 1.56 |
| 2012-10-12 03:00:00 | 1.56 |
| 2012-10-12 04:00:00 | 1.3 |
| 2012-10-12 05:00:00 | 1.56 |
| 2012-10-12 06:00:00 | 1.56 |
| 2012-10-12 07:00:00 | 1.3 |
| 2012-10-12 08:00:00 | 0.52 |
| 2012-10-12 09:00:00 | 0.52 |
| 2012-10-12 10:00:00 | 0.52 |
| 2012-10-12 11:00:00 | 0.78 |
| 2012-10-12 12:00:00 | 0.52 |
| 2012-10-12 13:00:00 | 0.52 |
| 2012-10-12 14:00:00 | 0.52 |
| 2012-10-12 15:00:00 | 0.52 |
| 2012-10-12 16:00:00 | 0.52 |
| 2012-10-12 17:00:00 | 0.78 |
| 2012-10-12 18:00:00 | 0.52 |
| 2012-10-12 19:00:00 | 1.04 |
| 2012-10-12 20:00:00 | 1.56 |
| 2012-10-12 21:00:00 | 1.56 |
| 2012-10-12 22:00:00 | 1.56 |
| 2012-10-12 23:00:00 | 1.56 |
| 2012-10-13 | 1.56 |
| 2012-10-13 01:00:00 | 1.56 |
| 2012-10-13 02:00:00 | 1.3 |
| 2012-10-13 03:00:00 | 1.56 |
| 2012-10-13 04:00:00 | 1.56 |
| 2012-10-13 05:00:00 | 1.56 |
| 2012-10-13 06:00:00 | 1.56 |
| 2012-10-13 07:00:00 | 1.56 |
| 2012-10-13 08:00:00 | 0.52 |
| 2012-10-13 09:00:00 | 0.52 |
| 2012-10-13 10:00:00 | 0.52 |
| 2012-10-13 11:00:00 | 0.52 |
| 2012-10-13 12:00:00 | 0.52 |
| 2012-10-13 13:00:00 | 0.52 |
| 2012-10-13 14:00:00 | 0.78 |
| 2012-10-13 15:00:00 | 0.52 |
| 2012-10-13 16:00:00 | 0.52 |
| 2012-10-13 17:00:00 | 0.52 |
| 2012-10-13 18:00:00 | 0.52 |
| 2012-10-13 19:00:00 | 1.3 |
| 2012-10-13 20:00:00 | 1.56 |
| 2012-10-13 21:00:00 | 1.56 |
| 2012-10-13 22:00:00 | 1.3 |
| 2012-10-13 23:00:00 | 1.56 |
| 2012-10-14 | 1.56 |
| 2012-10-14 01:00:00 | 1.56 |
| 2012-10-14 02:00:00 | 1.56 |
| 2012-10-14 03:00:00 | 1.56 |
| 2012-10-14 04:00:00 | 1.56 |
| 2012-10-14 05:00:00 | 1.56 |
| 2012-10-14 06:00:00 | 1.56 |
| 2012-10-14 07:00:00 | 1.3 |
| 2012-10-14 08:00:00 | 0.52 |
| 2012-10-14 09:00:00 | 0.78 |
| 2012-10-14 10:00:00 | 0.52 |
| 2012-10-14 11:00:00 | 0.52 |
| 2012-10-14 12:00:00 | 0.52 |
| 2012-10-14 13:00:00 | 0.52 |
| 2012-10-14 14:00:00 | 0.52 |
| 2012-10-14 15:00:00 | 0.78 |
| 2012-10-14 16:00:00 | 0.52 |
| 2012-10-14 17:00:00 | 0.52 |
| 2012-10-14 18:00:00 | 0.52 |
| 2012-10-14 19:00:00 | 1.3 |
| 2012-10-14 20:00:00 | 1.3 |
| 2012-10-14 21:00:00 | 1.56 |
| 2012-10-14 22:00:00 | 1.56 |
| 2012-10-14 23:00:00 | 1.56 |
| 2012-10-15 | 1.56 |
| 2012-10-15 01:00:00 | 1.56 |
| 2012-10-15 02:00:00 | 1.56 |
| 2012-10-15 03:00:00 | 1.56 |
| 2012-10-15 04:00:00 | 1.3 |
| 2012-10-15 05:00:00 | 1.56 |
| 2012-10-15 06:00:00 | 1.56 |
| 2012-10-15 07:00:00 | 1.3 |
| 2012-10-15 08:00:00 | 0.78 |
| 2012-10-15 09:00:00 | 0.78 |
| 2012-10-15 10:00:00 | 0.52 |
| 2012-10-15 11:00:00 | 0.52 |
| 2012-10-15 12:00:00 | 0.52 |
| 2012-10-15 13:00:00 | 0.78 |
| 2012-10-15 14:00:00 | 0.52 |
| 2012-10-15 15:00:00 | 0.52 |
| 2012-10-15 16:00:00 | 0.52 |
| 2012-10-15 17:00:00 | 0.52 |
| 2012-10-15 18:00:00 | 0.52 |
| 2012-10-15 19:00:00 | 1.3 |
| 2012-10-15 20:00:00 | 1.56 |
| 2012-10-15 21:00:00 | 1.56 |
| 2012-10-15 22:00:00 | 1.56 |
| 2012-10-15 23:00:00 | 1.56 |
| 2012-10-16 | 1.3 |
| 2012-10-16 01:00:00 | 1.56 |
| 2012-10-16 02:00:00 | 1.56 |
| 2012-10-16 03:00:00 | 1.56 |
| 2012-10-16 04:00:00 | 1.56 |
| 2012-10-16 05:00:00 | 1.56 |
| 2012-10-16 06:00:00 | 1.56 |
| 2012-10-16 07:00:00 | 1.3 |
| 2012-10-16 08:00:00 | 0.78 |
| 2012-10-16 09:00:00 | 0.52 |
| 2012-10-16 10:00:00 | 0.52 |
| 2012-10-16 11:00:00 | 0.52 |
| 2012-10-16 12:00:00 | 0.52 |
| 2012-10-16 13:00:00 | 0.78 |
| 2012-10-16 14:00:00 | 0.52 |
| 2012-10-16 15:00:00 | 0.52 |
| 2012-10-16 16:00:00 | 0.52 |
| 2012-10-16 17:00:00 | 0.78 |
| 2012-10-16 18:00:00 | 0.52 |
| 2012-10-16 19:00:00 | 1.56 |
| 2012-10-16 20:00:00 | 1.56 |
| 2012-10-16 21:00:00 | 1.56 |
| 2012-10-16 22:00:00 | 1.56 |
| 2012-10-16 23:00:00 | 1.56 |
| 2012-10-17 | 1.82 |
| 2012-10-17 01:00:00 | 1.56 |
| 2012-10-17 02:00:00 | 1.56 |
| 2012-10-17 03:00:00 | 1.56 |
| 2012-10-17 04:00:00 | 1.56 |
| 2012-10-17 05:00:00 | 1.56 |
| 2012-10-17 06:00:00 | 1.56 |
| 2012-10-17 07:00:00 | 1.56 |
| 2012-10-17 08:00:00 | 0.52 |
| 2012-10-17 09:00:00 | 0.52 |
| 2012-10-17 10:00:00 | 0.78 |
| 2012-10-17 11:00:00 | 0.52 |
| 2012-10-17 12:00:00 | 0.78 |
| 2012-10-17 13:00:00 | 0.52 |
| 2012-10-17 14:00:00 | 0.52 |
| 2012-10-17 15:00:00 | 0.78 |
| 2012-10-17 16:00:00 | 0.52 |
| 2012-10-17 17:00:00 | 0.78 |
| 2012-10-17 18:00:00 | 0.52 |
| 2012-10-17 19:00:00 | 1.3 |
| 2012-10-17 20:00:00 | 1.56 |
| 2012-10-17 21:00:00 | 1.56 |
| 2012-10-17 22:00:00 | 1.56 |
| 2012-10-17 23:00:00 | 1.56 |
| 2012-10-18 | 1.82 |
| 2012-10-18 01:00:00 | 1.56 |
| 2012-10-18 02:00:00 | 1.56 |
| 2012-10-18 03:00:00 | 1.56 |
| 2012-10-18 04:00:00 | 1.56 |
| 2012-10-18 05:00:00 | 1.56 |
| 2012-10-18 06:00:00 | 1.56 |
| 2012-10-18 07:00:00 | 1.56 |
| 2012-10-18 08:00:00 | 0.78 |
| 2012-10-18 09:00:00 | 0.52 |
| 2012-10-18 10:00:00 | 0.78 |
| 2012-10-18 11:00:00 | 0.52 |
| 2012-10-18 12:00:00 | 0.78 |
| 2012-10-18 13:00:00 | 0.52 |
| 2012-10-18 14:00:00 | 0.78 |
| 2012-10-18 15:00:00 | 0.52 |
| 2012-10-18 16:00:00 | 0.78 |
| 2012-10-18 17:00:00 | 0.52 |
| 2012-10-18 18:00:00 | 0.78 |
| 2012-10-18 19:00:00 | 1.3 |
| 2012-10-18 20:00:00 | 1.56 |
| 2012-10-18 21:00:00 | 1.56 |
| 2012-10-18 22:00:00 | 1.56 |
| 2012-10-18 23:00:00 | 1.82 |
| 2012-10-19 | 1.56 |
| 2012-10-19 01:00:00 | 1.56 |
| 2012-10-19 02:00:00 | 1.56 |
| 2012-10-19 03:00:00 | 1.56 |
| 2012-10-19 04:00:00 | 1.82 |
| 2012-10-19 05:00:00 | 1.56 |
| 2012-10-19 06:00:00 | 1.56 |
| 2012-10-19 07:00:00 | 1.56 |
| 2012-10-19 08:00:00 | 0.52 |
| 2012-10-19 09:00:00 | 0.78 |
| 2012-10-19 10:00:00 | 0.78 |
| 2012-10-19 11:00:00 | 0.52 |
| 2012-10-19 12:00:00 | 0.78 |
| 2012-10-19 13:00:00 | 0.52 |
| 2012-10-19 14:00:00 | 0.78 |
| 2012-10-19 15:00:00 | 0.52 |
| 2012-10-19 16:00:00 | 0.78 |
| 2012-10-19 17:00:00 | 0.52 |
| 2012-10-19 18:00:00 | 0.78 |
| 2012-10-19 19:00:00 | 1.56 |
| 2012-10-19 20:00:00 | 1.56 |
| 2012-10-19 21:00:00 | 1.56 |
| 2012-10-19 22:00:00 | 1.56 |
| 2012-10-19 23:00:00 | 1.56 |
| 2012-10-20 | 1.82 |
| 2012-10-20 01:00:00 | 1.56 |
| 2012-10-20 02:00:00 | 1.56 |
| 2012-10-20 03:00:00 | 1.56 |
| 2012-10-20 04:00:00 | 1.82 |
| 2012-10-20 05:00:00 | 1.56 |
| 2012-10-20 06:00:00 | 1.56 |
| 2012-10-20 07:00:00 | 1.56 |
| 2012-10-20 08:00:00 | 0.52 |
| 2012-10-20 09:00:00 | 0.78 |
| 2012-10-20 10:00:00 | 0.78 |
| 2012-10-20 11:00:00 | 0.52 |
| 2012-10-20 12:00:00 | 0.78 |
| 2012-10-20 13:00:00 | 0.52 |
| 2012-10-20 14:00:00 | 0.78 |
| 2012-10-20 15:00:00 | 0.52 |
| 2012-10-20 16:00:00 | 0.78 |
| 2012-10-20 17:00:00 | 0.52 |
| 2012-10-20 18:00:00 | 0.78 |
| 2012-10-20 19:00:00 | 1.3 |
| 2012-10-20 20:00:00 | 1.56 |
| 2012-10-20 21:00:00 | 1.82 |
| 2012-10-20 22:00:00 | 1.56 |
| 2012-10-20 23:00:00 | 1.56 |
| 2012-10-21 | 1.56 |
| 2012-10-21 01:00:00 | 1.82 |
| 2012-10-21 02:00:00 | 1.56 |
| 2012-10-21 03:00:00 | 1.56 |
| 2012-10-21 04:00:00 | 1.56 |
| 2012-10-21 05:00:00 | 1.82 |
| 2012-10-21 06:00:00 | 1.56 |
| 2012-10-21 07:00:00 | 1.56 |
| 2012-10-21 08:00:00 | 0.52 |
| 2012-10-21 09:00:00 | 0.78 |
| 2012-10-21 10:00:00 | 0.52 |
| 2012-10-21 11:00:00 | 0.78 |
| 2012-10-21 12:00:00 | 0.52 |
| 2012-10-21 13:00:00 | 0.78 |
| 2012-10-21 14:00:00 | 0.78 |
| 2012-10-21 15:00:00 | 0.52 |
| 2012-10-21 16:00:00 | 0.78 |
| 2012-10-21 17:00:00 | 0.52 |
| 2012-10-21 18:00:00 | 0.78 |
| 2012-10-21 19:00:00 | 1.3 |
| 2012-10-21 20:00:00 | 1.82 |
| 2012-10-21 21:00:00 | 1.56 |
| 2012-10-21 22:00:00 | 1.56 |
| 2012-10-21 23:00:00 | 1.56 |
| 2012-10-22 | 1.82 |
| 2012-10-22 01:00:00 | 1.56 |
| 2012-10-22 02:00:00 | 1.56 |
| 2012-10-22 03:00:00 | 1.56 |
| 2012-10-22 04:00:00 | 1.82 |
| 2012-10-22 05:00:00 | 1.56 |
| 2012-10-22 06:00:00 | 1.56 |
| 2012-10-22 07:00:00 | 1.56 |
| 2012-10-22 08:00:00 | 0.78 |
| 2012-10-22 09:00:00 | 0.52 |
| 2012-10-22 10:00:00 | 0.78 |
| 2012-10-22 11:00:00 | 0.78 |
| 2012-10-22 12:00:00 | 1.04 |
| 2012-10-22 13:00:00 | 0.52 |
| 2012-10-22 14:00:00 | 0.78 |
| 2012-10-22 15:00:00 | 0.52 |
| 2012-10-22 16:00:00 | 0.78 |
| 2012-10-22 17:00:00 | 0.78 |
| 2012-10-22 18:00:00 | 0.52 |
| 2012-10-22 19:00:00 | 1.82 |
| 2012-10-22 20:00:00 | 1.56 |
| 2012-10-22 21:00:00 | 1.56 |
| 2012-10-22 22:00:00 | 1.56 |
| 2012-10-22 23:00:00 | 1.82 |
| 2012-10-23 | 1.56 |
| 2012-10-23 01:00:00 | 1.56 |
| 2012-10-23 02:00:00 | 1.56 |
| 2012-10-23 03:00:00 | 1.82 |
| 2012-10-23 04:00:00 | 1.56 |
| 2012-10-23 05:00:00 | 1.56 |
| 2012-10-23 06:00:00 | 1.82 |
| 2012-10-23 07:00:00 | 1.56 |
| 2012-10-23 08:00:00 | 0.78 |
| 2012-10-23 09:00:00 | 0.78 |
| 2012-10-23 10:00:00 | 0.52 |
| 2012-10-23 11:00:00 | 0.78 |
| 2012-10-23 12:00:00 | 0.78 |
| 2012-10-23 13:00:00 | 0.52 |
| 2012-10-23 14:00:00 | 0.78 |
| 2012-10-23 15:00:00 | 0.52 |
| 2012-10-23 16:00:00 | 0.78 |
| 2012-10-23 17:00:00 | 0.78 |
| 2012-10-23 18:00:00 | 0.52 |
| 2012-10-23 19:00:00 | 1.82 |
| 2012-10-23 20:00:00 | 1.56 |
| 2012-10-23 21:00:00 | 1.56 |
| 2012-10-23 22:00:00 | 1.82 |
| 2012-10-23 23:00:00 | 1.56 |
| 2012-10-24 | 1.56 |
| 2012-10-24 01:00:00 | 1.82 |
| 2012-10-24 02:00:00 | 1.56 |
| 2012-10-24 03:00:00 | 1.56 |
| 2012-10-24 04:00:00 | 1.56 |
| 2012-10-24 05:00:00 | 1.82 |
| 2012-10-24 06:00:00 | 1.56 |
| 2012-10-24 07:00:00 | 1.56 |
| 2012-10-24 08:00:00 | 0.78 |
| 2012-10-24 09:00:00 | 0.78 |
| 2012-10-24 10:00:00 | 0.78 |
| 2012-10-24 11:00:00 | 0.78 |
| 2012-10-24 12:00:00 | 0.78 |
| 2012-10-24 13:00:00 | 0.78 |
| 2012-10-24 14:00:00 | 0.52 |
| 2012-10-24 15:00:00 | 0.78 |
| 2012-10-24 16:00:00 | 0.78 |
| 2012-10-24 17:00:00 | 0.52 |
| 2012-10-24 18:00:00 | 0.78 |
| 2012-10-24 19:00:00 | 1.56 |
| 2012-10-24 20:00:00 | 1.82 |
| 2012-10-24 21:00:00 | 1.56 |
| 2012-10-24 22:00:00 | 1.56 |
| 2012-10-24 23:00:00 | 1.82 |
| 2012-10-25 | 1.56 |
| 2012-10-25 01:00:00 | 1.56 |
| 2012-10-25 02:00:00 | 1.56 |
| 2012-10-25 03:00:00 | 1.82 |
| 2012-10-25 04:00:00 | 1.56 |
| 2012-10-25 05:00:00 | 1.82 |
| 2012-10-25 06:00:00 | 1.56 |
| 2012-10-25 07:00:00 | 1.56 |
| 2012-10-25 08:00:00 | 0.78 |
| 2012-10-25 09:00:00 | 0.78 |
| 2012-10-25 10:00:00 | 0.78 |
| 2012-10-25 11:00:00 | 0.52 |
| 2012-10-25 12:00:00 | 0.78 |
| 2012-10-25 13:00:00 | 0.78 |
| 2012-10-25 14:00:00 | 0.52 |
| 2012-10-25 15:00:00 | 0.78 |
| 2012-10-25 16:00:00 | 0.52 |
| 2012-10-25 17:00:00 | 0.78 |
| 2012-10-25 18:00:00 | 0.78 |
| 2012-10-25 19:00:00 | 1.56 |
| 2012-10-25 20:00:00 | 1.56 |
| 2012-10-25 21:00:00 | 1.82 |
| 2012-10-25 22:00:00 | 1.56 |
| 2012-10-25 23:00:00 | 1.56 |
| 2012-10-26 | 1.56 |
| 2012-10-26 01:00:00 | 1.82 |
| 2012-10-26 02:00:00 | 1.56 |
| 2012-10-26 03:00:00 | 1.56 |
| 2012-10-26 04:00:00 | 1.56 |
| 2012-10-26 05:00:00 | 1.82 |
| 2012-10-26 06:00:00 | 1.56 |
| 2012-10-26 07:00:00 | 1.56 |
| 2012-10-26 08:00:00 | 0.78 |
| 2012-10-26 09:00:00 | 0.78 |
| 2012-10-26 10:00:00 | 0.52 |
| 2012-10-26 11:00:00 | 0.78 |
| 2012-10-26 12:00:00 | 0.52 |
| 2012-10-26 13:00:00 | 0.78 |
| 2012-10-26 14:00:00 | 0.52 |
| 2012-10-26 15:00:00 | 0.78 |
| 2012-10-26 16:00:00 | 0.52 |
| 2012-10-26 17:00:00 | 0.78 |
| 2012-10-26 18:00:00 | 0.78 |
| 2012-10-26 19:00:00 | 1.56 |
| 2012-10-26 20:00:00 | 1.56 |
| 2012-10-26 21:00:00 | 1.56 |
| 2012-10-26 22:00:00 | 1.56 |
| 2012-10-26 23:00:00 | 1.56 |
| 2012-10-27 | 1.56 |
| 2012-10-27 01:00:00 | 1.56 |
| 2012-10-27 02:00:00 | 1.56 |
| 2012-10-27 03:00:00 | 1.56 |
| 2012-10-27 04:00:00 | 1.56 |
| 2012-10-27 05:00:00 | 1.56 |
| 2012-10-27 06:00:00 | 1.56 |
| 2012-10-27 07:00:00 | 1.56 |
| 2012-10-27 08:00:00 | 1.04 |
| 2012-10-27 09:00:00 | 0.52 |
| 2012-10-27 10:00:00 | 0.78 |
| 2012-10-27 11:00:00 | 0.52 |
| 2012-10-27 12:00:00 | 0.78 |
| 2012-10-27 13:00:00 | 0.78 |
| 2012-10-27 14:00:00 | 0.52 |
| 2012-10-27 15:00:00 | 0.78 |
| 2012-10-27 16:00:00 | 0.78 |
| 2012-10-27 17:00:00 | 0.52 |
| 2012-10-27 18:00:00 | 1.04 |
| 2012-10-27 19:00:00 | 1.56 |
| 2012-10-27 20:00:00 | 1.82 |
| 2012-10-27 21:00:00 | 1.56 |
| 2012-10-27 22:00:00 | 1.82 |
| 2012-10-27 23:00:00 | 1.56 |
| 2012-10-28 | 1.82 |
| 2012-10-28 01:00:00 | 1.56 |
| 2012-10-28 02:00:00 | 1.82 |
| 2012-10-28 02:00:00 | 1.82 |
| 2012-10-28 03:00:00 | 1.56 |
| 2012-10-28 04:00:00 | 1.82 |
| 2012-10-28 05:00:00 | 1.56 |
| 2012-10-28 06:00:00 | 1.82 |
| 2012-10-28 07:00:00 | 1.04 |
| 2012-10-28 08:00:00 | 0.78 |
| 2012-10-28 09:00:00 | 0.78 |
| 2012-10-28 10:00:00 | 0.78 |
| 2012-10-28 11:00:00 | 0.78 |
| 2012-10-28 12:00:00 | 0.78 |
| 2012-10-28 13:00:00 | 0.78 |
| 2012-10-28 14:00:00 | 0.78 |
| 2012-10-28 15:00:00 | 0.78 |
| 2012-10-28 16:00:00 | 0.78 |
| 2012-10-28 17:00:00 | 1.04 |
| 2012-10-28 18:00:00 | 1.56 |
| 2012-10-28 19:00:00 | 1.82 |
| 2012-10-28 20:00:00 | 1.56 |
| 2012-10-28 21:00:00 | 1.82 |
| 2012-10-28 22:00:00 | 1.82 |
| 2012-10-28 23:00:00 | 1.56 |
| 2012-10-29 | 1.82 |
| 2012-10-29 01:00:00 | 1.82 |
| 2012-10-29 02:00:00 | 1.56 |
| 2012-10-29 03:00:00 | 1.82 |
| 2012-10-29 04:00:00 | 1.82 |
| 2012-10-29 05:00:00 | 1.56 |
| 2012-10-29 06:00:00 | 1.82 |
| 2012-10-29 07:00:00 | 1.04 |
| 2012-10-29 08:00:00 | 0.78 |
| 2012-10-29 09:00:00 | 0.78 |
| 2012-10-29 10:00:00 | 0.78 |
| 2012-10-29 11:00:00 | 0.78 |
| 2012-10-29 12:00:00 | 0.78 |
| 2012-10-29 13:00:00 | 0.78 |
| 2012-10-29 14:00:00 | 0.78 |
| 2012-10-29 15:00:00 | 0.78 |
| 2012-10-29 16:00:00 | 0.78 |
| 2012-10-29 17:00:00 | 1.04 |
| 2012-10-29 18:00:00 | 1.82 |
| 2012-10-29 19:00:00 | 1.56 |
| 2012-10-29 20:00:00 | 1.82 |
| 2012-10-29 21:00:00 | 1.56 |
| 2012-10-29 22:00:00 | 1.82 |
| 2012-10-29 23:00:00 | 1.56 |
| 2012-10-30 | 1.82 |
| 2012-10-30 01:00:00 | 1.56 |
| 2012-10-30 02:00:00 | 1.82 |
| 2012-10-30 03:00:00 | 1.56 |
| 2012-10-30 04:00:00 | 1.82 |
| 2012-10-30 05:00:00 | 1.56 |
| 2012-10-30 06:00:00 | 1.82 |
| 2012-10-30 07:00:00 | 0.78 |
| 2012-10-30 08:00:00 | 0.78 |
| 2012-10-30 09:00:00 | 0.78 |
| 2012-10-30 10:00:00 | 0.78 |
| 2012-10-30 11:00:00 | 0.78 |
| 2012-10-30 12:00:00 | 0.78 |
| 2012-10-30 13:00:00 | 0.78 |
| 2012-10-30 14:00:00 | 0.78 |
| 2012-10-30 15:00:00 | 0.78 |
| 2012-10-30 16:00:00 | 0.52 |
| 2012-10-30 17:00:00 | 1.04 |
| 2012-10-30 18:00:00 | 1.56 |
| 2012-10-30 19:00:00 | 1.82 |
| 2012-10-30 20:00:00 | 1.56 |
| 2012-10-30 21:00:00 | 1.82 |
| 2012-10-30 22:00:00 | 1.56 |
| 2012-10-30 23:00:00 | 1.82 |
| 2012-10-31 | 1.56 |
| 2012-10-31 01:00:00 | 1.56 |
| 2012-10-31 02:00:00 | 1.82 |
| 2012-10-31 03:00:00 | 1.56 |
| 2012-10-31 04:00:00 | 1.82 |
| 2012-10-31 05:00:00 | 1.56 |
| 2012-10-31 06:00:00 | 1.82 |
| 2012-10-31 07:00:00 | 1.04 |
| 2012-10-31 08:00:00 | 0.78 |
| 2012-10-31 09:00:00 | 0.78 |
| 2012-10-31 10:00:00 | 0.78 |
| 2012-10-31 11:00:00 | 0.78 |
| 2012-10-31 12:00:00 | 0.78 |
| 2012-10-31 13:00:00 | 0.78 |
| 2012-10-31 14:00:00 | 0.78 |
| 2012-10-31 15:00:00 | 0.78 |
| 2012-10-31 16:00:00 | 0.78 |
| 2012-10-31 17:00:00 | 1.04 |
| 2012-10-31 18:00:00 | 1.56 |
| 2012-10-31 19:00:00 | 1.56 |
| 2012-10-31 20:00:00 | 1.82 |
| 2012-10-31 21:00:00 | 1.56 |
| 2012-10-31 22:00:00 | 1.82 |
| 2012-10-31 23:00:00 | 1.56 |
| 2012-11-01 | 1.82 |
| 2012-11-01 01:00:00 | 1.56 |
| 2012-11-01 02:00:00 | 1.82 |
| 2012-11-01 03:00:00 | 1.56 |
| 2012-11-01 04:00:00 | 1.56 |
| 2012-11-01 05:00:00 | 1.82 |
| 2012-11-01 06:00:00 | 1.56 |
| 2012-11-01 07:00:00 | 1.04 |
| 2012-11-01 08:00:00 | 0.78 |
| 2012-11-01 09:00:00 | 0.78 |
| 2012-11-01 10:00:00 | 0.78 |
| 2012-11-01 11:00:00 | 0.78 |
| 2012-11-01 12:00:00 | 0.78 |
| 2012-11-01 13:00:00 | 0.78 |
| 2012-11-01 14:00:00 | 0.52 |
| 2012-11-01 15:00:00 | 0.78 |
| 2012-11-01 16:00:00 | 0.78 |
| 2012-11-01 17:00:00 | 1.3 |
| 2012-11-01 18:00:00 | 1.56 |
| 2012-11-01 19:00:00 | 1.56 |
| 2012-11-01 20:00:00 | 1.82 |
| 2012-11-01 21:00:00 | 1.56 |
| 2012-11-01 22:00:00 | 1.82 |
| 2012-11-01 23:00:00 | 1.56 |
| 2012-11-02 | 1.82 |
| 2012-11-02 01:00:00 | 1.56 |
| 2012-11-02 02:00:00 | 1.56 |
| 2012-11-02 03:00:00 | 1.82 |
| 2012-11-02 04:00:00 | 1.56 |
| 2012-11-02 05:00:00 | 1.82 |
| 2012-11-02 06:00:00 | 1.56 |
| 2012-11-02 07:00:00 | 1.04 |
| 2012-11-02 08:00:00 | 0.78 |
| 2012-11-02 09:00:00 | 0.78 |
| 2012-11-02 10:00:00 | 0.52 |
| 2012-11-02 11:00:00 | 0.78 |
| 2012-11-02 12:00:00 | 0.78 |
| 2012-11-02 13:00:00 | 1.82 |
| 2012-11-02 14:00:00 | 1.3 |
| 2012-11-02 15:00:00 | 0.78 |
| 2012-11-02 16:00:00 | 0.52 |
| 2012-11-02 17:00:00 | 1.04 |
| 2012-11-02 18:00:00 | 1.82 |
| 2012-11-02 19:00:00 | 1.56 |
| 2012-11-02 20:00:00 | 1.56 |
| 2012-11-02 21:00:00 | 1.82 |
| 2012-11-02 22:00:00 | 1.56 |
| 2012-11-02 23:00:00 | 1.82 |
| 2012-11-03 | 1.56 |
| 2012-11-03 01:00:00 | 1.82 |
| 2012-11-03 02:00:00 | 1.56 |
| 2012-11-03 03:00:00 | 1.56 |
| 2012-11-03 04:00:00 | 1.82 |
| 2012-11-03 05:00:00 | 1.56 |
| 2012-11-03 06:00:00 | 1.82 |
| 2012-11-03 07:00:00 | 1.04 |
| 2012-11-03 08:00:00 | 0.78 |
| 2012-11-03 09:00:00 | 0.78 |
| 2012-11-03 10:00:00 | 0.52 |
| 2012-11-03 11:00:00 | 0.78 |
| 2012-11-03 12:00:00 | 0.78 |
| 2012-11-03 13:00:00 | 0.78 |
| 2012-11-03 14:00:00 | 0.78 |
| 2012-11-03 15:00:00 | 0.78 |
| 2012-11-03 16:00:00 | 0.78 |
| 2012-11-03 17:00:00 | 1.04 |
| 2012-11-03 18:00:00 | 1.56 |
| 2012-11-03 19:00:00 | 1.56 |
| 2012-11-03 20:00:00 | 1.56 |
| 2012-11-03 21:00:00 | 1.82 |
| 2012-11-03 22:00:00 | 1.56 |
| 2012-11-03 23:00:00 | 1.56 |
| 2012-11-04 | 1.82 |
| 2012-11-04 01:00:00 | 1.56 |
| 2012-11-04 02:00:00 | 1.82 |
| 2012-11-04 03:00:00 | 1.56 |
| 2012-11-04 04:00:00 | 1.56 |
| 2012-11-04 05:00:00 | 1.82 |
| 2012-11-04 06:00:00 | 1.56 |
| 2012-11-04 07:00:00 | 1.3 |
| 2012-11-04 08:00:00 | 0.52 |
| 2012-11-04 09:00:00 | 0.78 |
| 2012-11-04 10:00:00 | 0.78 |
| 2012-11-04 11:00:00 | 0.78 |
| 2012-11-04 12:00:00 | 0.78 |
| 2012-11-04 13:00:00 | 0.78 |
| 2012-11-04 14:00:00 | 0.52 |
| 2012-11-04 15:00:00 | 0.78 |
| 2012-11-04 16:00:00 | 0.78 |
| 2012-11-04 17:00:00 | 1.04 |
| 2012-11-04 18:00:00 | 1.56 |
| 2012-11-04 19:00:00 | 1.82 |
| 2012-11-04 20:00:00 | 1.56 |
| 2012-11-04 21:00:00 | 1.56 |
| 2012-11-04 22:00:00 | 1.82 |
| 2012-11-04 23:00:00 | 1.56 |
| 2012-11-05 | 1.82 |
| 2012-11-05 01:00:00 | 1.56 |
| 2012-11-05 02:00:00 | 1.56 |
| 2012-11-05 03:00:00 | 1.82 |
| 2012-11-05 04:00:00 | 1.56 |
| 2012-11-05 05:00:00 | 1.82 |
| 2012-11-05 06:00:00 | 1.56 |
| 2012-11-05 07:00:00 | 1.56 |
| 2012-11-05 08:00:00 | 1.82 |
| 2012-11-05 09:00:00 | 1.82 |
| 2012-11-05 10:00:00 | 1.04 |
| 2012-11-05 11:00:00 | 1.04 |
| 2012-11-05 12:00:00 | 1.04 |
| 2012-11-05 13:00:00 | 1.3 |
| 2012-11-05 14:00:00 | 0.78 |
| 2012-11-05 15:00:00 | 1.04 |
| 2012-11-05 16:00:00 | 1.04 |
| 2012-11-05 17:00:00 | 1.3 |
| 2012-11-05 18:00:00 | 1.82 |
| 2012-11-05 19:00:00 | 1.82 |
| 2012-11-05 20:00:00 | 1.82 |
| 2012-11-05 21:00:00 | 2.08 |
| 2012-11-05 22:00:00 | 1.82 |
| 2012-11-05 23:00:00 | 1.82 |
| 2012-11-06 | 1.82 |
| 2012-11-06 01:00:00 | 1.82 |
| 2012-11-06 02:00:00 | 1.82 |
| 2012-11-06 03:00:00 | 1.82 |
| 2012-11-06 04:00:00 | 1.82 |
| 2012-11-06 05:00:00 | 1.56 |
| 2012-11-06 06:00:00 | 1.82 |
| 2012-11-06 07:00:00 | 1.3 |
| 2012-11-06 08:00:00 | 0.78 |
| 2012-11-06 09:00:00 | 1.04 |
| 2012-11-06 10:00:00 | 0.78 |
| 2012-11-06 11:00:00 | 0.78 |
| 2012-11-06 12:00:00 | 1.04 |
| 2012-11-06 13:00:00 | 0.78 |
| 2012-11-06 14:00:00 | 0.78 |
| 2012-11-06 15:00:00 | 0.78 |
| 2012-11-06 16:00:00 | 0.78 |
| 2012-11-06 17:00:00 | 1.3 |
| 2012-11-06 18:00:00 | 1.82 |
| 2012-11-06 19:00:00 | 1.56 |
| 2012-11-06 20:00:00 | 1.82 |
| 2012-11-06 21:00:00 | 1.56 |
| 2012-11-06 22:00:00 | 1.82 |
| 2012-11-06 23:00:00 | 1.56 |
| 2012-11-07 | 1.82 |
| 2012-11-07 01:00:00 | 1.82 |
| 2012-11-07 02:00:00 | 1.56 |
| 2012-11-07 03:00:00 | 1.82 |
| 2012-11-07 04:00:00 | 1.56 |
| 2012-11-07 05:00:00 | 1.82 |
| 2012-11-07 06:00:00 | 1.56 |
| 2012-11-07 07:00:00 | 1.3 |
| 2012-11-07 08:00:00 | 0.78 |
| 2012-11-07 09:00:00 | 0.78 |
| 2012-11-07 10:00:00 | 0.78 |
| 2012-11-07 11:00:00 | 0.78 |
| 2012-11-07 12:00:00 | 0.78 |
| 2012-11-07 13:00:00 | 0.78 |
| 2012-11-07 14:00:00 | 0.78 |
| 2012-11-07 15:00:00 | 0.78 |
| 2012-11-07 16:00:00 | 0.78 |
| 2012-11-07 17:00:00 | 1.3 |
| 2012-11-07 18:00:00 | 1.56 |
| 2012-11-07 19:00:00 | 1.56 |
| 2012-11-07 20:00:00 | 1.82 |
| 2012-11-07 21:00:00 | 1.56 |
| 2012-11-07 22:00:00 | 1.82 |
| 2012-11-07 23:00:00 | 1.56 |
| 2012-11-08 | 1.82 |
| 2012-11-08 01:00:00 | 1.56 |
| 2012-11-08 02:00:00 | 1.82 |
| 2012-11-08 03:00:00 | 1.82 |
| 2012-11-08 04:00:00 | 1.56 |
| 2012-11-08 05:00:00 | 1.82 |
| 2012-11-08 06:00:00 | 1.56 |
| 2012-11-08 07:00:00 | 1.3 |
| 2012-11-08 08:00:00 | 0.78 |
| 2012-11-08 09:00:00 | 1.04 |
| 2012-11-08 10:00:00 | 0.78 |
| 2012-11-08 11:00:00 | 0.78 |
| 2012-11-08 12:00:00 | 0.78 |
| 2012-11-08 13:00:00 | 0.78 |
| 2012-11-08 14:00:00 | 0.78 |
| 2012-11-08 15:00:00 | 0.78 |
| 2012-11-08 16:00:00 | 0.78 |
| 2012-11-08 17:00:00 | 1.04 |
| 2012-11-08 18:00:00 | 1.82 |
| 2012-11-08 19:00:00 | 1.56 |
| 2012-11-08 20:00:00 | 1.82 |
| 2012-11-08 21:00:00 | 1.56 |
| 2012-11-08 22:00:00 | 1.56 |
| 2012-11-08 23:00:00 | 1.82 |
| 2012-11-09 | 1.56 |
| 2012-11-09 01:00:00 | 1.82 |
| 2012-11-09 02:00:00 | 1.56 |
| 2012-11-09 03:00:00 | 1.82 |
| 2012-11-09 04:00:00 | 1.56 |
| 2012-11-09 05:00:00 | 1.82 |
| 2012-11-09 06:00:00 | 1.56 |
| 2012-11-09 07:00:00 | 1.3 |
| 2012-11-09 08:00:00 | 0.78 |
| 2012-11-09 09:00:00 | 0.78 |
| 2012-11-09 10:00:00 | 0.78 |
| 2012-11-09 11:00:00 | 0.78 |
| 2012-11-09 12:00:00 | 0.78 |
| 2012-11-09 13:00:00 | 0.78 |
| 2012-11-09 14:00:00 | 0.78 |
| 2012-11-09 15:00:00 | 0.78 |
| 2012-11-09 16:00:00 | 0.52 |
| 2012-11-09 17:00:00 | 1.3 |
| 2012-11-09 18:00:00 | 1.56 |
| 2012-11-09 19:00:00 | 1.82 |
| 2012-11-09 20:00:00 | 1.56 |
| 2012-11-09 21:00:00 | 1.82 |
| 2012-11-09 22:00:00 | 1.56 |
| 2012-11-09 23:00:00 | 1.82 |
| 2012-11-10 | 1.56 |
| 2012-11-10 01:00:00 | 1.82 |
| 2012-11-10 02:00:00 | 1.56 |
| 2012-11-10 03:00:00 | 1.82 |
| 2012-11-10 04:00:00 | 1.56 |
| 2012-11-10 05:00:00 | 1.56 |
| 2012-11-10 06:00:00 | 1.82 |
| 2012-11-10 07:00:00 | 1.3 |
| 2012-11-10 08:00:00 | 0.78 |
| 2012-11-10 09:00:00 | 0.78 |
| 2012-11-10 10:00:00 | 0.52 |
| 2012-11-10 11:00:00 | 0.78 |
| 2012-11-10 12:00:00 | 0.78 |
| 2012-11-10 13:00:00 | 0.78 |
| 2012-11-10 14:00:00 | 0.78 |
| 2012-11-10 15:00:00 | 0.78 |
| 2012-11-10 16:00:00 | 0.78 |
| 2012-11-10 17:00:00 | 1.3 |
| 2012-11-10 18:00:00 | 1.56 |
| 2012-11-10 19:00:00 | 1.82 |
| 2012-11-10 20:00:00 | 1.56 |
| 2012-11-10 21:00:00 | 1.56 |
| 2012-11-10 22:00:00 | 1.82 |
| 2012-11-10 23:00:00 | 1.56 |
| 2012-11-11 | 1.82 |
| 2012-11-11 01:00:00 | 1.56 |
| 2012-11-11 02:00:00 | 1.82 |
| 2012-11-11 03:00:00 | 1.56 |
| 2012-11-11 04:00:00 | 1.56 |
| 2012-11-11 05:00:00 | 1.82 |
| 2012-11-11 06:00:00 | 1.56 |
| 2012-11-11 07:00:00 | 1.3 |
| 2012-11-11 08:00:00 | 0.78 |
| 2012-11-11 09:00:00 | 0.78 |
| 2012-11-11 10:00:00 | 0.78 |
| 2012-11-11 11:00:00 | 0.78 |
| 2012-11-11 12:00:00 | 0.78 |
| 2012-11-11 13:00:00 | 0.78 |
| 2012-11-11 14:00:00 | 0.78 |
| 2012-11-11 15:00:00 | 0.78 |
| 2012-11-11 16:00:00 | 0.78 |
| 2012-11-11 17:00:00 | 1.3 |
| 2012-11-11 18:00:00 | 1.56 |
| 2012-11-11 19:00:00 | 1.56 |
| 2012-11-11 20:00:00 | 1.82 |
| 2012-11-11 21:00:00 | 1.56 |
| 2012-11-11 22:00:00 | 1.82 |
| 2012-11-11 23:00:00 | 1.56 |
| 2012-11-12 | 1.82 |
| 2012-11-12 01:00:00 | 1.56 |
| 2012-11-12 02:00:00 | 1.82 |
| 2012-11-12 03:00:00 | 1.56 |
| 2012-11-12 04:00:00 | 1.82 |
| 2012-11-12 05:00:00 | 1.56 |
| 2012-11-12 06:00:00 | 1.82 |
| 2012-11-12 07:00:00 | 1.3 |
| 2012-11-12 08:00:00 | 0.78 |
| 2012-11-12 09:00:00 | 0.78 |
| 2012-11-12 10:00:00 | 0.78 |
| 2012-11-12 11:00:00 | 0.78 |
| 2012-11-12 12:00:00 | 0.52 |
| 2012-11-12 13:00:00 | 1.04 |
| 2012-11-12 14:00:00 | 0.78 |
| 2012-11-12 15:00:00 | 0.78 |
| 2012-11-12 16:00:00 | 6.76 |
| 2012-11-12 17:00:00 | 23.4 |
| 2012-11-12 18:00:00 | 9.62 |
| 2012-11-12 19:00:00 | 1.82 |
| 2012-11-12 20:00:00 | 1.56 |
| 2012-11-12 21:00:00 | 1.82 |
| 2012-11-12 22:00:00 | 1.82 |
| 2012-11-12 23:00:00 | 1.56 |
| 2012-11-13 | 1.82 |
| 2012-11-13 01:00:00 | 1.82 |
| 2012-11-13 02:00:00 | 1.56 |
| 2012-11-13 03:00:00 | 1.82 |
| 2012-11-13 04:00:00 | 1.82 |
| 2012-11-13 05:00:00 | 1.82 |
| 2012-11-13 06:00:00 | 1.56 |
| 2012-11-13 07:00:00 | 1.56 |
| 2012-11-13 08:00:00 | 0.78 |
| 2012-11-13 09:00:00 | 1.04 |
| 2012-11-13 10:00:00 | 1.04 |
| 2012-11-13 11:00:00 | 0.78 |
| 2012-11-13 12:00:00 | 0.78 |
| 2012-11-13 13:00:00 | 0.78 |
| 2012-11-13 14:00:00 | 0.78 |
| 2012-11-13 15:00:00 | 0.78 |
| 2012-11-13 16:00:00 | 0.78 |
| 2012-11-13 17:00:00 | 1.3 |
| 2012-11-13 18:00:00 | 1.82 |
| 2012-11-13 19:00:00 | 1.82 |
| 2012-11-13 20:00:00 | 1.82 |
| 2012-11-13 21:00:00 | 1.82 |
| 2012-11-13 22:00:00 | 1.82 |
| 2012-11-13 23:00:00 | 1.56 |
| 2012-11-14 | 1.82 |
| 2012-11-14 01:00:00 | 1.82 |
| 2012-11-14 02:00:00 | 1.82 |
| 2012-11-14 03:00:00 | 1.56 |
| 2012-11-14 04:00:00 | 1.82 |
| 2012-11-14 05:00:00 | 1.56 |
| 2012-11-14 06:00:00 | 1.82 |
| 2012-11-14 07:00:00 | 1.3 |
| 2012-11-14 08:00:00 | 0.78 |
| 2012-11-14 09:00:00 | 0.78 |
| 2012-11-14 10:00:00 | 0.78 |
| 2012-11-14 11:00:00 | 0.78 |
| 2012-11-14 12:00:00 | 0.78 |
| 2012-11-14 13:00:00 | 0.78 |
| 2012-11-14 14:00:00 | 0.78 |
| 2012-11-14 15:00:00 | 0.78 |
| 2012-11-14 16:00:00 | 0.78 |
| 2012-11-14 17:00:00 | 1.3 |
| 2012-11-14 18:00:00 | 1.56 |
| 2012-11-14 19:00:00 | 1.82 |
| 2012-11-14 20:00:00 | 1.56 |
| 2012-11-14 21:00:00 | 1.82 |
| 2012-11-14 22:00:00 | 1.56 |
| 2012-11-14 23:00:00 | 1.82 |
| 2012-11-15 | 1.82 |
| 2012-11-15 01:00:00 | 1.56 |
| 2012-11-15 02:00:00 | 1.82 |
| 2012-11-15 03:00:00 | 1.82 |
| 2012-11-15 04:00:00 | 1.56 |
| 2012-11-15 05:00:00 | 1.82 |
| 2012-11-15 06:00:00 | 1.82 |
| 2012-11-15 07:00:00 | 1.3 |
| 2012-11-15 08:00:00 | 0.78 |
| 2012-11-15 09:00:00 | 0.78 |
| 2012-11-15 10:00:00 | 0.78 |
| 2012-11-15 11:00:00 | 0.78 |
| 2012-11-15 12:00:00 | 0.78 |
| 2012-11-15 13:00:00 | 65.52 |
| 2012-11-15 14:00:00 | 79.56 |
| 2012-11-15 15:00:00 | 29.64 |
| 2012-11-15 16:00:00 | 1.56 |
| 2012-11-15 17:00:00 | 2.86 |
| 2012-11-15 18:00:00 | 1.82 |
| 2012-11-15 19:00:00 | 1.56 |
| 2012-11-15 20:00:00 | 1.82 |
| 2012-11-15 21:00:00 | 1.82 |
| 2012-11-15 22:00:00 | 1.56 |
| 2012-11-15 23:00:00 | 1.82 |
| 2012-11-16 | 1.82 |
| 2012-11-16 01:00:00 | 1.56 |
| 2012-11-16 02:00:00 | 1.82 |
| 2012-11-16 03:00:00 | 1.82 |
| 2012-11-16 04:00:00 | 1.56 |
| 2012-11-16 05:00:00 | 1.82 |
| 2012-11-16 06:00:00 | 1.82 |
| 2012-11-16 07:00:00 | 1.3 |
| 2012-11-16 08:00:00 | 0.78 |
| 2012-11-16 09:00:00 | 2.34 |
| 2012-11-16 10:00:00 | 0.78 |
| 2012-11-16 11:00:00 | 1.04 |
| 2012-11-16 12:00:00 | 76.96 |
| 2012-11-16 13:00:00 | 69.42 |
| 2012-11-16 14:00:00 | 105.56 |
| 2012-11-16 15:00:00 | 14.04 |
| 2012-11-16 16:00:00 | 53.82 |
| 2012-11-16 17:00:00 | 55.9 |
| 2012-11-16 18:00:00 | 56.94 |
| 2012-11-16 19:00:00 | 59.54 |
| 2012-11-16 20:00:00 | 59.54 |
| 2012-11-16 21:00:00 | 59.8 |
| 2012-11-16 22:00:00 | 59.54 |
| 2012-11-16 23:00:00 | 59.54 |
| 2012-11-17 | 59.54 |
| 2012-11-17 01:00:00 | 59.54 |
| 2012-11-17 02:00:00 | 59.54 |
| 2012-11-17 03:00:00 | 59.28 |
| 2012-11-17 04:00:00 | 59.54 |
| 2012-11-17 05:00:00 | 59.54 |
| 2012-11-17 06:00:00 | 59.8 |
| 2012-11-17 07:00:00 | 59.54 |
| 2012-11-17 08:00:00 | 58.76 |
| 2012-11-17 09:00:00 | 58.5 |
| 2012-11-17 10:00:00 | 29.9 |
| 2012-11-17 11:00:00 | 60.32 |
| 2012-11-17 12:00:00 | 60.32 |
| 2012-11-17 13:00:00 | 60.06 |
| 2012-11-17 14:00:00 | 60.06 |
| 2012-11-17 15:00:00 | 60.32 |
| 2012-11-17 16:00:00 | 60.06 |
| 2012-11-17 17:00:00 | 60.58 |
| 2012-11-17 18:00:00 | 61.1 |
| 2012-11-17 19:00:00 | 61.1 |
| 2012-11-17 20:00:00 | 60.84 |
| 2012-11-17 21:00:00 | 61.1 |
| 2012-11-17 22:00:00 | 61.1 |
| 2012-11-17 23:00:00 | 61.1 |
| 2012-11-18 | 60.84 |
| 2012-11-18 01:00:00 | 61.1 |
| 2012-11-18 02:00:00 | 60.84 |
| 2012-11-18 03:00:00 | 61.1 |
| 2012-11-18 04:00:00 | 60.58 |
| 2012-11-18 05:00:00 | 60.84 |
| 2012-11-18 06:00:00 | 60.58 |
| 2012-11-18 07:00:00 | 60.58 |
| 2012-11-18 08:00:00 | 59.8 |
| 2012-11-18 09:00:00 | 59.8 |
| 2012-11-18 10:00:00 | 59.8 |
| 2012-11-18 11:00:00 | 60.06 |
| 2012-11-18 12:00:00 | 59.8 |
| 2012-11-18 13:00:00 | 59.8 |
| 2012-11-18 14:00:00 | 59.8 |
| 2012-11-18 15:00:00 | 59.8 |
| 2012-11-18 16:00:00 | 60.06 |
| 2012-11-18 17:00:00 | 61.1 |
| 2012-11-18 18:00:00 | 60.84 |
| 2012-11-18 19:00:00 | 60.84 |
| 2012-11-18 20:00:00 | 61.1 |
| 2012-11-18 21:00:00 | 60.84 |
| 2012-11-18 22:00:00 | 61.1 |
| 2012-11-18 23:00:00 | 61.1 |
| 2012-11-19 | 60.84 |
| 2012-11-19 01:00:00 | 61.1 |
| 2012-11-19 02:00:00 | 61.1 |
| 2012-11-19 03:00:00 | 61.1 |
| 2012-11-19 04:00:00 | 60.84 |
| 2012-11-19 05:00:00 | 61.1 |
| 2012-11-19 06:00:00 | 60.84 |
| 2012-11-19 07:00:00 | 60.58 |
| 2012-11-19 08:00:00 | 71.76 |
| 2012-11-19 09:00:00 | 59.54 |
| 2012-11-19 10:00:00 | 59.54 |
| 2012-11-19 11:00:00 | 59.54 |
| 2012-11-19 12:00:00 | 59.8 |
| 2012-11-19 13:00:00 | 64.74 |
| 2012-11-19 14:00:00 | 91.52 |
| 2012-11-19 15:00:00 | 92.04 |
| 2012-11-19 16:00:00 | 91.78 |
| 2012-11-19 17:00:00 | 92.56 |
| 2012-11-19 18:00:00 | 92.82 |
| 2012-11-19 19:00:00 | 92.82 |
| 2012-11-19 20:00:00 | 93.08 |
| 2012-11-19 21:00:00 | 92.82 |
| 2012-11-19 22:00:00 | 92.82 |
| 2012-11-19 23:00:00 | 93.08 |
| 2012-11-20 | 93.08 |
| 2012-11-20 01:00:00 | 93.08 |
| 2012-11-20 02:00:00 | 93.08 |
| 2012-11-20 03:00:00 | 93.08 |
| 2012-11-20 04:00:00 | 93.08 |
| 2012-11-20 05:00:00 | 93.34 |
| 2012-11-20 06:00:00 | 92.82 |
| 2012-11-20 07:00:00 | 92.56 |
| 2012-11-20 08:00:00 | 91.52 |
| 2012-11-20 09:00:00 | 91.78 |
| 2012-11-20 10:00:00 | 91.52 |
| 2012-11-20 11:00:00 | 91.78 |
| 2012-11-20 12:00:00 | 91.52 |
| 2012-11-20 13:00:00 | 91.78 |
| 2012-11-20 14:00:00 | 91.78 |
| 2012-11-20 15:00:00 | 91.78 |
| 2012-11-20 16:00:00 | 91.52 |
| 2012-11-20 17:00:00 | 92.3 |
| 2012-11-20 18:00:00 | 92.82 |
| 2012-11-20 19:00:00 | 92.82 |
| 2012-11-20 20:00:00 | 92.82 |
| 2012-11-20 21:00:00 | 93.08 |
| 2012-11-20 22:00:00 | 93.08 |
| 2012-11-20 23:00:00 | 93.08 |
| 2012-11-21 | 93.08 |
| 2012-11-21 01:00:00 | 93.34 |
| 2012-11-21 02:00:00 | 93.34 |
| 2012-11-21 03:00:00 | 93.34 |
| 2012-11-21 04:00:00 | 93.34 |
| 2012-11-21 05:00:00 | 93.34 |
| 2012-11-21 06:00:00 | 93.08 |
| 2012-11-21 07:00:00 | 92.82 |
| 2012-11-21 08:00:00 | 91.78 |
| 2012-11-21 09:00:00 | 91.78 |
| 2012-11-21 10:00:00 | 91.78 |
| 2012-11-21 11:00:00 | 92.04 |
| 2012-11-21 12:00:00 | 91.78 |
| 2012-11-21 13:00:00 | 92.04 |
| 2012-11-21 14:00:00 | 92.04 |
| 2012-11-21 15:00:00 | 92.04 |
| 2012-11-21 16:00:00 | 92.04 |
| 2012-11-21 17:00:00 | 92.3 |
| 2012-11-21 18:00:00 | 93.08 |
| 2012-11-21 19:00:00 | 93.08 |
| 2012-11-21 20:00:00 | 92.82 |
| 2012-11-21 21:00:00 | 93.08 |
| 2012-11-21 22:00:00 | 93.34 |
| 2012-11-21 23:00:00 | 93.08 |
| 2012-11-22 | 93.6 |
| 2012-11-22 01:00:00 | 93.34 |
| 2012-11-22 02:00:00 | 93.34 |
| 2012-11-22 03:00:00 | 93.08 |
| 2012-11-22 04:00:00 | 93.34 |
| 2012-11-22 05:00:00 | 93.34 |
| 2012-11-22 06:00:00 | 93.08 |
| 2012-11-22 07:00:00 | 92.82 |
| 2012-11-22 08:00:00 | 91.78 |
| 2012-11-22 09:00:00 | 92.04 |
| 2012-11-22 10:00:00 | 91.78 |
| 2012-11-22 11:00:00 | 92.3 |
| 2012-11-22 12:00:00 | 91.78 |
| 2012-11-22 13:00:00 | 92.04 |
| 2012-11-22 14:00:00 | 92.3 |
| 2012-11-22 15:00:00 | 92.04 |
| 2012-11-22 16:00:00 | 91.78 |
| 2012-11-22 17:00:00 | 92.56 |
| 2012-11-22 18:00:00 | 92.82 |
| 2012-11-22 19:00:00 | 93.08 |
| 2012-11-22 20:00:00 | 93.08 |
| 2012-11-22 21:00:00 | 92.82 |
| 2012-11-22 22:00:00 | 93.34 |
| 2012-11-22 23:00:00 | 93.08 |
| 2012-11-23 | 93.08 |
| 2012-11-23 01:00:00 | 93.34 |
| 2012-11-23 02:00:00 | 93.34 |
| 2012-11-23 03:00:00 | 93.08 |
| 2012-11-23 04:00:00 | 93.34 |
| 2012-11-23 05:00:00 | 93.08 |
| 2012-11-23 06:00:00 | 92.82 |
| 2012-11-23 07:00:00 | 92.82 |
| 2012-11-23 08:00:00 | 91.52 |
| 2012-11-23 09:00:00 | 91.78 |
| 2012-11-23 10:00:00 | 91.78 |
| 2012-11-23 11:00:00 | 91.78 |
| 2012-11-23 12:00:00 | 91.52 |
| 2012-11-23 13:00:00 | 91.78 |
| 2012-11-23 14:00:00 | 91.78 |
| 2012-11-23 15:00:00 | 92.04 |
| 2012-11-23 16:00:00 | 91.78 |
| 2012-11-23 17:00:00 | 92.3 |
| 2012-11-23 18:00:00 | 92.82 |
| 2012-11-23 19:00:00 | 92.82 |
| 2012-11-23 20:00:00 | 93.08 |
| 2012-11-23 21:00:00 | 92.82 |
| 2012-11-23 22:00:00 | 93.08 |
| 2012-11-23 23:00:00 | 93.08 |
| 2012-11-24 | 93.08 |
| 2012-11-24 01:00:00 | 93.08 |
| 2012-11-24 02:00:00 | 92.82 |
| 2012-11-24 03:00:00 | 93.08 |
| 2012-11-24 04:00:00 | 93.08 |
| 2012-11-24 05:00:00 | 93.08 |
| 2012-11-24 06:00:00 | 93.08 |
| 2012-11-24 07:00:00 | 92.82 |
| 2012-11-24 08:00:00 | 92.04 |
| 2012-11-24 09:00:00 | 92.04 |
| 2012-11-24 10:00:00 | 91.78 |
| 2012-11-24 11:00:00 | 91.78 |
| 2012-11-24 12:00:00 | 92.04 |
| 2012-11-24 13:00:00 | 91.78 |
| 2012-11-24 14:00:00 | 92.04 |
| 2012-11-24 15:00:00 | 91.78 |
| 2012-11-24 16:00:00 | 92.04 |
| 2012-11-24 17:00:00 | 92.3 |
| 2012-11-24 18:00:00 | 92.82 |
| 2012-11-24 19:00:00 | 92.82 |
| 2012-11-24 20:00:00 | 92.82 |
| 2012-11-24 21:00:00 | 93.08 |
| 2012-11-24 22:00:00 | 93.08 |
| 2012-11-24 23:00:00 | 92.82 |
| 2012-11-25 | 93.08 |
| 2012-11-25 01:00:00 | 93.08 |
| 2012-11-25 02:00:00 | 93.08 |
| 2012-11-25 03:00:00 | 93.08 |
| 2012-11-25 04:00:00 | 93.34 |
| 2012-11-25 05:00:00 | 93.08 |
| 2012-11-25 06:00:00 | 93.08 |
| 2012-11-25 07:00:00 | 92.82 |
| 2012-11-25 08:00:00 | 92.04 |
| 2012-11-25 09:00:00 | 92.04 |
| 2012-11-25 10:00:00 | 91.78 |
| 2012-11-25 11:00:00 | 92.04 |
| 2012-11-25 12:00:00 | 91.78 |
| 2012-11-25 13:00:00 | 92.04 |
| 2012-11-25 14:00:00 | 91.78 |
| 2012-11-25 15:00:00 | 92.04 |
| 2012-11-25 16:00:00 | 92.04 |
| 2012-11-25 17:00:00 | 92.3 |
| 2012-11-25 18:00:00 | 92.82 |
| 2012-11-25 19:00:00 | 92.82 |
| 2012-11-25 20:00:00 | 92.82 |
| 2012-11-25 21:00:00 | 93.08 |
| 2012-11-25 22:00:00 | 92.82 |
| 2012-11-25 23:00:00 | 93.08 |
| 2012-11-26 | 93.08 |
| 2012-11-26 01:00:00 | 92.82 |
| 2012-11-26 02:00:00 | 93.34 |
| 2012-11-26 03:00:00 | 93.08 |
| 2012-11-26 04:00:00 | 93.08 |
| 2012-11-26 05:00:00 | 93.08 |
| 2012-11-26 06:00:00 | 93.08 |
| 2012-11-26 07:00:00 | 92.56 |
| 2012-11-26 08:00:00 | 91.78 |
| 2012-11-26 09:00:00 | 91.78 |
| 2012-11-26 10:00:00 | 92.04 |
| 2012-11-26 11:00:00 | 91.78 |
| 2012-11-26 12:00:00 | 91.78 |
| 2012-11-26 13:00:00 | 91.78 |
| 2012-11-26 14:00:00 | 92.04 |
| 2012-11-26 15:00:00 | 91.78 |
| 2012-11-26 16:00:00 | 91.78 |
| 2012-11-26 17:00:00 | 92.56 |
| 2012-11-26 18:00:00 | 92.82 |
| 2012-11-26 19:00:00 | 92.82 |
| 2012-11-26 20:00:00 | 93.08 |
| 2012-11-26 21:00:00 | 93.08 |
| 2012-11-26 22:00:00 | 92.82 |
| 2012-11-26 23:00:00 | 93.08 |
| 2012-11-27 | 93.34 |
| 2012-11-27 01:00:00 | 93.08 |
| 2012-11-27 02:00:00 | 93.08 |
| 2012-11-27 03:00:00 | 93.08 |
| 2012-11-27 04:00:00 | 93.08 |
| 2012-11-27 05:00:00 | 93.08 |
| 2012-11-27 06:00:00 | 92.82 |
| 2012-11-27 07:00:00 | 92.82 |
| 2012-11-27 08:00:00 | 91.78 |
| 2012-11-27 09:00:00 | 91.78 |
| 2012-11-27 10:00:00 | 91.78 |
| 2012-11-27 11:00:00 | 91.78 |
| 2012-11-27 12:00:00 | 92.04 |
| 2012-11-27 13:00:00 | 92.04 |
| 2012-11-27 14:00:00 | 91.78 |
| 2012-11-27 15:00:00 | 92.04 |
| 2012-11-27 16:00:00 | 91.78 |
| 2012-11-27 17:00:00 | 92.56 |
| 2012-11-27 18:00:00 | 92.82 |
| 2012-11-27 19:00:00 | 92.82 |
| 2012-11-27 20:00:00 | 93.08 |
| 2012-11-27 21:00:00 | 92.82 |
| 2012-11-27 22:00:00 | 93.08 |
| 2012-11-27 23:00:00 | 93.08 |
| 2012-11-28 | 93.08 |
| 2012-11-28 01:00:00 | 93.34 |
| 2012-11-28 02:00:00 | 93.08 |
| 2012-11-28 03:00:00 | 93.08 |
| 2012-11-28 04:00:00 | 93.08 |
| 2012-11-28 05:00:00 | 93.34 |
| 2012-11-28 06:00:00 | 92.82 |
| 2012-11-28 07:00:00 | 92.82 |
| 2012-11-28 08:00:00 | 91.78 |
| 2012-11-28 09:00:00 | 91.52 |
| 2012-11-28 10:00:00 | 92.04 |
| 2012-11-28 11:00:00 | 91.78 |
| 2012-11-28 12:00:00 | 91.52 |
| 2012-11-28 13:00:00 | 91.78 |
| 2012-11-28 14:00:00 | 92.04 |
| 2012-11-28 15:00:00 | 91.78 |
| 2012-11-28 16:00:00 | 91.78 |
| 2012-11-28 17:00:00 | 92.56 |
| 2012-11-28 18:00:00 | 92.56 |
| 2012-11-28 19:00:00 | 93.08 |
| 2012-11-28 20:00:00 | 92.82 |
| 2012-11-28 21:00:00 | 92.82 |
| 2012-11-28 22:00:00 | 93.08 |
| 2012-11-28 23:00:00 | 93.08 |
| 2012-11-29 | 93.08 |
| 2012-11-29 01:00:00 | 93.08 |
| 2012-11-29 02:00:00 | 93.34 |
| 2012-11-29 03:00:00 | 93.08 |
| 2012-11-29 04:00:00 | 93.08 |
| 2012-11-29 05:00:00 | 93.08 |
| 2012-11-29 06:00:00 | 92.82 |
| 2012-11-29 07:00:00 | 92.82 |
| 2012-11-29 08:00:00 | 92.04 |
| 2012-11-29 09:00:00 | 91.52 |
| 2012-11-29 10:00:00 | 91.78 |
| 2012-11-29 11:00:00 | 91.78 |
| 2012-11-29 12:00:00 | 91.78 |
| 2012-11-29 13:00:00 | 91.78 |
| 2012-11-29 14:00:00 | 91.78 |
| 2012-11-29 15:00:00 | 91.78 |
| 2012-11-29 16:00:00 | 91.78 |
| 2012-11-29 17:00:00 | 92.3 |
| 2012-11-29 18:00:00 | 92.82 |
| 2012-11-29 19:00:00 | 92.82 |
| 2012-11-29 20:00:00 | 92.82 |
| 2012-11-29 21:00:00 | 92.82 |
| 2012-11-29 22:00:00 | 93.08 |
| 2012-11-29 23:00:00 | 93.08 |
| 2012-11-30 | 93.08 |
| 2012-11-30 01:00:00 | 92.82 |
| 2012-11-30 02:00:00 | 92.82 |
| 2012-11-30 03:00:00 | 93.08 |
| 2012-11-30 04:00:00 | 92.82 |
| 2012-11-30 05:00:00 | 92.82 |
| 2012-11-30 06:00:00 | 92.82 |
| 2012-11-30 07:00:00 | 92.56 |
| 2012-11-30 08:00:00 | 91.52 |
| 2012-11-30 09:00:00 | 91.52 |
| 2012-11-30 10:00:00 | 91.78 |
| 2012-11-30 11:00:00 | 91.78 |
| 2012-11-30 12:00:00 | 91.78 |
| 2012-11-30 13:00:00 | 91.52 |
| 2012-11-30 14:00:00 | 91.78 |
| 2012-11-30 15:00:00 | 91.78 |
| 2012-11-30 16:00:00 | 91.78 |
| 2012-11-30 17:00:00 | 92.3 |
| 2012-11-30 18:00:00 | 92.82 |
| 2012-11-30 19:00:00 | 92.82 |
| 2012-11-30 20:00:00 | 93.08 |
| 2012-11-30 21:00:00 | 92.82 |
| 2012-11-30 22:00:00 | 92.82 |
| 2012-11-30 23:00:00 | 92.82 |
| 2012-12-01 | 92.82 |
| 2012-12-01 01:00:00 | 92.82 |
| 2012-12-01 02:00:00 | 92.82 |
| 2012-12-01 03:00:00 | 92.82 |
| 2012-12-01 04:00:00 | 92.82 |
| 2012-12-01 05:00:00 | 92.82 |
| 2012-12-01 06:00:00 | 93.08 |
| 2012-12-01 07:00:00 | 92.56 |
| 2012-12-01 08:00:00 | 91.78 |
| 2012-12-01 09:00:00 | 91.78 |
| 2012-12-01 10:00:00 | 91.78 |
| 2012-12-01 11:00:00 | 91.78 |
| 2012-12-01 12:00:00 | 91.78 |
| 2012-12-01 13:00:00 | 92.04 |
| 2012-12-01 14:00:00 | 91.78 |
| 2012-12-01 15:00:00 | 92.04 |
| 2012-12-01 16:00:00 | 91.78 |
| 2012-12-01 17:00:00 | 92.56 |
| 2012-12-01 18:00:00 | 92.56 |
| 2012-12-01 19:00:00 | 92.82 |
| 2012-12-01 20:00:00 | 92.82 |
| 2012-12-01 21:00:00 | 92.82 |
| 2012-12-01 22:00:00 | 92.82 |
| 2012-12-01 23:00:00 | 92.82 |
| 2012-12-02 | 92.82 |
| 2012-12-02 01:00:00 | 93.08 |
| 2012-12-02 02:00:00 | 92.82 |
| 2012-12-02 03:00:00 | 93.08 |
| 2012-12-02 04:00:00 | 93.08 |
| 2012-12-02 05:00:00 | 92.82 |
| 2012-12-02 06:00:00 | 92.82 |
| 2012-12-02 07:00:00 | 92.56 |
| 2012-12-02 08:00:00 | 92.04 |
| 2012-12-02 09:00:00 | 91.78 |
| 2012-12-02 10:00:00 | 91.78 |
| 2012-12-02 11:00:00 | 91.78 |
| 2012-12-02 12:00:00 | 91.78 |
| 2012-12-02 13:00:00 | 91.78 |
| 2012-12-02 14:00:00 | 92.04 |
| 2012-12-02 15:00:00 | 91.78 |
| 2012-12-02 16:00:00 | 91.78 |
| 2012-12-02 17:00:00 | 92.56 |
| 2012-12-02 18:00:00 | 92.56 |
| 2012-12-02 19:00:00 | 92.56 |
| 2012-12-02 20:00:00 | 92.82 |
| 2012-12-02 21:00:00 | 92.82 |
| 2012-12-02 22:00:00 | 92.82 |
| 2012-12-02 23:00:00 | 92.82 |
| 2012-12-03 | 93.08 |
| 2012-12-03 01:00:00 | 92.56 |
| 2012-12-03 02:00:00 | 92.82 |
| 2012-12-03 03:00:00 | 93.08 |
| 2012-12-03 04:00:00 | 92.82 |
| 2012-12-03 05:00:00 | 92.82 |
| 2012-12-03 06:00:00 | 93.08 |
| 2012-12-03 07:00:00 | 92.56 |
| 2012-12-03 08:00:00 | 91.78 |
| 2012-12-03 09:00:00 | 91.52 |
| 2012-12-03 10:00:00 | 91.78 |
| 2012-12-03 11:00:00 | 91.52 |
| 2012-12-03 12:00:00 | 91.78 |
| 2012-12-03 13:00:00 | 91.52 |
| 2012-12-03 14:00:00 | 91.78 |
| 2012-12-03 15:00:00 | 91.78 |
| 2012-12-03 16:00:00 | 91.52 |
| 2012-12-03 17:00:00 | 92.3 |
| 2012-12-03 18:00:00 | 92.3 |
| 2012-12-03 19:00:00 | 92.56 |
| 2012-12-03 20:00:00 | 92.56 |
| 2012-12-03 21:00:00 | 92.56 |
| 2012-12-03 22:00:00 | 92.56 |
| 2012-12-03 23:00:00 | 92.82 |
| 2012-12-04 | 92.82 |
| 2012-12-04 01:00:00 | 92.82 |
| 2012-12-04 02:00:00 | 92.82 |
| 2012-12-04 03:00:00 | 92.82 |
| 2012-12-04 04:00:00 | 92.82 |
| 2012-12-04 05:00:00 | 92.56 |
| 2012-12-04 06:00:00 | 92.56 |
| 2012-12-04 07:00:00 | 92.3 |
| 2012-12-04 08:00:00 | 91.52 |
| 2012-12-04 09:00:00 | 91.52 |
| 2012-12-04 10:00:00 | 91.26 |
| 2012-12-04 11:00:00 | 91.52 |
| 2012-12-04 12:00:00 | 91.52 |
| 2012-12-04 13:00:00 | 91.26 |
| 2012-12-04 14:00:00 | 91.52 |
| 2012-12-04 15:00:00 | 91.52 |
| 2012-12-04 16:00:00 | 91.26 |
| 2012-12-04 17:00:00 | 92.3 |
| 2012-12-04 18:00:00 | 92.3 |
| 2012-12-04 19:00:00 | 92.56 |
| 2012-12-04 20:00:00 | 92.56 |
| 2012-12-04 21:00:00 | 92.56 |
| 2012-12-04 22:00:00 | 92.82 |
| 2012-12-04 23:00:00 | 92.56 |
| 2012-12-05 | 92.56 |
| 2012-12-05 01:00:00 | 92.82 |
| 2012-12-05 02:00:00 | 92.56 |
| 2012-12-05 03:00:00 | 92.82 |
| 2012-12-05 04:00:00 | 92.82 |
| 2012-12-05 05:00:00 | 92.56 |
| 2012-12-05 06:00:00 | 92.56 |
| 2012-12-05 07:00:00 | 92.3 |
| 2012-12-05 08:00:00 | 91.52 |
| 2012-12-05 09:00:00 | 91.52 |
| 2012-12-05 10:00:00 | 91.52 |
| 2012-12-05 11:00:00 | 91.52 |
| 2012-12-05 12:00:00 | 91.52 |
| 2012-12-05 13:00:00 | 91.52 |
| 2012-12-05 14:00:00 | 91.52 |
| 2012-12-05 15:00:00 | 91.78 |
| 2012-12-05 16:00:00 | 91.52 |
| 2012-12-05 17:00:00 | 92.04 |
| 2012-12-05 18:00:00 | 92.56 |
| 2012-12-05 19:00:00 | 92.56 |
| 2012-12-05 20:00:00 | 92.56 |
| 2012-12-05 21:00:00 | 92.56 |
| 2012-12-05 22:00:00 | 92.82 |
| 2012-12-05 23:00:00 | 92.56 |
| 2012-12-06 | 92.82 |
| 2012-12-06 01:00:00 | 92.82 |
| 2012-12-06 02:00:00 | 92.82 |
| 2012-12-06 03:00:00 | 92.82 |
| 2012-12-06 04:00:00 | 92.82 |
| 2012-12-06 05:00:00 | 92.82 |
| 2012-12-06 06:00:00 | 92.56 |
| 2012-12-06 07:00:00 | 92.3 |
| 2012-12-06 08:00:00 | 69.16 |
| 2012-12-06 09:00:00 | 0.52 |
| 2012-12-06 10:00:00 | 0.78 |
| 2012-12-06 11:00:00 | 0.78 |
| 2012-12-06 12:00:00 | 0.52 |
| 2012-12-06 13:00:00 | 20.8 |
| 2012-12-06 14:00:00 | 48.62 |
| 2012-12-06 15:00:00 | 59.02 |
| 2012-12-06 16:00:00 | 58.76 |
| 2012-12-06 17:00:00 | 79.3 |
| 2012-12-06 18:00:00 | 89.18 |
| 2012-12-06 19:00:00 | 89.7 |
| 2012-12-06 20:00:00 | 89.44 |
| 2012-12-06 21:00:00 | 89.7 |
| 2012-12-06 22:00:00 | 89.96 |
| 2012-12-06 23:00:00 | 89.7 |
| 2012-12-07 | 90.22 |
| 2012-12-07 01:00:00 | 89.96 |
| 2012-12-07 02:00:00 | 89.96 |
| 2012-12-07 03:00:00 | 90.22 |
| 2012-12-07 04:00:00 | 89.96 |
| 2012-12-07 05:00:00 | 89.96 |
| 2012-12-07 06:00:00 | 89.96 |
| 2012-12-07 07:00:00 | 89.44 |
| 2012-12-07 08:00:00 | 88.92 |
| 2012-12-07 09:00:00 | 88.66 |
| 2012-12-07 10:00:00 | 88.66 |
| 2012-12-07 11:00:00 | 88.92 |
| 2012-12-07 12:00:00 | 88.66 |
| 2012-12-07 13:00:00 | 88.92 |
| 2012-12-07 14:00:00 | 88.66 |
| 2012-12-07 15:00:00 | 88.92 |
| 2012-12-07 16:00:00 | 88.92 |
| 2012-12-07 17:00:00 | 89.18 |
| 2012-12-07 18:00:00 | 89.7 |
| 2012-12-07 19:00:00 | 89.7 |
| 2012-12-07 20:00:00 | 89.7 |
| 2012-12-07 21:00:00 | 89.96 |
| 2012-12-07 22:00:00 | 89.96 |
| 2012-12-07 23:00:00 | 89.7 |
| 2012-12-08 | 89.96 |
| 2012-12-08 01:00:00 | 90.22 |
| 2012-12-08 02:00:00 | 89.96 |
| 2012-12-08 03:00:00 | 89.96 |
| 2012-12-08 04:00:00 | 89.96 |
| 2012-12-08 05:00:00 | 89.96 |
| 2012-12-08 06:00:00 | 89.96 |
| 2012-12-08 07:00:00 | 89.96 |
| 2012-12-08 08:00:00 | 89.18 |
| 2012-12-08 09:00:00 | 88.66 |
| 2012-12-08 10:00:00 | 88.66 |
| 2012-12-08 11:00:00 | 88.92 |
| 2012-12-08 12:00:00 | 88.92 |
| 2012-12-08 13:00:00 | 88.66 |
| 2012-12-08 14:00:00 | 88.92 |
| 2012-12-08 15:00:00 | 88.92 |
| 2012-12-08 16:00:00 | 88.92 |
| 2012-12-08 17:00:00 | 89.44 |
| 2012-12-08 18:00:00 | 89.7 |
| 2012-12-08 19:00:00 | 89.7 |
| 2012-12-08 20:00:00 | 89.7 |
| 2012-12-08 21:00:00 | 89.96 |
| 2012-12-08 22:00:00 | 89.96 |
| 2012-12-08 23:00:00 | 89.7 |
| 2012-12-09 | 89.96 |
| 2012-12-09 01:00:00 | 89.96 |
| 2012-12-09 02:00:00 | 89.96 |
| 2012-12-09 03:00:00 | 89.96 |
| 2012-12-09 04:00:00 | 89.96 |
| 2012-12-09 05:00:00 | 89.96 |
| 2012-12-09 06:00:00 | 89.96 |
| 2012-12-09 07:00:00 | 89.7 |
| 2012-12-09 08:00:00 | 89.18 |
| 2012-12-09 09:00:00 | 88.66 |
| 2012-12-09 10:00:00 | 88.66 |
| 2012-12-09 11:00:00 | 88.92 |
| 2012-12-09 12:00:00 | 88.66 |
| 2012-12-09 13:00:00 | 88.66 |
| 2012-12-09 14:00:00 | 88.92 |
| 2012-12-09 15:00:00 | 88.66 |
| 2012-12-09 16:00:00 | 88.66 |
| 2012-12-09 17:00:00 | 89.44 |
| 2012-12-09 18:00:00 | 89.44 |
| 2012-12-09 19:00:00 | 89.7 |
| 2012-12-09 20:00:00 | 89.44 |
| 2012-12-09 21:00:00 | 89.7 |
| 2012-12-09 22:00:00 | 89.7 |
| 2012-12-09 23:00:00 | 89.96 |
| 2012-12-10 | 89.7 |
| 2012-12-10 01:00:00 | 89.96 |
| 2012-12-10 02:00:00 | 89.96 |
| 2012-12-10 03:00:00 | 89.7 |
| 2012-12-10 04:00:00 | 89.96 |
| 2012-12-10 05:00:00 | 89.7 |
| 2012-12-10 06:00:00 | 89.7 |
| 2012-12-10 07:00:00 | 89.44 |
| 2012-12-10 08:00:00 | 88.66 |
| 2012-12-10 09:00:00 | 88.4 |
| 2012-12-10 10:00:00 | 88.4 |
| 2012-12-10 11:00:00 | 88.66 |
| 2012-12-10 12:00:00 | 88.4 |
| 2012-12-10 13:00:00 | 88.66 |
| 2012-12-10 14:00:00 | 88.66 |
| 2012-12-10 15:00:00 | 88.4 |
| 2012-12-10 16:00:00 | 88.66 |
| 2012-12-10 17:00:00 | 88.92 |
| 2012-12-10 18:00:00 | 89.44 |
| 2012-12-10 19:00:00 | 89.44 |
| 2012-12-10 20:00:00 | 89.7 |
| 2012-12-10 21:00:00 | 89.44 |
| 2012-12-10 22:00:00 | 89.7 |
| 2012-12-10 23:00:00 | 89.7 |
| 2012-12-11 | 89.96 |
| 2012-12-11 01:00:00 | 89.96 |
| 2012-12-11 02:00:00 | 89.7 |
| 2012-12-11 03:00:00 | 89.96 |
| 2012-12-11 04:00:00 | 89.7 |
| 2012-12-11 05:00:00 | 89.96 |
| 2012-12-11 06:00:00 | 89.44 |
| 2012-12-11 07:00:00 | 89.44 |
| 2012-12-11 08:00:00 | 88.92 |
| 2012-12-11 09:00:00 | 88.4 |
| 2012-12-11 10:00:00 | 88.66 |
| 2012-12-11 11:00:00 | 88.66 |
| 2012-12-11 12:00:00 | 88.66 |
| 2012-12-11 13:00:00 | 88.66 |
| 2012-12-11 14:00:00 | 88.4 |
| 2012-12-11 15:00:00 | 88.66 |
| 2012-12-11 16:00:00 | 88.66 |
| 2012-12-11 17:00:00 | 89.18 |
| 2012-12-11 18:00:00 | 89.7 |
| 2012-12-11 19:00:00 | 89.44 |
| 2012-12-11 20:00:00 | 89.96 |
| 2012-12-11 21:00:00 | 89.7 |
| 2012-12-11 22:00:00 | 89.7 |
| 2012-12-11 23:00:00 | 89.96 |
| 2012-12-12 | 89.96 |
| 2012-12-12 01:00:00 | 89.96 |
| 2012-12-12 02:00:00 | 89.96 |
| 2012-12-12 03:00:00 | 89.96 |
| 2012-12-12 04:00:00 | 89.96 |
| 2012-12-12 05:00:00 | 89.7 |
| 2012-12-12 06:00:00 | 89.96 |
| 2012-12-12 07:00:00 | 89.44 |
| 2012-12-12 08:00:00 | 88.92 |
| 2012-12-12 09:00:00 | 88.4 |
| 2012-12-12 10:00:00 | 88.66 |
| 2012-12-12 11:00:00 | 88.66 |
| 2012-12-12 12:00:00 | 88.66 |
| 2012-12-12 13:00:00 | 88.92 |
| 2012-12-12 14:00:00 | 88.66 |
| 2012-12-12 15:00:00 | 88.66 |
| 2012-12-12 16:00:00 | 88.66 |
| 2012-12-12 17:00:00 | 89.18 |
| 2012-12-12 18:00:00 | 89.44 |
| 2012-12-12 19:00:00 | 89.7 |
| 2012-12-12 20:00:00 | 89.7 |
| 2012-12-12 21:00:00 | 89.7 |
| 2012-12-12 22:00:00 | 89.7 |
| 2012-12-12 23:00:00 | 89.96 |
| 2012-12-13 | 89.7 |
| 2012-12-13 01:00:00 | 89.96 |
| 2012-12-13 02:00:00 | 89.7 |
| 2012-12-13 03:00:00 | 89.96 |
| 2012-12-13 04:00:00 | 89.96 |
| 2012-12-13 05:00:00 | 89.7 |
| 2012-12-13 06:00:00 | 89.7 |
| 2012-12-13 07:00:00 | 89.44 |
| 2012-12-13 08:00:00 | 88.92 |
| 2012-12-13 09:00:00 | 88.4 |
| 2012-12-13 10:00:00 | 88.66 |
| 2012-12-13 11:00:00 | 88.66 |
| 2012-12-13 12:00:00 | 88.66 |
| 2012-12-13 13:00:00 | 88.66 |
| 2012-12-13 14:00:00 | 88.66 |
| 2012-12-13 15:00:00 | 88.66 |
| 2012-12-13 16:00:00 | 88.66 |
| 2012-12-13 17:00:00 | 89.18 |
| 2012-12-13 18:00:00 | 89.7 |
| 2012-12-13 19:00:00 | 89.7 |
| 2012-12-13 20:00:00 | 89.7 |
| 2012-12-13 21:00:00 | 89.7 |
| 2012-12-13 22:00:00 | 89.96 |
| 2012-12-13 23:00:00 | 89.7 |
| 2012-12-14 | 89.96 |
| 2012-12-14 01:00:00 | 89.7 |
| 2012-12-14 02:00:00 | 89.96 |
| 2012-12-14 03:00:00 | 89.96 |
| 2012-12-14 04:00:00 | 89.7 |
| 2012-12-14 05:00:00 | 89.96 |
| 2012-12-14 06:00:00 | 89.7 |
| 2012-12-14 07:00:00 | 89.44 |
| 2012-12-14 08:00:00 | 88.66 |
| 2012-12-14 09:00:00 | 88.66 |
| 2012-12-14 10:00:00 | 88.66 |
| 2012-12-14 11:00:00 | 88.66 |
| 2012-12-14 12:00:00 | 88.66 |
| 2012-12-14 13:00:00 | 88.66 |
| 2012-12-14 14:00:00 | 88.66 |
| 2012-12-14 15:00:00 | 88.66 |
| 2012-12-14 16:00:00 | 88.66 |
| 2012-12-14 17:00:00 | 89.44 |
| 2012-12-14 18:00:00 | 89.7 |
| 2012-12-14 19:00:00 | 89.7 |
| 2012-12-14 20:00:00 | 89.7 |
| 2012-12-14 21:00:00 | 89.96 |
| 2012-12-14 22:00:00 | 89.7 |
| 2012-12-14 23:00:00 | 89.96 |
| 2012-12-15 | 89.96 |
| 2012-12-15 01:00:00 | 89.7 |
| 2012-12-15 02:00:00 | 89.96 |
| 2012-12-15 03:00:00 | 89.96 |
| 2012-12-15 04:00:00 | 89.96 |
| 2012-12-15 05:00:00 | 89.96 |
| 2012-12-15 06:00:00 | 89.96 |
| 2012-12-15 07:00:00 | 89.44 |
| 2012-12-15 08:00:00 | 89.18 |
| 2012-12-15 09:00:00 | 88.66 |
| 2012-12-15 10:00:00 | 88.4 |
| 2012-12-15 11:00:00 | 88.66 |
| 2012-12-15 12:00:00 | 88.66 |
| 2012-12-15 13:00:00 | 88.66 |
| 2012-12-15 14:00:00 | 88.92 |
| 2012-12-15 15:00:00 | 88.66 |
| 2012-12-15 16:00:00 | 88.66 |
| 2012-12-15 17:00:00 | 89.44 |
| 2012-12-15 18:00:00 | 89.7 |
| 2012-12-15 19:00:00 | 89.7 |
| 2012-12-15 20:00:00 | 89.7 |
| 2012-12-15 21:00:00 | 89.7 |
| 2012-12-15 22:00:00 | 89.7 |
| 2012-12-15 23:00:00 | 89.96 |
| 2012-12-16 | 89.7 |
| 2012-12-16 01:00:00 | 89.96 |
| 2012-12-16 02:00:00 | 89.96 |
| 2012-12-16 03:00:00 | 89.96 |
| 2012-12-16 04:00:00 | 89.96 |
| 2012-12-16 05:00:00 | 89.96 |
| 2012-12-16 06:00:00 | 89.7 |
| 2012-12-16 07:00:00 | 89.7 |
| 2012-12-16 08:00:00 | 89.18 |
| 2012-12-16 09:00:00 | 88.92 |
| 2012-12-16 10:00:00 | 88.92 |
| 2012-12-16 11:00:00 | 88.92 |
| 2012-12-16 12:00:00 | 88.66 |
| 2012-12-16 13:00:00 | 88.92 |
| 2012-12-16 14:00:00 | 88.66 |
| 2012-12-16 15:00:00 | 88.92 |
| 2012-12-16 16:00:00 | 88.92 |
| 2012-12-16 17:00:00 | 89.18 |
| 2012-12-16 18:00:00 | 89.7 |
| 2012-12-16 19:00:00 | 89.7 |
| 2012-12-16 20:00:00 | 89.44 |
| 2012-12-16 21:00:00 | 89.7 |
| 2012-12-16 22:00:00 | 89.7 |
| 2012-12-16 23:00:00 | 89.96 |
| 2012-12-17 | 89.96 |
| 2012-12-17 01:00:00 | 89.96 |
| 2012-12-17 02:00:00 | 89.96 |
| 2012-12-17 03:00:00 | 90.22 |
| 2012-12-17 04:00:00 | 89.96 |
| 2012-12-17 05:00:00 | 89.96 |
| 2012-12-17 06:00:00 | 89.7 |
| 2012-12-17 07:00:00 | 89.7 |
| 2012-12-17 08:00:00 | 88.92 |
| 2012-12-17 09:00:00 | 88.66 |
| 2012-12-17 10:00:00 | 88.66 |
| 2012-12-17 11:00:00 | 88.66 |
| 2012-12-17 12:00:00 | 88.66 |
| 2012-12-17 13:00:00 | 88.66 |
| 2012-12-17 14:00:00 | 88.92 |
| 2012-12-17 15:00:00 | 88.66 |
| 2012-12-17 16:00:00 | 88.66 |
| 2012-12-17 17:00:00 | 89.44 |
| 2012-12-17 18:00:00 | 89.7 |
| 2012-12-17 19:00:00 | 89.7 |
| 2012-12-17 20:00:00 | 89.96 |
| 2012-12-17 21:00:00 | 89.7 |
| 2012-12-17 22:00:00 | 89.96 |
| 2012-12-17 23:00:00 | 89.7 |
| 2012-12-18 | 90.22 |
| 2012-12-18 01:00:00 | 89.96 |
| 2012-12-18 02:00:00 | 89.96 |
| 2012-12-18 03:00:00 | 89.96 |
| 2012-12-18 04:00:00 | 89.96 |
| 2012-12-18 05:00:00 | 89.96 |
| 2012-12-18 06:00:00 | 89.7 |
| 2012-12-18 07:00:00 | 89.44 |
| 2012-12-18 08:00:00 | 88.92 |
| 2012-12-18 09:00:00 | 88.66 |
| 2012-12-18 10:00:00 | 88.66 |
| 2012-12-18 11:00:00 | 88.66 |
| 2012-12-18 12:00:00 | 88.66 |
| 2012-12-18 13:00:00 | 88.66 |
| 2012-12-18 14:00:00 | 88.66 |
| 2012-12-18 15:00:00 | 88.66 |
| 2012-12-18 16:00:00 | 88.66 |
| 2012-12-18 17:00:00 | 89.44 |
| 2012-12-18 18:00:00 | 89.44 |
| 2012-12-18 19:00:00 | 89.7 |
| 2012-12-18 20:00:00 | 89.96 |
| 2012-12-18 21:00:00 | 89.7 |
| 2012-12-18 22:00:00 | 89.96 |
| 2012-12-18 23:00:00 | 89.96 |
| 2012-12-19 | 90.22 |
| 2012-12-19 01:00:00 | 89.96 |
| 2012-12-19 02:00:00 | 89.96 |
| 2012-12-19 03:00:00 | 90.22 |
| 2012-12-19 04:00:00 | 89.96 |
| 2012-12-19 05:00:00 | 89.7 |
| 2012-12-19 06:00:00 | 89.96 |
| 2012-12-19 07:00:00 | 89.44 |
| 2012-12-19 08:00:00 | 89.18 |
| 2012-12-19 09:00:00 | 88.66 |
| 2012-12-19 10:00:00 | 88.66 |
| 2012-12-19 11:00:00 | 88.66 |
| 2012-12-19 12:00:00 | 88.92 |
| 2012-12-19 13:00:00 | 88.66 |
| 2012-12-19 14:00:00 | 88.92 |
| 2012-12-19 15:00:00 | 88.66 |
| 2012-12-19 16:00:00 | 88.92 |
| 2012-12-19 17:00:00 | 89.44 |
| 2012-12-19 18:00:00 | 89.7 |
| 2012-12-19 19:00:00 | 89.7 |
| 2012-12-19 20:00:00 | 89.7 |
| 2012-12-19 21:00:00 | 89.96 |
| 2012-12-19 22:00:00 | 89.96 |
| 2012-12-19 23:00:00 | 89.96 |
| 2012-12-20 | 89.96 |
| 2012-12-20 01:00:00 | 89.96 |
| 2012-12-20 02:00:00 | 89.96 |
| 2012-12-20 03:00:00 | 89.96 |
| 2012-12-20 04:00:00 | 89.96 |
| 2012-12-20 05:00:00 | 89.7 |
| 2012-12-20 06:00:00 | 89.96 |
| 2012-12-20 07:00:00 | 89.44 |
| 2012-12-20 08:00:00 | 88.92 |
| 2012-12-20 09:00:00 | 88.66 |
| 2012-12-20 10:00:00 | 88.66 |
| 2012-12-20 11:00:00 | 88.66 |
| 2012-12-20 12:00:00 | 88.66 |
| 2012-12-20 13:00:00 | 88.66 |
| 2012-12-20 14:00:00 | 88.66 |
| 2012-12-20 15:00:00 | 88.66 |
| 2012-12-20 16:00:00 | 88.4 |
| 2012-12-20 17:00:00 | 89.44 |
| 2012-12-20 18:00:00 | 89.44 |
| 2012-12-20 19:00:00 | 89.7 |
| 2012-12-20 20:00:00 | 89.7 |
| 2012-12-20 21:00:00 | 89.7 |
| 2012-12-20 22:00:00 | 89.7 |
| 2012-12-20 23:00:00 | 89.96 |
| 2012-12-21 | 89.96 |
| 2012-12-21 01:00:00 | 89.96 |
| 2012-12-21 02:00:00 | 89.96 |
| 2012-12-21 03:00:00 | 89.96 |
| 2012-12-21 04:00:00 | 89.96 |
| 2012-12-21 05:00:00 | 89.7 |
| 2012-12-21 06:00:00 | 89.96 |
| 2012-12-21 07:00:00 | 89.44 |
| 2012-12-21 08:00:00 | 89.18 |
| 2012-12-21 09:00:00 | 88.66 |
| 2012-12-21 10:00:00 | 88.4 |
| 2012-12-21 11:00:00 | 88.92 |
| 2012-12-21 12:00:00 | 88.4 |
| 2012-12-21 13:00:00 | 88.92 |
| 2012-12-21 14:00:00 | 88.66 |
| 2012-12-21 15:00:00 | 88.92 |
| 2012-12-21 16:00:00 | 88.66 |
| 2012-12-21 17:00:00 | 89.44 |
| 2012-12-21 18:00:00 | 89.7 |
| 2012-12-21 19:00:00 | 89.7 |
| 2012-12-21 20:00:00 | 89.7 |
| 2012-12-21 21:00:00 | 89.96 |
| 2012-12-21 22:00:00 | 89.7 |
| 2012-12-21 23:00:00 | 89.96 |
| 2012-12-22 | 89.96 |
| 2012-12-22 01:00:00 | 89.96 |
| 2012-12-22 02:00:00 | 89.96 |
| 2012-12-22 03:00:00 | 89.96 |
| 2012-12-22 04:00:00 | 89.96 |
| 2012-12-22 05:00:00 | 89.96 |
| 2012-12-22 06:00:00 | 89.7 |
| 2012-12-22 07:00:00 | 89.7 |
| 2012-12-22 08:00:00 | 89.44 |
| 2012-12-22 09:00:00 | 88.66 |
| 2012-12-22 10:00:00 | 88.4 |
| 2012-12-22 11:00:00 | 88.66 |
| 2012-12-22 12:00:00 | 88.66 |
| 2012-12-22 13:00:00 | 88.66 |
| 2012-12-22 14:00:00 | 88.66 |
| 2012-12-22 15:00:00 | 88.66 |
| 2012-12-22 16:00:00 | 88.66 |
| 2012-12-22 17:00:00 | 89.44 |
| 2012-12-22 18:00:00 | 89.44 |
| 2012-12-22 19:00:00 | 89.7 |
| 2012-12-22 20:00:00 | 89.7 |
| 2012-12-22 21:00:00 | 89.7 |
| 2012-12-22 22:00:00 | 89.7 |
| 2012-12-22 23:00:00 | 89.7 |
| 2012-12-23 | 89.96 |
| 2012-12-23 01:00:00 | 89.96 |
| 2012-12-23 02:00:00 | 89.96 |
| 2012-12-23 03:00:00 | 89.96 |
| 2012-12-23 04:00:00 | 89.96 |
| 2012-12-23 05:00:00 | 89.96 |
| 2012-12-23 06:00:00 | 89.7 |
| 2012-12-23 07:00:00 | 89.96 |
| 2012-12-23 08:00:00 | 89.18 |
| 2012-12-23 09:00:00 | 88.66 |
| 2012-12-23 10:00:00 | 88.66 |
| 2012-12-23 11:00:00 | 88.66 |
| 2012-12-23 12:00:00 | 88.66 |
| 2012-12-23 13:00:00 | 88.66 |
| 2012-12-23 14:00:00 | 88.66 |
| 2012-12-23 15:00:00 | 88.66 |
| 2012-12-23 16:00:00 | 88.4 |
| 2012-12-23 17:00:00 | 89.44 |
| 2012-12-23 18:00:00 | 89.44 |
| 2012-12-23 19:00:00 | 89.44 |
| 2012-12-23 20:00:00 | 89.7 |
| 2012-12-23 21:00:00 | 89.7 |
| 2012-12-23 22:00:00 | 89.7 |
| 2012-12-23 23:00:00 | 89.7 |
| 2012-12-24 | 89.96 |
| 2012-12-24 01:00:00 | 89.96 |
| 2012-12-24 02:00:00 | 89.7 |
| 2012-12-24 03:00:00 | 89.96 |
| 2012-12-24 04:00:00 | 89.96 |
| 2012-12-24 05:00:00 | 89.96 |
| 2012-12-24 06:00:00 | 89.7 |
| 2012-12-24 07:00:00 | 89.96 |
| 2012-12-24 08:00:00 | 89.44 |
| 2012-12-24 09:00:00 | 88.66 |
| 2012-12-24 10:00:00 | 88.92 |
| 2012-12-24 11:00:00 | 88.66 |
| 2012-12-24 12:00:00 | 88.92 |
| 2012-12-24 13:00:00 | 88.92 |
| 2012-12-24 14:00:00 | 88.92 |
| 2012-12-24 15:00:00 | 88.92 |
| 2012-12-24 16:00:00 | 88.92 |
| 2012-12-24 17:00:00 | 89.18 |
| 2012-12-24 18:00:00 | 89.96 |
| 2012-12-24 19:00:00 | 89.96 |
| 2012-12-24 20:00:00 | 90.22 |
| 2012-12-24 21:00:00 | 89.96 |
| 2012-12-24 22:00:00 | 89.96 |
| 2012-12-24 23:00:00 | 89.96 |
| 2012-12-25 | 89.7 |
| 2012-12-25 01:00:00 | 89.96 |
| 2012-12-25 02:00:00 | 89.96 |
| 2012-12-25 03:00:00 | 89.96 |
| 2012-12-25 04:00:00 | 89.96 |
| 2012-12-25 05:00:00 | 89.96 |
| 2012-12-25 06:00:00 | 89.96 |
| 2012-12-25 07:00:00 | 89.7 |
| 2012-12-25 08:00:00 | 89.44 |
| 2012-12-25 09:00:00 | 89.18 |
| 2012-12-25 10:00:00 | 88.66 |
| 2012-12-25 11:00:00 | 88.92 |
| 2012-12-25 12:00:00 | 88.92 |
| 2012-12-25 13:00:00 | 88.92 |
| 2012-12-25 14:00:00 | 88.92 |
| 2012-12-25 15:00:00 | 88.92 |
| 2012-12-25 16:00:00 | 88.92 |
| 2012-12-25 17:00:00 | 89.44 |
| 2012-12-25 18:00:00 | 89.7 |
| 2012-12-25 19:00:00 | 89.7 |
| 2012-12-25 20:00:00 | 89.7 |
| 2012-12-25 21:00:00 | 89.7 |
| 2012-12-25 22:00:00 | 89.7 |
| 2012-12-25 23:00:00 | 89.7 |
| 2012-12-26 | 89.96 |
| 2012-12-26 01:00:00 | 89.96 |
| 2012-12-26 02:00:00 | 89.7 |
| 2012-12-26 03:00:00 | 90.22 |
| 2012-12-26 04:00:00 | 89.7 |
| 2012-12-26 05:00:00 | 89.96 |
| 2012-12-26 06:00:00 | 89.7 |
| 2012-12-26 07:00:00 | 89.96 |
| 2012-12-26 08:00:00 | 89.44 |
| 2012-12-26 09:00:00 | 88.92 |
| 2012-12-26 10:00:00 | 88.66 |
| 2012-12-26 11:00:00 | 88.92 |
| 2012-12-26 12:00:00 | 88.66 |
| 2012-12-26 13:00:00 | 88.92 |
| 2012-12-26 14:00:00 | 88.92 |
| 2012-12-26 15:00:00 | 88.66 |
| 2012-12-26 16:00:00 | 88.92 |
| 2012-12-26 17:00:00 | 89.44 |
| 2012-12-26 18:00:00 | 89.44 |
| 2012-12-26 19:00:00 | 89.7 |
| 2012-12-26 20:00:00 | 89.7 |
| 2012-12-26 21:00:00 | 89.7 |
| 2012-12-26 22:00:00 | 89.7 |
| 2012-12-26 23:00:00 | 89.7 |
| 2012-12-27 | 89.96 |
| 2012-12-27 01:00:00 | 89.96 |
| 2012-12-27 02:00:00 | 89.96 |
| 2012-12-27 03:00:00 | 89.96 |
| 2012-12-27 04:00:00 | 89.96 |
| 2012-12-27 05:00:00 | 89.7 |
| 2012-12-27 06:00:00 | 89.96 |
| 2012-12-27 07:00:00 | 89.44 |
| 2012-12-27 08:00:00 | 89.18 |
| 2012-12-27 09:00:00 | 88.66 |
| 2012-12-27 10:00:00 | 88.4 |
| 2012-12-27 11:00:00 | 88.66 |
| 2012-12-27 12:00:00 | 88.66 |
| 2012-12-27 13:00:00 | 88.66 |
| 2012-12-27 14:00:00 | 88.4 |
| 2012-12-27 15:00:00 | 88.92 |
| 2012-12-27 16:00:00 | 88.66 |
| 2012-12-27 17:00:00 | 89.44 |
| 2012-12-27 18:00:00 | 89.44 |
| 2012-12-27 19:00:00 | 89.7 |
| 2012-12-27 20:00:00 | 89.44 |
| 2012-12-27 21:00:00 | 89.7 |
| 2012-12-27 22:00:00 | 89.96 |
| 2012-12-27 23:00:00 | 89.7 |
| 2012-12-28 | 89.96 |
| 2012-12-28 01:00:00 | 89.96 |
| 2012-12-28 02:00:00 | 89.96 |
| 2012-12-28 03:00:00 | 89.96 |
| 2012-12-28 04:00:00 | 89.96 |
| 2012-12-28 05:00:00 | 89.7 |
| 2012-12-28 06:00:00 | 89.96 |
| 2012-12-28 07:00:00 | 89.7 |
| 2012-12-28 08:00:00 | 89.18 |
| 2012-12-28 09:00:00 | 88.66 |
| 2012-12-28 10:00:00 | 88.66 |
| 2012-12-28 11:00:00 | 88.66 |
| 2012-12-28 12:00:00 | 88.4 |
| 2012-12-28 13:00:00 | 88.66 |
| 2012-12-28 14:00:00 | 88.66 |
| 2012-12-28 15:00:00 | 88.66 |
| 2012-12-28 16:00:00 | 88.66 |
| 2012-12-28 17:00:00 | 89.18 |
| 2012-12-28 18:00:00 | 89.44 |
| 2012-12-28 19:00:00 | 89.44 |
| 2012-12-28 20:00:00 | 89.44 |
| 2012-12-28 21:00:00 | 89.7 |
| 2012-12-28 22:00:00 | 89.7 |
| 2012-12-28 23:00:00 | 89.96 |
| 2012-12-29 | 89.7 |
| 2012-12-29 01:00:00 | 89.96 |
| 2012-12-29 02:00:00 | 89.96 |
| 2012-12-29 03:00:00 | 89.7 |
| 2012-12-29 04:00:00 | 89.96 |
| 2012-12-29 05:00:00 | 89.96 |
| 2012-12-29 06:00:00 | 89.96 |
| 2012-12-29 07:00:00 | 89.7 |
| 2012-12-29 08:00:00 | 88.92 |
| 2012-12-29 09:00:00 | 88.92 |
| 2012-12-29 10:00:00 | 88.66 |
| 2012-12-29 11:00:00 | 88.66 |
| 2012-12-29 12:00:00 | 88.66 |
| 2012-12-29 13:00:00 | 88.66 |
| 2012-12-29 14:00:00 | 88.92 |
| 2012-12-29 15:00:00 | 88.66 |
| 2012-12-29 16:00:00 | 88.66 |
| 2012-12-29 17:00:00 | 89.18 |
| 2012-12-29 18:00:00 | 89.44 |
| 2012-12-29 19:00:00 | 89.44 |
| 2012-12-29 20:00:00 | 89.7 |
| 2012-12-29 21:00:00 | 89.44 |
| 2012-12-29 22:00:00 | 89.7 |
| 2012-12-29 23:00:00 | 89.96 |
| 2012-12-30 | 89.7 |
| 2012-12-30 01:00:00 | 89.96 |
| 2012-12-30 02:00:00 | 89.7 |
| 2012-12-30 03:00:00 | 89.96 |
| 2012-12-30 04:00:00 | 89.96 |
| 2012-12-30 05:00:00 | 89.7 |
| 2012-12-30 06:00:00 | 89.96 |
| 2012-12-30 07:00:00 | 89.7 |
| 2012-12-30 08:00:00 | 88.92 |
| 2012-12-30 09:00:00 | 88.92 |
| 2012-12-30 10:00:00 | 88.66 |
| 2012-12-30 11:00:00 | 88.66 |
| 2012-12-30 12:00:00 | 88.66 |
| 2012-12-30 13:00:00 | 88.66 |
| 2012-12-30 14:00:00 | 88.66 |
| 2012-12-30 15:00:00 | 88.66 |
| 2012-12-30 16:00:00 | 88.66 |
| 2012-12-30 17:00:00 | 89.18 |
| 2012-12-30 18:00:00 | 89.44 |
| 2012-12-30 19:00:00 | 89.44 |
| 2012-12-30 20:00:00 | 89.44 |
| 2012-12-30 21:00:00 | 89.7 |
| 2012-12-30 22:00:00 | 89.44 |
| 2012-12-30 23:00:00 | 89.7 |
| 2012-12-31 | 89.7 |
| 2012-12-31 | 89.7 |
| 2012-12-31 | 89.7 |
| 2012-12-31 | 89.96 |
| 2012-12-31 | 89.7 |
| 2012-12-31 | 89.7 |
| 2012-12-31 | 89.7 |
| 2012-12-31 | 89.7 |
| 2012-12-31 | 88.92 |
| 2012-12-31 | 88.92 |
| 2012-12-31 | 88.66 |
| 2012-12-31 | 88.66 |
| 2012-12-31 | 88.66 |
| 2012-12-31 | 88.92 |
| 2012-12-31 | 88.66 |
| 2012-12-31 | 88.92 |
| 2012-12-31 | 88.66 |
| 2012-12-31 | 89.44 |
| 2012-12-31 | 89.44 |
| 2012-12-31 | 89.7 |
| 2012-12-31 | 89.96 |
| 2012-12-31 | 89.7 |
| 2012-12-31 | 89.96 |
| 2012-12-31 | 89.7 |
| 2013-01-01 | 89.96 |